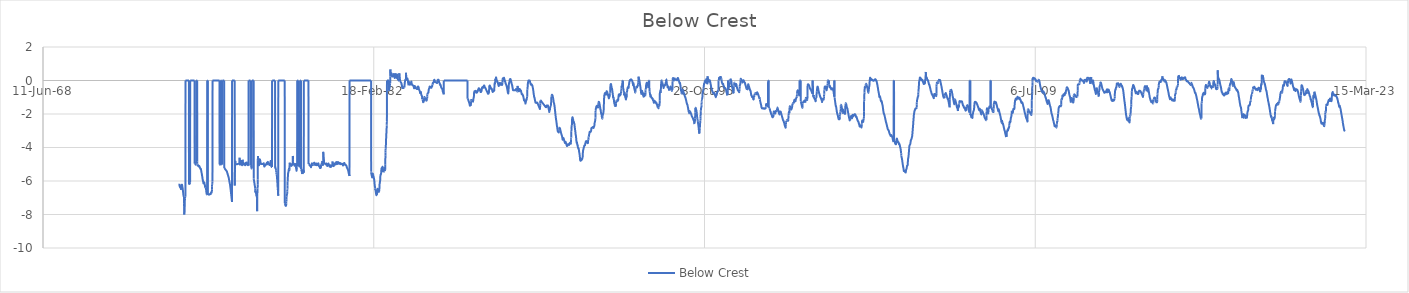
| Category | Below Crest  |
|---|---|
| 27061.0 | -6.164 |
| 27062.0 | -6.194 |
| 27063.0 | -6.225 |
| 27064.0 | -6.255 |
| 27065.0 | -6.286 |
| 27066.0 | -6.309 |
| 27067.0 | -6.32 |
| 27068.0 | -6.331 |
| 27069.0 | -6.342 |
| 27070.0 | -6.353 |
| 27071.0 | -6.363 |
| 27072.0 | -6.374 |
| 27073.0 | -6.383 |
| 27074.0 | -6.363 |
| 27075.0 | -6.334 |
| 27076.0 | -6.311 |
| 27077.0 | -6.324 |
| 27078.0 | -6.342 |
| 27079.0 | -6.361 |
| 27080.0 | -6.379 |
| 27081.0 | -6.398 |
| 27082.0 | -6.416 |
| 27083.0 | -6.435 |
| 27084.0 | -6.453 |
| 27085.0 | -6.472 |
| 27086.0 | -6.491 |
| 27087.0 | -6.521 |
| 27088.0 | -6.469 |
| 27089.0 | -6.413 |
| 27090.0 | -6.357 |
| 27091.0 | -6.302 |
| 27092.0 | -6.25 |
| 27093.0 | -6.237 |
| 27094.0 | -6.234 |
| 27095.0 | -6.231 |
| 27096.0 | -6.229 |
| 27097.0 | -6.226 |
| 27098.0 | -6.223 |
| 27099.0 | -6.22 |
| 27100.0 | -6.218 |
| 27101.0 | -6.218 |
| 27102.0 | -6.238 |
| 27103.0 | -6.261 |
| 27104.0 | -6.284 |
| 27105.0 | -6.306 |
| 27106.0 | -6.329 |
| 27107.0 | -6.352 |
| 27108.0 | -6.375 |
| 27109.0 | -6.398 |
| 27110.0 | -6.421 |
| 27111.0 | -6.444 |
| 27112.0 | -6.472 |
| 27113.0 | -6.506 |
| 27114.0 | -6.541 |
| 27115.0 | -6.575 |
| 27116.0 | -6.609 |
| 27117.0 | -6.644 |
| 27118.0 | -6.678 |
| 27119.0 | -6.712 |
| 27120.0 | -6.747 |
| 27121.0 | -6.782 |
| 27122.0 | -6.817 |
| 27123.0 | -6.852 |
| 27124.0 | -6.882 |
| 27125.0 | -6.893 |
| 27126.0 | -6.9 |
| 27127.0 | -6.907 |
| 27128.0 | -6.928 |
| 27129.0 | -6.935 |
| 27130.0 | -6.935 |
| 27131.0 | -6.935 |
| 27132.0 | -7.075 |
| 27133.0 | -7.355 |
| 27134.0 | -7.635 |
| 27135.0 | -7.915 |
| 27136.0 | -8.006 |
| 27137.0 | -7.909 |
| 27138.0 | -7.811 |
| 27139.0 | -7.714 |
| 27140.0 | -7.616 |
| 27141.0 | -7.518 |
| 27142.0 | -7.421 |
| 27143.0 | -7.323 |
| 27144.0 | -7.226 |
| 27145.0 | -7.128 |
| 27146.0 | -7.05 |
| 27147.0 | -7.02 |
| 27148.0 | -6.992 |
| 27149.0 | -6.967 |
| 27150.0 | -6.957 |
| 27151.0 | -6.949 |
| 27152.0 | -6.941 |
| 27153.0 | -6.934 |
| 27154.0 | 0 |
| 27155.0 | 0 |
| 27156.0 | 0 |
| 27157.0 | 0 |
| 27158.0 | 0 |
| 27159.0 | 0 |
| 27160.0 | 0 |
| 27161.0 | 0 |
| 27162.0 | 0 |
| 27163.0 | 0 |
| 27164.0 | 0 |
| 27165.0 | 0 |
| 27166.0 | 0 |
| 27167.0 | 0 |
| 27168.0 | 0 |
| 27169.0 | 0 |
| 27170.0 | 0 |
| 27171.0 | 0 |
| 27172.0 | 0 |
| 27173.0 | 0 |
| 27174.0 | 0 |
| 27175.0 | 0 |
| 27176.0 | 0 |
| 27177.0 | 0 |
| 27178.0 | 0 |
| 27179.0 | 0 |
| 27180.0 | 0 |
| 27181.0 | 0 |
| 27182.0 | 0 |
| 27183.0 | 0 |
| 27184.0 | 0 |
| 27185.0 | 0 |
| 27186.0 | 0 |
| 27187.0 | 0 |
| 27188.0 | 0 |
| 27189.0 | 0 |
| 27190.0 | 0 |
| 27191.0 | 0 |
| 27192.0 | 0 |
| 27193.0 | 0 |
| 27194.0 | 0 |
| 27195.0 | 0 |
| 27196.0 | 0 |
| 27197.0 | 0 |
| 27198.0 | 0 |
| 27199.0 | 0 |
| 27200.0 | 0 |
| 27201.0 | 0 |
| 27202.0 | 0 |
| 27203.0 | 0 |
| 27204.0 | 0 |
| 27205.0 | 0 |
| 27206.0 | 0 |
| 27207.0 | -6.215 |
| 27208.0 | -6.209 |
| 27209.0 | -6.204 |
| 27210.0 | -6.198 |
| 27211.0 | -6.193 |
| 27212.0 | -6.187 |
| 27213.0 | -6.182 |
| 27214.0 | -6.176 |
| 27215.0 | -6.17 |
| 27216.0 | -6.165 |
| 27217.0 | -6.159 |
| 27218.0 | -6.154 |
| 27219.0 | -6.148 |
| 27220.0 | -6.142 |
| 27221.0 | -6.137 |
| 27222.0 | -6.131 |
| 27223.0 | -6.122 |
| 27224.0 | -6.069 |
| 27225.0 | 0 |
| 27226.0 | 0 |
| 27227.0 | 0 |
| 27228.0 | 0 |
| 27229.0 | 0 |
| 27230.0 | 0 |
| 27231.0 | 0 |
| 27232.0 | 0 |
| 27233.0 | 0 |
| 27234.0 | 0 |
| 27235.0 | 0 |
| 27236.0 | 0 |
| 27237.0 | 0 |
| 27238.0 | 0 |
| 27239.0 | 0 |
| 27240.0 | 0 |
| 27241.0 | 0 |
| 27242.0 | 0 |
| 27243.0 | 0 |
| 27244.0 | 0 |
| 27245.0 | 0 |
| 27246.0 | 0 |
| 27247.0 | 0 |
| 27248.0 | 0 |
| 27249.0 | 0 |
| 27250.0 | 0 |
| 27251.0 | 0 |
| 27252.0 | 0 |
| 27253.0 | 0 |
| 27254.0 | 0 |
| 27255.0 | 0 |
| 27256.0 | 0 |
| 27257.0 | 0 |
| 27258.0 | 0 |
| 27259.0 | 0 |
| 27260.0 | 0 |
| 27261.0 | 0 |
| 27262.0 | 0 |
| 27263.0 | 0 |
| 27264.0 | 0 |
| 27265.0 | 0 |
| 27266.0 | 0 |
| 27267.0 | 0 |
| 27268.0 | 0 |
| 27269.0 | 0 |
| 27270.0 | 0 |
| 27271.0 | 0 |
| 27272.0 | 0 |
| 27273.0 | 0 |
| 27274.0 | 0 |
| 27275.0 | 0 |
| 27276.0 | 0 |
| 27277.0 | 0 |
| 27278.0 | 0 |
| 27279.0 | 0 |
| 27280.0 | 0 |
| 27281.0 | 0 |
| 27282.0 | 0 |
| 27283.0 | 0 |
| 27284.0 | 0 |
| 27285.0 | 0 |
| 27286.0 | 0 |
| 27287.0 | 0 |
| 27288.0 | 0 |
| 27289.0 | 0 |
| 27290.0 | 0 |
| 27291.0 | 0 |
| 27292.0 | -4.96 |
| 27293.0 | -4.951 |
| 27294.0 | -4.941 |
| 27295.0 | -4.932 |
| 27296.0 | -4.923 |
| 27297.0 | -4.918 |
| 27298.0 | -4.929 |
| 27299.0 | -4.941 |
| 27300.0 | -4.952 |
| 27301.0 | -4.964 |
| 27302.0 | -4.976 |
| 27303.0 | -4.988 |
| 27304.0 | -4.999 |
| 27305.0 | -5.011 |
| 27306.0 | -5.022 |
| 27307.0 | -5.006 |
| 27308.0 | -4.973 |
| 27309.0 | -4.941 |
| 27310.0 | -4.927 |
| 27311.0 | -4.931 |
| 27312.0 | -4.935 |
| 27313.0 | -4.939 |
| 27314.0 | -4.943 |
| 27315.0 | -4.947 |
| 27316.0 | -4.951 |
| 27317.0 | 0 |
| 27318.0 | 0 |
| 27319.0 | 0 |
| 27320.0 | 0 |
| 27321.0 | 0 |
| 27322.0 | 0 |
| 27323.0 | 0 |
| 27324.0 | 0 |
| 27325.0 | 0 |
| 27326.0 | 0 |
| 27327.0 | 0 |
| 27328.0 | 0 |
| 27329.0 | 0 |
| 27330.0 | 0 |
| 27331.0 | 0 |
| 27332.0 | -4.835 |
| 27333.0 | -4.947 |
| 27334.0 | -5.009 |
| 27335.0 | -5.042 |
| 27336.0 | -5.071 |
| 27337.0 | -5.074 |
| 27338.0 | -5.073 |
| 27339.0 | -5.073 |
| 27340.0 | -5.072 |
| 27341.0 | -5.071 |
| 27342.0 | -5.07 |
| 27343.0 | -5.07 |
| 27344.0 | -5.069 |
| 27345.0 | -5.068 |
| 27346.0 | -5.067 |
| 27347.0 | -5.067 |
| 27348.0 | -5.066 |
| 27349.0 | -5.066 |
| 27350.0 | -5.078 |
| 27351.0 | -5.094 |
| 27352.0 | -5.111 |
| 27353.0 | -5.126 |
| 27354.0 | -5.127 |
| 27355.0 | -5.125 |
| 27356.0 | -5.122 |
| 27357.0 | -5.12 |
| 27358.0 | -5.118 |
| 27359.0 | -5.115 |
| 27360.0 | -5.113 |
| 27361.0 | -5.111 |
| 27362.0 | -5.109 |
| 27363.0 | -5.106 |
| 27364.0 | -5.115 |
| 27365.0 | -5.136 |
| 27366.0 | -5.157 |
| 27367.0 | -5.178 |
| 27368.0 | -5.189 |
| 27369.0 | -5.189 |
| 27370.0 | -5.19 |
| 27371.0 | -5.19 |
| 27372.0 | -5.197 |
| 27373.0 | -5.209 |
| 27374.0 | -5.221 |
| 27375.0 | -5.233 |
| 27376.0 | -5.244 |
| 27377.0 | -5.254 |
| 27378.0 | -5.264 |
| 27379.0 | -5.275 |
| 27380.0 | -5.282 |
| 27381.0 | -5.27 |
| 27382.0 | -5.258 |
| 27383.0 | -5.261 |
| 27384.0 | -5.267 |
| 27385.0 | -5.273 |
| 27386.0 | -5.279 |
| 27387.0 | -5.286 |
| 27388.0 | -5.305 |
| 27389.0 | -5.327 |
| 27390.0 | -5.348 |
| 27391.0 | -5.37 |
| 27392.0 | -5.392 |
| 27393.0 | -5.414 |
| 27394.0 | -5.435 |
| 27395.0 | -5.457 |
| 27396.0 | -5.479 |
| 27397.0 | -5.501 |
| 27398.0 | -5.522 |
| 27399.0 | -5.544 |
| 27400.0 | -5.566 |
| 27401.0 | -5.588 |
| 27402.0 | -5.609 |
| 27403.0 | -5.631 |
| 27404.0 | -5.653 |
| 27405.0 | -5.678 |
| 27406.0 | -5.704 |
| 27407.0 | -5.729 |
| 27408.0 | -5.754 |
| 27409.0 | -5.78 |
| 27410.0 | -5.805 |
| 27411.0 | -5.83 |
| 27412.0 | -5.855 |
| 27413.0 | -5.881 |
| 27414.0 | -5.906 |
| 27415.0 | -5.931 |
| 27416.0 | -5.953 |
| 27417.0 | -5.969 |
| 27418.0 | -5.986 |
| 27419.0 | -6.003 |
| 27420.0 | -6.02 |
| 27421.0 | -6.036 |
| 27422.0 | -6.053 |
| 27423.0 | -6.07 |
| 27424.0 | -6.087 |
| 27425.0 | -6.101 |
| 27426.0 | -6.113 |
| 27427.0 | -6.125 |
| 27428.0 | -6.137 |
| 27429.0 | -6.153 |
| 27430.0 | -6.188 |
| 27431.0 | -6.161 |
| 27432.0 | -6.123 |
| 27433.0 | -6.09 |
| 27434.0 | -6.085 |
| 27435.0 | -6.085 |
| 27436.0 | -6.085 |
| 27437.0 | -6.085 |
| 27438.0 | -6.085 |
| 27439.0 | -6.088 |
| 27440.0 | -6.107 |
| 27441.0 | -6.129 |
| 27442.0 | -6.151 |
| 27443.0 | -6.174 |
| 27444.0 | -6.196 |
| 27445.0 | -6.218 |
| 27446.0 | -6.24 |
| 27447.0 | -6.262 |
| 27448.0 | -6.284 |
| 27449.0 | -6.306 |
| 27450.0 | -6.329 |
| 27451.0 | -6.351 |
| 27452.0 | -6.373 |
| 27453.0 | -6.385 |
| 27454.0 | -6.342 |
| 27455.0 | -6.335 |
| 27456.0 | -6.335 |
| 27457.0 | -6.335 |
| 27458.0 | -6.355 |
| 27459.0 | -6.404 |
| 27460.0 | -6.418 |
| 27461.0 | -6.431 |
| 27462.0 | -6.444 |
| 27463.0 | -6.457 |
| 27464.0 | -6.472 |
| 27465.0 | -6.502 |
| 27466.0 | -6.536 |
| 27467.0 | -6.571 |
| 27468.0 | -6.605 |
| 27469.0 | -6.64 |
| 27470.0 | -6.674 |
| 27471.0 | -6.698 |
| 27472.0 | -6.718 |
| 27473.0 | -6.738 |
| 27474.0 | -6.758 |
| 27475.0 | -6.778 |
| 27476.0 | -6.797 |
| 27477.0 | -6.789 |
| 27478.0 | -6.771 |
| 27479.0 | -6.762 |
| 27480.0 | -6.777 |
| 27481.0 | -6.793 |
| 27482.0 | 0 |
| 27483.0 | 0 |
| 27484.0 | 0 |
| 27485.0 | 0 |
| 27486.0 | 0 |
| 27487.0 | 0 |
| 27488.0 | 0 |
| 27489.0 | 0 |
| 27490.0 | 0 |
| 27491.0 | 0 |
| 27492.0 | 0 |
| 27493.0 | -6.842 |
| 27494.0 | -6.837 |
| 27495.0 | -6.833 |
| 27496.0 | -6.829 |
| 27497.0 | -6.825 |
| 27498.0 | -6.821 |
| 27499.0 | -6.817 |
| 27500.0 | -6.813 |
| 27501.0 | -6.809 |
| 27502.0 | -6.806 |
| 27503.0 | -6.806 |
| 27504.0 | -6.807 |
| 27505.0 | -6.808 |
| 27506.0 | -6.809 |
| 27507.0 | -6.81 |
| 27508.0 | -6.811 |
| 27509.0 | -6.812 |
| 27510.0 | -6.813 |
| 27511.0 | -6.814 |
| 27512.0 | -6.815 |
| 27513.0 | -6.813 |
| 27514.0 | -6.811 |
| 27515.0 | -6.809 |
| 27516.0 | -6.807 |
| 27517.0 | -6.805 |
| 27518.0 | -6.804 |
| 27519.0 | -6.802 |
| 27520.0 | -6.8 |
| 27521.0 | -6.798 |
| 27522.0 | -6.796 |
| 27523.0 | -6.792 |
| 27524.0 | -6.787 |
| 27525.0 | -6.782 |
| 27526.0 | -6.777 |
| 27527.0 | -6.771 |
| 27528.0 | -6.766 |
| 27529.0 | -6.761 |
| 27530.0 | -6.756 |
| 27531.0 | -6.75 |
| 27532.0 | -6.745 |
| 27533.0 | -6.743 |
| 27534.0 | -6.758 |
| 27535.0 | -6.776 |
| 27536.0 | -6.776 |
| 27537.0 | -6.757 |
| 27538.0 | -6.739 |
| 27539.0 | -6.72 |
| 27540.0 | -6.702 |
| 27541.0 | -6.686 |
| 27542.0 | -6.685 |
| 27543.0 | -6.686 |
| 27544.0 | -6.688 |
| 27545.0 | -6.689 |
| 27546.0 | -6.691 |
| 27547.0 | -6.693 |
| 27548.0 | -6.694 |
| 27549.0 | -6.683 |
| 27550.0 | -6.659 |
| 27551.0 | -6.636 |
| 27552.0 | -6.612 |
| 27553.0 | -6.588 |
| 27554.0 | -6.565 |
| 27555.0 | -6.502 |
| 27556.0 | -6.314 |
| 27557.0 | -6.2 |
| 27558.0 | -6.17 |
| 27559.0 | -6.14 |
| 27560.0 | -6.11 |
| 27561.0 | -6.075 |
| 27562.0 | -6.035 |
| 27563.0 | 0 |
| 27564.0 | 0 |
| 27565.0 | 0 |
| 27566.0 | 0 |
| 27567.0 | 0 |
| 27568.0 | 0 |
| 27569.0 | 0 |
| 27570.0 | 0 |
| 27571.0 | 0 |
| 27572.0 | 0 |
| 27573.0 | 0 |
| 27574.0 | 0 |
| 27575.0 | 0 |
| 27576.0 | 0 |
| 27577.0 | 0 |
| 27578.0 | 0 |
| 27579.0 | 0 |
| 27580.0 | 0 |
| 27581.0 | 0 |
| 27582.0 | 0 |
| 27583.0 | 0 |
| 27584.0 | 0 |
| 27585.0 | 0 |
| 27586.0 | 0 |
| 27587.0 | 0 |
| 27588.0 | 0 |
| 27589.0 | 0 |
| 27590.0 | 0 |
| 27591.0 | 0 |
| 27592.0 | 0 |
| 27593.0 | 0 |
| 27594.0 | 0 |
| 27595.0 | 0 |
| 27596.0 | 0 |
| 27597.0 | 0 |
| 27598.0 | 0 |
| 27599.0 | 0 |
| 27600.0 | 0 |
| 27601.0 | 0 |
| 27602.0 | 0 |
| 27603.0 | 0 |
| 27604.0 | 0 |
| 27605.0 | 0 |
| 27606.0 | 0 |
| 27607.0 | 0 |
| 27608.0 | 0 |
| 27609.0 | 0 |
| 27610.0 | 0 |
| 27611.0 | 0 |
| 27612.0 | 0 |
| 27613.0 | 0 |
| 27614.0 | 0 |
| 27615.0 | 0 |
| 27616.0 | 0 |
| 27617.0 | 0 |
| 27618.0 | 0 |
| 27619.0 | 0 |
| 27620.0 | 0 |
| 27621.0 | 0 |
| 27622.0 | 0 |
| 27623.0 | 0 |
| 27624.0 | 0 |
| 27625.0 | 0 |
| 27626.0 | 0 |
| 27627.0 | 0 |
| 27628.0 | 0 |
| 27629.0 | 0 |
| 27630.0 | 0 |
| 27631.0 | 0 |
| 27632.0 | 0 |
| 27633.0 | 0 |
| 27634.0 | 0 |
| 27635.0 | 0 |
| 27636.0 | 0 |
| 27637.0 | 0 |
| 27638.0 | 0 |
| 27639.0 | 0 |
| 27640.0 | 0 |
| 27641.0 | 0 |
| 27642.0 | 0 |
| 27643.0 | 0 |
| 27644.0 | 0 |
| 27645.0 | 0 |
| 27646.0 | 0 |
| 27647.0 | 0 |
| 27648.0 | 0 |
| 27649.0 | 0 |
| 27650.0 | 0 |
| 27651.0 | 0 |
| 27652.0 | 0 |
| 27653.0 | 0 |
| 27654.0 | 0 |
| 27655.0 | 0 |
| 27656.0 | 0 |
| 27657.0 | 0 |
| 27658.0 | 0 |
| 27659.0 | 0 |
| 27660.0 | 0 |
| 27661.0 | 0 |
| 27662.0 | 0 |
| 27663.0 | 0 |
| 27664.0 | 0 |
| 27665.0 | 0 |
| 27666.0 | 0 |
| 27667.0 | 0 |
| 27668.0 | 0 |
| 27669.0 | -4.984 |
| 27670.0 | -4.998 |
| 27671.0 | -5.011 |
| 27672.0 | -5.016 |
| 27673.0 | -5.017 |
| 27674.0 | -5.018 |
| 27675.0 | -5.018 |
| 27676.0 | -5.019 |
| 27677.0 | -5.02 |
| 27678.0 | -5.021 |
| 27679.0 | -5.022 |
| 27680.0 | -5.023 |
| 27681.0 | -5.024 |
| 27682.0 | -5.027 |
| 27683.0 | -5.043 |
| 27684.0 | -5.062 |
| 27685.0 | 0 |
| 27686.0 | 0 |
| 27687.0 | 0 |
| 27688.0 | 0 |
| 27689.0 | 0 |
| 27690.0 | 0 |
| 27691.0 | 0 |
| 27692.0 | 0 |
| 27693.0 | 0 |
| 27694.0 | 0 |
| 27695.0 | 0 |
| 27696.0 | 0 |
| 27697.0 | 0 |
| 27698.0 | 0 |
| 27699.0 | -4.996 |
| 27700.0 | -4.997 |
| 27701.0 | -4.998 |
| 27702.0 | -4.999 |
| 27703.0 | -5 |
| 27704.0 | -5 |
| 27705.0 | -5.001 |
| 27706.0 | -5.002 |
| 27707.0 | -5.003 |
| 27708.0 | -5.004 |
| 27709.0 | -5.005 |
| 27710.0 | -5.008 |
| 27711.0 | -5.012 |
| 27712.0 | 0 |
| 27713.0 | 0 |
| 27714.0 | 0 |
| 27715.0 | 0 |
| 27716.0 | 0 |
| 27717.0 | 0 |
| 27718.0 | 0 |
| 27719.0 | 0 |
| 27720.0 | 0 |
| 27721.0 | 0 |
| 27722.0 | 0 |
| 27723.0 | 0 |
| 27724.0 | 0 |
| 27725.0 | 0 |
| 27726.0 | 0 |
| 27727.0 | 0 |
| 27728.0 | 0 |
| 27729.0 | 0 |
| 27730.0 | 0 |
| 27731.0 | 0 |
| 27732.0 | 0 |
| 27733.0 | 0 |
| 27734.0 | 0 |
| 27735.0 | 0 |
| 27736.0 | 0 |
| 27737.0 | 0 |
| 27738.0 | 0 |
| 27739.0 | 0 |
| 27740.0 | -5.22 |
| 27741.0 | -5.225 |
| 27742.0 | -5.23 |
| 27743.0 | -5.236 |
| 27744.0 | -5.241 |
| 27745.0 | -5.246 |
| 27746.0 | -5.251 |
| 27747.0 | -5.257 |
| 27748.0 | -5.262 |
| 27749.0 | -5.267 |
| 27750.0 | -5.272 |
| 27751.0 | -5.278 |
| 27752.0 | -5.283 |
| 27753.0 | -5.288 |
| 27754.0 | -5.293 |
| 27755.0 | -5.299 |
| 27756.0 | -5.304 |
| 27757.0 | -5.309 |
| 27758.0 | -5.314 |
| 27759.0 | -5.32 |
| 27760.0 | -5.325 |
| 27761.0 | -5.33 |
| 27762.0 | -5.335 |
| 27763.0 | -5.341 |
| 27764.0 | -5.346 |
| 27765.0 | -5.351 |
| 27766.0 | -5.356 |
| 27767.0 | -5.362 |
| 27768.0 | -5.367 |
| 27769.0 | -5.372 |
| 27770.0 | -5.377 |
| 27771.0 | -5.383 |
| 27772.0 | -5.388 |
| 27773.0 | -5.393 |
| 27774.0 | -5.398 |
| 27775.0 | -5.404 |
| 27776.0 | -5.409 |
| 27777.0 | -5.414 |
| 27778.0 | -5.419 |
| 27779.0 | -5.425 |
| 27780.0 | -5.437 |
| 27781.0 | -5.45 |
| 27782.0 | -5.464 |
| 27783.0 | -5.477 |
| 27784.0 | -5.49 |
| 27785.0 | -5.503 |
| 27786.0 | -5.516 |
| 27787.0 | -5.529 |
| 27788.0 | -5.542 |
| 27789.0 | -5.555 |
| 27790.0 | -5.568 |
| 27791.0 | -5.582 |
| 27792.0 | -5.595 |
| 27793.0 | -5.608 |
| 27794.0 | -5.621 |
| 27795.0 | -5.634 |
| 27796.0 | -5.647 |
| 27797.0 | -5.66 |
| 27798.0 | -5.673 |
| 27799.0 | -5.687 |
| 27800.0 | -5.7 |
| 27801.0 | -5.713 |
| 27802.0 | -5.726 |
| 27803.0 | -5.739 |
| 27804.0 | -5.752 |
| 27805.0 | -5.765 |
| 27806.0 | -5.778 |
| 27807.0 | -5.792 |
| 27808.0 | -5.806 |
| 27809.0 | -5.828 |
| 27810.0 | -5.851 |
| 27811.0 | -5.875 |
| 27812.0 | -5.898 |
| 27813.0 | -5.921 |
| 27814.0 | -5.945 |
| 27815.0 | -5.966 |
| 27816.0 | -5.987 |
| 27817.0 | -6.009 |
| 27818.0 | -6.03 |
| 27819.0 | -6.051 |
| 27820.0 | -6.073 |
| 27821.0 | -6.094 |
| 27822.0 | -6.115 |
| 27823.0 | -6.136 |
| 27824.0 | -6.158 |
| 27825.0 | -6.179 |
| 27826.0 | -6.2 |
| 27827.0 | -6.222 |
| 27828.0 | -6.244 |
| 27829.0 | -6.273 |
| 27830.0 | -6.305 |
| 27831.0 | -6.336 |
| 27832.0 | -6.367 |
| 27833.0 | -6.399 |
| 27834.0 | -6.43 |
| 27835.0 | -6.461 |
| 27836.0 | -6.494 |
| 27837.0 | -6.529 |
| 27838.0 | -6.564 |
| 27839.0 | -6.6 |
| 27840.0 | -6.635 |
| 27841.0 | -6.67 |
| 27842.0 | -6.706 |
| 27843.0 | -6.741 |
| 27844.0 | -6.776 |
| 27845.0 | -6.812 |
| 27846.0 | -6.847 |
| 27847.0 | -6.882 |
| 27848.0 | -6.917 |
| 27849.0 | -6.953 |
| 27850.0 | -6.988 |
| 27851.0 | -7.023 |
| 27852.0 | -7.059 |
| 27853.0 | -7.094 |
| 27854.0 | -7.129 |
| 27855.0 | -7.165 |
| 27856.0 | -7.201 |
| 27857.0 | -7.247 |
| 27858.0 | 0 |
| 27859.0 | 0 |
| 27860.0 | 0 |
| 27861.0 | 0 |
| 27862.0 | 0 |
| 27863.0 | 0 |
| 27864.0 | 0 |
| 27865.0 | 0 |
| 27866.0 | 0 |
| 27867.0 | 0 |
| 27868.0 | 0 |
| 27869.0 | 0 |
| 27870.0 | 0 |
| 27871.0 | 0 |
| 27872.0 | 0 |
| 27873.0 | 0 |
| 27874.0 | 0 |
| 27875.0 | 0 |
| 27876.0 | 0 |
| 27877.0 | 0 |
| 27878.0 | 0 |
| 27879.0 | 0 |
| 27880.0 | 0 |
| 27881.0 | 0 |
| 27882.0 | 0 |
| 27883.0 | 0 |
| 27884.0 | 0 |
| 27885.0 | 0 |
| 27886.0 | 0 |
| 27887.0 | 0 |
| 27888.0 | 0 |
| 27889.0 | 0 |
| 27890.0 | 0 |
| 27891.0 | 0 |
| 27892.0 | 0 |
| 27893.0 | 0 |
| 27894.0 | 0 |
| 27895.0 | 0 |
| 27896.0 | 0 |
| 27897.0 | 0 |
| 27898.0 | 0 |
| 27899.0 | -6.265 |
| 27900.0 | -5.792 |
| 27901.0 | -5.331 |
| 27902.0 | -5.011 |
| 27903.0 | -4.928 |
| 27904.0 | -4.911 |
| 27905.0 | -4.894 |
| 27906.0 | -4.811 |
| 27907.0 | -4.791 |
| 27908.0 | -4.838 |
| 27909.0 | -4.886 |
| 27910.0 | -4.933 |
| 27911.0 | -4.965 |
| 27912.0 | -4.969 |
| 27913.0 | -4.971 |
| 27914.0 | -4.974 |
| 27915.0 | -4.977 |
| 27916.0 | -4.98 |
| 27917.0 | -4.982 |
| 27918.0 | -4.985 |
| 27919.0 | -4.988 |
| 27920.0 | -4.991 |
| 27921.0 | -4.993 |
| 27922.0 | -4.996 |
| 27923.0 | -4.999 |
| 27924.0 | -5.001 |
| 27925.0 | -5.004 |
| 27926.0 | -5.006 |
| 27927.0 | -5.006 |
| 27928.0 | -5.005 |
| 27929.0 | -5.003 |
| 27930.0 | -5.002 |
| 27931.0 | -5.001 |
| 27932.0 | -4.999 |
| 27933.0 | -4.998 |
| 27934.0 | -4.997 |
| 27935.0 | -4.996 |
| 27936.0 | -4.994 |
| 27937.0 | -4.993 |
| 27938.0 | -4.992 |
| 27939.0 | -4.991 |
| 27940.0 | -4.989 |
| 27941.0 | -4.988 |
| 27942.0 | -4.987 |
| 27943.0 | -4.986 |
| 27944.0 | -4.984 |
| 27945.0 | -4.983 |
| 27946.0 | -4.982 |
| 27947.0 | -4.98 |
| 27948.0 | -4.979 |
| 27949.0 | -4.978 |
| 27950.0 | -4.977 |
| 27951.0 | -4.975 |
| 27952.0 | -4.974 |
| 27953.0 | -4.973 |
| 27954.0 | -4.972 |
| 27955.0 | -4.97 |
| 27956.0 | -4.969 |
| 27957.0 | -4.968 |
| 27958.0 | -4.967 |
| 27959.0 | -4.965 |
| 27960.0 | -4.964 |
| 27961.0 | -4.963 |
| 27962.0 | -4.961 |
| 27963.0 | -4.96 |
| 27964.0 | -4.959 |
| 27965.0 | -4.958 |
| 27966.0 | -4.956 |
| 27967.0 | -4.954 |
| 27968.0 | -4.944 |
| 27969.0 | -4.931 |
| 27970.0 | -4.919 |
| 27971.0 | -4.872 |
| 27972.0 | -4.608 |
| 27973.0 | -4.651 |
| 27974.0 | -4.737 |
| 27975.0 | -4.799 |
| 27976.0 | -4.862 |
| 27977.0 | -4.924 |
| 27978.0 | -4.985 |
| 27979.0 | -5.019 |
| 27980.0 | -5.043 |
| 27981.0 | -5.063 |
| 27982.0 | -5.024 |
| 27983.0 | -4.963 |
| 27984.0 | -4.902 |
| 27985.0 | -4.841 |
| 27986.0 | -4.832 |
| 27987.0 | -4.791 |
| 27988.0 | -4.754 |
| 27989.0 | -4.813 |
| 27990.0 | -4.872 |
| 27991.0 | -4.931 |
| 27992.0 | -4.976 |
| 27993.0 | -4.976 |
| 27994.0 | -4.972 |
| 27995.0 | -4.968 |
| 27996.0 | -4.964 |
| 27997.0 | -4.961 |
| 27998.0 | -4.957 |
| 27999.0 | -4.781 |
| 28000.0 | -4.744 |
| 28001.0 | -4.788 |
| 28002.0 | -4.833 |
| 28003.0 | -4.877 |
| 28004.0 | -4.92 |
| 28005.0 | -4.95 |
| 28006.0 | -4.978 |
| 28007.0 | -5.005 |
| 28008.0 | -5.032 |
| 28009.0 | -5.053 |
| 28010.0 | -5.055 |
| 28011.0 | -5.055 |
| 28012.0 | -5.05 |
| 28013.0 | -5.031 |
| 28014.0 | -5.011 |
| 28015.0 | -4.991 |
| 28016.0 | -4.971 |
| 28017.0 | -4.902 |
| 28018.0 | -4.734 |
| 28019.0 | -4.754 |
| 28020.0 | -4.8 |
| 28021.0 | -4.847 |
| 28022.0 | -4.893 |
| 28023.0 | -4.94 |
| 28024.0 | -4.987 |
| 28025.0 | -5.01 |
| 28026.0 | -5.01 |
| 28027.0 | -5.01 |
| 28028.0 | -5.01 |
| 28029.0 | -5.009 |
| 28030.0 | -5.006 |
| 28031.0 | -5.003 |
| 28032.0 | -5 |
| 28033.0 | -4.997 |
| 28034.0 | -4.994 |
| 28035.0 | -4.992 |
| 28036.0 | -4.989 |
| 28037.0 | -4.986 |
| 28038.0 | -4.983 |
| 28039.0 | -4.98 |
| 28040.0 | -4.98 |
| 28041.0 | -4.98 |
| 28042.0 | -4.98 |
| 28043.0 | -4.98 |
| 28044.0 | -4.98 |
| 28045.0 | -4.98 |
| 28046.0 | -4.98 |
| 28047.0 | -4.98 |
| 28048.0 | -4.982 |
| 28049.0 | -4.995 |
| 28050.0 | -5.032 |
| 28051.0 | -5.039 |
| 28052.0 | -5.042 |
| 28053.0 | -5.046 |
| 28054.0 | -5.055 |
| 28055.0 | -5.055 |
| 28056.0 | -5.055 |
| 28057.0 | -5.055 |
| 28058.0 | -5.055 |
| 28059.0 | -5.035 |
| 28060.0 | -5.007 |
| 28061.0 | -4.954 |
| 28062.0 | -4.88 |
| 28063.0 | -4.889 |
| 28064.0 | -4.918 |
| 28065.0 | -4.949 |
| 28066.0 | -4.963 |
| 28067.0 | -4.963 |
| 28068.0 | -4.971 |
| 28069.0 | -4.983 |
| 28070.0 | -5.001 |
| 28071.0 | -4.992 |
| 28072.0 | -4.983 |
| 28073.0 | -4.974 |
| 28074.0 | -4.969 |
| 28075.0 | -4.964 |
| 28076.0 | -4.905 |
| 28077.0 | -4.851 |
| 28078.0 | -4.857 |
| 28079.0 | -4.883 |
| 28080.0 | -4.9 |
| 28081.0 | -4.919 |
| 28082.0 | -4.943 |
| 28083.0 | -4.955 |
| 28084.0 | -4.971 |
| 28085.0 | -4.983 |
| 28086.0 | -4.988 |
| 28087.0 | -4.994 |
| 28088.0 | -4.999 |
| 28089.0 | -5.005 |
| 28090.0 | -5.011 |
| 28091.0 | -5.016 |
| 28092.0 | -5.022 |
| 28093.0 | -5.027 |
| 28094.0 | -5.033 |
| 28095.0 | -5.039 |
| 28096.0 | -5.049 |
| 28097.0 | -5.084 |
| 28098.0 | -5.042 |
| 28099.0 | -5.033 |
| 28100.0 | -5.03 |
| 28101.0 | -5.028 |
| 28102.0 | -5.03 |
| 28103.0 | -5.056 |
| 28104.0 | -5.063 |
| 28105.0 | -5.07 |
| 28106.0 | -5.062 |
| 28107.0 | -5.082 |
| 28108.0 | 0 |
| 28109.0 | 0 |
| 28110.0 | 0 |
| 28111.0 | 0 |
| 28112.0 | 0 |
| 28113.0 | 0 |
| 28114.0 | 0 |
| 28115.0 | 0 |
| 28116.0 | 0 |
| 28117.0 | 0 |
| 28118.0 | 0 |
| 28119.0 | 0 |
| 28120.0 | 0 |
| 28121.0 | 0 |
| 28122.0 | 0 |
| 28123.0 | 0 |
| 28124.0 | 0 |
| 28125.0 | 0 |
| 28126.0 | 0 |
| 28127.0 | 0 |
| 28128.0 | 0 |
| 28129.0 | 0 |
| 28130.0 | 0 |
| 28131.0 | 0 |
| 28132.0 | 0 |
| 28133.0 | 0 |
| 28134.0 | 0 |
| 28135.0 | 0 |
| 28136.0 | 0 |
| 28137.0 | 0 |
| 28138.0 | -5.057 |
| 28139.0 | -5.045 |
| 28140.0 | -5.04 |
| 28141.0 | -5.023 |
| 28142.0 | -5.012 |
| 28143.0 | -5.04 |
| 28144.0 | -5.046 |
| 28145.0 | -5.05 |
| 28146.0 | -5.059 |
| 28147.0 | -5.09 |
| 28148.0 | -5.123 |
| 28149.0 | -5.142 |
| 28150.0 | -5.16 |
| 28151.0 | -5.177 |
| 28152.0 | -5.207 |
| 28153.0 | -5.245 |
| 28154.0 | -5.254 |
| 28155.0 | -5.245 |
| 28156.0 | -5.235 |
| 28157.0 | 0 |
| 28158.0 | 0 |
| 28159.0 | 0 |
| 28160.0 | 0 |
| 28161.0 | 0 |
| 28162.0 | 0 |
| 28163.0 | 0 |
| 28164.0 | 0 |
| 28165.0 | 0 |
| 28166.0 | 0 |
| 28167.0 | 0 |
| 28168.0 | 0 |
| 28169.0 | 0 |
| 28170.0 | 0 |
| 28171.0 | 0 |
| 28172.0 | 0 |
| 28173.0 | 0 |
| 28174.0 | 0 |
| 28175.0 | 0 |
| 28176.0 | 0 |
| 28177.0 | 0 |
| 28178.0 | 0 |
| 28179.0 | 0 |
| 28180.0 | 0 |
| 28181.0 | 0 |
| 28182.0 | 0 |
| 28183.0 | 0 |
| 28184.0 | 0 |
| 28185.0 | 0 |
| 28186.0 | -5.855 |
| 28187.0 | -5.887 |
| 28188.0 | -5.937 |
| 28189.0 | -5.969 |
| 28190.0 | -5.975 |
| 28191.0 | -5.997 |
| 28192.0 | -6.022 |
| 28193.0 | -6.045 |
| 28194.0 | -6.082 |
| 28195.0 | -6.105 |
| 28196.0 | -6.122 |
| 28197.0 | -6.149 |
| 28198.0 | -6.158 |
| 28199.0 | -6.208 |
| 28200.0 | -6.229 |
| 28201.0 | -6.247 |
| 28202.0 | -6.273 |
| 28203.0 | -6.304 |
| 28204.0 | -6.326 |
| 28205.0 | -6.346 |
| 28206.0 | -6.373 |
| 28207.0 | -6.402 |
| 28208.0 | -6.426 |
| 28209.0 | -6.454 |
| 28210.0 | -6.579 |
| 28211.0 | -6.673 |
| 28212.0 | -6.684 |
| 28213.0 | -6.575 |
| 28214.0 | -6.575 |
| 28215.0 | -6.617 |
| 28216.0 | -6.632 |
| 28217.0 | -6.652 |
| 28218.0 | -6.674 |
| 28219.0 | -6.697 |
| 28220.0 | -6.722 |
| 28221.0 | -6.741 |
| 28222.0 | -6.757 |
| 28223.0 | -6.806 |
| 28224.0 | -6.841 |
| 28225.0 | -6.855 |
| 28226.0 | -6.879 |
| 28227.0 | -6.867 |
| 28228.0 | -6.865 |
| 28229.0 | -6.865 |
| 28230.0 | -6.865 |
| 28231.0 | -6.867 |
| 28232.0 | -6.908 |
| 28233.0 | -6.961 |
| 28234.0 | -7.012 |
| 28235.0 | -7.055 |
| 28236.0 | -7.312 |
| 28237.0 | -7.788 |
| 28238.0 | -7.802 |
| 28239.0 | -7.355 |
| 28240.0 | -6.908 |
| 28241.0 | -6.654 |
| 28242.0 | -6.591 |
| 28243.0 | -6.528 |
| 28244.0 | -6.452 |
| 28245.0 | -6.298 |
| 28246.0 | -6.19 |
| 28247.0 | -5.915 |
| 28248.0 | -4.778 |
| 28249.0 | -4.504 |
| 28250.0 | -4.581 |
| 28251.0 | -4.694 |
| 28252.0 | -4.754 |
| 28253.0 | -4.813 |
| 28254.0 | -4.86 |
| 28255.0 | -4.902 |
| 28256.0 | -4.923 |
| 28257.0 | -4.94 |
| 28258.0 | -4.957 |
| 28259.0 | -4.974 |
| 28260.0 | -4.991 |
| 28261.0 | -5.008 |
| 28262.0 | -5.025 |
| 28263.0 | -5.042 |
| 28264.0 | -5.06 |
| 28265.0 | -5.066 |
| 28266.0 | -5.029 |
| 28267.0 | -4.988 |
| 28268.0 | -4.946 |
| 28269.0 | -4.899 |
| 28270.0 | -4.719 |
| 28271.0 | -4.662 |
| 28272.0 | -4.715 |
| 28273.0 | -4.753 |
| 28274.0 | -4.755 |
| 28275.0 | -4.711 |
| 28276.0 | -4.692 |
| 28277.0 | -4.743 |
| 28278.0 | -4.793 |
| 28279.0 | -4.842 |
| 28280.0 | -4.889 |
| 28281.0 | -4.857 |
| 28282.0 | -4.813 |
| 28283.0 | -4.789 |
| 28284.0 | -4.772 |
| 28285.0 | -4.797 |
| 28286.0 | -4.829 |
| 28287.0 | -4.861 |
| 28288.0 | -4.893 |
| 28289.0 | -4.926 |
| 28290.0 | -4.958 |
| 28291.0 | -4.976 |
| 28292.0 | -4.977 |
| 28293.0 | -4.979 |
| 28294.0 | -4.98 |
| 28295.0 | -4.982 |
| 28296.0 | -4.983 |
| 28297.0 | -4.985 |
| 28298.0 | -4.984 |
| 28299.0 | -4.983 |
| 28300.0 | -4.982 |
| 28301.0 | -4.981 |
| 28302.0 | -4.98 |
| 28303.0 | -4.979 |
| 28304.0 | -4.978 |
| 28305.0 | -4.977 |
| 28306.0 | -4.976 |
| 28307.0 | -4.976 |
| 28308.0 | -4.978 |
| 28309.0 | -4.98 |
| 28310.0 | -4.982 |
| 28311.0 | -4.984 |
| 28312.0 | -4.985 |
| 28313.0 | -4.985 |
| 28314.0 | -4.985 |
| 28315.0 | -4.985 |
| 28316.0 | -4.985 |
| 28317.0 | -4.985 |
| 28318.0 | -4.984 |
| 28319.0 | -4.982 |
| 28320.0 | -4.98 |
| 28321.0 | -4.978 |
| 28322.0 | -4.976 |
| 28323.0 | -4.976 |
| 28324.0 | -4.977 |
| 28325.0 | -4.978 |
| 28326.0 | -4.979 |
| 28327.0 | -4.98 |
| 28328.0 | -4.981 |
| 28329.0 | -4.982 |
| 28330.0 | -4.983 |
| 28331.0 | -4.984 |
| 28332.0 | -4.983 |
| 28333.0 | -4.975 |
| 28334.0 | -4.965 |
| 28335.0 | -4.956 |
| 28336.0 | -4.946 |
| 28337.0 | -4.939 |
| 28338.0 | -4.959 |
| 28339.0 | -4.986 |
| 28340.0 | -5.013 |
| 28341.0 | -5.04 |
| 28342.0 | -5.067 |
| 28343.0 | -5.094 |
| 28344.0 | -5.121 |
| 28345.0 | -5.135 |
| 28346.0 | -5.135 |
| 28347.0 | -5.135 |
| 28348.0 | -5.135 |
| 28349.0 | -5.13 |
| 28350.0 | -5.095 |
| 28351.0 | -5.055 |
| 28352.0 | -5.035 |
| 28353.0 | -5.035 |
| 28354.0 | -5.035 |
| 28355.0 | -5.035 |
| 28356.0 | -5.037 |
| 28357.0 | -5.042 |
| 28358.0 | -5.046 |
| 28359.0 | -5.051 |
| 28360.0 | -5.055 |
| 28361.0 | -5.06 |
| 28362.0 | -5.063 |
| 28363.0 | -5.062 |
| 28364.0 | -5.048 |
| 28365.0 | -5.034 |
| 28366.0 | -5.019 |
| 28367.0 | -5.007 |
| 28368.0 | -5.005 |
| 28369.0 | -5.005 |
| 28370.0 | -5.005 |
| 28371.0 | -5.005 |
| 28372.0 | -5.005 |
| 28373.0 | -5.005 |
| 28374.0 | -5.005 |
| 28375.0 | -5.005 |
| 28376.0 | -5.005 |
| 28377.0 | -5.005 |
| 28378.0 | -5.005 |
| 28379.0 | -5.005 |
| 28380.0 | -5.005 |
| 28381.0 | -5 |
| 28382.0 | -4.971 |
| 28383.0 | -4.939 |
| 28384.0 | -4.912 |
| 28385.0 | -4.917 |
| 28386.0 | -4.93 |
| 28387.0 | -4.943 |
| 28388.0 | -4.956 |
| 28389.0 | -4.969 |
| 28390.0 | -4.982 |
| 28391.0 | -4.995 |
| 28392.0 | -4.993 |
| 28393.0 | -4.955 |
| 28394.0 | -4.915 |
| 28395.0 | -4.881 |
| 28396.0 | -4.884 |
| 28397.0 | -4.892 |
| 28398.0 | -4.877 |
| 28399.0 | -4.859 |
| 28400.0 | -4.866 |
| 28401.0 | -4.877 |
| 28402.0 | -4.889 |
| 28403.0 | -4.9 |
| 28404.0 | -4.912 |
| 28405.0 | -4.923 |
| 28406.0 | -4.935 |
| 28407.0 | -4.946 |
| 28408.0 | -4.954 |
| 28409.0 | -4.952 |
| 28410.0 | -4.949 |
| 28411.0 | -4.946 |
| 28412.0 | -4.944 |
| 28413.0 | -4.941 |
| 28414.0 | -4.938 |
| 28415.0 | -4.937 |
| 28416.0 | -4.96 |
| 28417.0 | -4.982 |
| 28418.0 | -4.997 |
| 28419.0 | -5.011 |
| 28420.0 | -5.026 |
| 28421.0 | -5.036 |
| 28422.0 | -5.04 |
| 28423.0 | -5.043 |
| 28424.0 | -5.008 |
| 28425.0 | -4.942 |
| 28426.0 | -4.924 |
| 28427.0 | -4.953 |
| 28428.0 | -4.955 |
| 28429.0 | -4.955 |
| 28430.0 | -4.955 |
| 28431.0 | -4.955 |
| 28432.0 | -4.955 |
| 28433.0 | -4.955 |
| 28434.0 | -4.945 |
| 28435.0 | -4.925 |
| 28436.0 | -4.905 |
| 28437.0 | -4.885 |
| 28438.0 | -4.865 |
| 28439.0 | -4.845 |
| 28440.0 | -4.825 |
| 28441.0 | -4.807 |
| 28442.0 | -4.805 |
| 28443.0 | -4.807 |
| 28444.0 | -4.834 |
| 28445.0 | -4.877 |
| 28446.0 | -4.935 |
| 28447.0 | -4.993 |
| 28448.0 | -5.052 |
| 28449.0 | -5.105 |
| 28450.0 | -5.115 |
| 28451.0 | -5.115 |
| 28452.0 | -5.115 |
| 28453.0 | -5.115 |
| 28454.0 | -5.115 |
| 28455.0 | -5.116 |
| 28456.0 | -5.13 |
| 28457.0 | -5.146 |
| 28458.0 | -5.161 |
| 28459.0 | -5.165 |
| 28460.0 | -5.165 |
| 28461.0 | -5.165 |
| 28462.0 | -5.165 |
| 28463.0 | 0 |
| 28464.0 | 0 |
| 28465.0 | 0 |
| 28466.0 | 0 |
| 28467.0 | 0 |
| 28468.0 | 0 |
| 28469.0 | 0 |
| 28470.0 | 0 |
| 28471.0 | 0 |
| 28472.0 | 0 |
| 28473.0 | 0 |
| 28474.0 | 0 |
| 28475.0 | 0 |
| 28476.0 | 0 |
| 28477.0 | 0 |
| 28478.0 | 0 |
| 28479.0 | 0 |
| 28480.0 | 0 |
| 28481.0 | 0 |
| 28482.0 | 0 |
| 28483.0 | 0 |
| 28484.0 | 0 |
| 28485.0 | 0 |
| 28486.0 | 0 |
| 28487.0 | 0 |
| 28488.0 | 0 |
| 28489.0 | 0 |
| 28490.0 | 0 |
| 28491.0 | 0 |
| 28492.0 | 0 |
| 28493.0 | 0 |
| 28494.0 | 0 |
| 28495.0 | 0 |
| 28496.0 | 0 |
| 28497.0 | 0 |
| 28498.0 | 0 |
| 28499.0 | 0 |
| 28500.0 | 0 |
| 28501.0 | 0 |
| 28502.0 | 0 |
| 28503.0 | 0 |
| 28504.0 | 0 |
| 28505.0 | 0 |
| 28506.0 | 0 |
| 28507.0 | 0 |
| 28508.0 | 0 |
| 28509.0 | -5.176 |
| 28510.0 | -5.153 |
| 28511.0 | -5.164 |
| 28512.0 | -5.176 |
| 28513.0 | -5.225 |
| 28514.0 | -5.218 |
| 28515.0 | -5.246 |
| 28516.0 | -5.264 |
| 28517.0 | -5.252 |
| 28518.0 | -5.256 |
| 28519.0 | -5.272 |
| 28520.0 | -5.272 |
| 28521.0 | -5.315 |
| 28522.0 | -5.34 |
| 28523.0 | -5.37 |
| 28524.0 | -5.391 |
| 28525.0 | -5.375 |
| 28526.0 | -5.405 |
| 28527.0 | -5.396 |
| 28528.0 | -5.445 |
| 28529.0 | -5.477 |
| 28530.0 | -5.57 |
| 28531.0 | -5.553 |
| 28532.0 | -5.596 |
| 28533.0 | -5.632 |
| 28534.0 | -5.666 |
| 28535.0 | -5.687 |
| 28536.0 | -5.743 |
| 28537.0 | -5.79 |
| 28538.0 | -5.818 |
| 28539.0 | -5.863 |
| 28540.0 | -5.927 |
| 28541.0 | -5.994 |
| 28542.0 | -6.048 |
| 28543.0 | -6.097 |
| 28544.0 | -6.167 |
| 28545.0 | -6.233 |
| 28546.0 | -6.289 |
| 28547.0 | -6.35 |
| 28548.0 | -6.374 |
| 28549.0 | -6.451 |
| 28550.0 | -6.494 |
| 28551.0 | -6.563 |
| 28552.0 | -6.62 |
| 28553.0 | -6.674 |
| 28554.0 | -6.737 |
| 28555.0 | -6.809 |
| 28556.0 | -6.881 |
| 28557.0 | 0 |
| 28558.0 | 0 |
| 28559.0 | 0 |
| 28560.0 | 0 |
| 28561.0 | 0 |
| 28562.0 | 0 |
| 28563.0 | 0 |
| 28564.0 | 0 |
| 28565.0 | 0 |
| 28566.0 | 0 |
| 28567.0 | 0 |
| 28568.0 | 0 |
| 28569.0 | 0 |
| 28570.0 | 0 |
| 28571.0 | 0 |
| 28572.0 | 0 |
| 28573.0 | 0 |
| 28574.0 | 0 |
| 28575.0 | 0 |
| 28576.0 | 0 |
| 28577.0 | 0 |
| 28578.0 | 0 |
| 28579.0 | 0 |
| 28580.0 | 0 |
| 28581.0 | 0 |
| 28582.0 | 0 |
| 28583.0 | 0 |
| 28584.0 | 0 |
| 28585.0 | 0 |
| 28586.0 | 0 |
| 28587.0 | 0 |
| 28588.0 | 0 |
| 28589.0 | 0 |
| 28590.0 | 0 |
| 28591.0 | 0 |
| 28592.0 | 0 |
| 28593.0 | 0 |
| 28594.0 | 0 |
| 28595.0 | 0 |
| 28596.0 | 0 |
| 28597.0 | 0 |
| 28598.0 | 0 |
| 28599.0 | 0 |
| 28600.0 | 0 |
| 28601.0 | 0 |
| 28602.0 | 0 |
| 28603.0 | 0 |
| 28604.0 | 0 |
| 28605.0 | 0 |
| 28606.0 | 0 |
| 28607.0 | 0 |
| 28608.0 | 0 |
| 28609.0 | 0 |
| 28610.0 | 0 |
| 28611.0 | 0 |
| 28612.0 | 0 |
| 28613.0 | 0 |
| 28614.0 | 0 |
| 28615.0 | 0 |
| 28616.0 | 0 |
| 28617.0 | 0 |
| 28618.0 | 0 |
| 28619.0 | 0 |
| 28620.0 | 0 |
| 28621.0 | 0 |
| 28622.0 | 0 |
| 28623.0 | 0 |
| 28624.0 | 0 |
| 28625.0 | 0 |
| 28626.0 | 0 |
| 28627.0 | 0 |
| 28628.0 | 0 |
| 28629.0 | 0 |
| 28630.0 | 0 |
| 28631.0 | 0 |
| 28632.0 | 0 |
| 28633.0 | 0 |
| 28634.0 | 0 |
| 28635.0 | 0 |
| 28636.0 | 0 |
| 28637.0 | 0 |
| 28638.0 | 0 |
| 28639.0 | 0 |
| 28640.0 | 0 |
| 28641.0 | 0 |
| 28642.0 | 0 |
| 28643.0 | 0 |
| 28644.0 | 0 |
| 28645.0 | 0 |
| 28646.0 | 0 |
| 28647.0 | 0 |
| 28648.0 | 0 |
| 28649.0 | 0 |
| 28650.0 | 0 |
| 28651.0 | 0 |
| 28652.0 | 0 |
| 28653.0 | 0 |
| 28654.0 | 0 |
| 28655.0 | -7.316 |
| 28656.0 | -7.324 |
| 28657.0 | -7.348 |
| 28658.0 | -7.355 |
| 28659.0 | -7.38 |
| 28660.0 | -7.388 |
| 28661.0 | -7.396 |
| 28662.0 | -7.417 |
| 28663.0 | -7.444 |
| 28664.0 | -7.46 |
| 28665.0 | -7.459 |
| 28666.0 | -7.47 |
| 28667.0 | -7.478 |
| 28668.0 | -7.466 |
| 28669.0 | -7.473 |
| 28670.0 | -7.475 |
| 28671.0 | -7.47 |
| 28672.0 | -7.49 |
| 28673.0 | -7.47 |
| 28674.0 | -7.465 |
| 28675.0 | -7.465 |
| 28676.0 | -7.43 |
| 28677.0 | -7.339 |
| 28678.0 | -7.266 |
| 28679.0 | -7.224 |
| 28680.0 | -7.12 |
| 28681.0 | -7.03 |
| 28682.0 | -6.935 |
| 28683.0 | -6.936 |
| 28684.0 | -6.897 |
| 28685.0 | -6.86 |
| 28686.0 | -6.843 |
| 28687.0 | -6.803 |
| 28688.0 | -6.786 |
| 28689.0 | -6.793 |
| 28690.0 | -6.785 |
| 28691.0 | -6.764 |
| 28692.0 | -6.721 |
| 28693.0 | -6.62 |
| 28694.0 | -6.52 |
| 28695.0 | -6.482 |
| 28696.0 | -6.447 |
| 28697.0 | -6.251 |
| 28698.0 | -6.043 |
| 28699.0 | -5.942 |
| 28700.0 | -5.859 |
| 28701.0 | -5.804 |
| 28702.0 | -5.735 |
| 28703.0 | -5.645 |
| 28704.0 | -5.6 |
| 28705.0 | -5.566 |
| 28706.0 | -5.539 |
| 28707.0 | -5.522 |
| 28708.0 | -5.513 |
| 28709.0 | -5.481 |
| 28710.0 | -5.468 |
| 28711.0 | -5.443 |
| 28712.0 | -5.435 |
| 28713.0 | -5.39 |
| 28714.0 | -5.353 |
| 28715.0 | -5.336 |
| 28716.0 | -5.312 |
| 28717.0 | -5.283 |
| 28718.0 | -5.273 |
| 28719.0 | -5.276 |
| 28720.0 | -5.294 |
| 28721.0 | -5.305 |
| 28722.0 | -5.315 |
| 28723.0 | -5.331 |
| 28724.0 | -5.345 |
| 28725.0 | -5.351 |
| 28726.0 | -5.349 |
| 28727.0 | -5.314 |
| 28728.0 | -5.08 |
| 28729.0 | -4.911 |
| 28730.0 | -4.964 |
| 28731.0 | -4.98 |
| 28732.0 | -4.974 |
| 28733.0 | -4.976 |
| 28734.0 | -4.974 |
| 28735.0 | -4.983 |
| 28736.0 | -4.996 |
| 28737.0 | -5.006 |
| 28738.0 | -5.077 |
| 28739.0 | -5.122 |
| 28740.0 | -5.077 |
| 28741.0 | -5.058 |
| 28742.0 | -5.068 |
| 28743.0 | -5.046 |
| 28744.0 | -5.056 |
| 28745.0 | -5.054 |
| 28746.0 | -5.045 |
| 28747.0 | -5.034 |
| 28748.0 | -5.016 |
| 28749.0 | -5.008 |
| 28750.0 | -5.009 |
| 28751.0 | -5.011 |
| 28752.0 | -5.049 |
| 28753.0 | -5.059 |
| 28754.0 | -5.067 |
| 28755.0 | -5.048 |
| 28756.0 | -5.075 |
| 28757.0 | -5.084 |
| 28758.0 | -5.09 |
| 28759.0 | -5.078 |
| 28760.0 | -5.058 |
| 28761.0 | -5.041 |
| 28762.0 | -5.039 |
| 28763.0 | -5.025 |
| 28764.0 | -4.991 |
| 28765.0 | -5.009 |
| 28766.0 | -4.988 |
| 28767.0 | -5 |
| 28768.0 | -5.003 |
| 28769.0 | -5.008 |
| 28770.0 | -4.984 |
| 28771.0 | -5.035 |
| 28772.0 | -5.033 |
| 28773.0 | -5.009 |
| 28774.0 | -5.025 |
| 28775.0 | -5.037 |
| 28776.0 | -4.979 |
| 28777.0 | -4.505 |
| 28778.0 | -4.511 |
| 28779.0 | -4.724 |
| 28780.0 | -4.837 |
| 28781.0 | -4.905 |
| 28782.0 | -4.95 |
| 28783.0 | -4.979 |
| 28784.0 | -4.981 |
| 28785.0 | -4.95 |
| 28786.0 | -4.968 |
| 28787.0 | -4.967 |
| 28788.0 | -4.965 |
| 28789.0 | -4.971 |
| 28790.0 | -4.974 |
| 28791.0 | -4.977 |
| 28792.0 | -4.993 |
| 28793.0 | -4.997 |
| 28794.0 | -5.001 |
| 28795.0 | -5.004 |
| 28796.0 | -5.016 |
| 28797.0 | -5.012 |
| 28798.0 | -5.048 |
| 28799.0 | -5.056 |
| 28800.0 | -5.062 |
| 28801.0 | -5.068 |
| 28802.0 | -5.083 |
| 28803.0 | -5.086 |
| 28804.0 | -5.091 |
| 28805.0 | -5.092 |
| 28806.0 | -5.073 |
| 28807.0 | -5.088 |
| 28808.0 | -5.105 |
| 28809.0 | -5.052 |
| 28810.0 | -5.002 |
| 28811.0 | -4.98 |
| 28812.0 | -4.996 |
| 28813.0 | -5.004 |
| 28814.0 | -5.014 |
| 28815.0 | -5.047 |
| 28816.0 | -5.078 |
| 28817.0 | -5.081 |
| 28818.0 | -5.111 |
| 28819.0 | -5.141 |
| 28820.0 | -5.116 |
| 28821.0 | -5.139 |
| 28822.0 | -5.148 |
| 28823.0 | -5.16 |
| 28824.0 | -5.171 |
| 28825.0 | -5.197 |
| 28826.0 | -5.228 |
| 28827.0 | -5.222 |
| 28828.0 | -5.258 |
| 28829.0 | -5.267 |
| 28830.0 | -5.307 |
| 28831.0 | -5.344 |
| 28832.0 | -5.387 |
| 28833.0 | -5.387 |
| 28834.0 | -5.361 |
| 28835.0 | -5.312 |
| 28836.0 | -5.292 |
| 28837.0 | -5.181 |
| 28838.0 | -4.967 |
| 28839.0 | -4.931 |
| 28840.0 | -5.004 |
| 28841.0 | -5.069 |
| 28842.0 | -5.107 |
| 28843.0 | 0 |
| 28844.0 | 0 |
| 28845.0 | 0 |
| 28846.0 | 0 |
| 28847.0 | 0 |
| 28848.0 | 0 |
| 28849.0 | 0 |
| 28850.0 | 0 |
| 28851.0 | 0 |
| 28852.0 | 0 |
| 28853.0 | 0 |
| 28854.0 | 0 |
| 28855.0 | 0 |
| 28856.0 | 0 |
| 28857.0 | 0 |
| 28858.0 | 0 |
| 28859.0 | 0 |
| 28860.0 | -5.082 |
| 28861.0 | -5.03 |
| 28862.0 | -5.026 |
| 28863.0 | -5.087 |
| 28864.0 | -5.055 |
| 28865.0 | -5.063 |
| 28866.0 | -5.074 |
| 28867.0 | -5.076 |
| 28868.0 | -5.067 |
| 28869.0 | -5.081 |
| 28870.0 | -5.016 |
| 28871.0 | -5.051 |
| 28872.0 | -5.04 |
| 28873.0 | -5.075 |
| 28874.0 | -5.026 |
| 28875.0 | -5.045 |
| 28876.0 | -5.07 |
| 28877.0 | -5.115 |
| 28878.0 | -5.119 |
| 28879.0 | -5.165 |
| 28880.0 | -5.124 |
| 28881.0 | -5.11 |
| 28882.0 | -5.185 |
| 28883.0 | -5.186 |
| 28884.0 | -5.163 |
| 28885.0 | -5.118 |
| 28886.0 | 0 |
| 28887.0 | 0 |
| 28888.0 | 0 |
| 28889.0 | 0 |
| 28890.0 | 0 |
| 28891.0 | 0 |
| 28892.0 | 0 |
| 28893.0 | 0 |
| 28894.0 | 0 |
| 28895.0 | 0 |
| 28896.0 | 0 |
| 28897.0 | 0 |
| 28898.0 | 0 |
| 28899.0 | 0 |
| 28900.0 | 0 |
| 28901.0 | -5.268 |
| 28902.0 | -5.197 |
| 28903.0 | -5.248 |
| 28904.0 | -5.243 |
| 28905.0 | -5.298 |
| 28906.0 | -5.289 |
| 28907.0 | -5.33 |
| 28908.0 | -5.347 |
| 28909.0 | -5.338 |
| 28910.0 | -5.38 |
| 28911.0 | -5.382 |
| 28912.0 | -5.351 |
| 28913.0 | -5.467 |
| 28914.0 | -5.504 |
| 28915.0 | -5.53 |
| 28916.0 | -5.534 |
| 28917.0 | -5.528 |
| 28918.0 | -5.522 |
| 28919.0 | -5.505 |
| 28920.0 | -5.458 |
| 28921.0 | -5.53 |
| 28922.0 | -5.583 |
| 28923.0 | -5.556 |
| 28924.0 | -5.579 |
| 28925.0 | -5.526 |
| 28926.0 | -5.492 |
| 28927.0 | -5.47 |
| 28928.0 | -5.491 |
| 28929.0 | -5.42 |
| 28930.0 | -5.381 |
| 28931.0 | -5.417 |
| 28932.0 | -5.322 |
| 28933.0 | -5.364 |
| 28934.0 | -5.403 |
| 28935.0 | -5.342 |
| 28936.0 | -5.375 |
| 28937.0 | -5.475 |
| 28938.0 | -5.479 |
| 28939.0 | -5.473 |
| 28940.0 | -5.46 |
| 28941.0 | -5.469 |
| 28942.0 | -5.504 |
| 28943.0 | 0 |
| 28944.0 | 0 |
| 28945.0 | 0 |
| 28946.0 | 0 |
| 28947.0 | 0 |
| 28948.0 | 0 |
| 28949.0 | 0 |
| 28950.0 | 0 |
| 28951.0 | 0 |
| 28952.0 | 0 |
| 28953.0 | 0 |
| 28954.0 | 0 |
| 28955.0 | 0 |
| 28956.0 | 0 |
| 28957.0 | 0 |
| 28958.0 | 0 |
| 28959.0 | 0 |
| 28960.0 | 0 |
| 28961.0 | 0 |
| 28962.0 | 0 |
| 28963.0 | 0 |
| 28964.0 | 0 |
| 28965.0 | 0 |
| 28966.0 | 0 |
| 28967.0 | 0 |
| 28968.0 | 0 |
| 28969.0 | 0 |
| 28970.0 | 0 |
| 28971.0 | 0 |
| 28972.0 | 0 |
| 28973.0 | 0 |
| 28974.0 | 0 |
| 28975.0 | 0 |
| 28976.0 | 0 |
| 28977.0 | 0 |
| 28978.0 | 0 |
| 28979.0 | 0 |
| 28980.0 | 0 |
| 28981.0 | 0 |
| 28982.0 | 0 |
| 28983.0 | 0 |
| 28984.0 | 0 |
| 28985.0 | 0 |
| 28986.0 | 0 |
| 28987.0 | 0 |
| 28988.0 | 0 |
| 28989.0 | 0 |
| 28990.0 | 0 |
| 28991.0 | 0 |
| 28992.0 | 0 |
| 28993.0 | 0 |
| 28994.0 | 0 |
| 28995.0 | 0 |
| 28996.0 | 0 |
| 28997.0 | 0 |
| 28998.0 | 0 |
| 28999.0 | 0 |
| 29000.0 | 0 |
| 29001.0 | 0 |
| 29002.0 | 0 |
| 29003.0 | 0 |
| 29004.0 | 0 |
| 29005.0 | 0 |
| 29006.0 | 0 |
| 29007.0 | 0 |
| 29008.0 | 0 |
| 29009.0 | 0 |
| 29010.0 | 0 |
| 29011.0 | 0 |
| 29012.0 | 0 |
| 29013.0 | 0 |
| 29014.0 | -4.983 |
| 29015.0 | -4.99 |
| 29016.0 | -4.991 |
| 29017.0 | -4.991 |
| 29018.0 | -4.991 |
| 29019.0 | -4.991 |
| 29020.0 | -4.991 |
| 29021.0 | -4.99 |
| 29022.0 | -4.988 |
| 29023.0 | -4.999 |
| 29024.0 | -5.009 |
| 29025.0 | -5.02 |
| 29026.0 | -5.042 |
| 29027.0 | -5.045 |
| 29028.0 | -5.045 |
| 29029.0 | -5.045 |
| 29030.0 | -5.046 |
| 29031.0 | -5.054 |
| 29032.0 | -5.065 |
| 29033.0 | -5.068 |
| 29034.0 | -5.074 |
| 29035.0 | -5.075 |
| 29036.0 | -5.076 |
| 29037.0 | -5.082 |
| 29038.0 | -5.09 |
| 29039.0 | -5.097 |
| 29040.0 | -5.104 |
| 29041.0 | -5.105 |
| 29042.0 | -5.105 |
| 29043.0 | -5.105 |
| 29044.0 | -5.105 |
| 29045.0 | -5.105 |
| 29046.0 | -5.106 |
| 29047.0 | -5.113 |
| 29048.0 | -5.125 |
| 29049.0 | -5.127 |
| 29050.0 | -5.134 |
| 29051.0 | -5.173 |
| 29052.0 | -5.175 |
| 29053.0 | -5.146 |
| 29054.0 | -5.133 |
| 29055.0 | -5.106 |
| 29056.0 | -5.069 |
| 29057.0 | -5.063 |
| 29058.0 | -5.064 |
| 29059.0 | -5.071 |
| 29060.0 | -5.07 |
| 29061.0 | -5.054 |
| 29062.0 | -5.032 |
| 29063.0 | -4.984 |
| 29064.0 | -4.951 |
| 29065.0 | -4.946 |
| 29066.0 | -4.948 |
| 29067.0 | -4.962 |
| 29068.0 | -4.965 |
| 29069.0 | -4.972 |
| 29070.0 | -4.975 |
| 29071.0 | -4.99 |
| 29072.0 | -4.999 |
| 29073.0 | -5.002 |
| 29074.0 | -5.017 |
| 29075.0 | -5.027 |
| 29076.0 | -5.036 |
| 29077.0 | -5.044 |
| 29078.0 | -5.045 |
| 29079.0 | -5.045 |
| 29080.0 | -5.045 |
| 29081.0 | -5.042 |
| 29082.0 | -5.021 |
| 29083.0 | -5.017 |
| 29084.0 | -5.008 |
| 29085.0 | -4.993 |
| 29086.0 | -4.992 |
| 29087.0 | -5 |
| 29088.0 | -5.009 |
| 29089.0 | -5.018 |
| 29090.0 | -5.026 |
| 29091.0 | -5.018 |
| 29092.0 | -4.961 |
| 29093.0 | -4.931 |
| 29094.0 | -4.927 |
| 29095.0 | -4.921 |
| 29096.0 | -4.927 |
| 29097.0 | -4.928 |
| 29098.0 | -4.928 |
| 29099.0 | -4.927 |
| 29100.0 | -4.919 |
| 29101.0 | -4.91 |
| 29102.0 | -4.905 |
| 29103.0 | -4.928 |
| 29104.0 | -4.952 |
| 29105.0 | -4.958 |
| 29106.0 | -4.983 |
| 29107.0 | -5.015 |
| 29108.0 | -5.026 |
| 29109.0 | -5.028 |
| 29110.0 | -5.034 |
| 29111.0 | -5.027 |
| 29112.0 | -5.019 |
| 29113.0 | -5.019 |
| 29114.0 | -5.026 |
| 29115.0 | -5.028 |
| 29116.0 | -5.036 |
| 29117.0 | -5.043 |
| 29118.0 | -5.037 |
| 29119.0 | -5.036 |
| 29120.0 | -5.035 |
| 29121.0 | -5.028 |
| 29122.0 | -5.025 |
| 29123.0 | -5.01 |
| 29124.0 | -5.001 |
| 29125.0 | -5 |
| 29126.0 | -4.998 |
| 29127.0 | -4.981 |
| 29128.0 | -4.958 |
| 29129.0 | -4.955 |
| 29130.0 | -4.955 |
| 29131.0 | -4.955 |
| 29132.0 | -4.957 |
| 29133.0 | -4.973 |
| 29134.0 | -4.99 |
| 29135.0 | -5.001 |
| 29136.0 | -5.019 |
| 29137.0 | -5.043 |
| 29138.0 | -5.053 |
| 29139.0 | -5.054 |
| 29140.0 | -5.054 |
| 29141.0 | -5.054 |
| 29142.0 | -5.054 |
| 29143.0 | -5.054 |
| 29144.0 | -5.053 |
| 29145.0 | -5.046 |
| 29146.0 | -5.044 |
| 29147.0 | -5.037 |
| 29148.0 | -5.037 |
| 29149.0 | -5.044 |
| 29150.0 | -5.045 |
| 29151.0 | -5.039 |
| 29152.0 | -5.002 |
| 29153.0 | -4.976 |
| 29154.0 | -4.975 |
| 29155.0 | -4.99 |
| 29156.0 | -4.995 |
| 29157.0 | -4.974 |
| 29158.0 | -4.956 |
| 29159.0 | -4.948 |
| 29160.0 | -4.953 |
| 29161.0 | -4.947 |
| 29162.0 | -4.946 |
| 29163.0 | -4.947 |
| 29164.0 | -4.957 |
| 29165.0 | -4.983 |
| 29166.0 | -5.016 |
| 29167.0 | -5.035 |
| 29168.0 | -5.046 |
| 29169.0 | -5.062 |
| 29170.0 | -5.073 |
| 29171.0 | -5.09 |
| 29172.0 | -5.107 |
| 29173.0 | -5.117 |
| 29174.0 | -5.126 |
| 29175.0 | -5.134 |
| 29176.0 | -5.135 |
| 29177.0 | -5.135 |
| 29178.0 | -5.135 |
| 29179.0 | -5.135 |
| 29180.0 | -5.136 |
| 29181.0 | -5.144 |
| 29182.0 | -5.154 |
| 29183.0 | -5.17 |
| 29184.0 | -5.18 |
| 29185.0 | -5.189 |
| 29186.0 | -5.199 |
| 29187.0 | -5.215 |
| 29188.0 | -5.224 |
| 29189.0 | -5.225 |
| 29190.0 | -5.226 |
| 29191.0 | -5.228 |
| 29192.0 | -5.201 |
| 29193.0 | -5.19 |
| 29194.0 | -5.192 |
| 29195.0 | -5.208 |
| 29196.0 | -5.222 |
| 29197.0 | -5.217 |
| 29198.0 | -5.216 |
| 29199.0 | -5.214 |
| 29200.0 | -5.2 |
| 29201.0 | -5.176 |
| 29202.0 | -5.108 |
| 29203.0 | -5.051 |
| 29204.0 | -5.042 |
| 29205.0 | -5.021 |
| 29206.0 | -5.019 |
| 29207.0 | -5.027 |
| 29208.0 | -5.036 |
| 29209.0 | -5.044 |
| 29210.0 | -5.045 |
| 29211.0 | -5.045 |
| 29212.0 | -5.045 |
| 29213.0 | -5.045 |
| 29214.0 | -5.024 |
| 29215.0 | -4.914 |
| 29216.0 | -4.916 |
| 29217.0 | -4.921 |
| 29218.0 | -4.936 |
| 29219.0 | -4.945 |
| 29220.0 | -4.947 |
| 29221.0 | -4.957 |
| 29222.0 | -4.971 |
| 29223.0 | -4.81 |
| 29224.0 | -4.807 |
| 29225.0 | -4.883 |
| 29226.0 | -4.935 |
| 29227.0 | -4.956 |
| 29228.0 | -4.982 |
| 29229.0 | -5.009 |
| 29230.0 | -5.034 |
| 29231.0 | -5.044 |
| 29232.0 | -5.044 |
| 29233.0 | -5.036 |
| 29234.0 | -5.024 |
| 29235.0 | -4.986 |
| 29236.0 | -4.952 |
| 29237.0 | -4.258 |
| 29238.0 | -4.263 |
| 29239.0 | -4.436 |
| 29240.0 | -4.493 |
| 29241.0 | -4.532 |
| 29242.0 | -4.57 |
| 29243.0 | -4.608 |
| 29244.0 | -4.647 |
| 29245.0 | -4.685 |
| 29246.0 | -4.723 |
| 29247.0 | -4.761 |
| 29248.0 | -4.8 |
| 29249.0 | -4.838 |
| 29250.0 | -4.876 |
| 29251.0 | -4.915 |
| 29252.0 | -4.948 |
| 29253.0 | -4.955 |
| 29254.0 | -4.957 |
| 29255.0 | -4.959 |
| 29256.0 | -4.96 |
| 29257.0 | -4.962 |
| 29258.0 | -4.964 |
| 29259.0 | -4.966 |
| 29260.0 | -4.968 |
| 29261.0 | -4.97 |
| 29262.0 | -4.972 |
| 29263.0 | -4.973 |
| 29264.0 | -4.975 |
| 29265.0 | -4.977 |
| 29266.0 | -4.979 |
| 29267.0 | -4.981 |
| 29268.0 | -4.983 |
| 29269.0 | -4.985 |
| 29270.0 | -4.986 |
| 29271.0 | -4.988 |
| 29272.0 | -4.99 |
| 29273.0 | -4.992 |
| 29274.0 | -4.994 |
| 29275.0 | -4.996 |
| 29276.0 | -4.998 |
| 29277.0 | -4.999 |
| 29278.0 | -5.001 |
| 29279.0 | -5.003 |
| 29280.0 | -5.007 |
| 29281.0 | -5.024 |
| 29282.0 | -5.028 |
| 29283.0 | -4.987 |
| 29284.0 | -4.959 |
| 29285.0 | -4.957 |
| 29286.0 | -4.974 |
| 29287.0 | -4.986 |
| 29288.0 | -5.003 |
| 29289.0 | -5.009 |
| 29290.0 | -5.033 |
| 29291.0 | -5.045 |
| 29292.0 | -5.055 |
| 29293.0 | -5.064 |
| 29294.0 | -5.065 |
| 29295.0 | -5.066 |
| 29296.0 | -5.099 |
| 29297.0 | -5.101 |
| 29298.0 | -5.059 |
| 29299.0 | -5.045 |
| 29300.0 | -5.038 |
| 29301.0 | -5.045 |
| 29302.0 | -5.054 |
| 29303.0 | -5.055 |
| 29304.0 | -5.055 |
| 29305.0 | -5.055 |
| 29306.0 | -5.055 |
| 29307.0 | -5.055 |
| 29308.0 | -5.055 |
| 29309.0 | -5.055 |
| 29310.0 | -5.056 |
| 29311.0 | -5.065 |
| 29312.0 | -5.069 |
| 29313.0 | -5.038 |
| 29314.0 | -5.013 |
| 29315.0 | -4.977 |
| 29316.0 | -4.959 |
| 29317.0 | -4.966 |
| 29318.0 | -4.986 |
| 29319.0 | -5.013 |
| 29320.0 | -5.026 |
| 29321.0 | -5.044 |
| 29322.0 | -5.054 |
| 29323.0 | -5.055 |
| 29324.0 | -5.055 |
| 29325.0 | -5.055 |
| 29326.0 | -5.055 |
| 29327.0 | -5.055 |
| 29328.0 | -5.056 |
| 29329.0 | -5.064 |
| 29330.0 | -5.067 |
| 29331.0 | -5.085 |
| 29332.0 | -5.105 |
| 29333.0 | -5.124 |
| 29334.0 | -5.135 |
| 29335.0 | -5.144 |
| 29336.0 | -5.145 |
| 29337.0 | -5.145 |
| 29338.0 | -5.144 |
| 29339.0 | -5.135 |
| 29340.0 | -5.121 |
| 29341.0 | -5.086 |
| 29342.0 | -5.059 |
| 29343.0 | -5.057 |
| 29344.0 | -5.074 |
| 29345.0 | -5.086 |
| 29346.0 | -5.105 |
| 29347.0 | -5.124 |
| 29348.0 | -5.136 |
| 29349.0 | -5.153 |
| 29350.0 | -5.156 |
| 29351.0 | -5.164 |
| 29352.0 | -5.164 |
| 29353.0 | -5.156 |
| 29354.0 | -5.155 |
| 29355.0 | -5.153 |
| 29356.0 | -5.136 |
| 29357.0 | -5.126 |
| 29358.0 | -5.124 |
| 29359.0 | -5.114 |
| 29360.0 | -5.096 |
| 29361.0 | -5.085 |
| 29362.0 | -5.077 |
| 29363.0 | -5.085 |
| 29364.0 | -5.094 |
| 29365.0 | -5.094 |
| 29366.0 | -5.084 |
| 29367.0 | -5.067 |
| 29368.0 | -5.064 |
| 29369.0 | -5.055 |
| 29370.0 | -5.045 |
| 29371.0 | -5.036 |
| 29372.0 | -5.035 |
| 29373.0 | -5.034 |
| 29374.0 | -5.026 |
| 29375.0 | -5.024 |
| 29376.0 | -5.016 |
| 29377.0 | -4.845 |
| 29378.0 | -4.831 |
| 29379.0 | -4.956 |
| 29380.0 | -5.025 |
| 29381.0 | -5.079 |
| 29382.0 | -5.094 |
| 29383.0 | -5.094 |
| 29384.0 | -5.084 |
| 29385.0 | -5.065 |
| 29386.0 | -5.045 |
| 29387.0 | -5.026 |
| 29388.0 | -5.019 |
| 29389.0 | -5.035 |
| 29390.0 | -5.056 |
| 29391.0 | -5.081 |
| 29392.0 | -5.086 |
| 29393.0 | -5.096 |
| 29394.0 | -5.112 |
| 29395.0 | -5.112 |
| 29396.0 | -5.094 |
| 29397.0 | -5.066 |
| 29398.0 | -5.042 |
| 29399.0 | -5.003 |
| 29400.0 | -4.982 |
| 29401.0 | -4.979 |
| 29402.0 | -4.971 |
| 29403.0 | -4.969 |
| 29404.0 | -4.961 |
| 29405.0 | -4.96 |
| 29406.0 | -4.962 |
| 29407.0 | -4.979 |
| 29408.0 | -4.991 |
| 29409.0 | -5.004 |
| 29410.0 | -5.012 |
| 29411.0 | -5.028 |
| 29412.0 | -5.03 |
| 29413.0 | -5.029 |
| 29414.0 | -5.023 |
| 29415.0 | -5.003 |
| 29416.0 | -4.971 |
| 29417.0 | -4.948 |
| 29418.0 | -4.946 |
| 29419.0 | -4.954 |
| 29420.0 | -4.96 |
| 29421.0 | -4.965 |
| 29422.0 | -4.971 |
| 29423.0 | -4.981 |
| 29424.0 | -4.994 |
| 29425.0 | -5 |
| 29426.0 | -5.003 |
| 29427.0 | -4.994 |
| 29428.0 | -4.971 |
| 29429.0 | -4.896 |
| 29430.0 | -4.858 |
| 29431.0 | -4.88 |
| 29432.0 | -4.903 |
| 29433.0 | -4.914 |
| 29434.0 | -4.914 |
| 29435.0 | -4.906 |
| 29436.0 | -4.873 |
| 29437.0 | -4.882 |
| 29438.0 | -4.911 |
| 29439.0 | -4.921 |
| 29440.0 | -4.931 |
| 29441.0 | -4.951 |
| 29442.0 | -4.974 |
| 29443.0 | -4.992 |
| 29444.0 | -4.987 |
| 29445.0 | -4.962 |
| 29446.0 | -4.919 |
| 29447.0 | -4.903 |
| 29448.0 | -4.902 |
| 29449.0 | -4.841 |
| 29450.0 | -4.859 |
| 29451.0 | -4.89 |
| 29452.0 | -4.913 |
| 29453.0 | -4.921 |
| 29454.0 | -4.931 |
| 29455.0 | -4.949 |
| 29456.0 | -4.963 |
| 29457.0 | -4.964 |
| 29458.0 | -4.949 |
| 29459.0 | -4.895 |
| 29460.0 | -4.882 |
| 29461.0 | -4.893 |
| 29462.0 | -4.895 |
| 29463.0 | -4.894 |
| 29464.0 | -4.891 |
| 29465.0 | -4.888 |
| 29466.0 | -4.879 |
| 29467.0 | -4.891 |
| 29468.0 | -4.907 |
| 29469.0 | -4.906 |
| 29470.0 | -4.908 |
| 29471.0 | -4.929 |
| 29472.0 | -4.946 |
| 29473.0 | -4.963 |
| 29474.0 | -4.966 |
| 29475.0 | -4.948 |
| 29476.0 | -4.944 |
| 29477.0 | -4.941 |
| 29478.0 | -4.939 |
| 29479.0 | -4.93 |
| 29480.0 | -4.922 |
| 29481.0 | -4.926 |
| 29482.0 | -4.938 |
| 29483.0 | -4.942 |
| 29484.0 | -4.958 |
| 29485.0 | -4.966 |
| 29486.0 | -4.978 |
| 29487.0 | -4.98 |
| 29488.0 | -4.978 |
| 29489.0 | -4.964 |
| 29490.0 | -4.944 |
| 29491.0 | -4.944 |
| 29492.0 | -4.945 |
| 29493.0 | -4.943 |
| 29494.0 | -4.932 |
| 29495.0 | -4.93 |
| 29496.0 | -4.933 |
| 29497.0 | -4.953 |
| 29498.0 | -4.966 |
| 29499.0 | -4.978 |
| 29500.0 | -4.982 |
| 29501.0 | -4.993 |
| 29502.0 | -4.995 |
| 29503.0 | -4.994 |
| 29504.0 | -4.991 |
| 29505.0 | -4.99 |
| 29506.0 | -4.99 |
| 29507.0 | -4.99 |
| 29508.0 | -4.989 |
| 29509.0 | -4.98 |
| 29510.0 | -4.971 |
| 29511.0 | -4.966 |
| 29512.0 | -4.965 |
| 29513.0 | -4.967 |
| 29514.0 | -4.979 |
| 29515.0 | -4.986 |
| 29516.0 | -4.994 |
| 29517.0 | -4.995 |
| 29518.0 | -4.995 |
| 29519.0 | -4.996 |
| 29520.0 | -5.004 |
| 29521.0 | -5.004 |
| 29522.0 | -4.996 |
| 29523.0 | -4.993 |
| 29524.0 | -4.981 |
| 29525.0 | -4.976 |
| 29526.0 | -4.979 |
| 29527.0 | -4.981 |
| 29528.0 | -4.986 |
| 29529.0 | -5 |
| 29530.0 | -5.015 |
| 29531.0 | -5.029 |
| 29532.0 | -5.041 |
| 29533.0 | -5.055 |
| 29534.0 | -5.069 |
| 29535.0 | -5.077 |
| 29536.0 | -5.071 |
| 29537.0 | -5.069 |
| 29538.0 | -5.062 |
| 29539.0 | -5.042 |
| 29540.0 | -5.03 |
| 29541.0 | -5.02 |
| 29542.0 | -5.01 |
| 29543.0 | -5 |
| 29544.0 | -4.991 |
| 29545.0 | -4.981 |
| 29546.0 | -4.956 |
| 29547.0 | -4.964 |
| 29548.0 | -4.971 |
| 29549.0 | -4.978 |
| 29550.0 | -4.974 |
| 29551.0 | -4.959 |
| 29552.0 | -4.941 |
| 29553.0 | -4.929 |
| 29554.0 | -4.919 |
| 29555.0 | -4.928 |
| 29556.0 | -4.931 |
| 29557.0 | -4.936 |
| 29558.0 | -4.946 |
| 29559.0 | -4.965 |
| 29560.0 | -4.984 |
| 29561.0 | -4.996 |
| 29562.0 | -5.01 |
| 29563.0 | -5.024 |
| 29564.0 | -5.029 |
| 29565.0 | -5.03 |
| 29566.0 | -5.03 |
| 29567.0 | -5.028 |
| 29568.0 | -5.025 |
| 29569.0 | -5.02 |
| 29570.0 | -5.016 |
| 29571.0 | -5.015 |
| 29572.0 | -5.016 |
| 29573.0 | -5.021 |
| 29574.0 | -5.03 |
| 29575.0 | -5.041 |
| 29576.0 | -5.054 |
| 29577.0 | -5.06 |
| 29578.0 | -5.066 |
| 29579.0 | -5.074 |
| 29580.0 | -5.073 |
| 29581.0 | -5.064 |
| 29582.0 | -5.077 |
| 29583.0 | -5.08 |
| 29584.0 | -5.08 |
| 29585.0 | -5.081 |
| 29586.0 | -5.085 |
| 29587.0 | -5.091 |
| 29588.0 | -5.101 |
| 29589.0 | -5.119 |
| 29590.0 | -5.132 |
| 29591.0 | -5.155 |
| 29592.0 | -5.178 |
| 29593.0 | -5.191 |
| 29594.0 | -5.204 |
| 29595.0 | -5.21 |
| 29596.0 | -5.215 |
| 29597.0 | -5.221 |
| 29598.0 | -5.229 |
| 29599.0 | -5.232 |
| 29600.0 | -5.243 |
| 29601.0 | -5.246 |
| 29602.0 | -5.255 |
| 29603.0 | -5.266 |
| 29604.0 | -5.278 |
| 29605.0 | -5.28 |
| 29606.0 | -5.282 |
| 29607.0 | -5.296 |
| 29608.0 | -5.314 |
| 29609.0 | -5.324 |
| 29610.0 | -5.331 |
| 29611.0 | -5.345 |
| 29612.0 | -5.36 |
| 29613.0 | -5.375 |
| 29614.0 | -5.389 |
| 29615.0 | -5.401 |
| 29616.0 | -5.415 |
| 29617.0 | -5.431 |
| 29618.0 | -5.455 |
| 29619.0 | -5.479 |
| 29620.0 | -5.496 |
| 29621.0 | -5.514 |
| 29622.0 | -5.529 |
| 29623.0 | -5.543 |
| 29624.0 | -5.571 |
| 29625.0 | -5.581 |
| 29626.0 | -5.595 |
| 29627.0 | -5.609 |
| 29628.0 | -5.62 |
| 29629.0 | -5.629 |
| 29630.0 | -5.63 |
| 29631.0 | -5.63 |
| 29632.0 | -5.629 |
| 29633.0 | -5.707 |
| 29634.0 | 0 |
| 29635.0 | 0 |
| 29636.0 | 0 |
| 29637.0 | 0 |
| 29638.0 | 0 |
| 29639.0 | 0 |
| 29640.0 | 0 |
| 29641.0 | 0 |
| 29642.0 | 0 |
| 29643.0 | 0 |
| 29644.0 | 0 |
| 29645.0 | 0 |
| 29646.0 | 0 |
| 29647.0 | 0 |
| 29648.0 | 0 |
| 29649.0 | 0 |
| 29650.0 | 0 |
| 29651.0 | 0 |
| 29652.0 | 0 |
| 29653.0 | 0 |
| 29654.0 | 0 |
| 29655.0 | 0 |
| 29656.0 | 0 |
| 29657.0 | 0 |
| 29658.0 | 0 |
| 29659.0 | 0 |
| 29660.0 | 0 |
| 29661.0 | 0 |
| 29662.0 | 0 |
| 29663.0 | 0 |
| 29664.0 | 0 |
| 29665.0 | 0 |
| 29666.0 | 0 |
| 29667.0 | 0 |
| 29668.0 | 0 |
| 29669.0 | 0 |
| 29670.0 | 0 |
| 29671.0 | 0 |
| 29672.0 | 0 |
| 29673.0 | 0 |
| 29674.0 | 0 |
| 29675.0 | 0 |
| 29676.0 | 0 |
| 29677.0 | 0 |
| 29678.0 | 0 |
| 29679.0 | 0 |
| 29680.0 | 0 |
| 29681.0 | 0 |
| 29682.0 | 0 |
| 29683.0 | 0 |
| 29684.0 | 0 |
| 29685.0 | 0 |
| 29686.0 | 0 |
| 29687.0 | 0 |
| 29688.0 | 0 |
| 29689.0 | 0 |
| 29690.0 | 0 |
| 29691.0 | 0 |
| 29692.0 | 0 |
| 29693.0 | 0 |
| 29694.0 | 0 |
| 29695.0 | 0 |
| 29696.0 | 0 |
| 29697.0 | 0 |
| 29698.0 | 0 |
| 29699.0 | 0 |
| 29700.0 | 0 |
| 29701.0 | 0 |
| 29702.0 | 0 |
| 29703.0 | 0 |
| 29704.0 | 0 |
| 29705.0 | 0 |
| 29706.0 | 0 |
| 29707.0 | 0 |
| 29708.0 | 0 |
| 29709.0 | 0 |
| 29710.0 | 0 |
| 29711.0 | 0 |
| 29712.0 | 0 |
| 29713.0 | 0 |
| 29714.0 | 0 |
| 29715.0 | 0 |
| 29716.0 | 0 |
| 29717.0 | 0 |
| 29718.0 | 0 |
| 29719.0 | 0 |
| 29720.0 | 0 |
| 29721.0 | 0 |
| 29722.0 | 0 |
| 29723.0 | 0 |
| 29724.0 | 0 |
| 29725.0 | 0 |
| 29726.0 | 0 |
| 29727.0 | 0 |
| 29728.0 | 0 |
| 29729.0 | 0 |
| 29730.0 | 0 |
| 29731.0 | 0 |
| 29732.0 | 0 |
| 29733.0 | 0 |
| 29734.0 | 0 |
| 29735.0 | 0 |
| 29736.0 | 0 |
| 29737.0 | 0 |
| 29738.0 | 0 |
| 29739.0 | 0 |
| 29740.0 | 0 |
| 29741.0 | 0 |
| 29742.0 | 0 |
| 29743.0 | 0 |
| 29744.0 | 0 |
| 29745.0 | 0 |
| 29746.0 | 0 |
| 29747.0 | 0 |
| 29748.0 | 0 |
| 29749.0 | 0 |
| 29750.0 | 0 |
| 29751.0 | 0 |
| 29752.0 | 0 |
| 29753.0 | 0 |
| 29754.0 | 0 |
| 29755.0 | 0 |
| 29756.0 | 0 |
| 29757.0 | 0 |
| 29758.0 | 0 |
| 29759.0 | 0 |
| 29760.0 | 0 |
| 29761.0 | 0 |
| 29762.0 | 0 |
| 29763.0 | 0 |
| 29764.0 | 0 |
| 29765.0 | 0 |
| 29766.0 | 0 |
| 29767.0 | 0 |
| 29768.0 | 0 |
| 29769.0 | 0 |
| 29770.0 | 0 |
| 29771.0 | 0 |
| 29772.0 | 0 |
| 29773.0 | 0 |
| 29774.0 | 0 |
| 29775.0 | 0 |
| 29776.0 | 0 |
| 29777.0 | 0 |
| 29778.0 | 0 |
| 29779.0 | 0 |
| 29780.0 | 0 |
| 29781.0 | 0 |
| 29782.0 | 0 |
| 29783.0 | 0 |
| 29784.0 | 0 |
| 29785.0 | 0 |
| 29786.0 | 0 |
| 29787.0 | 0 |
| 29788.0 | 0 |
| 29789.0 | 0 |
| 29790.0 | 0 |
| 29791.0 | 0 |
| 29792.0 | 0 |
| 29793.0 | 0 |
| 29794.0 | 0 |
| 29795.0 | 0 |
| 29796.0 | 0 |
| 29797.0 | 0 |
| 29798.0 | 0 |
| 29799.0 | 0 |
| 29800.0 | 0 |
| 29801.0 | 0 |
| 29802.0 | 0 |
| 29803.0 | 0 |
| 29804.0 | 0 |
| 29805.0 | 0 |
| 29806.0 | 0 |
| 29807.0 | 0 |
| 29808.0 | 0 |
| 29809.0 | 0 |
| 29810.0 | 0 |
| 29811.0 | 0 |
| 29812.0 | 0 |
| 29813.0 | 0 |
| 29814.0 | 0 |
| 29815.0 | 0 |
| 29816.0 | 0 |
| 29817.0 | 0 |
| 29818.0 | 0 |
| 29819.0 | 0 |
| 29820.0 | 0 |
| 29821.0 | 0 |
| 29822.0 | 0 |
| 29823.0 | 0 |
| 29824.0 | 0 |
| 29825.0 | 0 |
| 29826.0 | 0 |
| 29827.0 | 0 |
| 29828.0 | 0 |
| 29829.0 | 0 |
| 29830.0 | 0 |
| 29831.0 | 0 |
| 29832.0 | 0 |
| 29833.0 | 0 |
| 29834.0 | 0 |
| 29835.0 | 0 |
| 29836.0 | 0 |
| 29837.0 | 0 |
| 29838.0 | 0 |
| 29839.0 | 0 |
| 29840.0 | 0 |
| 29841.0 | 0 |
| 29842.0 | 0 |
| 29843.0 | 0 |
| 29844.0 | 0 |
| 29845.0 | 0 |
| 29846.0 | 0 |
| 29847.0 | 0 |
| 29848.0 | 0 |
| 29849.0 | 0 |
| 29850.0 | 0 |
| 29851.0 | 0 |
| 29852.0 | 0 |
| 29853.0 | 0 |
| 29854.0 | 0 |
| 29855.0 | 0 |
| 29856.0 | 0 |
| 29857.0 | 0 |
| 29858.0 | 0 |
| 29859.0 | 0 |
| 29860.0 | 0 |
| 29861.0 | 0 |
| 29862.0 | 0 |
| 29863.0 | 0 |
| 29864.0 | 0 |
| 29865.0 | 0 |
| 29866.0 | 0 |
| 29867.0 | 0 |
| 29868.0 | 0 |
| 29869.0 | 0 |
| 29870.0 | 0 |
| 29871.0 | 0 |
| 29872.0 | 0 |
| 29873.0 | 0 |
| 29874.0 | 0 |
| 29875.0 | 0 |
| 29876.0 | 0 |
| 29877.0 | 0 |
| 29878.0 | 0 |
| 29879.0 | 0 |
| 29880.0 | 0 |
| 29881.0 | 0 |
| 29882.0 | 0 |
| 29883.0 | 0 |
| 29884.0 | 0 |
| 29885.0 | 0 |
| 29886.0 | 0 |
| 29887.0 | 0 |
| 29888.0 | 0 |
| 29889.0 | 0 |
| 29890.0 | 0 |
| 29891.0 | 0 |
| 29892.0 | 0 |
| 29893.0 | 0 |
| 29894.0 | 0 |
| 29895.0 | 0 |
| 29896.0 | 0 |
| 29897.0 | 0 |
| 29898.0 | 0 |
| 29899.0 | 0 |
| 29900.0 | 0 |
| 29901.0 | 0 |
| 29902.0 | 0 |
| 29903.0 | 0 |
| 29904.0 | 0 |
| 29905.0 | 0 |
| 29906.0 | 0 |
| 29907.0 | 0 |
| 29908.0 | 0 |
| 29909.0 | 0 |
| 29910.0 | 0 |
| 29911.0 | 0 |
| 29912.0 | 0 |
| 29913.0 | 0 |
| 29914.0 | 0 |
| 29915.0 | 0 |
| 29916.0 | 0 |
| 29917.0 | 0 |
| 29918.0 | 0 |
| 29919.0 | 0 |
| 29920.0 | 0 |
| 29921.0 | 0 |
| 29922.0 | 0 |
| 29923.0 | 0 |
| 29924.0 | 0 |
| 29925.0 | 0 |
| 29926.0 | 0 |
| 29927.0 | 0 |
| 29928.0 | 0 |
| 29929.0 | 0 |
| 29930.0 | 0 |
| 29931.0 | 0 |
| 29932.0 | 0 |
| 29933.0 | 0 |
| 29934.0 | 0 |
| 29935.0 | 0 |
| 29936.0 | 0 |
| 29937.0 | 0 |
| 29938.0 | 0 |
| 29939.0 | 0 |
| 29940.0 | 0 |
| 29941.0 | 0 |
| 29942.0 | 0 |
| 29943.0 | 0 |
| 29944.0 | 0 |
| 29945.0 | 0 |
| 29946.0 | 0 |
| 29947.0 | 0 |
| 29948.0 | 0 |
| 29949.0 | 0 |
| 29950.0 | 0 |
| 29951.0 | 0 |
| 29952.0 | 0 |
| 29953.0 | 0 |
| 29954.0 | 0 |
| 29955.0 | 0 |
| 29956.0 | 0 |
| 29957.0 | 0 |
| 29958.0 | 0 |
| 29959.0 | 0 |
| 29960.0 | 0 |
| 29961.0 | -5.454 |
| 29962.0 | -5.503 |
| 29963.0 | -5.549 |
| 29964.0 | -5.573 |
| 29965.0 | -5.594 |
| 29966.0 | -5.614 |
| 29967.0 | -5.634 |
| 29968.0 | -5.654 |
| 29969.0 | -5.669 |
| 29970.0 | -5.684 |
| 29971.0 | -5.698 |
| 29972.0 | -5.718 |
| 29973.0 | -5.741 |
| 29974.0 | -5.745 |
| 29975.0 | -5.778 |
| 29976.0 | -5.791 |
| 29977.0 | -5.772 |
| 29978.0 | -5.736 |
| 29979.0 | -5.635 |
| 29980.0 | -5.582 |
| 29981.0 | -5.558 |
| 29982.0 | -5.555 |
| 29983.0 | -5.555 |
| 29984.0 | -5.562 |
| 29985.0 | -5.571 |
| 29986.0 | -5.58 |
| 29987.0 | -5.589 |
| 29988.0 | -5.598 |
| 29989.0 | -5.592 |
| 29990.0 | -5.594 |
| 29991.0 | -5.621 |
| 29992.0 | -5.656 |
| 29993.0 | -5.69 |
| 29994.0 | -5.706 |
| 29995.0 | -5.717 |
| 29996.0 | -5.729 |
| 29997.0 | -5.741 |
| 29998.0 | -5.752 |
| 29999.0 | -5.769 |
| 30000.0 | -5.787 |
| 30001.0 | -5.805 |
| 30002.0 | -5.823 |
| 30003.0 | -5.841 |
| 30004.0 | -5.862 |
| 30005.0 | -5.888 |
| 30006.0 | -5.914 |
| 30007.0 | -5.941 |
| 30008.0 | -5.971 |
| 30009.0 | -6.007 |
| 30010.0 | -6.043 |
| 30011.0 | -6.078 |
| 30012.0 | -6.121 |
| 30013.0 | -6.18 |
| 30014.0 | -6.239 |
| 30015.0 | -6.272 |
| 30016.0 | -6.294 |
| 30017.0 | -6.317 |
| 30018.0 | -6.339 |
| 30019.0 | -6.361 |
| 30020.0 | -6.384 |
| 30021.0 | -6.406 |
| 30022.0 | -6.428 |
| 30023.0 | -6.454 |
| 30024.0 | -6.526 |
| 30025.0 | -6.488 |
| 30026.0 | -6.509 |
| 30027.0 | -6.548 |
| 30028.0 | -6.573 |
| 30029.0 | -6.597 |
| 30030.0 | -6.62 |
| 30031.0 | -6.644 |
| 30032.0 | -6.674 |
| 30033.0 | -6.694 |
| 30034.0 | -6.719 |
| 30035.0 | -6.768 |
| 30036.0 | -6.788 |
| 30037.0 | -6.807 |
| 30038.0 | -6.822 |
| 30039.0 | -6.837 |
| 30040.0 | -6.85 |
| 30041.0 | -6.836 |
| 30042.0 | -6.811 |
| 30043.0 | -6.775 |
| 30044.0 | -6.735 |
| 30045.0 | -6.713 |
| 30046.0 | -6.736 |
| 30047.0 | -6.761 |
| 30048.0 | -6.786 |
| 30049.0 | -6.794 |
| 30050.0 | -6.76 |
| 30051.0 | -6.723 |
| 30052.0 | -6.693 |
| 30053.0 | -6.67 |
| 30054.0 | -6.635 |
| 30055.0 | -6.576 |
| 30056.0 | -6.522 |
| 30057.0 | -6.481 |
| 30058.0 | -6.471 |
| 30059.0 | -6.465 |
| 30060.0 | -6.459 |
| 30061.0 | -6.459 |
| 30062.0 | -6.469 |
| 30063.0 | -6.48 |
| 30064.0 | -6.491 |
| 30065.0 | -6.501 |
| 30066.0 | -6.512 |
| 30067.0 | -6.522 |
| 30068.0 | -6.533 |
| 30069.0 | -6.543 |
| 30070.0 | -6.555 |
| 30071.0 | -6.581 |
| 30072.0 | -6.594 |
| 30073.0 | -6.563 |
| 30074.0 | -6.57 |
| 30075.0 | -6.587 |
| 30076.0 | -6.607 |
| 30077.0 | -6.641 |
| 30078.0 | -6.649 |
| 30079.0 | -6.641 |
| 30080.0 | -6.632 |
| 30081.0 | -6.623 |
| 30082.0 | -6.614 |
| 30083.0 | -6.599 |
| 30084.0 | -6.537 |
| 30085.0 | -6.464 |
| 30086.0 | -6.391 |
| 30087.0 | -6.319 |
| 30088.0 | -6.246 |
| 30089.0 | -6.175 |
| 30090.0 | -6.139 |
| 30091.0 | -6.118 |
| 30092.0 | -6.096 |
| 30093.0 | -6.073 |
| 30094.0 | -6.05 |
| 30095.0 | -6.022 |
| 30096.0 | -5.993 |
| 30097.0 | -5.947 |
| 30098.0 | -5.862 |
| 30099.0 | -5.776 |
| 30100.0 | -5.726 |
| 30101.0 | -5.689 |
| 30102.0 | -5.66 |
| 30103.0 | -5.633 |
| 30104.0 | -5.621 |
| 30105.0 | -5.613 |
| 30106.0 | -5.607 |
| 30107.0 | -5.601 |
| 30108.0 | -5.595 |
| 30109.0 | -5.59 |
| 30110.0 | -5.584 |
| 30111.0 | -5.563 |
| 30112.0 | -5.502 |
| 30113.0 | -5.445 |
| 30114.0 | -5.393 |
| 30115.0 | -5.34 |
| 30116.0 | -5.288 |
| 30117.0 | -5.255 |
| 30118.0 | -5.242 |
| 30119.0 | -5.23 |
| 30120.0 | -5.232 |
| 30121.0 | -5.24 |
| 30122.0 | -5.247 |
| 30123.0 | -5.254 |
| 30124.0 | -5.258 |
| 30125.0 | -5.261 |
| 30126.0 | -5.251 |
| 30127.0 | -5.239 |
| 30128.0 | -5.225 |
| 30129.0 | -5.207 |
| 30130.0 | -5.187 |
| 30131.0 | -5.168 |
| 30132.0 | -5.15 |
| 30133.0 | -5.152 |
| 30134.0 | -5.163 |
| 30135.0 | -5.18 |
| 30136.0 | -5.212 |
| 30137.0 | -5.245 |
| 30138.0 | -5.291 |
| 30139.0 | -5.331 |
| 30140.0 | -5.359 |
| 30141.0 | -5.388 |
| 30142.0 | -5.417 |
| 30143.0 | -5.426 |
| 30144.0 | -5.426 |
| 30145.0 | -5.426 |
| 30146.0 | -5.42 |
| 30147.0 | -5.397 |
| 30148.0 | -5.381 |
| 30149.0 | -5.382 |
| 30150.0 | -5.383 |
| 30151.0 | -5.386 |
| 30152.0 | -5.392 |
| 30153.0 | -5.399 |
| 30154.0 | -5.406 |
| 30155.0 | -5.414 |
| 30156.0 | -5.421 |
| 30157.0 | -5.428 |
| 30158.0 | -5.434 |
| 30159.0 | -5.435 |
| 30160.0 | -5.43 |
| 30161.0 | -5.307 |
| 30162.0 | -5.175 |
| 30163.0 | -5.27 |
| 30164.0 | -5.385 |
| 30165.0 | -5.393 |
| 30166.0 | -5.374 |
| 30167.0 | -5.358 |
| 30168.0 | -5.353 |
| 30169.0 | -5.348 |
| 30170.0 | -5.342 |
| 30171.0 | -5.337 |
| 30172.0 | -5.328 |
| 30173.0 | -5.229 |
| 30174.0 | -5.001 |
| 30175.0 | -4.744 |
| 30176.0 | -4.621 |
| 30177.0 | -4.493 |
| 30178.0 | -4.304 |
| 30179.0 | -4.161 |
| 30180.0 | -4.069 |
| 30181.0 | -4.001 |
| 30182.0 | -3.943 |
| 30183.0 | -3.876 |
| 30184.0 | -3.806 |
| 30185.0 | -3.708 |
| 30186.0 | -3.598 |
| 30187.0 | -3.479 |
| 30188.0 | -3.359 |
| 30189.0 | -3.279 |
| 30190.0 | -3.217 |
| 30191.0 | -3.151 |
| 30192.0 | -3.086 |
| 30193.0 | -3.01 |
| 30194.0 | -2.923 |
| 30195.0 | -2.81 |
| 30196.0 | -2.681 |
| 30197.0 | -2.609 |
| 30198.0 | -2.537 |
| 30199.0 | -2.433 |
| 30200.0 | 0 |
| 30201.0 | 0 |
| 30202.0 | 0 |
| 30203.0 | 0 |
| 30204.0 | 0 |
| 30205.0 | 0 |
| 30206.0 | 0 |
| 30207.0 | 0 |
| 30208.0 | 0 |
| 30209.0 | 0 |
| 30210.0 | 0 |
| 30211.0 | 0 |
| 30212.0 | 0 |
| 30213.0 | 0 |
| 30214.0 | 0 |
| 30215.0 | 0 |
| 30216.0 | 0 |
| 30217.0 | 0 |
| 30218.0 | 0 |
| 30219.0 | 0 |
| 30220.0 | 0 |
| 30221.0 | 0 |
| 30222.0 | 0 |
| 30223.0 | 0 |
| 30224.0 | 0 |
| 30225.0 | 0 |
| 30226.0 | 0 |
| 30227.0 | 0 |
| 30228.0 | 0 |
| 30229.0 | 0 |
| 30230.0 | -0.606 |
| 30231.0 | -0.576 |
| 30232.0 | -0.548 |
| 30233.0 | -0.538 |
| 30234.0 | -0.531 |
| 30235.0 | -0.513 |
| 30236.0 | -0.493 |
| 30237.0 | -0.474 |
| 30238.0 | -0.458 |
| 30239.0 | -0.441 |
| 30240.0 | -0.412 |
| 30241.0 | -0.381 |
| 30242.0 | -0.351 |
| 30243.0 | -0.316 |
| 30244.0 | -0.279 |
| 30245.0 | -0.244 |
| 30246.0 | -0.217 |
| 30247.0 | -0.192 |
| 30248.0 | -0.166 |
| 30249.0 | -0.029 |
| 30250.0 | 0.242 |
| 30251.0 | 0.62 |
| 30252.0 | 0.662 |
| 30253.0 | 0.563 |
| 30254.0 | 0.497 |
| 30255.0 | 0.443 |
| 30256.0 | 0.398 |
| 30257.0 | 0.354 |
| 30258.0 | 0.317 |
| 30259.0 | 0.321 |
| 30260.0 | 0.332 |
| 30261.0 | 0.344 |
| 30262.0 | 0.358 |
| 30263.0 | 0.386 |
| 30264.0 | 0.418 |
| 30265.0 | 0.441 |
| 30266.0 | 0.432 |
| 30267.0 | 0.42 |
| 30268.0 | 0.408 |
| 30269.0 | 0.397 |
| 30270.0 | 0.383 |
| 30271.0 | 0.355 |
| 30272.0 | 0.325 |
| 30273.0 | 0.295 |
| 30274.0 | 0.268 |
| 30275.0 | 0.257 |
| 30276.0 | 0.25 |
| 30277.0 | 0.242 |
| 30278.0 | 0.239 |
| 30279.0 | 0.259 |
| 30280.0 | 0.282 |
| 30281.0 | 0.303 |
| 30282.0 | 0.304 |
| 30283.0 | 0.296 |
| 30284.0 | 0.288 |
| 30285.0 | 0.281 |
| 30286.0 | 0.273 |
| 30287.0 | 0.265 |
| 30288.0 | 0.259 |
| 30289.0 | 0.253 |
| 30290.0 | 0.247 |
| 30291.0 | 0.241 |
| 30292.0 | 0.237 |
| 30293.0 | 0.246 |
| 30294.0 | 0.257 |
| 30295.0 | 0.268 |
| 30296.0 | 0.279 |
| 30297.0 | 0.29 |
| 30298.0 | 0.37 |
| 30299.0 | 0.432 |
| 30300.0 | 0.406 |
| 30301.0 | 0.381 |
| 30302.0 | 0.355 |
| 30303.0 | 0.329 |
| 30304.0 | 0.304 |
| 30305.0 | 0.278 |
| 30306.0 | 0.262 |
| 30307.0 | 0.255 |
| 30308.0 | 0.248 |
| 30309.0 | 0.242 |
| 30310.0 | 0.235 |
| 30311.0 | 0.226 |
| 30312.0 | 0.217 |
| 30313.0 | 0.207 |
| 30314.0 | 0.196 |
| 30315.0 | 0.183 |
| 30316.0 | 0.17 |
| 30317.0 | 0.158 |
| 30318.0 | 0.148 |
| 30319.0 | 0.154 |
| 30320.0 | 0.163 |
| 30321.0 | 0.173 |
| 30322.0 | 0.194 |
| 30323.0 | 0.22 |
| 30324.0 | 0.246 |
| 30325.0 | 0.269 |
| 30326.0 | 0.288 |
| 30327.0 | 0.307 |
| 30328.0 | 0.328 |
| 30329.0 | 0.369 |
| 30330.0 | 0.412 |
| 30331.0 | 0.433 |
| 30332.0 | 0.399 |
| 30333.0 | 0.362 |
| 30334.0 | 0.327 |
| 30335.0 | 0.307 |
| 30336.0 | 0.289 |
| 30337.0 | 0.271 |
| 30338.0 | 0.253 |
| 30339.0 | 0.239 |
| 30340.0 | 0.246 |
| 30341.0 | 0.257 |
| 30342.0 | 0.259 |
| 30343.0 | 0.242 |
| 30344.0 | 0.223 |
| 30345.0 | 0.205 |
| 30346.0 | 0.19 |
| 30347.0 | 0.174 |
| 30348.0 | 0.159 |
| 30349.0 | 0.15 |
| 30350.0 | 0.168 |
| 30351.0 | 0.188 |
| 30352.0 | 0.209 |
| 30353.0 | 0.24 |
| 30354.0 | 0.391 |
| 30355.0 | 0.4 |
| 30356.0 | 0.385 |
| 30357.0 | 0.37 |
| 30358.0 | 0.355 |
| 30359.0 | 0.34 |
| 30360.0 | 0.323 |
| 30361.0 | 0.295 |
| 30362.0 | 0.265 |
| 30363.0 | 0.233 |
| 30364.0 | 0.19 |
| 30365.0 | 0 |
| 30366.0 | 0 |
| 30367.0 | 0 |
| 30368.0 | 0 |
| 30369.0 | 0 |
| 30370.0 | 0 |
| 30371.0 | 0 |
| 30372.0 | 0 |
| 30373.0 | 0 |
| 30374.0 | 0 |
| 30375.0 | 0 |
| 30376.0 | 0 |
| 30377.0 | 0 |
| 30378.0 | 0 |
| 30379.0 | 0 |
| 30380.0 | 0 |
| 30381.0 | 0 |
| 30382.0 | 0 |
| 30383.0 | 0.107 |
| 30384.0 | 0.129 |
| 30385.0 | 0.316 |
| 30386.0 | 0.437 |
| 30387.0 | 0.415 |
| 30388.0 | 0.369 |
| 30389.0 | 0.311 |
| 30390.0 | 0.263 |
| 30391.0 | 0.209 |
| 30392.0 | 0.176 |
| 30393.0 | 0.151 |
| 30394.0 | 0.127 |
| 30395.0 | 0.1 |
| 30396.0 | 0.065 |
| 30397.0 | 0.033 |
| 30398.0 | 0.003 |
| 30399.0 | -0.013 |
| 30400.0 | -0.023 |
| 30401.0 | -0.033 |
| 30402.0 | -0.046 |
| 30403.0 | -0.061 |
| 30404.0 | -0.07 |
| 30405.0 | -0.076 |
| 30406.0 | -0.082 |
| 30407.0 | -0.089 |
| 30408.0 | -0.095 |
| 30409.0 | -0.102 |
| 30410.0 | -0.11 |
| 30411.0 | -0.118 |
| 30412.0 | -0.125 |
| 30413.0 | -0.13 |
| 30414.0 | -0.135 |
| 30415.0 | -0.14 |
| 30416.0 | -0.145 |
| 30417.0 | -0.15 |
| 30418.0 | -0.162 |
| 30419.0 | -0.209 |
| 30420.0 | -0.226 |
| 30421.0 | -0.237 |
| 30422.0 | -0.247 |
| 30423.0 | -0.258 |
| 30424.0 | -0.269 |
| 30425.0 | -0.286 |
| 30426.0 | -0.313 |
| 30427.0 | -0.34 |
| 30428.0 | -0.37 |
| 30429.0 | -0.397 |
| 30430.0 | -0.416 |
| 30431.0 | -0.434 |
| 30432.0 | -0.45 |
| 30433.0 | -0.451 |
| 30434.0 | -0.451 |
| 30435.0 | -0.45 |
| 30436.0 | -0.45 |
| 30437.0 | -0.449 |
| 30438.0 | -0.449 |
| 30439.0 | -0.448 |
| 30440.0 | -0.448 |
| 30441.0 | -0.447 |
| 30442.0 | -0.447 |
| 30443.0 | -0.446 |
| 30444.0 | -0.446 |
| 30445.0 | -0.445 |
| 30446.0 | -0.445 |
| 30447.0 | -0.445 |
| 30448.0 | -0.445 |
| 30449.0 | -0.445 |
| 30450.0 | -0.445 |
| 30451.0 | -0.445 |
| 30452.0 | -0.445 |
| 30453.0 | -0.445 |
| 30454.0 | -0.413 |
| 30455.0 | -0.395 |
| 30456.0 | -0.394 |
| 30457.0 | -0.391 |
| 30458.0 | -0.389 |
| 30459.0 | -0.386 |
| 30460.0 | -0.389 |
| 30461.0 | -0.398 |
| 30462.0 | -0.408 |
| 30463.0 | -0.415 |
| 30464.0 | -0.375 |
| 30465.0 | -0.317 |
| 30466.0 | -0.275 |
| 30467.0 | -0.227 |
| 30468.0 | -0.173 |
| 30469.0 | -0.133 |
| 30470.0 | -0.105 |
| 30471.0 | -0.089 |
| 30472.0 | -0.07 |
| 30473.0 | -0.05 |
| 30474.0 | -0.028 |
| 30475.0 | -0.01 |
| 30476.0 | 0.016 |
| 30477.0 | 0.042 |
| 30478.0 | 0.052 |
| 30479.0 | 0.055 |
| 30480.0 | 0.059 |
| 30481.0 | 0.065 |
| 30482.0 | 0.065 |
| 30483.0 | 0.065 |
| 30484.0 | 0.065 |
| 30485.0 | 0.055 |
| 30486.0 | 0.079 |
| 30487.0 | 0.346 |
| 30488.0 | 0.457 |
| 30489.0 | 0.369 |
| 30490.0 | 0.282 |
| 30491.0 | 0.219 |
| 30492.0 | 0.151 |
| 30493.0 | 0.109 |
| 30494.0 | 0.146 |
| 30495.0 | 0.127 |
| 30496.0 | 0.1 |
| 30497.0 | 0.09 |
| 30498.0 | 0.07 |
| 30499.0 | 0.065 |
| 30500.0 | 0.06 |
| 30501.0 | 0.05 |
| 30502.0 | 0.05 |
| 30503.0 | 0.037 |
| 30504.0 | 0.047 |
| 30505.0 | 0.055 |
| 30506.0 | 0.098 |
| 30507.0 | 0.108 |
| 30508.0 | 0.118 |
| 30509.0 | 0.118 |
| 30510.0 | 0.103 |
| 30511.0 | 0.087 |
| 30512.0 | 0.07 |
| 30513.0 | 0.053 |
| 30514.0 | 0.035 |
| 30515.0 | 0.016 |
| 30516.0 | 0.002 |
| 30517.0 | -0.035 |
| 30518.0 | -0.078 |
| 30519.0 | -0.113 |
| 30520.0 | -0.13 |
| 30521.0 | -0.146 |
| 30522.0 | -0.163 |
| 30523.0 | -0.178 |
| 30524.0 | -0.202 |
| 30525.0 | -0.231 |
| 30526.0 | -0.255 |
| 30527.0 | -0.284 |
| 30528.0 | -0.261 |
| 30529.0 | -0.201 |
| 30530.0 | -0.156 |
| 30531.0 | -0.133 |
| 30532.0 | -0.108 |
| 30533.0 | -0.095 |
| 30534.0 | -0.094 |
| 30535.0 | -0.064 |
| 30536.0 | -0.119 |
| 30537.0 | -0.116 |
| 30538.0 | -0.076 |
| 30539.0 | -0.104 |
| 30540.0 | -0.14 |
| 30541.0 | -0.172 |
| 30542.0 | -0.201 |
| 30543.0 | -0.22 |
| 30544.0 | -0.23 |
| 30545.0 | -0.241 |
| 30546.0 | -0.235 |
| 30547.0 | -0.232 |
| 30548.0 | -0.233 |
| 30549.0 | -0.233 |
| 30550.0 | -0.234 |
| 30551.0 | -0.235 |
| 30552.0 | -0.236 |
| 30553.0 | -0.236 |
| 30554.0 | -0.237 |
| 30555.0 | -0.238 |
| 30556.0 | -0.239 |
| 30557.0 | -0.24 |
| 30558.0 | -0.24 |
| 30559.0 | -0.241 |
| 30560.0 | -0.242 |
| 30561.0 | -0.243 |
| 30562.0 | -0.221 |
| 30563.0 | -0.178 |
| 30564.0 | -0.162 |
| 30565.0 | -0.151 |
| 30566.0 | -0.135 |
| 30567.0 | -0.09 |
| 30568.0 | -0.067 |
| 30569.0 | -0.071 |
| 30570.0 | -0.077 |
| 30571.0 | -0.087 |
| 30572.0 | -0.138 |
| 30573.0 | -0.174 |
| 30574.0 | -0.201 |
| 30575.0 | -0.222 |
| 30576.0 | -0.237 |
| 30577.0 | -0.248 |
| 30578.0 | -0.253 |
| 30579.0 | -0.252 |
| 30580.0 | -0.251 |
| 30581.0 | -0.25 |
| 30582.0 | -0.254 |
| 30583.0 | -0.258 |
| 30584.0 | -0.262 |
| 30585.0 | -0.266 |
| 30586.0 | -0.27 |
| 30587.0 | -0.275 |
| 30588.0 | -0.279 |
| 30589.0 | -0.281 |
| 30590.0 | -0.284 |
| 30591.0 | -0.286 |
| 30592.0 | -0.287 |
| 30593.0 | -0.291 |
| 30594.0 | -0.299 |
| 30595.0 | -0.302 |
| 30596.0 | -0.305 |
| 30597.0 | -0.308 |
| 30598.0 | -0.311 |
| 30599.0 | -0.314 |
| 30600.0 | -0.317 |
| 30601.0 | -0.326 |
| 30602.0 | -0.339 |
| 30603.0 | -0.368 |
| 30604.0 | -0.379 |
| 30605.0 | -0.39 |
| 30606.0 | -0.4 |
| 30607.0 | -0.412 |
| 30608.0 | -0.425 |
| 30609.0 | -0.448 |
| 30610.0 | -0.467 |
| 30611.0 | -0.444 |
| 30612.0 | -0.436 |
| 30613.0 | -0.424 |
| 30614.0 | -0.39 |
| 30615.0 | -0.353 |
| 30616.0 | -0.333 |
| 30617.0 | -0.327 |
| 30618.0 | -0.331 |
| 30619.0 | -0.341 |
| 30620.0 | -0.345 |
| 30621.0 | -0.349 |
| 30622.0 | -0.353 |
| 30623.0 | -0.35 |
| 30624.0 | -0.348 |
| 30625.0 | -0.353 |
| 30626.0 | -0.357 |
| 30627.0 | -0.361 |
| 30628.0 | -0.365 |
| 30629.0 | -0.372 |
| 30630.0 | -0.375 |
| 30631.0 | -0.383 |
| 30632.0 | -0.407 |
| 30633.0 | -0.432 |
| 30634.0 | -0.444 |
| 30635.0 | -0.456 |
| 30636.0 | -0.466 |
| 30637.0 | -0.467 |
| 30638.0 | -0.467 |
| 30639.0 | -0.466 |
| 30640.0 | -0.466 |
| 30641.0 | -0.466 |
| 30642.0 | -0.466 |
| 30643.0 | -0.466 |
| 30644.0 | -0.466 |
| 30645.0 | -0.465 |
| 30646.0 | -0.465 |
| 30647.0 | -0.465 |
| 30648.0 | -0.471 |
| 30649.0 | -0.479 |
| 30650.0 | -0.488 |
| 30651.0 | -0.496 |
| 30652.0 | -0.506 |
| 30653.0 | -0.511 |
| 30654.0 | -0.507 |
| 30655.0 | -0.503 |
| 30656.0 | -0.498 |
| 30657.0 | -0.488 |
| 30658.0 | -0.463 |
| 30659.0 | -0.49 |
| 30660.0 | -0.555 |
| 30661.0 | -0.545 |
| 30662.0 | -0.484 |
| 30663.0 | -0.462 |
| 30664.0 | -0.43 |
| 30665.0 | -0.385 |
| 30666.0 | -0.377 |
| 30667.0 | -0.366 |
| 30668.0 | -0.363 |
| 30669.0 | -0.361 |
| 30670.0 | -0.359 |
| 30671.0 | -0.358 |
| 30672.0 | -0.364 |
| 30673.0 | -0.37 |
| 30674.0 | -0.376 |
| 30675.0 | -0.382 |
| 30676.0 | -0.388 |
| 30677.0 | -0.4 |
| 30678.0 | -0.42 |
| 30679.0 | -0.42 |
| 30680.0 | -0.431 |
| 30681.0 | -0.47 |
| 30682.0 | -0.495 |
| 30683.0 | -0.514 |
| 30684.0 | -0.538 |
| 30685.0 | -0.55 |
| 30686.0 | -0.557 |
| 30687.0 | -0.566 |
| 30688.0 | -0.565 |
| 30689.0 | -0.569 |
| 30690.0 | -0.575 |
| 30691.0 | -0.584 |
| 30692.0 | -0.597 |
| 30693.0 | -0.606 |
| 30694.0 | -0.621 |
| 30695.0 | -0.631 |
| 30696.0 | -0.64 |
| 30697.0 | -0.65 |
| 30698.0 | -0.678 |
| 30699.0 | -0.706 |
| 30700.0 | -0.72 |
| 30701.0 | -0.729 |
| 30702.0 | -0.736 |
| 30703.0 | -0.743 |
| 30704.0 | -0.75 |
| 30705.0 | -0.757 |
| 30706.0 | -0.771 |
| 30707.0 | -0.798 |
| 30708.0 | -0.779 |
| 30709.0 | -0.658 |
| 30710.0 | -0.679 |
| 30711.0 | -0.685 |
| 30712.0 | -0.69 |
| 30713.0 | -0.72 |
| 30714.0 | -0.748 |
| 30715.0 | -0.758 |
| 30716.0 | -0.778 |
| 30717.0 | -0.831 |
| 30718.0 | -0.841 |
| 30719.0 | -0.852 |
| 30720.0 | -0.865 |
| 30721.0 | -0.866 |
| 30722.0 | -0.884 |
| 30723.0 | -0.89 |
| 30724.0 | -0.89 |
| 30725.0 | -0.899 |
| 30726.0 | -0.908 |
| 30727.0 | -0.916 |
| 30728.0 | -0.928 |
| 30729.0 | -0.941 |
| 30730.0 | -0.991 |
| 30731.0 | -1.002 |
| 30732.0 | -1.02 |
| 30733.0 | -1.048 |
| 30734.0 | -1.079 |
| 30735.0 | -1.1 |
| 30736.0 | -1.039 |
| 30737.0 | -1.12 |
| 30738.0 | -1.143 |
| 30739.0 | -1.157 |
| 30740.0 | -1.162 |
| 30741.0 | -1.17 |
| 30742.0 | -1.2 |
| 30743.0 | -1.219 |
| 30744.0 | -1.256 |
| 30745.0 | -1.276 |
| 30746.0 | -1.294 |
| 30747.0 | -1.293 |
| 30748.0 | -1.271 |
| 30749.0 | -1.218 |
| 30750.0 | -1.206 |
| 30751.0 | -1.209 |
| 30752.0 | -1.225 |
| 30753.0 | -1.233 |
| 30754.0 | -1.24 |
| 30755.0 | -1.251 |
| 30756.0 | -1.252 |
| 30757.0 | -1.263 |
| 30758.0 | -1.248 |
| 30759.0 | -1.079 |
| 30760.0 | -1.011 |
| 30761.0 | -1.001 |
| 30762.0 | -0.995 |
| 30763.0 | -0.99 |
| 30764.0 | -0.988 |
| 30765.0 | -0.988 |
| 30766.0 | -0.987 |
| 30767.0 | -0.986 |
| 30768.0 | -0.992 |
| 30769.0 | -1.001 |
| 30770.0 | -1.006 |
| 30771.0 | -1.019 |
| 30772.0 | -1.045 |
| 30773.0 | -1.052 |
| 30774.0 | -1.059 |
| 30775.0 | -1.068 |
| 30776.0 | -1.08 |
| 30777.0 | -1.091 |
| 30778.0 | -1.101 |
| 30779.0 | -1.109 |
| 30780.0 | -1.117 |
| 30781.0 | -1.125 |
| 30782.0 | -1.125 |
| 30783.0 | -1.09 |
| 30784.0 | -1.084 |
| 30785.0 | -1.082 |
| 30786.0 | -1.096 |
| 30787.0 | -1.116 |
| 30788.0 | -1.125 |
| 30789.0 | -1.129 |
| 30790.0 | -1.133 |
| 30791.0 | -1.137 |
| 30792.0 | -1.147 |
| 30793.0 | -1.162 |
| 30794.0 | -1.181 |
| 30795.0 | -1.197 |
| 30796.0 | -1.202 |
| 30797.0 | -1.206 |
| 30798.0 | -1.212 |
| 30799.0 | -1.221 |
| 30800.0 | -1.228 |
| 30801.0 | -1.229 |
| 30802.0 | -1.182 |
| 30803.0 | -1.122 |
| 30804.0 | -1.087 |
| 30805.0 | -1.076 |
| 30806.0 | -1.066 |
| 30807.0 | -1.051 |
| 30808.0 | -0.958 |
| 30809.0 | -0.865 |
| 30810.0 | -0.829 |
| 30811.0 | -0.816 |
| 30812.0 | -0.803 |
| 30813.0 | -0.791 |
| 30814.0 | -0.785 |
| 30815.0 | -0.775 |
| 30816.0 | -0.768 |
| 30817.0 | -0.763 |
| 30818.0 | -0.759 |
| 30819.0 | -0.755 |
| 30820.0 | -0.751 |
| 30821.0 | -0.747 |
| 30822.0 | -0.742 |
| 30823.0 | -0.738 |
| 30824.0 | -0.734 |
| 30825.0 | -0.729 |
| 30826.0 | -0.719 |
| 30827.0 | -0.702 |
| 30828.0 | -0.663 |
| 30829.0 | -0.626 |
| 30830.0 | -0.59 |
| 30831.0 | -0.571 |
| 30832.0 | -0.544 |
| 30833.0 | -0.519 |
| 30834.0 | -0.504 |
| 30835.0 | -0.496 |
| 30836.0 | -0.485 |
| 30837.0 | -0.476 |
| 30838.0 | -0.469 |
| 30839.0 | -0.462 |
| 30840.0 | -0.45 |
| 30841.0 | -0.436 |
| 30842.0 | -0.4 |
| 30843.0 | -0.385 |
| 30844.0 | -0.374 |
| 30845.0 | -0.363 |
| 30846.0 | -0.362 |
| 30847.0 | -0.362 |
| 30848.0 | -0.363 |
| 30849.0 | -0.363 |
| 30850.0 | -0.369 |
| 30851.0 | -0.377 |
| 30852.0 | -0.385 |
| 30853.0 | -0.393 |
| 30854.0 | -0.399 |
| 30855.0 | -0.404 |
| 30856.0 | -0.405 |
| 30857.0 | -0.4 |
| 30858.0 | -0.4 |
| 30859.0 | -0.407 |
| 30860.0 | -0.413 |
| 30861.0 | -0.419 |
| 30862.0 | -0.425 |
| 30863.0 | -0.431 |
| 30864.0 | -0.415 |
| 30865.0 | -0.392 |
| 30866.0 | -0.394 |
| 30867.0 | -0.406 |
| 30868.0 | -0.414 |
| 30869.0 | -0.416 |
| 30870.0 | -0.426 |
| 30871.0 | -0.437 |
| 30872.0 | -0.427 |
| 30873.0 | -0.416 |
| 30874.0 | -0.413 |
| 30875.0 | -0.398 |
| 30876.0 | -0.373 |
| 30877.0 | -0.36 |
| 30878.0 | -0.36 |
| 30879.0 | -0.361 |
| 30880.0 | -0.358 |
| 30881.0 | -0.354 |
| 30882.0 | -0.35 |
| 30883.0 | -0.347 |
| 30884.0 | -0.325 |
| 30885.0 | -0.254 |
| 30886.0 | -0.233 |
| 30887.0 | -0.226 |
| 30888.0 | -0.219 |
| 30889.0 | -0.219 |
| 30890.0 | -0.22 |
| 30891.0 | -0.221 |
| 30892.0 | -0.203 |
| 30893.0 | -0.166 |
| 30894.0 | -0.147 |
| 30895.0 | -0.144 |
| 30896.0 | -0.142 |
| 30897.0 | -0.138 |
| 30898.0 | -0.129 |
| 30899.0 | -0.12 |
| 30900.0 | -0.115 |
| 30901.0 | -0.112 |
| 30902.0 | -0.109 |
| 30903.0 | -0.106 |
| 30904.0 | -0.103 |
| 30905.0 | -0.1 |
| 30906.0 | -0.097 |
| 30907.0 | -0.088 |
| 30908.0 | -0.075 |
| 30909.0 | -0.051 |
| 30910.0 | -0.018 |
| 30911.0 | 0.012 |
| 30912.0 | 0.021 |
| 30913.0 | 0.026 |
| 30914.0 | 0.032 |
| 30915.0 | 0.037 |
| 30916.0 | 0.042 |
| 30917.0 | 0.039 |
| 30918.0 | 0.032 |
| 30919.0 | 0.025 |
| 30920.0 | 0.02 |
| 30921.0 | 0.017 |
| 30922.0 | 0.002 |
| 30923.0 | -0.025 |
| 30924.0 | -0.053 |
| 30925.0 | -0.066 |
| 30926.0 | -0.076 |
| 30927.0 | -0.084 |
| 30928.0 | -0.098 |
| 30929.0 | -0.103 |
| 30930.0 | -0.106 |
| 30931.0 | -0.109 |
| 30932.0 | -0.112 |
| 30933.0 | -0.109 |
| 30934.0 | -0.108 |
| 30935.0 | -0.104 |
| 30936.0 | -0.109 |
| 30937.0 | -0.105 |
| 30938.0 | -0.104 |
| 30939.0 | -0.105 |
| 30940.0 | -0.103 |
| 30941.0 | -0.09 |
| 30942.0 | -0.091 |
| 30943.0 | -0.083 |
| 30944.0 | -0.084 |
| 30945.0 | -0.087 |
| 30946.0 | -0.1 |
| 30947.0 | -0.105 |
| 30948.0 | -0.1 |
| 30949.0 | -0.106 |
| 30950.0 | -0.115 |
| 30951.0 | -0.119 |
| 30952.0 | -0.092 |
| 30953.0 | -0.124 |
| 30954.0 | -0.132 |
| 30955.0 | -0.135 |
| 30956.0 | -0.139 |
| 30957.0 | -0.155 |
| 30958.0 | -0.134 |
| 30959.0 | -0.11 |
| 30960.0 | -0.097 |
| 30961.0 | -0.095 |
| 30962.0 | -0.061 |
| 30963.0 | -0.027 |
| 30964.0 | 0.007 |
| 30965.0 | 0.019 |
| 30966.0 | 0.022 |
| 30967.0 | 0.029 |
| 30968.0 | 0.028 |
| 30969.0 | 0.028 |
| 30970.0 | 0.036 |
| 30971.0 | 0.042 |
| 30972.0 | 0.041 |
| 30973.0 | 0.037 |
| 30974.0 | 0.022 |
| 30975.0 | 0.02 |
| 30976.0 | 0.011 |
| 30977.0 | 0.005 |
| 30978.0 | 0.025 |
| 30979.0 | 0.044 |
| 30980.0 | 0.042 |
| 30981.0 | 0.032 |
| 30982.0 | 0.006 |
| 30983.0 | -0.007 |
| 30984.0 | -0.022 |
| 30985.0 | -0.056 |
| 30986.0 | -0.068 |
| 30987.0 | -0.082 |
| 30988.0 | -0.099 |
| 30989.0 | -0.105 |
| 30990.0 | -0.11 |
| 30991.0 | -0.123 |
| 30992.0 | -0.133 |
| 30993.0 | -0.141 |
| 30994.0 | -0.148 |
| 30995.0 | -0.152 |
| 30996.0 | -0.161 |
| 30997.0 | -0.174 |
| 30998.0 | -0.208 |
| 30999.0 | -0.239 |
| 31000.0 | -0.217 |
| 31001.0 | -0.224 |
| 31002.0 | -0.259 |
| 31003.0 | -0.261 |
| 31004.0 | -0.257 |
| 31005.0 | -0.278 |
| 31006.0 | -0.255 |
| 31007.0 | -0.243 |
| 31008.0 | -0.245 |
| 31009.0 | -0.251 |
| 31010.0 | -0.257 |
| 31011.0 | -0.279 |
| 31012.0 | -0.295 |
| 31013.0 | -0.307 |
| 31014.0 | -0.317 |
| 31015.0 | -0.351 |
| 31016.0 | -0.363 |
| 31017.0 | -0.379 |
| 31018.0 | -0.388 |
| 31019.0 | -0.405 |
| 31020.0 | -0.41 |
| 31021.0 | -0.415 |
| 31022.0 | -0.419 |
| 31023.0 | -0.431 |
| 31024.0 | -0.441 |
| 31025.0 | -0.449 |
| 31026.0 | -0.457 |
| 31027.0 | -0.456 |
| 31028.0 | -0.46 |
| 31029.0 | -0.467 |
| 31030.0 | -0.467 |
| 31031.0 | -0.477 |
| 31032.0 | -0.48 |
| 31033.0 | -0.49 |
| 31034.0 | -0.505 |
| 31035.0 | -0.511 |
| 31036.0 | -0.524 |
| 31037.0 | -0.534 |
| 31038.0 | -0.548 |
| 31039.0 | -0.567 |
| 31040.0 | -0.559 |
| 31041.0 | -0.579 |
| 31042.0 | -0.597 |
| 31043.0 | -0.614 |
| 31044.0 | -0.649 |
| 31045.0 | -0.674 |
| 31046.0 | -0.674 |
| 31047.0 | -0.683 |
| 31048.0 | -0.686 |
| 31049.0 | -0.689 |
| 31050.0 | -0.693 |
| 31051.0 | -0.71 |
| 31052.0 | -0.72 |
| 31053.0 | -0.75 |
| 31054.0 | -0.771 |
| 31055.0 | -0.781 |
| 31056.0 | -0.796 |
| 31057.0 | -0.811 |
| 31058.0 | -0.801 |
| 31059.0 | -0.822 |
| 31060.0 | 0 |
| 31061.0 | 0 |
| 31062.0 | 0 |
| 31063.0 | 0 |
| 31064.0 | 0 |
| 31065.0 | 0 |
| 31066.0 | 0 |
| 31067.0 | 0 |
| 31068.0 | 0 |
| 31069.0 | 0 |
| 31070.0 | 0 |
| 31071.0 | 0 |
| 31072.0 | 0 |
| 31073.0 | 0 |
| 31074.0 | 0 |
| 31075.0 | 0 |
| 31076.0 | 0 |
| 31077.0 | 0 |
| 31078.0 | 0 |
| 31079.0 | 0 |
| 31080.0 | 0 |
| 31081.0 | 0 |
| 31082.0 | 0 |
| 31083.0 | 0 |
| 31084.0 | 0 |
| 31085.0 | 0 |
| 31086.0 | 0 |
| 31087.0 | 0 |
| 31088.0 | 0 |
| 31089.0 | 0 |
| 31090.0 | 0 |
| 31091.0 | 0 |
| 31092.0 | 0 |
| 31093.0 | 0 |
| 31094.0 | 0 |
| 31095.0 | 0 |
| 31096.0 | 0 |
| 31097.0 | 0 |
| 31098.0 | 0 |
| 31099.0 | 0 |
| 31100.0 | 0 |
| 31101.0 | 0 |
| 31102.0 | 0 |
| 31103.0 | 0 |
| 31104.0 | 0 |
| 31105.0 | 0 |
| 31106.0 | 0 |
| 31107.0 | 0 |
| 31108.0 | 0 |
| 31109.0 | 0 |
| 31110.0 | 0 |
| 31111.0 | 0 |
| 31112.0 | 0 |
| 31113.0 | 0 |
| 31114.0 | 0 |
| 31115.0 | 0 |
| 31116.0 | 0 |
| 31117.0 | 0 |
| 31118.0 | 0 |
| 31119.0 | 0 |
| 31120.0 | 0 |
| 31121.0 | 0 |
| 31122.0 | 0 |
| 31123.0 | 0 |
| 31124.0 | 0 |
| 31125.0 | 0 |
| 31126.0 | 0 |
| 31127.0 | 0 |
| 31128.0 | 0 |
| 31129.0 | 0 |
| 31130.0 | 0 |
| 31131.0 | 0 |
| 31132.0 | 0 |
| 31133.0 | 0 |
| 31134.0 | 0 |
| 31135.0 | 0 |
| 31136.0 | 0 |
| 31137.0 | 0 |
| 31138.0 | 0 |
| 31139.0 | 0 |
| 31140.0 | 0 |
| 31141.0 | 0 |
| 31142.0 | 0 |
| 31143.0 | 0 |
| 31144.0 | 0 |
| 31145.0 | 0 |
| 31146.0 | 0 |
| 31147.0 | 0 |
| 31148.0 | 0 |
| 31149.0 | 0 |
| 31150.0 | 0 |
| 31151.0 | 0 |
| 31152.0 | 0 |
| 31153.0 | 0 |
| 31154.0 | 0 |
| 31155.0 | 0 |
| 31156.0 | 0 |
| 31157.0 | 0 |
| 31158.0 | 0 |
| 31159.0 | 0 |
| 31160.0 | 0 |
| 31161.0 | 0 |
| 31162.0 | 0 |
| 31163.0 | 0 |
| 31164.0 | 0 |
| 31165.0 | 0 |
| 31166.0 | 0 |
| 31167.0 | 0 |
| 31168.0 | 0 |
| 31169.0 | 0 |
| 31170.0 | 0 |
| 31171.0 | 0 |
| 31172.0 | 0 |
| 31173.0 | 0 |
| 31174.0 | 0 |
| 31175.0 | 0 |
| 31176.0 | 0 |
| 31177.0 | 0 |
| 31178.0 | 0 |
| 31179.0 | 0 |
| 31180.0 | 0 |
| 31181.0 | 0 |
| 31182.0 | 0 |
| 31183.0 | 0 |
| 31184.0 | 0 |
| 31185.0 | 0 |
| 31186.0 | 0 |
| 31187.0 | 0 |
| 31188.0 | 0 |
| 31189.0 | 0 |
| 31190.0 | 0 |
| 31191.0 | 0 |
| 31192.0 | 0 |
| 31193.0 | 0 |
| 31194.0 | 0 |
| 31195.0 | 0 |
| 31196.0 | 0 |
| 31197.0 | 0 |
| 31198.0 | 0 |
| 31199.0 | 0 |
| 31200.0 | 0 |
| 31201.0 | 0 |
| 31202.0 | 0 |
| 31203.0 | 0 |
| 31204.0 | 0 |
| 31205.0 | 0 |
| 31206.0 | 0 |
| 31207.0 | 0 |
| 31208.0 | 0 |
| 31209.0 | 0 |
| 31210.0 | 0 |
| 31211.0 | 0 |
| 31212.0 | 0 |
| 31213.0 | 0 |
| 31214.0 | 0 |
| 31215.0 | 0 |
| 31216.0 | 0 |
| 31217.0 | 0 |
| 31218.0 | 0 |
| 31219.0 | 0 |
| 31220.0 | 0 |
| 31221.0 | 0 |
| 31222.0 | 0 |
| 31223.0 | 0 |
| 31224.0 | 0 |
| 31225.0 | 0 |
| 31226.0 | 0 |
| 31227.0 | 0 |
| 31228.0 | 0 |
| 31229.0 | 0 |
| 31230.0 | 0 |
| 31231.0 | 0 |
| 31232.0 | 0 |
| 31233.0 | 0 |
| 31234.0 | 0 |
| 31235.0 | 0 |
| 31236.0 | 0 |
| 31237.0 | 0 |
| 31238.0 | 0 |
| 31239.0 | 0 |
| 31240.0 | 0 |
| 31241.0 | 0 |
| 31242.0 | 0 |
| 31243.0 | 0 |
| 31244.0 | 0 |
| 31245.0 | 0 |
| 31246.0 | 0 |
| 31247.0 | 0 |
| 31248.0 | 0 |
| 31249.0 | 0 |
| 31250.0 | 0 |
| 31251.0 | 0 |
| 31252.0 | 0 |
| 31253.0 | 0 |
| 31254.0 | 0 |
| 31255.0 | 0 |
| 31256.0 | 0 |
| 31257.0 | 0 |
| 31258.0 | 0 |
| 31259.0 | 0 |
| 31260.0 | 0 |
| 31261.0 | 0 |
| 31262.0 | 0 |
| 31263.0 | 0 |
| 31264.0 | 0 |
| 31265.0 | 0 |
| 31266.0 | 0 |
| 31267.0 | 0 |
| 31268.0 | 0 |
| 31269.0 | 0 |
| 31270.0 | 0 |
| 31271.0 | 0 |
| 31272.0 | 0 |
| 31273.0 | 0 |
| 31274.0 | 0 |
| 31275.0 | 0 |
| 31276.0 | 0 |
| 31277.0 | 0 |
| 31278.0 | 0 |
| 31279.0 | 0 |
| 31280.0 | 0 |
| 31281.0 | 0 |
| 31282.0 | 0 |
| 31283.0 | 0 |
| 31284.0 | 0 |
| 31285.0 | 0 |
| 31286.0 | 0 |
| 31287.0 | 0 |
| 31288.0 | 0 |
| 31289.0 | 0 |
| 31290.0 | 0 |
| 31291.0 | 0 |
| 31292.0 | 0 |
| 31293.0 | 0 |
| 31294.0 | 0 |
| 31295.0 | 0 |
| 31296.0 | 0 |
| 31297.0 | 0 |
| 31298.0 | 0 |
| 31299.0 | 0 |
| 31300.0 | 0 |
| 31301.0 | 0 |
| 31302.0 | 0 |
| 31303.0 | 0 |
| 31304.0 | 0 |
| 31305.0 | 0 |
| 31306.0 | 0 |
| 31307.0 | 0 |
| 31308.0 | 0 |
| 31309.0 | 0 |
| 31310.0 | 0 |
| 31311.0 | 0 |
| 31312.0 | 0 |
| 31313.0 | 0 |
| 31314.0 | 0 |
| 31315.0 | 0 |
| 31316.0 | 0 |
| 31317.0 | 0 |
| 31318.0 | 0 |
| 31319.0 | 0 |
| 31320.0 | 0 |
| 31321.0 | 0 |
| 31322.0 | 0 |
| 31323.0 | 0 |
| 31324.0 | 0 |
| 31325.0 | 0 |
| 31326.0 | 0 |
| 31327.0 | 0 |
| 31328.0 | 0 |
| 31329.0 | 0 |
| 31330.0 | 0 |
| 31331.0 | 0 |
| 31332.0 | 0 |
| 31333.0 | 0 |
| 31334.0 | 0 |
| 31335.0 | 0 |
| 31336.0 | 0 |
| 31337.0 | 0 |
| 31338.0 | 0 |
| 31339.0 | 0 |
| 31340.0 | 0 |
| 31341.0 | 0 |
| 31342.0 | 0 |
| 31343.0 | 0 |
| 31344.0 | 0 |
| 31345.0 | 0 |
| 31346.0 | 0 |
| 31347.0 | 0 |
| 31348.0 | 0 |
| 31349.0 | 0 |
| 31350.0 | 0 |
| 31351.0 | 0 |
| 31352.0 | 0 |
| 31353.0 | 0 |
| 31354.0 | 0 |
| 31355.0 | 0 |
| 31356.0 | 0 |
| 31357.0 | 0 |
| 31358.0 | 0 |
| 31359.0 | 0 |
| 31360.0 | 0 |
| 31361.0 | 0 |
| 31362.0 | 0 |
| 31363.0 | 0 |
| 31364.0 | 0 |
| 31365.0 | 0 |
| 31366.0 | 0 |
| 31367.0 | 0 |
| 31368.0 | 0 |
| 31369.0 | 0 |
| 31370.0 | 0 |
| 31371.0 | 0 |
| 31372.0 | 0 |
| 31373.0 | 0 |
| 31374.0 | 0 |
| 31375.0 | 0 |
| 31376.0 | 0 |
| 31377.0 | 0 |
| 31378.0 | 0 |
| 31379.0 | 0 |
| 31380.0 | 0 |
| 31381.0 | 0 |
| 31382.0 | 0 |
| 31383.0 | 0 |
| 31384.0 | 0 |
| 31385.0 | 0 |
| 31386.0 | 0 |
| 31387.0 | 0 |
| 31388.0 | 0 |
| 31389.0 | 0 |
| 31390.0 | 0 |
| 31391.0 | 0 |
| 31392.0 | 0 |
| 31393.0 | 0 |
| 31394.0 | 0 |
| 31395.0 | 0 |
| 31396.0 | 0 |
| 31397.0 | 0 |
| 31398.0 | 0 |
| 31399.0 | 0 |
| 31400.0 | 0 |
| 31401.0 | 0 |
| 31402.0 | 0 |
| 31403.0 | 0 |
| 31404.0 | 0 |
| 31405.0 | 0 |
| 31406.0 | 0 |
| 31407.0 | 0 |
| 31408.0 | 0 |
| 31409.0 | 0 |
| 31410.0 | 0 |
| 31411.0 | 0 |
| 31412.0 | 0 |
| 31413.0 | 0 |
| 31414.0 | 0 |
| 31415.0 | 0 |
| 31416.0 | 0 |
| 31417.0 | 0 |
| 31418.0 | 0 |
| 31419.0 | -1.083 |
| 31420.0 | -1.09 |
| 31421.0 | -1.095 |
| 31422.0 | -1.1 |
| 31423.0 | -1.106 |
| 31424.0 | -1.111 |
| 31425.0 | -1.116 |
| 31426.0 | -1.122 |
| 31427.0 | -1.134 |
| 31428.0 | -1.147 |
| 31429.0 | -1.159 |
| 31430.0 | -1.172 |
| 31431.0 | -1.187 |
| 31432.0 | -1.201 |
| 31433.0 | -1.216 |
| 31434.0 | -1.229 |
| 31435.0 | -1.24 |
| 31436.0 | -1.25 |
| 31437.0 | -1.26 |
| 31438.0 | -1.269 |
| 31439.0 | -1.279 |
| 31440.0 | -1.29 |
| 31441.0 | -1.304 |
| 31442.0 | -1.318 |
| 31443.0 | -1.333 |
| 31444.0 | -1.347 |
| 31445.0 | -1.362 |
| 31446.0 | -1.376 |
| 31447.0 | -1.391 |
| 31448.0 | -1.408 |
| 31449.0 | -1.425 |
| 31450.0 | -1.442 |
| 31451.0 | -1.458 |
| 31452.0 | -1.475 |
| 31453.0 | -1.492 |
| 31454.0 | -1.506 |
| 31455.0 | -1.5 |
| 31456.0 | -1.491 |
| 31457.0 | -1.481 |
| 31458.0 | -1.468 |
| 31459.0 | -1.455 |
| 31460.0 | -1.441 |
| 31461.0 | -1.43 |
| 31462.0 | -1.439 |
| 31463.0 | -1.45 |
| 31464.0 | -1.462 |
| 31465.0 | -1.474 |
| 31466.0 | -1.486 |
| 31467.0 | -1.497 |
| 31468.0 | -1.503 |
| 31469.0 | -1.446 |
| 31470.0 | -1.259 |
| 31471.0 | -1.197 |
| 31472.0 | -1.165 |
| 31473.0 | -1.162 |
| 31474.0 | -1.164 |
| 31475.0 | -1.166 |
| 31476.0 | -1.169 |
| 31477.0 | -1.177 |
| 31478.0 | -1.185 |
| 31479.0 | -1.193 |
| 31480.0 | -1.202 |
| 31481.0 | -1.211 |
| 31482.0 | -1.218 |
| 31483.0 | -1.222 |
| 31484.0 | -1.224 |
| 31485.0 | -1.226 |
| 31486.0 | -1.223 |
| 31487.0 | -1.219 |
| 31488.0 | -1.215 |
| 31489.0 | -1.211 |
| 31490.0 | -1.207 |
| 31491.0 | -1.201 |
| 31492.0 | -1.197 |
| 31493.0 | -1.201 |
| 31494.0 | -1.208 |
| 31495.0 | -1.218 |
| 31496.0 | -1.224 |
| 31497.0 | -1.232 |
| 31498.0 | -1.24 |
| 31499.0 | -1.249 |
| 31500.0 | -1.257 |
| 31501.0 | -1.261 |
| 31502.0 | -1.231 |
| 31503.0 | -1.195 |
| 31504.0 | -1.162 |
| 31505.0 | -1.139 |
| 31506.0 | -1.118 |
| 31507.0 | -1.097 |
| 31508.0 | -1.076 |
| 31509.0 | -1.055 |
| 31510.0 | -1.035 |
| 31511.0 | -1.021 |
| 31512.0 | -1.008 |
| 31513.0 | -0.988 |
| 31514.0 | -0.929 |
| 31515.0 | -0.864 |
| 31516.0 | -0.798 |
| 31517.0 | -0.739 |
| 31518.0 | -0.719 |
| 31519.0 | -0.704 |
| 31520.0 | -0.689 |
| 31521.0 | -0.675 |
| 31522.0 | -0.66 |
| 31523.0 | -0.647 |
| 31524.0 | -0.642 |
| 31525.0 | -0.639 |
| 31526.0 | -0.638 |
| 31527.0 | -0.64 |
| 31528.0 | -0.643 |
| 31529.0 | -0.645 |
| 31530.0 | -0.648 |
| 31531.0 | -0.649 |
| 31532.0 | -0.644 |
| 31533.0 | -0.637 |
| 31534.0 | -0.631 |
| 31535.0 | -0.627 |
| 31536.0 | -0.623 |
| 31537.0 | -0.619 |
| 31538.0 | -0.616 |
| 31539.0 | -0.619 |
| 31540.0 | -0.624 |
| 31541.0 | -0.635 |
| 31542.0 | -0.647 |
| 31543.0 | -0.658 |
| 31544.0 | -0.67 |
| 31545.0 | -0.682 |
| 31546.0 | -0.696 |
| 31547.0 | -0.707 |
| 31548.0 | -0.717 |
| 31549.0 | -0.727 |
| 31550.0 | -0.735 |
| 31551.0 | -0.733 |
| 31552.0 | -0.727 |
| 31553.0 | -0.703 |
| 31554.0 | -0.668 |
| 31555.0 | -0.67 |
| 31556.0 | -0.679 |
| 31557.0 | -0.687 |
| 31558.0 | -0.696 |
| 31559.0 | -0.705 |
| 31560.0 | -0.71 |
| 31561.0 | -0.716 |
| 31562.0 | -0.719 |
| 31563.0 | -0.707 |
| 31564.0 | -0.68 |
| 31565.0 | -0.652 |
| 31566.0 | -0.629 |
| 31567.0 | -0.64 |
| 31568.0 | -0.643 |
| 31569.0 | -0.643 |
| 31570.0 | -0.644 |
| 31571.0 | -0.645 |
| 31572.0 | -0.645 |
| 31573.0 | -0.642 |
| 31574.0 | -0.615 |
| 31575.0 | -0.586 |
| 31576.0 | -0.571 |
| 31577.0 | -0.557 |
| 31578.0 | -0.546 |
| 31579.0 | -0.546 |
| 31580.0 | -0.546 |
| 31581.0 | -0.535 |
| 31582.0 | -0.522 |
| 31583.0 | -0.509 |
| 31584.0 | -0.497 |
| 31585.0 | -0.484 |
| 31586.0 | -0.471 |
| 31587.0 | -0.46 |
| 31588.0 | -0.461 |
| 31589.0 | -0.464 |
| 31590.0 | -0.467 |
| 31591.0 | -0.469 |
| 31592.0 | -0.472 |
| 31593.0 | -0.475 |
| 31594.0 | -0.478 |
| 31595.0 | -0.483 |
| 31596.0 | -0.488 |
| 31597.0 | -0.493 |
| 31598.0 | -0.498 |
| 31599.0 | -0.503 |
| 31600.0 | -0.508 |
| 31601.0 | -0.514 |
| 31602.0 | -0.527 |
| 31603.0 | -0.541 |
| 31604.0 | -0.555 |
| 31605.0 | -0.569 |
| 31606.0 | -0.583 |
| 31607.0 | -0.597 |
| 31608.0 | -0.611 |
| 31609.0 | -0.622 |
| 31610.0 | -0.633 |
| 31611.0 | -0.644 |
| 31612.0 | -0.656 |
| 31613.0 | -0.667 |
| 31614.0 | -0.678 |
| 31615.0 | -0.687 |
| 31616.0 | -0.686 |
| 31617.0 | -0.683 |
| 31618.0 | -0.681 |
| 31619.0 | -0.679 |
| 31620.0 | -0.681 |
| 31621.0 | -0.683 |
| 31622.0 | -0.685 |
| 31623.0 | -0.679 |
| 31624.0 | -0.671 |
| 31625.0 | -0.664 |
| 31626.0 | -0.657 |
| 31627.0 | -0.65 |
| 31628.0 | -0.642 |
| 31629.0 | -0.632 |
| 31630.0 | -0.607 |
| 31631.0 | -0.58 |
| 31632.0 | -0.552 |
| 31633.0 | -0.525 |
| 31634.0 | -0.497 |
| 31635.0 | -0.47 |
| 31636.0 | -0.444 |
| 31637.0 | -0.428 |
| 31638.0 | -0.417 |
| 31639.0 | -0.417 |
| 31640.0 | -0.42 |
| 31641.0 | -0.422 |
| 31642.0 | -0.425 |
| 31643.0 | -0.426 |
| 31644.0 | -0.42 |
| 31645.0 | -0.412 |
| 31646.0 | -0.405 |
| 31647.0 | -0.398 |
| 31648.0 | -0.391 |
| 31649.0 | -0.383 |
| 31650.0 | -0.378 |
| 31651.0 | -0.382 |
| 31652.0 | -0.388 |
| 31653.0 | -0.395 |
| 31654.0 | -0.401 |
| 31655.0 | -0.406 |
| 31656.0 | -0.405 |
| 31657.0 | -0.404 |
| 31658.0 | -0.411 |
| 31659.0 | -0.419 |
| 31660.0 | -0.427 |
| 31661.0 | -0.429 |
| 31662.0 | -0.391 |
| 31663.0 | -0.348 |
| 31664.0 | -0.309 |
| 31665.0 | -0.3 |
| 31666.0 | -0.297 |
| 31667.0 | -0.294 |
| 31668.0 | -0.295 |
| 31669.0 | -0.297 |
| 31670.0 | -0.299 |
| 31671.0 | -0.302 |
| 31672.0 | -0.313 |
| 31673.0 | -0.326 |
| 31674.0 | -0.338 |
| 31675.0 | -0.35 |
| 31676.0 | -0.362 |
| 31677.0 | -0.375 |
| 31678.0 | -0.386 |
| 31679.0 | -0.393 |
| 31680.0 | -0.399 |
| 31681.0 | -0.405 |
| 31682.0 | -0.412 |
| 31683.0 | -0.418 |
| 31684.0 | -0.424 |
| 31685.0 | -0.43 |
| 31686.0 | -0.438 |
| 31687.0 | -0.447 |
| 31688.0 | -0.455 |
| 31689.0 | -0.463 |
| 31690.0 | -0.471 |
| 31691.0 | -0.48 |
| 31692.0 | -0.488 |
| 31693.0 | -0.496 |
| 31694.0 | -0.504 |
| 31695.0 | -0.513 |
| 31696.0 | -0.521 |
| 31697.0 | -0.529 |
| 31698.0 | -0.538 |
| 31699.0 | -0.546 |
| 31700.0 | -0.554 |
| 31701.0 | -0.562 |
| 31702.0 | -0.571 |
| 31703.0 | -0.579 |
| 31704.0 | -0.587 |
| 31705.0 | -0.596 |
| 31706.0 | -0.604 |
| 31707.0 | -0.612 |
| 31708.0 | -0.62 |
| 31709.0 | -0.629 |
| 31710.0 | -0.637 |
| 31711.0 | -0.645 |
| 31712.0 | -0.654 |
| 31713.0 | -0.662 |
| 31714.0 | -0.67 |
| 31715.0 | -0.678 |
| 31716.0 | -0.687 |
| 31717.0 | -0.695 |
| 31718.0 | -0.703 |
| 31719.0 | -0.711 |
| 31720.0 | -0.72 |
| 31721.0 | -0.728 |
| 31722.0 | -0.739 |
| 31723.0 | -0.75 |
| 31724.0 | -0.761 |
| 31725.0 | -0.773 |
| 31726.0 | -0.784 |
| 31727.0 | -0.793 |
| 31728.0 | -0.794 |
| 31729.0 | -0.793 |
| 31730.0 | -0.792 |
| 31731.0 | -0.79 |
| 31732.0 | -0.789 |
| 31733.0 | -0.788 |
| 31734.0 | -0.786 |
| 31735.0 | -0.779 |
| 31736.0 | -0.77 |
| 31737.0 | -0.762 |
| 31738.0 | -0.753 |
| 31739.0 | -0.745 |
| 31740.0 | -0.736 |
| 31741.0 | -0.722 |
| 31742.0 | -0.67 |
| 31743.0 | -0.613 |
| 31744.0 | -0.555 |
| 31745.0 | -0.497 |
| 31746.0 | -0.439 |
| 31747.0 | -0.382 |
| 31748.0 | -0.331 |
| 31749.0 | -0.319 |
| 31750.0 | -0.315 |
| 31751.0 | -0.31 |
| 31752.0 | -0.305 |
| 31753.0 | -0.301 |
| 31754.0 | -0.298 |
| 31755.0 | -0.304 |
| 31756.0 | -0.313 |
| 31757.0 | -0.322 |
| 31758.0 | -0.33 |
| 31759.0 | -0.338 |
| 31760.0 | -0.347 |
| 31761.0 | -0.355 |
| 31762.0 | -0.364 |
| 31763.0 | -0.376 |
| 31764.0 | -0.387 |
| 31765.0 | -0.399 |
| 31766.0 | -0.41 |
| 31767.0 | -0.422 |
| 31768.0 | -0.433 |
| 31769.0 | -0.445 |
| 31770.0 | -0.453 |
| 31771.0 | -0.461 |
| 31772.0 | -0.469 |
| 31773.0 | -0.477 |
| 31774.0 | -0.485 |
| 31775.0 | -0.493 |
| 31776.0 | -0.5 |
| 31777.0 | -0.497 |
| 31778.0 | -0.493 |
| 31779.0 | -0.49 |
| 31780.0 | -0.486 |
| 31781.0 | -0.482 |
| 31782.0 | -0.48 |
| 31783.0 | -0.489 |
| 31784.0 | -0.503 |
| 31785.0 | -0.517 |
| 31786.0 | -0.531 |
| 31787.0 | -0.545 |
| 31788.0 | -0.559 |
| 31789.0 | -0.573 |
| 31790.0 | -0.587 |
| 31791.0 | -0.599 |
| 31792.0 | -0.612 |
| 31793.0 | -0.624 |
| 31794.0 | -0.637 |
| 31795.0 | -0.649 |
| 31796.0 | -0.662 |
| 31797.0 | -0.673 |
| 31798.0 | -0.682 |
| 31799.0 | -0.686 |
| 31800.0 | -0.67 |
| 31801.0 | -0.651 |
| 31802.0 | -0.633 |
| 31803.0 | -0.614 |
| 31804.0 | -0.597 |
| 31805.0 | -0.594 |
| 31806.0 | -0.592 |
| 31807.0 | -0.592 |
| 31808.0 | -0.601 |
| 31809.0 | -0.611 |
| 31810.0 | -0.621 |
| 31811.0 | -0.629 |
| 31812.0 | -0.627 |
| 31813.0 | -0.623 |
| 31814.0 | -0.619 |
| 31815.0 | -0.615 |
| 31816.0 | -0.611 |
| 31817.0 | -0.607 |
| 31818.0 | -0.605 |
| 31819.0 | -0.611 |
| 31820.0 | -0.613 |
| 31821.0 | -0.577 |
| 31822.0 | -0.532 |
| 31823.0 | -0.459 |
| 31824.0 | -0.382 |
| 31825.0 | -0.31 |
| 31826.0 | -0.261 |
| 31827.0 | -0.192 |
| 31828.0 | -0.156 |
| 31829.0 | -0.148 |
| 31830.0 | -0.145 |
| 31831.0 | -0.148 |
| 31832.0 | -0.154 |
| 31833.0 | -0.187 |
| 31834.0 | -0.18 |
| 31835.0 | -0.14 |
| 31836.0 | 0.043 |
| 31837.0 | 0.099 |
| 31838.0 | 0.097 |
| 31839.0 | 0.086 |
| 31840.0 | 0.078 |
| 31841.0 | 0.068 |
| 31842.0 | 0.053 |
| 31843.0 | 0.037 |
| 31844.0 | 0.008 |
| 31845.0 | 0.006 |
| 31846.0 | 0.114 |
| 31847.0 | 0.22 |
| 31848.0 | 0.22 |
| 31849.0 | 0.189 |
| 31850.0 | 0.17 |
| 31851.0 | 0.153 |
| 31852.0 | 0.127 |
| 31853.0 | 0.106 |
| 31854.0 | 0.088 |
| 31855.0 | 0.069 |
| 31856.0 | 0.053 |
| 31857.0 | 0.034 |
| 31858.0 | 0.007 |
| 31859.0 | 0.005 |
| 31860.0 | 0.005 |
| 31861.0 | 0.004 |
| 31862.0 | -0.002 |
| 31863.0 | -0.017 |
| 31864.0 | -0.033 |
| 31865.0 | -0.049 |
| 31866.0 | -0.065 |
| 31867.0 | -0.076 |
| 31868.0 | -0.087 |
| 31869.0 | -0.09 |
| 31870.0 | -0.09 |
| 31871.0 | -0.091 |
| 31872.0 | -0.092 |
| 31873.0 | -0.092 |
| 31874.0 | -0.095 |
| 31875.0 | -0.111 |
| 31876.0 | -0.129 |
| 31877.0 | -0.147 |
| 31878.0 | -0.165 |
| 31879.0 | -0.183 |
| 31880.0 | -0.201 |
| 31881.0 | -0.219 |
| 31882.0 | -0.234 |
| 31883.0 | -0.248 |
| 31884.0 | -0.263 |
| 31885.0 | -0.278 |
| 31886.0 | -0.292 |
| 31887.0 | -0.307 |
| 31888.0 | -0.321 |
| 31889.0 | -0.332 |
| 31890.0 | -0.315 |
| 31891.0 | -0.294 |
| 31892.0 | -0.274 |
| 31893.0 | -0.253 |
| 31894.0 | -0.232 |
| 31895.0 | -0.213 |
| 31896.0 | -0.203 |
| 31897.0 | -0.195 |
| 31898.0 | -0.187 |
| 31899.0 | -0.18 |
| 31900.0 | -0.172 |
| 31901.0 | -0.163 |
| 31902.0 | -0.154 |
| 31903.0 | -0.158 |
| 31904.0 | -0.164 |
| 31905.0 | -0.17 |
| 31906.0 | -0.177 |
| 31907.0 | -0.183 |
| 31908.0 | -0.189 |
| 31909.0 | -0.196 |
| 31910.0 | -0.207 |
| 31911.0 | -0.219 |
| 31912.0 | -0.228 |
| 31913.0 | -0.236 |
| 31914.0 | -0.245 |
| 31915.0 | -0.253 |
| 31916.0 | -0.259 |
| 31917.0 | -0.245 |
| 31918.0 | -0.228 |
| 31919.0 | -0.211 |
| 31920.0 | -0.195 |
| 31921.0 | -0.178 |
| 31922.0 | -0.161 |
| 31923.0 | -0.148 |
| 31924.0 | -0.16 |
| 31925.0 | -0.175 |
| 31926.0 | -0.191 |
| 31927.0 | -0.209 |
| 31928.0 | -0.226 |
| 31929.0 | -0.244 |
| 31930.0 | -0.259 |
| 31931.0 | -0.259 |
| 31932.0 | -0.256 |
| 31933.0 | -0.253 |
| 31934.0 | -0.251 |
| 31935.0 | -0.248 |
| 31936.0 | -0.245 |
| 31937.0 | -0.244 |
| 31938.0 | -0.256 |
| 31939.0 | -0.267 |
| 31940.0 | -0.259 |
| 31941.0 | -0.248 |
| 31942.0 | -0.237 |
| 31943.0 | -0.226 |
| 31944.0 | -0.206 |
| 31945.0 | -0.129 |
| 31946.0 | -0.042 |
| 31947.0 | 0.036 |
| 31948.0 | 0.067 |
| 31949.0 | 0.089 |
| 31950.0 | 0.111 |
| 31951.0 | 0.129 |
| 31952.0 | 0.122 |
| 31953.0 | 0.131 |
| 31954.0 | 0.129 |
| 31955.0 | 0.12 |
| 31956.0 | 0.109 |
| 31957.0 | 0.091 |
| 31958.0 | 0.075 |
| 31959.0 | 0.082 |
| 31960.0 | 0.092 |
| 31961.0 | 0.103 |
| 31962.0 | 0.114 |
| 31963.0 | 0.125 |
| 31964.0 | 0.135 |
| 31965.0 | 0.145 |
| 31966.0 | 0.151 |
| 31967.0 | 0.155 |
| 31968.0 | 0.16 |
| 31969.0 | 0.163 |
| 31970.0 | 0.151 |
| 31971.0 | 0.136 |
| 31972.0 | 0.12 |
| 31973.0 | 0.088 |
| 31974.0 | 0.055 |
| 31975.0 | 0.021 |
| 31976.0 | -0.012 |
| 31977.0 | -0.039 |
| 31978.0 | -0.021 |
| 31979.0 | 0.003 |
| 31980.0 | 0.023 |
| 31981.0 | 0.014 |
| 31982.0 | 0 |
| 31983.0 | -0.014 |
| 31984.0 | -0.028 |
| 31985.0 | -0.042 |
| 31986.0 | -0.056 |
| 31987.0 | -0.07 |
| 31988.0 | -0.087 |
| 31989.0 | -0.104 |
| 31990.0 | -0.121 |
| 31991.0 | -0.138 |
| 31992.0 | -0.155 |
| 31993.0 | -0.171 |
| 31994.0 | -0.181 |
| 31995.0 | -0.191 |
| 31996.0 | -0.2 |
| 31997.0 | -0.21 |
| 31998.0 | -0.219 |
| 31999.0 | -0.229 |
| 32000.0 | -0.238 |
| 32001.0 | -0.247 |
| 32002.0 | -0.256 |
| 32003.0 | -0.265 |
| 32004.0 | -0.274 |
| 32005.0 | -0.283 |
| 32006.0 | -0.292 |
| 32007.0 | -0.302 |
| 32008.0 | -0.32 |
| 32009.0 | -0.338 |
| 32010.0 | -0.357 |
| 32011.0 | -0.375 |
| 32012.0 | -0.394 |
| 32013.0 | -0.412 |
| 32014.0 | -0.431 |
| 32015.0 | -0.451 |
| 32016.0 | -0.471 |
| 32017.0 | -0.491 |
| 32018.0 | -0.512 |
| 32019.0 | -0.532 |
| 32020.0 | -0.552 |
| 32021.0 | -0.572 |
| 32022.0 | -0.596 |
| 32023.0 | -0.619 |
| 32024.0 | -0.643 |
| 32025.0 | -0.666 |
| 32026.0 | -0.69 |
| 32027.0 | -0.713 |
| 32028.0 | -0.735 |
| 32029.0 | -0.746 |
| 32030.0 | -0.754 |
| 32031.0 | -0.763 |
| 32032.0 | -0.771 |
| 32033.0 | -0.774 |
| 32034.0 | -0.745 |
| 32035.0 | -0.707 |
| 32036.0 | -0.654 |
| 32037.0 | -0.599 |
| 32038.0 | -0.544 |
| 32039.0 | -0.49 |
| 32040.0 | -0.435 |
| 32041.0 | -0.374 |
| 32042.0 | -0.282 |
| 32043.0 | -0.232 |
| 32044.0 | -0.199 |
| 32045.0 | -0.17 |
| 32046.0 | -0.155 |
| 32047.0 | -0.143 |
| 32048.0 | -0.13 |
| 32049.0 | -0.117 |
| 32050.0 | -0.103 |
| 32051.0 | -0.088 |
| 32052.0 | -0.072 |
| 32053.0 | -0.043 |
| 32054.0 | -0.011 |
| 32055.0 | 0.02 |
| 32056.0 | 0.048 |
| 32057.0 | 0.052 |
| 32058.0 | 0.048 |
| 32059.0 | 0.044 |
| 32060.0 | 0.044 |
| 32061.0 | 0.068 |
| 32062.0 | 0.091 |
| 32063.0 | 0.091 |
| 32064.0 | 0.09 |
| 32065.0 | 0.088 |
| 32066.0 | 0.086 |
| 32067.0 | 0.078 |
| 32068.0 | 0.068 |
| 32069.0 | 0.059 |
| 32070.0 | 0.049 |
| 32071.0 | 0.037 |
| 32072.0 | 0.008 |
| 32073.0 | -0.007 |
| 32074.0 | -0.019 |
| 32075.0 | -0.03 |
| 32076.0 | -0.042 |
| 32077.0 | -0.055 |
| 32078.0 | -0.072 |
| 32079.0 | -0.089 |
| 32080.0 | -0.108 |
| 32081.0 | -0.127 |
| 32082.0 | -0.145 |
| 32083.0 | -0.164 |
| 32084.0 | -0.183 |
| 32085.0 | -0.198 |
| 32086.0 | -0.209 |
| 32087.0 | -0.219 |
| 32088.0 | -0.233 |
| 32089.0 | -0.246 |
| 32090.0 | -0.26 |
| 32091.0 | -0.273 |
| 32092.0 | -0.283 |
| 32093.0 | -0.304 |
| 32094.0 | -0.327 |
| 32095.0 | -0.35 |
| 32096.0 | -0.373 |
| 32097.0 | -0.396 |
| 32098.0 | -0.419 |
| 32099.0 | -0.444 |
| 32100.0 | -0.456 |
| 32101.0 | -0.481 |
| 32102.0 | -0.503 |
| 32103.0 | -0.523 |
| 32104.0 | -0.543 |
| 32105.0 | -0.563 |
| 32106.0 | -0.578 |
| 32107.0 | -0.58 |
| 32108.0 | -0.58 |
| 32109.0 | -0.58 |
| 32110.0 | -0.58 |
| 32111.0 | -0.581 |
| 32112.0 | -0.581 |
| 32113.0 | -0.581 |
| 32114.0 | -0.581 |
| 32115.0 | -0.581 |
| 32116.0 | -0.581 |
| 32117.0 | -0.581 |
| 32118.0 | -0.581 |
| 32119.0 | -0.581 |
| 32120.0 | -0.582 |
| 32121.0 | -0.582 |
| 32122.0 | -0.582 |
| 32123.0 | -0.582 |
| 32124.0 | -0.582 |
| 32125.0 | -0.582 |
| 32126.0 | -0.582 |
| 32127.0 | -0.582 |
| 32128.0 | -0.582 |
| 32129.0 | -0.582 |
| 32130.0 | -0.583 |
| 32131.0 | -0.583 |
| 32132.0 | -0.583 |
| 32133.0 | -0.583 |
| 32134.0 | -0.583 |
| 32135.0 | -0.583 |
| 32136.0 | -0.583 |
| 32137.0 | -0.583 |
| 32138.0 | -0.583 |
| 32139.0 | -0.584 |
| 32140.0 | -0.584 |
| 32141.0 | -0.584 |
| 32142.0 | -0.584 |
| 32143.0 | -0.583 |
| 32144.0 | -0.572 |
| 32145.0 | -0.56 |
| 32146.0 | -0.548 |
| 32147.0 | -0.537 |
| 32148.0 | -0.525 |
| 32149.0 | -0.514 |
| 32150.0 | -0.512 |
| 32151.0 | -0.512 |
| 32152.0 | -0.511 |
| 32153.0 | -0.511 |
| 32154.0 | -0.51 |
| 32155.0 | -0.51 |
| 32156.0 | -0.51 |
| 32157.0 | -0.518 |
| 32158.0 | -0.527 |
| 32159.0 | -0.536 |
| 32160.0 | -0.546 |
| 32161.0 | -0.555 |
| 32162.0 | -0.565 |
| 32163.0 | -0.574 |
| 32164.0 | -0.582 |
| 32165.0 | -0.582 |
| 32166.0 | -0.595 |
| 32167.0 | -0.61 |
| 32168.0 | -0.625 |
| 32169.0 | -0.64 |
| 32170.0 | -0.655 |
| 32171.0 | -0.645 |
| 32172.0 | -0.485 |
| 32173.0 | -0.327 |
| 32174.0 | -0.322 |
| 32175.0 | -0.344 |
| 32176.0 | -0.366 |
| 32177.0 | -0.388 |
| 32178.0 | -0.41 |
| 32179.0 | -0.431 |
| 32180.0 | -0.453 |
| 32181.0 | -0.475 |
| 32182.0 | -0.497 |
| 32183.0 | -0.521 |
| 32184.0 | -0.544 |
| 32185.0 | -0.566 |
| 32186.0 | -0.572 |
| 32187.0 | -0.576 |
| 32188.0 | -0.58 |
| 32189.0 | -0.583 |
| 32190.0 | -0.578 |
| 32191.0 | -0.575 |
| 32192.0 | -0.591 |
| 32193.0 | -0.611 |
| 32194.0 | -0.63 |
| 32195.0 | -0.647 |
| 32196.0 | -0.638 |
| 32197.0 | -0.6 |
| 32198.0 | -0.559 |
| 32199.0 | -0.521 |
| 32200.0 | -0.509 |
| 32201.0 | -0.502 |
| 32202.0 | -0.503 |
| 32203.0 | -0.505 |
| 32204.0 | -0.505 |
| 32205.0 | -0.505 |
| 32206.0 | -0.506 |
| 32207.0 | -0.515 |
| 32208.0 | -0.524 |
| 32209.0 | -0.53 |
| 32210.0 | -0.536 |
| 32211.0 | -0.541 |
| 32212.0 | -0.547 |
| 32213.0 | -0.553 |
| 32214.0 | -0.563 |
| 32215.0 | -0.573 |
| 32216.0 | -0.584 |
| 32217.0 | -0.595 |
| 32218.0 | -0.603 |
| 32219.0 | -0.61 |
| 32220.0 | -0.608 |
| 32221.0 | -0.605 |
| 32222.0 | -0.601 |
| 32223.0 | -0.598 |
| 32224.0 | -0.597 |
| 32225.0 | -0.609 |
| 32226.0 | -0.624 |
| 32227.0 | -0.641 |
| 32228.0 | -0.659 |
| 32229.0 | -0.677 |
| 32230.0 | -0.695 |
| 32231.0 | -0.713 |
| 32232.0 | -0.729 |
| 32233.0 | -0.746 |
| 32234.0 | -0.762 |
| 32235.0 | -0.778 |
| 32236.0 | -0.794 |
| 32237.0 | -0.811 |
| 32238.0 | -0.825 |
| 32239.0 | -0.825 |
| 32240.0 | -0.822 |
| 32241.0 | -0.82 |
| 32242.0 | -0.818 |
| 32243.0 | -0.816 |
| 32244.0 | -0.813 |
| 32245.0 | -0.812 |
| 32246.0 | -0.817 |
| 32247.0 | -0.823 |
| 32248.0 | -0.829 |
| 32249.0 | -0.836 |
| 32250.0 | -0.842 |
| 32251.0 | -0.848 |
| 32252.0 | -0.855 |
| 32253.0 | -0.865 |
| 32254.0 | -0.877 |
| 32255.0 | -0.888 |
| 32256.0 | -0.899 |
| 32257.0 | -0.91 |
| 32258.0 | -0.922 |
| 32259.0 | -0.934 |
| 32260.0 | -0.95 |
| 32261.0 | -0.967 |
| 32262.0 | -0.984 |
| 32263.0 | -1 |
| 32264.0 | -1.017 |
| 32265.0 | -1.034 |
| 32266.0 | -1.054 |
| 32267.0 | -1.074 |
| 32268.0 | -1.094 |
| 32269.0 | -1.115 |
| 32270.0 | -1.135 |
| 32271.0 | -1.155 |
| 32272.0 | -1.175 |
| 32273.0 | -1.193 |
| 32274.0 | -1.197 |
| 32275.0 | -1.199 |
| 32276.0 | -1.201 |
| 32277.0 | -1.203 |
| 32278.0 | -1.205 |
| 32279.0 | -1.207 |
| 32280.0 | -1.211 |
| 32281.0 | -1.211 |
| 32282.0 | -1.211 |
| 32283.0 | -1.212 |
| 32284.0 | -1.221 |
| 32285.0 | -1.232 |
| 32286.0 | -1.242 |
| 32287.0 | -1.255 |
| 32288.0 | -1.274 |
| 32289.0 | -1.293 |
| 32290.0 | -1.313 |
| 32291.0 | -1.331 |
| 32292.0 | -1.35 |
| 32293.0 | -1.369 |
| 32294.0 | -1.381 |
| 32295.0 | -1.36 |
| 32296.0 | -1.332 |
| 32297.0 | -1.307 |
| 32298.0 | -1.291 |
| 32299.0 | -1.276 |
| 32300.0 | -1.262 |
| 32301.0 | -1.245 |
| 32302.0 | -1.219 |
| 32303.0 | -1.193 |
| 32304.0 | -1.166 |
| 32305.0 | -1.14 |
| 32306.0 | -1.118 |
| 32307.0 | -1.123 |
| 32308.0 | -1.133 |
| 32309.0 | -1.148 |
| 32310.0 | -1.16 |
| 32311.0 | -1.147 |
| 32312.0 | -1.13 |
| 32313.0 | -1.111 |
| 32314.0 | -1.081 |
| 32315.0 | -1.055 |
| 32316.0 | -1.055 |
| 32317.0 | -1.061 |
| 32318.0 | -1.049 |
| 32319.0 | -0.936 |
| 32320.0 | -0.805 |
| 32321.0 | -0.674 |
| 32322.0 | -0.557 |
| 32323.0 | -0.514 |
| 32324.0 | -0.487 |
| 32325.0 | -0.467 |
| 32326.0 | -0.41 |
| 32327.0 | -0.345 |
| 32328.0 | -0.28 |
| 32329.0 | -0.216 |
| 32330.0 | -0.182 |
| 32331.0 | -0.154 |
| 32332.0 | -0.126 |
| 32333.0 | -0.105 |
| 32334.0 | -0.086 |
| 32335.0 | -0.066 |
| 32336.0 | -0.047 |
| 32337.0 | -0.03 |
| 32338.0 | -0.016 |
| 32339.0 | -0.006 |
| 32340.0 | 0.003 |
| 32341.0 | 0.001 |
| 32342.0 | -0.004 |
| 32343.0 | -0.011 |
| 32344.0 | -0.018 |
| 32345.0 | -0.015 |
| 32346.0 | -0.011 |
| 32347.0 | -0.007 |
| 32348.0 | -0.003 |
| 32349.0 | 0.001 |
| 32350.0 | 0.004 |
| 32351.0 | 0.004 |
| 32352.0 | 0.003 |
| 32353.0 | 0.002 |
| 32354.0 | 0.001 |
| 32355.0 | 0 |
| 32356.0 | -0.001 |
| 32357.0 | -0.002 |
| 32358.0 | -0.004 |
| 32359.0 | -0.016 |
| 32360.0 | -0.033 |
| 32361.0 | -0.052 |
| 32362.0 | -0.07 |
| 32363.0 | -0.086 |
| 32364.0 | -0.101 |
| 32365.0 | -0.117 |
| 32366.0 | -0.132 |
| 32367.0 | -0.148 |
| 32368.0 | -0.164 |
| 32369.0 | -0.179 |
| 32370.0 | -0.194 |
| 32371.0 | -0.2 |
| 32372.0 | -0.211 |
| 32373.0 | -0.22 |
| 32374.0 | -0.228 |
| 32375.0 | -0.236 |
| 32376.0 | -0.245 |
| 32377.0 | -0.254 |
| 32378.0 | -0.26 |
| 32379.0 | -0.256 |
| 32380.0 | -0.251 |
| 32381.0 | -0.245 |
| 32382.0 | -0.24 |
| 32383.0 | -0.234 |
| 32384.0 | -0.229 |
| 32385.0 | -0.224 |
| 32386.0 | -0.228 |
| 32387.0 | -0.233 |
| 32388.0 | -0.239 |
| 32389.0 | -0.244 |
| 32390.0 | -0.249 |
| 32391.0 | -0.254 |
| 32392.0 | -0.259 |
| 32393.0 | -0.268 |
| 32394.0 | -0.277 |
| 32395.0 | -0.287 |
| 32396.0 | -0.296 |
| 32397.0 | -0.306 |
| 32398.0 | -0.315 |
| 32399.0 | -0.326 |
| 32400.0 | -0.345 |
| 32401.0 | -0.364 |
| 32402.0 | -0.384 |
| 32403.0 | -0.403 |
| 32404.0 | -0.423 |
| 32405.0 | -0.442 |
| 32406.0 | -0.462 |
| 32407.0 | -0.479 |
| 32408.0 | -0.504 |
| 32409.0 | -0.53 |
| 32410.0 | -0.555 |
| 32411.0 | -0.581 |
| 32412.0 | -0.608 |
| 32413.0 | -0.638 |
| 32414.0 | -0.671 |
| 32415.0 | -0.704 |
| 32416.0 | -0.737 |
| 32417.0 | -0.77 |
| 32418.0 | -0.802 |
| 32419.0 | -0.827 |
| 32420.0 | -0.85 |
| 32421.0 | -0.875 |
| 32422.0 | -0.9 |
| 32423.0 | -0.925 |
| 32424.0 | -0.948 |
| 32425.0 | -0.972 |
| 32426.0 | -0.992 |
| 32427.0 | -0.998 |
| 32428.0 | -1 |
| 32429.0 | -1.004 |
| 32430.0 | -1.017 |
| 32431.0 | -1.041 |
| 32432.0 | -1.065 |
| 32433.0 | -1.086 |
| 32434.0 | -1.107 |
| 32435.0 | -1.128 |
| 32436.0 | -1.148 |
| 32437.0 | -1.168 |
| 32438.0 | -1.187 |
| 32439.0 | -1.207 |
| 32440.0 | -1.226 |
| 32441.0 | -1.247 |
| 32442.0 | -1.268 |
| 32443.0 | -1.278 |
| 32444.0 | -1.286 |
| 32445.0 | -1.303 |
| 32446.0 | -1.319 |
| 32447.0 | -1.327 |
| 32448.0 | -1.331 |
| 32449.0 | -1.332 |
| 32450.0 | -1.332 |
| 32451.0 | -1.332 |
| 32452.0 | -1.328 |
| 32453.0 | -1.325 |
| 32454.0 | -1.321 |
| 32455.0 | -1.318 |
| 32456.0 | -1.321 |
| 32457.0 | -1.325 |
| 32458.0 | -1.329 |
| 32459.0 | -1.33 |
| 32460.0 | -1.331 |
| 32461.0 | -1.331 |
| 32462.0 | -1.333 |
| 32463.0 | -1.339 |
| 32464.0 | -1.34 |
| 32465.0 | -1.339 |
| 32466.0 | -1.331 |
| 32467.0 | -1.322 |
| 32468.0 | -1.315 |
| 32469.0 | -1.32 |
| 32470.0 | -1.322 |
| 32471.0 | -1.324 |
| 32472.0 | -1.326 |
| 32473.0 | -1.332 |
| 32474.0 | -1.338 |
| 32475.0 | -1.345 |
| 32476.0 | -1.352 |
| 32477.0 | -1.362 |
| 32478.0 | -1.372 |
| 32479.0 | -1.382 |
| 32480.0 | -1.392 |
| 32481.0 | -1.402 |
| 32482.0 | -1.411 |
| 32483.0 | -1.421 |
| 32484.0 | -1.431 |
| 32485.0 | -1.441 |
| 32486.0 | -1.451 |
| 32487.0 | -1.461 |
| 32488.0 | -1.471 |
| 32489.0 | -1.481 |
| 32490.0 | -1.491 |
| 32491.0 | -1.501 |
| 32492.0 | -1.511 |
| 32493.0 | -1.521 |
| 32494.0 | -1.53 |
| 32495.0 | -1.54 |
| 32496.0 | -1.55 |
| 32497.0 | -1.56 |
| 32498.0 | -1.57 |
| 32499.0 | -1.58 |
| 32500.0 | -1.59 |
| 32501.0 | -1.6 |
| 32502.0 | -1.61 |
| 32503.0 | -1.62 |
| 32504.0 | -1.63 |
| 32505.0 | -1.639 |
| 32506.0 | -1.649 |
| 32507.0 | -1.659 |
| 32508.0 | -1.669 |
| 32509.0 | -1.679 |
| 32510.0 | -1.689 |
| 32511.0 | -1.697 |
| 32512.0 | -1.699 |
| 32513.0 | -1.662 |
| 32514.0 | -1.619 |
| 32515.0 | -1.575 |
| 32516.0 | -1.532 |
| 32517.0 | -1.481 |
| 32518.0 | -1.372 |
| 32519.0 | -1.213 |
| 32520.0 | -1.178 |
| 32521.0 | -1.179 |
| 32522.0 | -1.184 |
| 32523.0 | -1.189 |
| 32524.0 | -1.195 |
| 32525.0 | -1.2 |
| 32526.0 | -1.205 |
| 32527.0 | -1.21 |
| 32528.0 | -1.216 |
| 32529.0 | -1.221 |
| 32530.0 | -1.226 |
| 32531.0 | -1.231 |
| 32532.0 | -1.237 |
| 32533.0 | -1.242 |
| 32534.0 | -1.247 |
| 32535.0 | -1.252 |
| 32536.0 | -1.257 |
| 32537.0 | -1.263 |
| 32538.0 | -1.268 |
| 32539.0 | -1.273 |
| 32540.0 | -1.278 |
| 32541.0 | -1.284 |
| 32542.0 | -1.289 |
| 32543.0 | -1.294 |
| 32544.0 | -1.299 |
| 32545.0 | -1.305 |
| 32546.0 | -1.31 |
| 32547.0 | -1.315 |
| 32548.0 | -1.32 |
| 32549.0 | -1.325 |
| 32550.0 | -1.331 |
| 32551.0 | -1.336 |
| 32552.0 | -1.341 |
| 32553.0 | -1.346 |
| 32554.0 | -1.352 |
| 32555.0 | -1.357 |
| 32556.0 | -1.362 |
| 32557.0 | -1.367 |
| 32558.0 | -1.373 |
| 32559.0 | -1.378 |
| 32560.0 | -1.383 |
| 32561.0 | -1.388 |
| 32562.0 | -1.393 |
| 32563.0 | -1.399 |
| 32564.0 | -1.404 |
| 32565.0 | -1.409 |
| 32566.0 | -1.414 |
| 32567.0 | -1.42 |
| 32568.0 | -1.425 |
| 32569.0 | -1.43 |
| 32570.0 | -1.435 |
| 32571.0 | -1.441 |
| 32572.0 | -1.446 |
| 32573.0 | -1.451 |
| 32574.0 | -1.456 |
| 32575.0 | -1.461 |
| 32576.0 | -1.467 |
| 32577.0 | -1.472 |
| 32578.0 | -1.477 |
| 32579.0 | -1.482 |
| 32580.0 | -1.488 |
| 32581.0 | -1.493 |
| 32582.0 | -1.498 |
| 32583.0 | -1.503 |
| 32584.0 | -1.509 |
| 32585.0 | -1.514 |
| 32586.0 | -1.519 |
| 32587.0 | -1.524 |
| 32588.0 | -1.529 |
| 32589.0 | -1.535 |
| 32590.0 | -1.54 |
| 32591.0 | -1.545 |
| 32592.0 | -1.55 |
| 32593.0 | -1.556 |
| 32594.0 | -1.561 |
| 32595.0 | -1.566 |
| 32596.0 | -1.571 |
| 32597.0 | -1.577 |
| 32598.0 | -1.582 |
| 32599.0 | -1.586 |
| 32600.0 | -1.585 |
| 32601.0 | -1.586 |
| 32602.0 | -1.587 |
| 32603.0 | -1.589 |
| 32604.0 | -1.591 |
| 32605.0 | -1.595 |
| 32606.0 | -1.597 |
| 32607.0 | -1.587 |
| 32608.0 | -1.573 |
| 32609.0 | -1.546 |
| 32610.0 | -1.526 |
| 32611.0 | -1.517 |
| 32612.0 | -1.509 |
| 32613.0 | -1.501 |
| 32614.0 | -1.494 |
| 32615.0 | -1.494 |
| 32616.0 | -1.495 |
| 32617.0 | -1.495 |
| 32618.0 | -1.496 |
| 32619.0 | -1.498 |
| 32620.0 | -1.508 |
| 32621.0 | -1.51 |
| 32622.0 | -1.512 |
| 32623.0 | -1.513 |
| 32624.0 | -1.517 |
| 32625.0 | -1.519 |
| 32626.0 | -1.518 |
| 32627.0 | -1.503 |
| 32628.0 | -1.498 |
| 32629.0 | -1.497 |
| 32630.0 | -1.494 |
| 32631.0 | -1.492 |
| 32632.0 | -1.49 |
| 32633.0 | -1.495 |
| 32634.0 | -1.502 |
| 32635.0 | -1.508 |
| 32636.0 | -1.515 |
| 32637.0 | -1.525 |
| 32638.0 | -1.555 |
| 32639.0 | -1.58 |
| 32640.0 | -1.603 |
| 32641.0 | -1.626 |
| 32642.0 | -1.647 |
| 32643.0 | -1.672 |
| 32644.0 | -1.687 |
| 32645.0 | -1.709 |
| 32646.0 | -1.729 |
| 32647.0 | -1.749 |
| 32648.0 | -1.77 |
| 32649.0 | -1.783 |
| 32650.0 | -1.812 |
| 32651.0 | -1.827 |
| 32652.0 | -1.86 |
| 32653.0 | -1.883 |
| 32654.0 | -1.88 |
| 32655.0 | -1.865 |
| 32656.0 | -1.848 |
| 32657.0 | -1.834 |
| 32658.0 | -1.837 |
| 32659.0 | -1.842 |
| 32660.0 | -1.848 |
| 32661.0 | -1.846 |
| 32662.0 | -1.796 |
| 32663.0 | -1.739 |
| 32664.0 | -1.693 |
| 32665.0 | -1.654 |
| 32666.0 | -1.634 |
| 32667.0 | -1.599 |
| 32668.0 | -1.588 |
| 32669.0 | -1.589 |
| 32670.0 | -1.58 |
| 32671.0 | -1.569 |
| 32672.0 | -1.563 |
| 32673.0 | -1.554 |
| 32674.0 | -1.545 |
| 32675.0 | -1.54 |
| 32676.0 | -1.534 |
| 32677.0 | -1.535 |
| 32678.0 | -1.526 |
| 32679.0 | -1.471 |
| 32680.0 | -1.41 |
| 32681.0 | -1.345 |
| 32682.0 | -1.264 |
| 32683.0 | -1.18 |
| 32684.0 | -1.097 |
| 32685.0 | -1.013 |
| 32686.0 | -0.938 |
| 32687.0 | -0.921 |
| 32688.0 | -0.912 |
| 32689.0 | -0.903 |
| 32690.0 | -0.895 |
| 32691.0 | -0.886 |
| 32692.0 | -0.878 |
| 32693.0 | -0.868 |
| 32694.0 | -0.858 |
| 32695.0 | -0.849 |
| 32696.0 | -0.854 |
| 32697.0 | -0.859 |
| 32698.0 | -0.865 |
| 32699.0 | -0.864 |
| 32700.0 | -0.87 |
| 32701.0 | -0.881 |
| 32702.0 | -0.894 |
| 32703.0 | -0.908 |
| 32704.0 | -0.922 |
| 32705.0 | -0.941 |
| 32706.0 | -0.959 |
| 32707.0 | -0.97 |
| 32708.0 | -0.992 |
| 32709.0 | -1.001 |
| 32710.0 | -1.023 |
| 32711.0 | -1.046 |
| 32712.0 | -1.069 |
| 32713.0 | -1.09 |
| 32714.0 | -1.116 |
| 32715.0 | -1.145 |
| 32716.0 | -1.178 |
| 32717.0 | -1.206 |
| 32718.0 | -1.232 |
| 32719.0 | -1.265 |
| 32720.0 | -1.297 |
| 32721.0 | -1.303 |
| 32722.0 | -1.32 |
| 32723.0 | -1.336 |
| 32724.0 | -1.347 |
| 32725.0 | -1.354 |
| 32726.0 | -1.371 |
| 32727.0 | -1.388 |
| 32728.0 | -1.404 |
| 32729.0 | -1.423 |
| 32730.0 | -1.448 |
| 32731.0 | -1.481 |
| 32732.0 | -1.509 |
| 32733.0 | -1.541 |
| 32734.0 | -1.573 |
| 32735.0 | -1.592 |
| 32736.0 | -1.64 |
| 32737.0 | -1.677 |
| 32738.0 | -1.713 |
| 32739.0 | -1.753 |
| 32740.0 | -1.794 |
| 32741.0 | -1.825 |
| 32742.0 | -1.848 |
| 32743.0 | -1.902 |
| 32744.0 | -1.941 |
| 32745.0 | -1.977 |
| 32746.0 | -1.998 |
| 32747.0 | -2.034 |
| 32748.0 | -2.071 |
| 32749.0 | -2.098 |
| 32750.0 | -2.149 |
| 32751.0 | -2.189 |
| 32752.0 | -2.215 |
| 32753.0 | -2.239 |
| 32754.0 | -2.266 |
| 32755.0 | -2.293 |
| 32756.0 | -2.321 |
| 32757.0 | -2.35 |
| 32758.0 | -2.375 |
| 32759.0 | -2.397 |
| 32760.0 | -2.426 |
| 32761.0 | -2.455 |
| 32762.0 | -2.482 |
| 32763.0 | -2.513 |
| 32764.0 | -2.541 |
| 32765.0 | -2.573 |
| 32766.0 | -2.61 |
| 32767.0 | -2.639 |
| 32768.0 | -2.673 |
| 32769.0 | -2.701 |
| 32770.0 | -2.725 |
| 32771.0 | -2.749 |
| 32772.0 | -2.757 |
| 32773.0 | -2.784 |
| 32774.0 | -2.815 |
| 32775.0 | -2.847 |
| 32776.0 | -2.878 |
| 32777.0 | -2.908 |
| 32778.0 | -2.934 |
| 32779.0 | -2.96 |
| 32780.0 | -2.985 |
| 32781.0 | -3.009 |
| 32782.0 | -3.026 |
| 32783.0 | -3.048 |
| 32784.0 | -3.054 |
| 32785.0 | -3.036 |
| 32786.0 | -3.025 |
| 32787.0 | -3.027 |
| 32788.0 | -3.032 |
| 32789.0 | -3.049 |
| 32790.0 | -3.064 |
| 32791.0 | -3.072 |
| 32792.0 | -3.085 |
| 32793.0 | -3.078 |
| 32794.0 | -3.073 |
| 32795.0 | -3.084 |
| 32796.0 | -3.091 |
| 32797.0 | -3.102 |
| 32798.0 | -3.068 |
| 32799.0 | -3.025 |
| 32800.0 | -3.014 |
| 32801.0 | -3.006 |
| 32802.0 | -2.986 |
| 32803.0 | -2.913 |
| 32804.0 | -2.838 |
| 32805.0 | -2.828 |
| 32806.0 | -2.819 |
| 32807.0 | -2.83 |
| 32808.0 | -2.835 |
| 32809.0 | -2.839 |
| 32810.0 | -2.844 |
| 32811.0 | -2.837 |
| 32812.0 | -2.839 |
| 32813.0 | -2.846 |
| 32814.0 | -2.851 |
| 32815.0 | -2.857 |
| 32816.0 | -2.863 |
| 32817.0 | -2.874 |
| 32818.0 | -2.889 |
| 32819.0 | -2.907 |
| 32820.0 | -2.931 |
| 32821.0 | -2.949 |
| 32822.0 | -2.971 |
| 32823.0 | -2.99 |
| 32824.0 | -3.001 |
| 32825.0 | -3.022 |
| 32826.0 | -3.043 |
| 32827.0 | -3.061 |
| 32828.0 | -3.078 |
| 32829.0 | -3.097 |
| 32830.0 | -3.119 |
| 32831.0 | -3.125 |
| 32832.0 | -3.134 |
| 32833.0 | -3.151 |
| 32834.0 | -3.164 |
| 32835.0 | -3.177 |
| 32836.0 | -3.199 |
| 32837.0 | -3.218 |
| 32838.0 | -3.235 |
| 32839.0 | -3.251 |
| 32840.0 | -3.252 |
| 32841.0 | -3.261 |
| 32842.0 | -3.27 |
| 32843.0 | -3.28 |
| 32844.0 | -3.3 |
| 32845.0 | -3.313 |
| 32846.0 | -3.325 |
| 32847.0 | -3.339 |
| 32848.0 | -3.351 |
| 32849.0 | -3.379 |
| 32850.0 | -3.407 |
| 32851.0 | -3.433 |
| 32852.0 | -3.451 |
| 32853.0 | -3.474 |
| 32854.0 | -3.501 |
| 32855.0 | -3.523 |
| 32856.0 | -3.534 |
| 32857.0 | -3.528 |
| 32858.0 | -3.517 |
| 32859.0 | -3.481 |
| 32860.0 | -3.443 |
| 32861.0 | -3.433 |
| 32862.0 | -3.439 |
| 32863.0 | -3.453 |
| 32864.0 | -3.466 |
| 32865.0 | -3.48 |
| 32866.0 | -3.481 |
| 32867.0 | -3.455 |
| 32868.0 | -3.438 |
| 32869.0 | -3.446 |
| 32870.0 | -3.454 |
| 32871.0 | -3.463 |
| 32872.0 | -3.477 |
| 32873.0 | -3.493 |
| 32874.0 | -3.505 |
| 32875.0 | -3.523 |
| 32876.0 | -3.553 |
| 32877.0 | -3.565 |
| 32878.0 | -3.578 |
| 32879.0 | -3.585 |
| 32880.0 | -3.599 |
| 32881.0 | -3.61 |
| 32882.0 | -3.619 |
| 32883.0 | -3.629 |
| 32884.0 | -3.639 |
| 32885.0 | -3.655 |
| 32886.0 | -3.657 |
| 32887.0 | -3.674 |
| 32888.0 | -3.716 |
| 32889.0 | -3.727 |
| 32890.0 | -3.721 |
| 32891.0 | -3.71 |
| 32892.0 | -3.683 |
| 32893.0 | -3.68 |
| 32894.0 | -3.682 |
| 32895.0 | -3.682 |
| 32896.0 | -3.658 |
| 32897.0 | -3.658 |
| 32898.0 | -3.66 |
| 32899.0 | -3.662 |
| 32900.0 | -3.667 |
| 32901.0 | -3.676 |
| 32902.0 | -3.676 |
| 32903.0 | -3.687 |
| 32904.0 | -3.701 |
| 32905.0 | -3.714 |
| 32906.0 | -3.728 |
| 32907.0 | -3.741 |
| 32908.0 | -3.754 |
| 32909.0 | -3.768 |
| 32910.0 | -3.781 |
| 32911.0 | -3.794 |
| 32912.0 | -3.808 |
| 32913.0 | -3.821 |
| 32914.0 | -3.835 |
| 32915.0 | -3.848 |
| 32916.0 | -3.861 |
| 32917.0 | -3.875 |
| 32918.0 | -3.888 |
| 32919.0 | -3.902 |
| 32920.0 | -3.91 |
| 32921.0 | -3.892 |
| 32922.0 | -3.868 |
| 32923.0 | -3.85 |
| 32924.0 | -3.86 |
| 32925.0 | -3.875 |
| 32926.0 | -3.89 |
| 32927.0 | -3.902 |
| 32928.0 | -3.892 |
| 32929.0 | -3.879 |
| 32930.0 | -3.866 |
| 32931.0 | -3.854 |
| 32932.0 | -3.841 |
| 32933.0 | -3.828 |
| 32934.0 | -3.817 |
| 32935.0 | -3.814 |
| 32936.0 | -3.814 |
| 32937.0 | -3.813 |
| 32938.0 | -3.812 |
| 32939.0 | -3.812 |
| 32940.0 | -3.812 |
| 32941.0 | -3.815 |
| 32942.0 | -3.819 |
| 32943.0 | -3.823 |
| 32944.0 | -3.827 |
| 32945.0 | -3.831 |
| 32946.0 | -3.835 |
| 32947.0 | -3.836 |
| 32948.0 | -3.838 |
| 32949.0 | -3.838 |
| 32950.0 | -3.836 |
| 32951.0 | -3.838 |
| 32952.0 | -3.84 |
| 32953.0 | -3.847 |
| 32954.0 | -3.836 |
| 32955.0 | -3.831 |
| 32956.0 | -3.825 |
| 32957.0 | -3.787 |
| 32958.0 | -3.765 |
| 32959.0 | -3.756 |
| 32960.0 | -3.748 |
| 32961.0 | -3.741 |
| 32962.0 | -3.744 |
| 32963.0 | -3.743 |
| 32964.0 | -3.736 |
| 32965.0 | -3.729 |
| 32966.0 | -3.721 |
| 32967.0 | -3.714 |
| 32968.0 | -3.713 |
| 32969.0 | -3.713 |
| 32970.0 | -3.717 |
| 32971.0 | -3.721 |
| 32972.0 | -3.725 |
| 32973.0 | -3.729 |
| 32974.0 | -3.737 |
| 32975.0 | -3.744 |
| 32976.0 | -3.752 |
| 32977.0 | -3.757 |
| 32978.0 | -3.767 |
| 32979.0 | -3.77 |
| 32980.0 | -3.759 |
| 32981.0 | -3.716 |
| 32982.0 | -3.542 |
| 32983.0 | -3.449 |
| 32984.0 | -3.418 |
| 32985.0 | -3.393 |
| 32986.0 | -3.254 |
| 32987.0 | -3.064 |
| 32988.0 | -2.949 |
| 32989.0 | -2.858 |
| 32990.0 | -2.794 |
| 32991.0 | -2.754 |
| 32992.0 | -2.729 |
| 32993.0 | -2.706 |
| 32994.0 | -2.693 |
| 32995.0 | -2.667 |
| 32996.0 | -2.538 |
| 32997.0 | -2.358 |
| 32998.0 | -2.299 |
| 32999.0 | -2.274 |
| 33000.0 | -2.254 |
| 33001.0 | -2.234 |
| 33002.0 | -2.213 |
| 33003.0 | -2.206 |
| 33004.0 | -2.198 |
| 33005.0 | -2.19 |
| 33006.0 | -2.2 |
| 33007.0 | -2.216 |
| 33008.0 | -2.237 |
| 33009.0 | -2.251 |
| 33010.0 | -2.269 |
| 33011.0 | -2.288 |
| 33012.0 | -2.297 |
| 33013.0 | -2.307 |
| 33014.0 | -2.326 |
| 33015.0 | -2.352 |
| 33016.0 | -2.379 |
| 33017.0 | -2.407 |
| 33018.0 | -2.431 |
| 33019.0 | -2.439 |
| 33020.0 | -2.455 |
| 33021.0 | -2.481 |
| 33022.0 | -2.507 |
| 33023.0 | -2.51 |
| 33024.0 | -2.476 |
| 33025.0 | -2.471 |
| 33026.0 | -2.48 |
| 33027.0 | -2.491 |
| 33028.0 | -2.518 |
| 33029.0 | -2.547 |
| 33030.0 | -2.552 |
| 33031.0 | -2.573 |
| 33032.0 | -2.581 |
| 33033.0 | -2.593 |
| 33034.0 | -2.616 |
| 33035.0 | -2.651 |
| 33036.0 | -2.71 |
| 33037.0 | -2.732 |
| 33038.0 | -2.751 |
| 33039.0 | -2.791 |
| 33040.0 | -2.829 |
| 33041.0 | -2.857 |
| 33042.0 | -2.879 |
| 33043.0 | -2.91 |
| 33044.0 | -2.945 |
| 33045.0 | -2.977 |
| 33046.0 | -2.998 |
| 33047.0 | -3.03 |
| 33048.0 | -3.063 |
| 33049.0 | -3.101 |
| 33050.0 | -3.143 |
| 33051.0 | -3.18 |
| 33052.0 | -3.222 |
| 33053.0 | -3.259 |
| 33054.0 | -3.277 |
| 33055.0 | -3.274 |
| 33056.0 | -3.295 |
| 33057.0 | -3.332 |
| 33058.0 | -3.372 |
| 33059.0 | -3.41 |
| 33060.0 | -3.447 |
| 33061.0 | -3.49 |
| 33062.0 | -3.537 |
| 33063.0 | -3.583 |
| 33064.0 | -3.605 |
| 33065.0 | -3.639 |
| 33066.0 | -3.678 |
| 33067.0 | -3.693 |
| 33068.0 | -3.707 |
| 33069.0 | -3.727 |
| 33070.0 | -3.729 |
| 33071.0 | -3.69 |
| 33072.0 | -3.691 |
| 33073.0 | -3.714 |
| 33074.0 | -3.745 |
| 33075.0 | -3.779 |
| 33076.0 | -3.811 |
| 33077.0 | -3.838 |
| 33078.0 | -3.857 |
| 33079.0 | -3.865 |
| 33080.0 | -3.845 |
| 33081.0 | -3.838 |
| 33082.0 | -3.851 |
| 33083.0 | -3.875 |
| 33084.0 | -3.906 |
| 33085.0 | -3.941 |
| 33086.0 | -3.974 |
| 33087.0 | -3.996 |
| 33088.0 | -4.017 |
| 33089.0 | -4.029 |
| 33090.0 | -4.034 |
| 33091.0 | -4.042 |
| 33092.0 | -4.044 |
| 33093.0 | -4.043 |
| 33094.0 | -4.067 |
| 33095.0 | -4.08 |
| 33096.0 | -4.082 |
| 33097.0 | -4.067 |
| 33098.0 | -4.058 |
| 33099.0 | -4.076 |
| 33100.0 | -4.109 |
| 33101.0 | -4.144 |
| 33102.0 | -4.179 |
| 33103.0 | -4.213 |
| 33104.0 | -4.237 |
| 33105.0 | -4.254 |
| 33106.0 | -4.274 |
| 33107.0 | -4.317 |
| 33108.0 | -4.335 |
| 33109.0 | -4.346 |
| 33110.0 | -4.368 |
| 33111.0 | -4.392 |
| 33112.0 | -4.42 |
| 33113.0 | -4.454 |
| 33114.0 | -4.49 |
| 33115.0 | -4.528 |
| 33116.0 | -4.568 |
| 33117.0 | -4.607 |
| 33118.0 | -4.646 |
| 33119.0 | -4.687 |
| 33120.0 | -4.731 |
| 33121.0 | -4.764 |
| 33122.0 | -4.774 |
| 33123.0 | -4.779 |
| 33124.0 | -4.778 |
| 33125.0 | -4.788 |
| 33126.0 | -4.794 |
| 33127.0 | -4.771 |
| 33128.0 | -4.763 |
| 33129.0 | -4.77 |
| 33130.0 | -4.77 |
| 33131.0 | -4.779 |
| 33132.0 | -4.78 |
| 33133.0 | -4.758 |
| 33134.0 | -4.74 |
| 33135.0 | -4.726 |
| 33136.0 | -4.711 |
| 33137.0 | -4.699 |
| 33138.0 | -4.7 |
| 33139.0 | -4.695 |
| 33140.0 | -4.701 |
| 33141.0 | -4.706 |
| 33142.0 | -4.713 |
| 33143.0 | -4.725 |
| 33144.0 | -4.732 |
| 33145.0 | -4.731 |
| 33146.0 | -4.726 |
| 33147.0 | -4.708 |
| 33148.0 | -4.705 |
| 33149.0 | -4.699 |
| 33150.0 | -4.683 |
| 33151.0 | -4.674 |
| 33152.0 | -4.668 |
| 33153.0 | -4.647 |
| 33154.0 | -4.626 |
| 33155.0 | -4.608 |
| 33156.0 | -4.595 |
| 33157.0 | -4.579 |
| 33158.0 | -4.552 |
| 33159.0 | -4.482 |
| 33160.0 | -4.423 |
| 33161.0 | -4.344 |
| 33162.0 | -4.265 |
| 33163.0 | -4.23 |
| 33164.0 | -4.203 |
| 33165.0 | -4.174 |
| 33166.0 | -4.159 |
| 33167.0 | -4.141 |
| 33168.0 | -4.124 |
| 33169.0 | -4.105 |
| 33170.0 | -4.09 |
| 33171.0 | -4.078 |
| 33172.0 | -4.067 |
| 33173.0 | -4.04 |
| 33174.0 | -4.019 |
| 33175.0 | -4.004 |
| 33176.0 | -3.995 |
| 33177.0 | -3.982 |
| 33178.0 | -3.961 |
| 33179.0 | -3.949 |
| 33180.0 | -3.941 |
| 33181.0 | -3.93 |
| 33182.0 | -3.904 |
| 33183.0 | -3.889 |
| 33184.0 | -3.88 |
| 33185.0 | -3.884 |
| 33186.0 | -3.88 |
| 33187.0 | -3.885 |
| 33188.0 | -3.885 |
| 33189.0 | -3.88 |
| 33190.0 | -3.869 |
| 33191.0 | -3.869 |
| 33192.0 | -3.868 |
| 33193.0 | -3.875 |
| 33194.0 | -3.865 |
| 33195.0 | -3.841 |
| 33196.0 | -3.792 |
| 33197.0 | -3.765 |
| 33198.0 | -3.749 |
| 33199.0 | -3.741 |
| 33200.0 | -3.736 |
| 33201.0 | -3.725 |
| 33202.0 | -3.71 |
| 33203.0 | -3.7 |
| 33204.0 | -3.685 |
| 33205.0 | -3.663 |
| 33206.0 | -3.644 |
| 33207.0 | -3.636 |
| 33208.0 | -3.634 |
| 33209.0 | -3.628 |
| 33210.0 | -3.624 |
| 33211.0 | -3.622 |
| 33212.0 | -3.616 |
| 33213.0 | -3.619 |
| 33214.0 | -3.62 |
| 33215.0 | -3.622 |
| 33216.0 | -3.62 |
| 33217.0 | -3.625 |
| 33218.0 | -3.639 |
| 33219.0 | -3.642 |
| 33220.0 | -3.659 |
| 33221.0 | -3.666 |
| 33222.0 | -3.672 |
| 33223.0 | -3.683 |
| 33224.0 | -3.683 |
| 33225.0 | -3.69 |
| 33226.0 | -3.702 |
| 33227.0 | -3.714 |
| 33228.0 | -3.711 |
| 33229.0 | -3.713 |
| 33230.0 | -3.718 |
| 33231.0 | -3.727 |
| 33232.0 | -3.727 |
| 33233.0 | -3.736 |
| 33234.0 | -3.74 |
| 33235.0 | -3.74 |
| 33236.0 | -3.74 |
| 33237.0 | -3.738 |
| 33238.0 | -3.723 |
| 33239.0 | -3.685 |
| 33240.0 | -3.607 |
| 33241.0 | -3.574 |
| 33242.0 | -3.563 |
| 33243.0 | -3.548 |
| 33244.0 | -3.536 |
| 33245.0 | -3.539 |
| 33246.0 | -3.516 |
| 33247.0 | -3.389 |
| 33248.0 | -3.346 |
| 33249.0 | -3.337 |
| 33250.0 | -3.336 |
| 33251.0 | -3.339 |
| 33252.0 | -3.336 |
| 33253.0 | -3.331 |
| 33254.0 | -3.294 |
| 33255.0 | -3.244 |
| 33256.0 | -3.224 |
| 33257.0 | -3.216 |
| 33258.0 | -3.211 |
| 33259.0 | -3.2 |
| 33260.0 | -3.15 |
| 33261.0 | -3.107 |
| 33262.0 | -3.08 |
| 33263.0 | -3.07 |
| 33264.0 | -3.063 |
| 33265.0 | -3.062 |
| 33266.0 | -3.067 |
| 33267.0 | -3.076 |
| 33268.0 | -3.077 |
| 33269.0 | -3.081 |
| 33270.0 | -3.081 |
| 33271.0 | -3.084 |
| 33272.0 | -3.081 |
| 33273.0 | -3.077 |
| 33274.0 | -3.072 |
| 33275.0 | -3.066 |
| 33276.0 | -3.062 |
| 33277.0 | -3.058 |
| 33278.0 | -3.056 |
| 33279.0 | -3.06 |
| 33280.0 | -3.052 |
| 33281.0 | -3.033 |
| 33282.0 | -3.032 |
| 33283.0 | -3.023 |
| 33284.0 | -3.014 |
| 33285.0 | -3.004 |
| 33286.0 | -2.988 |
| 33287.0 | -2.935 |
| 33288.0 | -2.893 |
| 33289.0 | -2.875 |
| 33290.0 | -2.863 |
| 33291.0 | -2.839 |
| 33292.0 | -2.858 |
| 33293.0 | -2.858 |
| 33294.0 | -2.854 |
| 33295.0 | -2.85 |
| 33296.0 | -2.842 |
| 33297.0 | -2.835 |
| 33298.0 | -2.831 |
| 33299.0 | -2.827 |
| 33300.0 | -2.823 |
| 33301.0 | -2.82 |
| 33302.0 | -2.818 |
| 33303.0 | -2.812 |
| 33304.0 | -2.807 |
| 33305.0 | -2.803 |
| 33306.0 | -2.799 |
| 33307.0 | -2.796 |
| 33308.0 | -2.794 |
| 33309.0 | -2.789 |
| 33310.0 | -2.79 |
| 33311.0 | -2.785 |
| 33312.0 | -2.783 |
| 33313.0 | -2.781 |
| 33314.0 | -2.784 |
| 33315.0 | -2.789 |
| 33316.0 | -2.798 |
| 33317.0 | -2.799 |
| 33318.0 | -2.799 |
| 33319.0 | -2.803 |
| 33320.0 | -2.807 |
| 33321.0 | -2.812 |
| 33322.0 | -2.819 |
| 33323.0 | -2.827 |
| 33324.0 | -2.832 |
| 33325.0 | -2.822 |
| 33326.0 | -2.803 |
| 33327.0 | -2.763 |
| 33328.0 | -2.74 |
| 33329.0 | -2.736 |
| 33330.0 | -2.734 |
| 33331.0 | -2.736 |
| 33332.0 | -2.735 |
| 33333.0 | -2.725 |
| 33334.0 | -2.713 |
| 33335.0 | -2.697 |
| 33336.0 | -2.654 |
| 33337.0 | -2.607 |
| 33338.0 | -2.566 |
| 33339.0 | -2.54 |
| 33340.0 | -2.517 |
| 33341.0 | -2.494 |
| 33342.0 | -2.479 |
| 33343.0 | -2.469 |
| 33344.0 | -2.456 |
| 33345.0 | -2.45 |
| 33346.0 | -2.423 |
| 33347.0 | -2.394 |
| 33348.0 | -2.36 |
| 33349.0 | -2.329 |
| 33350.0 | -2.299 |
| 33351.0 | -2.28 |
| 33352.0 | -2.212 |
| 33353.0 | -1.928 |
| 33354.0 | -1.816 |
| 33355.0 | -1.77 |
| 33356.0 | -1.738 |
| 33357.0 | -1.7 |
| 33358.0 | -1.675 |
| 33359.0 | -1.658 |
| 33360.0 | -1.644 |
| 33361.0 | -1.637 |
| 33362.0 | -1.62 |
| 33363.0 | -1.586 |
| 33364.0 | -1.566 |
| 33365.0 | -1.556 |
| 33366.0 | -1.549 |
| 33367.0 | -1.548 |
| 33368.0 | -1.548 |
| 33369.0 | -1.544 |
| 33370.0 | -1.539 |
| 33371.0 | -1.529 |
| 33372.0 | -1.521 |
| 33373.0 | -1.514 |
| 33374.0 | -1.512 |
| 33375.0 | -1.506 |
| 33376.0 | -1.511 |
| 33377.0 | -1.525 |
| 33378.0 | -1.524 |
| 33379.0 | -1.535 |
| 33380.0 | -1.524 |
| 33381.0 | -1.525 |
| 33382.0 | -1.528 |
| 33383.0 | -1.53 |
| 33384.0 | -1.541 |
| 33385.0 | -1.556 |
| 33386.0 | -1.568 |
| 33387.0 | -1.581 |
| 33388.0 | -1.599 |
| 33389.0 | -1.615 |
| 33390.0 | -1.61 |
| 33391.0 | -1.598 |
| 33392.0 | -1.585 |
| 33393.0 | -1.559 |
| 33394.0 | -1.455 |
| 33395.0 | -1.355 |
| 33396.0 | -1.327 |
| 33397.0 | -1.32 |
| 33398.0 | -1.311 |
| 33399.0 | -1.307 |
| 33400.0 | -1.29 |
| 33401.0 | -1.275 |
| 33402.0 | -1.271 |
| 33403.0 | -1.274 |
| 33404.0 | -1.275 |
| 33405.0 | -1.285 |
| 33406.0 | -1.293 |
| 33407.0 | -1.301 |
| 33408.0 | -1.307 |
| 33409.0 | -1.321 |
| 33410.0 | -1.34 |
| 33411.0 | -1.36 |
| 33412.0 | -1.381 |
| 33413.0 | -1.392 |
| 33414.0 | -1.408 |
| 33415.0 | -1.433 |
| 33416.0 | -1.453 |
| 33417.0 | -1.471 |
| 33418.0 | -1.494 |
| 33419.0 | -1.521 |
| 33420.0 | -1.549 |
| 33421.0 | -1.581 |
| 33422.0 | -1.598 |
| 33423.0 | -1.628 |
| 33424.0 | -1.666 |
| 33425.0 | -1.701 |
| 33426.0 | -1.735 |
| 33427.0 | -1.749 |
| 33428.0 | -1.722 |
| 33429.0 | -1.723 |
| 33430.0 | -1.745 |
| 33431.0 | -1.775 |
| 33432.0 | -1.804 |
| 33433.0 | -1.842 |
| 33434.0 | -1.881 |
| 33435.0 | -1.917 |
| 33436.0 | -1.947 |
| 33437.0 | -1.966 |
| 33438.0 | -1.975 |
| 33439.0 | -1.972 |
| 33440.0 | -1.971 |
| 33441.0 | -1.969 |
| 33442.0 | -1.992 |
| 33443.0 | -2.005 |
| 33444.0 | -2.031 |
| 33445.0 | -2.065 |
| 33446.0 | -2.097 |
| 33447.0 | -2.132 |
| 33448.0 | -2.163 |
| 33449.0 | -2.192 |
| 33450.0 | -2.22 |
| 33451.0 | -2.232 |
| 33452.0 | -2.231 |
| 33453.0 | -2.235 |
| 33454.0 | -2.251 |
| 33455.0 | -2.272 |
| 33456.0 | -2.28 |
| 33457.0 | -2.273 |
| 33458.0 | -2.215 |
| 33459.0 | -2.13 |
| 33460.0 | -2.096 |
| 33461.0 | -2.086 |
| 33462.0 | -2.081 |
| 33463.0 | -2.074 |
| 33464.0 | -2.027 |
| 33465.0 | -1.998 |
| 33466.0 | -1.988 |
| 33467.0 | -1.968 |
| 33468.0 | -1.983 |
| 33469.0 | -1.956 |
| 33470.0 | -1.939 |
| 33471.0 | -1.917 |
| 33472.0 | -1.892 |
| 33473.0 | -1.862 |
| 33474.0 | -1.832 |
| 33475.0 | -1.783 |
| 33476.0 | -1.697 |
| 33477.0 | -1.609 |
| 33478.0 | -1.524 |
| 33479.0 | -1.409 |
| 33480.0 | -1.282 |
| 33481.0 | -1.181 |
| 33482.0 | -1.098 |
| 33483.0 | -1.027 |
| 33484.0 | -0.962 |
| 33485.0 | -0.915 |
| 33486.0 | -0.885 |
| 33487.0 | -0.873 |
| 33488.0 | -0.86 |
| 33489.0 | -0.842 |
| 33490.0 | -0.84 |
| 33491.0 | -0.83 |
| 33492.0 | -0.811 |
| 33493.0 | -0.769 |
| 33494.0 | -0.754 |
| 33495.0 | -0.755 |
| 33496.0 | -0.755 |
| 33497.0 | -0.752 |
| 33498.0 | -0.749 |
| 33499.0 | -0.752 |
| 33500.0 | -0.757 |
| 33501.0 | -0.767 |
| 33502.0 | -0.773 |
| 33503.0 | -0.782 |
| 33504.0 | -0.784 |
| 33505.0 | -0.787 |
| 33506.0 | -0.786 |
| 33507.0 | -0.795 |
| 33508.0 | -0.808 |
| 33509.0 | -0.825 |
| 33510.0 | -0.836 |
| 33511.0 | -0.845 |
| 33512.0 | -0.826 |
| 33513.0 | -0.816 |
| 33514.0 | -0.784 |
| 33515.0 | -0.731 |
| 33516.0 | -0.707 |
| 33517.0 | -0.678 |
| 33518.0 | -0.671 |
| 33519.0 | -0.649 |
| 33520.0 | -0.639 |
| 33521.0 | -0.636 |
| 33522.0 | -0.642 |
| 33523.0 | -0.65 |
| 33524.0 | -0.658 |
| 33525.0 | -0.668 |
| 33526.0 | -0.672 |
| 33527.0 | -0.683 |
| 33528.0 | -0.678 |
| 33529.0 | -0.677 |
| 33530.0 | -0.692 |
| 33531.0 | -0.706 |
| 33532.0 | -0.724 |
| 33533.0 | -0.739 |
| 33534.0 | -0.749 |
| 33535.0 | -0.764 |
| 33536.0 | -0.784 |
| 33537.0 | -0.804 |
| 33538.0 | -0.824 |
| 33539.0 | -0.829 |
| 33540.0 | -0.847 |
| 33541.0 | -0.87 |
| 33542.0 | -0.895 |
| 33543.0 | -0.904 |
| 33544.0 | -0.909 |
| 33545.0 | -0.915 |
| 33546.0 | -0.933 |
| 33547.0 | -0.955 |
| 33548.0 | -0.972 |
| 33549.0 | -0.987 |
| 33550.0 | -0.996 |
| 33551.0 | -1.01 |
| 33552.0 | -1.024 |
| 33553.0 | -1.042 |
| 33554.0 | -1.058 |
| 33555.0 | -1.068 |
| 33556.0 | -1.041 |
| 33557.0 | -1.001 |
| 33558.0 | -0.975 |
| 33559.0 | -0.969 |
| 33560.0 | -0.969 |
| 33561.0 | -0.976 |
| 33562.0 | -0.982 |
| 33563.0 | -0.977 |
| 33564.0 | -0.971 |
| 33565.0 | -0.938 |
| 33566.0 | -0.928 |
| 33567.0 | -0.886 |
| 33568.0 | -0.811 |
| 33569.0 | -0.798 |
| 33570.0 | -0.788 |
| 33571.0 | -0.778 |
| 33572.0 | -0.775 |
| 33573.0 | -0.765 |
| 33574.0 | -0.699 |
| 33575.0 | -0.57 |
| 33576.0 | -0.466 |
| 33577.0 | -0.371 |
| 33578.0 | -0.321 |
| 33579.0 | -0.28 |
| 33580.0 | -0.254 |
| 33581.0 | -0.236 |
| 33582.0 | -0.226 |
| 33583.0 | -0.216 |
| 33584.0 | -0.211 |
| 33585.0 | -0.21 |
| 33586.0 | -0.225 |
| 33587.0 | -0.231 |
| 33588.0 | -0.243 |
| 33589.0 | -0.259 |
| 33590.0 | -0.282 |
| 33591.0 | -0.305 |
| 33592.0 | -0.326 |
| 33593.0 | -0.352 |
| 33594.0 | -0.376 |
| 33595.0 | -0.403 |
| 33596.0 | -0.431 |
| 33597.0 | -0.461 |
| 33598.0 | -0.487 |
| 33599.0 | -0.498 |
| 33600.0 | -0.485 |
| 33601.0 | -0.471 |
| 33602.0 | -0.484 |
| 33603.0 | -0.498 |
| 33604.0 | -0.538 |
| 33605.0 | -0.568 |
| 33606.0 | -0.599 |
| 33607.0 | -0.631 |
| 33608.0 | -0.661 |
| 33609.0 | -0.69 |
| 33610.0 | -0.721 |
| 33611.0 | -0.751 |
| 33612.0 | -0.776 |
| 33613.0 | -0.804 |
| 33614.0 | -0.835 |
| 33615.0 | -0.87 |
| 33616.0 | -0.905 |
| 33617.0 | -0.943 |
| 33618.0 | -0.971 |
| 33619.0 | -0.996 |
| 33620.0 | -1.03 |
| 33621.0 | -1.053 |
| 33622.0 | -1.024 |
| 33623.0 | -1 |
| 33624.0 | -1.011 |
| 33625.0 | -1.032 |
| 33626.0 | -1.06 |
| 33627.0 | -1.078 |
| 33628.0 | -1.098 |
| 33629.0 | -1.127 |
| 33630.0 | -1.154 |
| 33631.0 | -1.193 |
| 33632.0 | -1.222 |
| 33633.0 | -1.252 |
| 33634.0 | -1.293 |
| 33635.0 | -1.311 |
| 33636.0 | -1.341 |
| 33637.0 | -1.378 |
| 33638.0 | -1.384 |
| 33639.0 | -1.386 |
| 33640.0 | -1.389 |
| 33641.0 | -1.408 |
| 33642.0 | -1.431 |
| 33643.0 | -1.457 |
| 33644.0 | -1.477 |
| 33645.0 | -1.492 |
| 33646.0 | -1.502 |
| 33647.0 | -1.515 |
| 33648.0 | -1.521 |
| 33649.0 | -1.513 |
| 33650.0 | -1.442 |
| 33651.0 | -1.417 |
| 33652.0 | -1.436 |
| 33653.0 | -1.45 |
| 33654.0 | -1.462 |
| 33655.0 | -1.477 |
| 33656.0 | -1.49 |
| 33657.0 | -1.508 |
| 33658.0 | -1.521 |
| 33659.0 | -1.538 |
| 33660.0 | -1.554 |
| 33661.0 | -1.495 |
| 33662.0 | -1.354 |
| 33663.0 | -1.27 |
| 33664.0 | -1.244 |
| 33665.0 | -1.239 |
| 33666.0 | -1.238 |
| 33667.0 | -1.239 |
| 33668.0 | -1.246 |
| 33669.0 | -1.254 |
| 33670.0 | -1.263 |
| 33671.0 | -1.274 |
| 33672.0 | -1.272 |
| 33673.0 | -1.204 |
| 33674.0 | -1.197 |
| 33675.0 | -1.19 |
| 33676.0 | -1.2 |
| 33677.0 | -1.213 |
| 33678.0 | -1.22 |
| 33679.0 | -1.232 |
| 33680.0 | -1.234 |
| 33681.0 | -1.235 |
| 33682.0 | -1.241 |
| 33683.0 | -1.242 |
| 33684.0 | -1.241 |
| 33685.0 | -1.233 |
| 33686.0 | -1.217 |
| 33687.0 | -1.188 |
| 33688.0 | -1.162 |
| 33689.0 | -1.15 |
| 33690.0 | -1.153 |
| 33691.0 | -1.159 |
| 33692.0 | -1.165 |
| 33693.0 | -1.174 |
| 33694.0 | -1.174 |
| 33695.0 | -1.156 |
| 33696.0 | -1.114 |
| 33697.0 | -1.089 |
| 33698.0 | -1.029 |
| 33699.0 | -0.994 |
| 33700.0 | -0.957 |
| 33701.0 | -0.929 |
| 33702.0 | -0.899 |
| 33703.0 | -0.858 |
| 33704.0 | -0.843 |
| 33705.0 | -0.836 |
| 33706.0 | -0.835 |
| 33707.0 | -0.836 |
| 33708.0 | -0.842 |
| 33709.0 | -0.849 |
| 33710.0 | -0.849 |
| 33711.0 | -0.844 |
| 33712.0 | -0.846 |
| 33713.0 | -0.851 |
| 33714.0 | -0.861 |
| 33715.0 | -0.87 |
| 33716.0 | -0.882 |
| 33717.0 | -0.893 |
| 33718.0 | -0.904 |
| 33719.0 | -0.906 |
| 33720.0 | -0.89 |
| 33721.0 | -0.871 |
| 33722.0 | -0.854 |
| 33723.0 | -0.815 |
| 33724.0 | -0.801 |
| 33725.0 | -0.799 |
| 33726.0 | -0.804 |
| 33727.0 | -0.819 |
| 33728.0 | -0.835 |
| 33729.0 | -0.849 |
| 33730.0 | -0.854 |
| 33731.0 | -0.833 |
| 33732.0 | -0.824 |
| 33733.0 | -0.822 |
| 33734.0 | -0.816 |
| 33735.0 | -0.811 |
| 33736.0 | -0.803 |
| 33737.0 | -0.773 |
| 33738.0 | -0.647 |
| 33739.0 | -0.579 |
| 33740.0 | -0.564 |
| 33741.0 | -0.556 |
| 33742.0 | -0.547 |
| 33743.0 | -0.527 |
| 33744.0 | -0.487 |
| 33745.0 | -0.393 |
| 33746.0 | -0.327 |
| 33747.0 | -0.307 |
| 33748.0 | -0.304 |
| 33749.0 | -0.302 |
| 33750.0 | -0.302 |
| 33751.0 | -0.305 |
| 33752.0 | -0.309 |
| 33753.0 | -0.314 |
| 33754.0 | -0.325 |
| 33755.0 | -0.337 |
| 33756.0 | -0.351 |
| 33757.0 | -0.359 |
| 33758.0 | -0.356 |
| 33759.0 | 0 |
| 33760.0 | 0 |
| 33761.0 | 0 |
| 33762.0 | 0 |
| 33763.0 | 0 |
| 33764.0 | 0 |
| 33765.0 | 0 |
| 33766.0 | 0 |
| 33767.0 | -0.413 |
| 33768.0 | -0.418 |
| 33769.0 | -0.421 |
| 33770.0 | -0.435 |
| 33771.0 | -0.457 |
| 33772.0 | -0.475 |
| 33773.0 | -0.497 |
| 33774.0 | -0.521 |
| 33775.0 | -0.548 |
| 33776.0 | -0.577 |
| 33777.0 | -0.615 |
| 33778.0 | -0.65 |
| 33779.0 | -0.68 |
| 33780.0 | -0.695 |
| 33781.0 | -0.709 |
| 33782.0 | -0.787 |
| 33783.0 | -0.827 |
| 33784.0 | -0.857 |
| 33785.0 | -0.873 |
| 33786.0 | -0.839 |
| 33787.0 | -0.845 |
| 33788.0 | -0.845 |
| 33789.0 | -0.79 |
| 33790.0 | -0.741 |
| 33791.0 | -0.725 |
| 33792.0 | -0.736 |
| 33793.0 | -0.746 |
| 33794.0 | -0.765 |
| 33795.0 | -0.795 |
| 33796.0 | -0.823 |
| 33797.0 | -0.849 |
| 33798.0 | -0.869 |
| 33799.0 | -0.908 |
| 33800.0 | -0.947 |
| 33801.0 | -0.975 |
| 33802.0 | -0.996 |
| 33803.0 | -1.017 |
| 33804.0 | -1.024 |
| 33805.0 | -1.001 |
| 33806.0 | -1.009 |
| 33807.0 | -1.037 |
| 33808.0 | -1.057 |
| 33809.0 | -1.071 |
| 33810.0 | -1.093 |
| 33811.0 | -1.113 |
| 33812.0 | -1.133 |
| 33813.0 | -1.131 |
| 33814.0 | -1.114 |
| 33815.0 | -1.081 |
| 33816.0 | -1.05 |
| 33817.0 | -1.042 |
| 33818.0 | -1.016 |
| 33819.0 | -0.998 |
| 33820.0 | -0.995 |
| 33821.0 | -0.995 |
| 33822.0 | -0.993 |
| 33823.0 | -0.977 |
| 33824.0 | -0.925 |
| 33825.0 | -0.79 |
| 33826.0 | -0.728 |
| 33827.0 | -0.7 |
| 33828.0 | -0.693 |
| 33829.0 | -0.684 |
| 33830.0 | -0.647 |
| 33831.0 | -0.611 |
| 33832.0 | -0.576 |
| 33833.0 | -0.542 |
| 33834.0 | -0.515 |
| 33835.0 | -0.484 |
| 33836.0 | -0.466 |
| 33837.0 | -0.455 |
| 33838.0 | -0.444 |
| 33839.0 | -0.425 |
| 33840.0 | -0.415 |
| 33841.0 | -0.408 |
| 33842.0 | -0.403 |
| 33843.0 | -0.396 |
| 33844.0 | -0.395 |
| 33845.0 | -0.396 |
| 33846.0 | -0.403 |
| 33847.0 | -0.412 |
| 33848.0 | -0.423 |
| 33849.0 | -0.434 |
| 33850.0 | -0.442 |
| 33851.0 | -0.445 |
| 33852.0 | -0.438 |
| 33853.0 | -0.428 |
| 33854.0 | -0.4 |
| 33855.0 | -0.352 |
| 33856.0 | -0.306 |
| 33857.0 | -0.264 |
| 33858.0 | -0.236 |
| 33859.0 | -0.219 |
| 33860.0 | -0.205 |
| 33861.0 | -0.174 |
| 33862.0 | -0.134 |
| 33863.0 | -0.102 |
| 33864.0 | -0.082 |
| 33865.0 | -0.066 |
| 33866.0 | -0.053 |
| 33867.0 | -0.034 |
| 33868.0 | -0.012 |
| 33869.0 | 0.003 |
| 33870.0 | 0.005 |
| 33871.0 | 0.006 |
| 33872.0 | 0.017 |
| 33873.0 | 0.029 |
| 33874.0 | 0.027 |
| 33875.0 | 0.016 |
| 33876.0 | 0.009 |
| 33877.0 | 0.005 |
| 33878.0 | 0.007 |
| 33879.0 | 0.018 |
| 33880.0 | 0.016 |
| 33881.0 | 0.014 |
| 33882.0 | 0.023 |
| 33883.0 | 0.025 |
| 33884.0 | 0.034 |
| 33885.0 | 0.036 |
| 33886.0 | 0.038 |
| 33887.0 | 0.052 |
| 33888.0 | 0.066 |
| 33889.0 | 0.073 |
| 33890.0 | 0.067 |
| 33891.0 | 0.054 |
| 33892.0 | 0.034 |
| 33893.0 | 0.02 |
| 33894.0 | 0.009 |
| 33895.0 | 0.006 |
| 33896.0 | 0.012 |
| 33897.0 | 0.039 |
| 33898.0 | 0.043 |
| 33899.0 | 0.036 |
| 33900.0 | 0.029 |
| 33901.0 | 0.024 |
| 33902.0 | 0.017 |
| 33903.0 | 0.015 |
| 33904.0 | 0.006 |
| 33905.0 | 0.003 |
| 33906.0 | -0.01 |
| 33907.0 | -0.019 |
| 33908.0 | -0.03 |
| 33909.0 | -0.043 |
| 33910.0 | -0.061 |
| 33911.0 | -0.075 |
| 33912.0 | -0.093 |
| 33913.0 | -0.113 |
| 33914.0 | -0.137 |
| 33915.0 | -0.163 |
| 33916.0 | -0.183 |
| 33917.0 | -0.203 |
| 33918.0 | -0.224 |
| 33919.0 | -0.25 |
| 33920.0 | -0.274 |
| 33921.0 | -0.291 |
| 33922.0 | -0.268 |
| 33923.0 | -0.203 |
| 33924.0 | -0.165 |
| 33925.0 | -0.16 |
| 33926.0 | -0.162 |
| 33927.0 | -0.18 |
| 33928.0 | -0.203 |
| 33929.0 | -0.23 |
| 33930.0 | -0.254 |
| 33931.0 | -0.278 |
| 33932.0 | -0.306 |
| 33933.0 | -0.336 |
| 33934.0 | -0.364 |
| 33935.0 | -0.391 |
| 33936.0 | -0.416 |
| 33937.0 | -0.448 |
| 33938.0 | -0.47 |
| 33939.0 | -0.494 |
| 33940.0 | -0.516 |
| 33941.0 | -0.509 |
| 33942.0 | -0.498 |
| 33943.0 | -0.513 |
| 33944.0 | -0.536 |
| 33945.0 | -0.559 |
| 33946.0 | -0.58 |
| 33947.0 | -0.604 |
| 33948.0 | -0.63 |
| 33949.0 | -0.65 |
| 33950.0 | -0.669 |
| 33951.0 | -0.682 |
| 33952.0 | -0.694 |
| 33953.0 | -0.708 |
| 33954.0 | -0.72 |
| 33955.0 | -0.716 |
| 33956.0 | -0.654 |
| 33957.0 | -0.573 |
| 33958.0 | -0.466 |
| 33959.0 | -0.429 |
| 33960.0 | -0.416 |
| 33961.0 | -0.412 |
| 33962.0 | -0.414 |
| 33963.0 | -0.416 |
| 33964.0 | -0.422 |
| 33965.0 | -0.421 |
| 33966.0 | -0.428 |
| 33967.0 | -0.423 |
| 33968.0 | -0.413 |
| 33969.0 | -0.394 |
| 33970.0 | -0.392 |
| 33971.0 | -0.396 |
| 33972.0 | -0.405 |
| 33973.0 | -0.405 |
| 33974.0 | -0.395 |
| 33975.0 | -0.383 |
| 33976.0 | -0.387 |
| 33977.0 | -0.392 |
| 33978.0 | -0.399 |
| 33979.0 | -0.404 |
| 33980.0 | -0.413 |
| 33981.0 | -0.383 |
| 33982.0 | -0.353 |
| 33983.0 | -0.352 |
| 33984.0 | -0.356 |
| 33985.0 | -0.364 |
| 33986.0 | -0.368 |
| 33987.0 | -0.341 |
| 33988.0 | -0.3 |
| 33989.0 | -0.301 |
| 33990.0 | -0.304 |
| 33991.0 | -0.284 |
| 33992.0 | -0.281 |
| 33993.0 | -0.281 |
| 33994.0 | -0.281 |
| 33995.0 | -0.271 |
| 33996.0 | -0.226 |
| 33997.0 | -0.216 |
| 33998.0 | -0.211 |
| 33999.0 | -0.136 |
| 34000.0 | -0.074 |
| 34001.0 | 0.001 |
| 34002.0 | 0.09 |
| 34003.0 | 0.208 |
| 34004.0 | 0.231 |
| 34005.0 | 0.208 |
| 34006.0 | 0.173 |
| 34007.0 | 0.14 |
| 34008.0 | 0.12 |
| 34009.0 | 0.11 |
| 34010.0 | 0.101 |
| 34011.0 | 0.082 |
| 34012.0 | 0.061 |
| 34013.0 | 0.047 |
| 34014.0 | 0.032 |
| 34015.0 | 0.017 |
| 34016.0 | 0.004 |
| 34017.0 | -0.015 |
| 34018.0 | -0.039 |
| 34019.0 | -0.067 |
| 34020.0 | -0.099 |
| 34021.0 | -0.119 |
| 34022.0 | -0.148 |
| 34023.0 | -0.176 |
| 34024.0 | -0.204 |
| 34025.0 | -0.237 |
| 34026.0 | -0.266 |
| 34027.0 | -0.292 |
| 34028.0 | -0.309 |
| 34029.0 | -0.33 |
| 34030.0 | -0.356 |
| 34031.0 | -0.381 |
| 34032.0 | -0.414 |
| 34033.0 | -0.447 |
| 34034.0 | -0.481 |
| 34035.0 | -0.514 |
| 34036.0 | -0.548 |
| 34037.0 | -0.58 |
| 34038.0 | -0.612 |
| 34039.0 | -0.649 |
| 34040.0 | -0.678 |
| 34041.0 | -0.709 |
| 34042.0 | -0.74 |
| 34043.0 | -0.772 |
| 34044.0 | -0.801 |
| 34045.0 | -0.792 |
| 34046.0 | -0.778 |
| 34047.0 | -0.755 |
| 34048.0 | -0.748 |
| 34049.0 | -0.719 |
| 34050.0 | -0.672 |
| 34051.0 | -0.637 |
| 34052.0 | -0.641 |
| 34053.0 | -0.643 |
| 34054.0 | -0.645 |
| 34055.0 | -0.64 |
| 34056.0 | -0.622 |
| 34057.0 | -0.621 |
| 34058.0 | -0.636 |
| 34059.0 | -0.657 |
| 34060.0 | -0.674 |
| 34061.0 | -0.691 |
| 34062.0 | -0.716 |
| 34063.0 | -0.734 |
| 34064.0 | -0.756 |
| 34065.0 | -0.779 |
| 34066.0 | -0.8 |
| 34067.0 | -0.825 |
| 34068.0 | -0.839 |
| 34069.0 | -0.854 |
| 34070.0 | -0.865 |
| 34071.0 | -0.866 |
| 34072.0 | -0.845 |
| 34073.0 | -0.858 |
| 34074.0 | -0.877 |
| 34075.0 | -0.894 |
| 34076.0 | -0.916 |
| 34077.0 | -0.931 |
| 34078.0 | -0.956 |
| 34079.0 | -0.963 |
| 34080.0 | -0.934 |
| 34081.0 | -0.886 |
| 34082.0 | -0.841 |
| 34083.0 | -0.807 |
| 34084.0 | -0.779 |
| 34085.0 | -0.773 |
| 34086.0 | -0.776 |
| 34087.0 | -0.78 |
| 34088.0 | -0.788 |
| 34089.0 | -0.799 |
| 34090.0 | -0.811 |
| 34091.0 | -0.823 |
| 34092.0 | -0.837 |
| 34093.0 | -0.84 |
| 34094.0 | -0.846 |
| 34095.0 | -0.851 |
| 34096.0 | -0.859 |
| 34097.0 | -0.874 |
| 34098.0 | -0.886 |
| 34099.0 | -0.898 |
| 34100.0 | -0.912 |
| 34101.0 | -0.923 |
| 34102.0 | -0.94 |
| 34103.0 | -0.941 |
| 34104.0 | -0.886 |
| 34105.0 | -0.869 |
| 34106.0 | -0.853 |
| 34107.0 | -0.816 |
| 34108.0 | -0.707 |
| 34109.0 | -0.584 |
| 34110.0 | -0.532 |
| 34111.0 | -0.509 |
| 34112.0 | -0.49 |
| 34113.0 | -0.477 |
| 34114.0 | -0.462 |
| 34115.0 | -0.445 |
| 34116.0 | -0.396 |
| 34117.0 | -0.324 |
| 34118.0 | -0.273 |
| 34119.0 | -0.247 |
| 34120.0 | -0.226 |
| 34121.0 | -0.205 |
| 34122.0 | -0.193 |
| 34123.0 | -0.181 |
| 34124.0 | -0.168 |
| 34125.0 | -0.153 |
| 34126.0 | -0.14 |
| 34127.0 | -0.133 |
| 34128.0 | -0.133 |
| 34129.0 | -0.142 |
| 34130.0 | -0.151 |
| 34131.0 | -0.156 |
| 34132.0 | -0.16 |
| 34133.0 | -0.165 |
| 34134.0 | -0.166 |
| 34135.0 | -0.162 |
| 34136.0 | -0.154 |
| 34137.0 | -0.152 |
| 34138.0 | -0.159 |
| 34139.0 | -0.171 |
| 34140.0 | -0.184 |
| 34141.0 | -0.195 |
| 34142.0 | -0.208 |
| 34143.0 | -0.231 |
| 34144.0 | -0.259 |
| 34145.0 | -0.278 |
| 34146.0 | -0.293 |
| 34147.0 | -0.307 |
| 34148.0 | -0.323 |
| 34149.0 | -0.342 |
| 34150.0 | -0.361 |
| 34151.0 | -0.379 |
| 34152.0 | -0.397 |
| 34153.0 | -0.415 |
| 34154.0 | -0.433 |
| 34155.0 | -0.451 |
| 34156.0 | 0 |
| 34157.0 | 0 |
| 34158.0 | 0 |
| 34159.0 | 0 |
| 34160.0 | 0 |
| 34161.0 | 0 |
| 34162.0 | 0 |
| 34163.0 | 0 |
| 34164.0 | 0 |
| 34165.0 | 0 |
| 34166.0 | 0 |
| 34167.0 | -0.628 |
| 34168.0 | -0.645 |
| 34169.0 | -0.659 |
| 34170.0 | -0.67 |
| 34171.0 | -0.684 |
| 34172.0 | -0.704 |
| 34173.0 | -0.728 |
| 34174.0 | -0.754 |
| 34175.0 | -0.776 |
| 34176.0 | -0.797 |
| 34177.0 | -0.823 |
| 34178.0 | -0.858 |
| 34179.0 | -0.892 |
| 34180.0 | -0.917 |
| 34181.0 | -0.942 |
| 34182.0 | -0.961 |
| 34183.0 | -0.937 |
| 34184.0 | -0.884 |
| 34185.0 | -0.863 |
| 34186.0 | -0.866 |
| 34187.0 | -0.875 |
| 34188.0 | -0.89 |
| 34189.0 | -0.905 |
| 34190.0 | -0.921 |
| 34191.0 | -0.938 |
| 34192.0 | -0.956 |
| 34193.0 | -0.97 |
| 34194.0 | -0.984 |
| 34195.0 | -0.994 |
| 34196.0 | -0.995 |
| 34197.0 | -0.998 |
| 34198.0 | -1.009 |
| 34199.0 | -1.024 |
| 34200.0 | -1.035 |
| 34201.0 | -1.042 |
| 34202.0 | -1.044 |
| 34203.0 | -1.046 |
| 34204.0 | -1.05 |
| 34205.0 | -1.055 |
| 34206.0 | -1.053 |
| 34207.0 | -1.048 |
| 34208.0 | -1.045 |
| 34209.0 | -1.047 |
| 34210.0 | -1.056 |
| 34211.0 | -1.066 |
| 34212.0 | -1.076 |
| 34213.0 | -1.093 |
| 34214.0 | -1.106 |
| 34215.0 | -1.099 |
| 34216.0 | -1.081 |
| 34217.0 | -1.081 |
| 34218.0 | -1.092 |
| 34219.0 | -1.139 |
| 34220.0 | -1.163 |
| 34221.0 | -1.172 |
| 34222.0 | -1.177 |
| 34223.0 | -1.19 |
| 34224.0 | -1.192 |
| 34225.0 | -1.182 |
| 34226.0 | -1.192 |
| 34227.0 | -1.211 |
| 34228.0 | -1.228 |
| 34229.0 | -1.235 |
| 34230.0 | -1.247 |
| 34231.0 | -1.266 |
| 34232.0 | -1.286 |
| 34233.0 | -1.309 |
| 34234.0 | -1.328 |
| 34235.0 | -1.324 |
| 34236.0 | -1.306 |
| 34237.0 | -1.269 |
| 34238.0 | -1.248 |
| 34239.0 | -1.241 |
| 34240.0 | -1.227 |
| 34241.0 | -1.212 |
| 34242.0 | -1.203 |
| 34243.0 | -1.2 |
| 34244.0 | -1.203 |
| 34245.0 | -1.208 |
| 34246.0 | -1.218 |
| 34247.0 | -1.225 |
| 34248.0 | -1.245 |
| 34249.0 | -1.258 |
| 34250.0 | -1.271 |
| 34251.0 | -1.29 |
| 34252.0 | -1.312 |
| 34253.0 | -1.306 |
| 34254.0 | -1.301 |
| 34255.0 | -1.295 |
| 34256.0 | -1.279 |
| 34257.0 | -1.271 |
| 34258.0 | -1.271 |
| 34259.0 | -1.275 |
| 34260.0 | -1.27 |
| 34261.0 | -1.283 |
| 34262.0 | -1.291 |
| 34263.0 | -1.303 |
| 34264.0 | -1.31 |
| 34265.0 | -1.32 |
| 34266.0 | -1.326 |
| 34267.0 | -1.336 |
| 34268.0 | -1.348 |
| 34269.0 | -1.36 |
| 34270.0 | -1.372 |
| 34271.0 | -1.382 |
| 34272.0 | -1.383 |
| 34273.0 | -1.362 |
| 34274.0 | -1.35 |
| 34275.0 | -1.353 |
| 34276.0 | -1.364 |
| 34277.0 | -1.376 |
| 34278.0 | -1.391 |
| 34279.0 | -1.403 |
| 34280.0 | -1.418 |
| 34281.0 | -1.428 |
| 34282.0 | -1.446 |
| 34283.0 | -1.462 |
| 34284.0 | -1.477 |
| 34285.0 | -1.49 |
| 34286.0 | -1.505 |
| 34287.0 | -1.52 |
| 34288.0 | -1.534 |
| 34289.0 | -1.555 |
| 34290.0 | -1.572 |
| 34291.0 | -1.581 |
| 34292.0 | -1.573 |
| 34293.0 | -1.572 |
| 34294.0 | -1.569 |
| 34295.0 | -1.573 |
| 34296.0 | -1.584 |
| 34297.0 | -1.595 |
| 34298.0 | -1.602 |
| 34299.0 | -1.609 |
| 34300.0 | -1.626 |
| 34301.0 | -1.637 |
| 34302.0 | -1.639 |
| 34303.0 | -1.65 |
| 34304.0 | -1.658 |
| 34305.0 | -1.626 |
| 34306.0 | -1.511 |
| 34307.0 | -1.488 |
| 34308.0 | -1.477 |
| 34309.0 | -1.464 |
| 34310.0 | -1.46 |
| 34311.0 | -1.448 |
| 34312.0 | -1.45 |
| 34313.0 | -1.455 |
| 34314.0 | -1.465 |
| 34315.0 | -1.472 |
| 34316.0 | -1.488 |
| 34317.0 | -1.496 |
| 34318.0 | -1.5 |
| 34319.0 | -1.487 |
| 34320.0 | -1.436 |
| 34321.0 | -1.376 |
| 34322.0 | -1.36 |
| 34323.0 | -1.342 |
| 34324.0 | -1.211 |
| 34325.0 | -0.813 |
| 34326.0 | -0.689 |
| 34327.0 | -0.66 |
| 34328.0 | -0.65 |
| 34329.0 | -0.643 |
| 34330.0 | -0.641 |
| 34331.0 | -0.633 |
| 34332.0 | -0.634 |
| 34333.0 | -0.631 |
| 34334.0 | -0.631 |
| 34335.0 | -0.636 |
| 34336.0 | -0.671 |
| 34337.0 | -0.712 |
| 34338.0 | -0.734 |
| 34339.0 | -0.65 |
| 34340.0 | -0.547 |
| 34341.0 | -0.449 |
| 34342.0 | -0.376 |
| 34343.0 | -0.308 |
| 34344.0 | -0.24 |
| 34345.0 | -0.171 |
| 34346.0 | -0.102 |
| 34347.0 | -0.044 |
| 34348.0 | -0.038 |
| 34349.0 | -0.001 |
| 34350.0 | 0.005 |
| 34351.0 | 0.005 |
| 34352.0 | 0.003 |
| 34353.0 | -0.009 |
| 34354.0 | -0.024 |
| 34355.0 | -0.045 |
| 34356.0 | -0.057 |
| 34357.0 | -0.043 |
| 34358.0 | -0.035 |
| 34359.0 | -0.035 |
| 34360.0 | -0.048 |
| 34361.0 | -0.064 |
| 34362.0 | -0.057 |
| 34363.0 | -0.109 |
| 34364.0 | -0.144 |
| 34365.0 | -0.158 |
| 34366.0 | -0.2 |
| 34367.0 | -0.205 |
| 34368.0 | -0.212 |
| 34369.0 | -0.231 |
| 34370.0 | -0.258 |
| 34371.0 | -0.285 |
| 34372.0 | -0.311 |
| 34373.0 | -0.322 |
| 34374.0 | -0.313 |
| 34375.0 | -0.309 |
| 34376.0 | -0.329 |
| 34377.0 | -0.352 |
| 34378.0 | -0.375 |
| 34379.0 | -0.392 |
| 34380.0 | -0.411 |
| 34381.0 | -0.434 |
| 34382.0 | -0.452 |
| 34383.0 | -0.432 |
| 34384.0 | -0.404 |
| 34385.0 | -0.341 |
| 34386.0 | -0.321 |
| 34387.0 | -0.312 |
| 34388.0 | -0.303 |
| 34389.0 | -0.302 |
| 34390.0 | -0.308 |
| 34391.0 | -0.313 |
| 34392.0 | -0.321 |
| 34393.0 | -0.325 |
| 34394.0 | -0.327 |
| 34395.0 | -0.317 |
| 34396.0 | -0.309 |
| 34397.0 | -0.302 |
| 34398.0 | -0.298 |
| 34399.0 | -0.297 |
| 34400.0 | -0.276 |
| 34401.0 | -0.266 |
| 34402.0 | -0.259 |
| 34403.0 | -0.262 |
| 34404.0 | -0.264 |
| 34405.0 | -0.259 |
| 34406.0 | -0.259 |
| 34407.0 | -0.261 |
| 34408.0 | -0.259 |
| 34409.0 | -0.241 |
| 34410.0 | -0.22 |
| 34411.0 | -0.199 |
| 34412.0 | -0.178 |
| 34413.0 | -0.158 |
| 34414.0 | -0.137 |
| 34415.0 | -0.116 |
| 34416.0 | -0.095 |
| 34417.0 | -0.059 |
| 34418.0 | 0.049 |
| 34419.0 | 0.067 |
| 34420.0 | 0.067 |
| 34421.0 | 0.067 |
| 34422.0 | 0.066 |
| 34423.0 | 0.053 |
| 34424.0 | 0.028 |
| 34425.0 | 0.015 |
| 34426.0 | 0 |
| 34427.0 | -0.045 |
| 34428.0 | -0.095 |
| 34429.0 | -0.145 |
| 34430.0 | -0.189 |
| 34431.0 | -0.197 |
| 34432.0 | -0.214 |
| 34433.0 | -0.225 |
| 34434.0 | -0.236 |
| 34435.0 | -0.253 |
| 34436.0 | -0.268 |
| 34437.0 | -0.292 |
| 34438.0 | -0.313 |
| 34439.0 | -0.332 |
| 34440.0 | -0.349 |
| 34441.0 | -0.369 |
| 34442.0 | -0.397 |
| 34443.0 | -0.412 |
| 34444.0 | -0.405 |
| 34445.0 | -0.408 |
| 34446.0 | -0.413 |
| 34447.0 | -0.412 |
| 34448.0 | -0.41 |
| 34449.0 | -0.387 |
| 34450.0 | -0.379 |
| 34451.0 | -0.368 |
| 34452.0 | -0.358 |
| 34453.0 | -0.361 |
| 34454.0 | -0.372 |
| 34455.0 | -0.388 |
| 34456.0 | -0.41 |
| 34457.0 | -0.427 |
| 34458.0 | -0.447 |
| 34459.0 | -0.47 |
| 34460.0 | -0.493 |
| 34461.0 | -0.513 |
| 34462.0 | -0.536 |
| 34463.0 | -0.559 |
| 34464.0 | -0.579 |
| 34465.0 | -0.587 |
| 34466.0 | -0.549 |
| 34467.0 | -0.535 |
| 34468.0 | -0.54 |
| 34469.0 | -0.549 |
| 34470.0 | -0.562 |
| 34471.0 | -0.566 |
| 34472.0 | -0.553 |
| 34473.0 | -0.542 |
| 34474.0 | -0.537 |
| 34475.0 | -0.519 |
| 34476.0 | -0.51 |
| 34477.0 | -0.509 |
| 34478.0 | -0.508 |
| 34479.0 | -0.499 |
| 34480.0 | -0.48 |
| 34481.0 | -0.471 |
| 34482.0 | -0.463 |
| 34483.0 | -0.439 |
| 34484.0 | -0.42 |
| 34485.0 | -0.408 |
| 34486.0 | -0.403 |
| 34487.0 | -0.375 |
| 34488.0 | -0.365 |
| 34489.0 | -0.369 |
| 34490.0 | -0.377 |
| 34491.0 | -0.391 |
| 34492.0 | -0.403 |
| 34493.0 | -0.411 |
| 34494.0 | -0.419 |
| 34495.0 | -0.43 |
| 34496.0 | -0.435 |
| 34497.0 | -0.443 |
| 34498.0 | -0.458 |
| 34499.0 | -0.477 |
| 34500.0 | -0.489 |
| 34501.0 | -0.501 |
| 34502.0 | -0.517 |
| 34503.0 | -0.533 |
| 34504.0 | -0.552 |
| 34505.0 | -0.568 |
| 34506.0 | -0.584 |
| 34507.0 | -0.603 |
| 34508.0 | -0.62 |
| 34509.0 | -0.605 |
| 34510.0 | -0.538 |
| 34511.0 | -0.519 |
| 34512.0 | -0.52 |
| 34513.0 | -0.519 |
| 34514.0 | -0.528 |
| 34515.0 | -0.527 |
| 34516.0 | -0.504 |
| 34517.0 | -0.388 |
| 34518.0 | -0.075 |
| 34519.0 | 0.014 |
| 34520.0 | 0.084 |
| 34521.0 | 0.121 |
| 34522.0 | 0.14 |
| 34523.0 | 0.144 |
| 34524.0 | 0.137 |
| 34525.0 | 0.145 |
| 34526.0 | 0.144 |
| 34527.0 | 0.13 |
| 34528.0 | 0.111 |
| 34529.0 | 0.099 |
| 34530.0 | 0.092 |
| 34531.0 | 0.088 |
| 34532.0 | 0.071 |
| 34533.0 | 0.049 |
| 34534.0 | 0.036 |
| 34535.0 | 0.024 |
| 34536.0 | 0.016 |
| 34537.0 | 0.012 |
| 34538.0 | 0.006 |
| 34539.0 | 0.005 |
| 34540.0 | 0.005 |
| 34541.0 | 0.018 |
| 34542.0 | 0.105 |
| 34543.0 | 0.168 |
| 34544.0 | 0.167 |
| 34545.0 | 0.147 |
| 34546.0 | 0.13 |
| 34547.0 | 0.115 |
| 34548.0 | 0.104 |
| 34549.0 | 0.102 |
| 34550.0 | 0.095 |
| 34551.0 | 0.087 |
| 34552.0 | 0.079 |
| 34553.0 | 0.072 |
| 34554.0 | 0.067 |
| 34555.0 | 0.062 |
| 34556.0 | 0.053 |
| 34557.0 | 0.047 |
| 34558.0 | 0.04 |
| 34559.0 | 0.055 |
| 34560.0 | 0.068 |
| 34561.0 | 0.063 |
| 34562.0 | 0.057 |
| 34563.0 | 0.058 |
| 34564.0 | 0.053 |
| 34565.0 | 0.053 |
| 34566.0 | 0.059 |
| 34567.0 | 0.062 |
| 34568.0 | 0.059 |
| 34569.0 | 0.056 |
| 34570.0 | 0.056 |
| 34571.0 | 0.054 |
| 34572.0 | 0.045 |
| 34573.0 | 0.041 |
| 34574.0 | 0.044 |
| 34575.0 | 0.052 |
| 34576.0 | 0.057 |
| 34577.0 | 0.052 |
| 34578.0 | 0.048 |
| 34579.0 | 0.043 |
| 34580.0 | 0.034 |
| 34581.0 | 0.031 |
| 34582.0 | 0.024 |
| 34583.0 | 0.014 |
| 34584.0 | 0.016 |
| 34585.0 | 0.022 |
| 34586.0 | 0.016 |
| 34587.0 | 0.015 |
| 34588.0 | 0.03 |
| 34589.0 | 0.039 |
| 34590.0 | 0.064 |
| 34591.0 | 0.094 |
| 34592.0 | 0.117 |
| 34593.0 | 0.134 |
| 34594.0 | 0.147 |
| 34595.0 | 0.144 |
| 34596.0 | 0.15 |
| 34597.0 | 0.156 |
| 34598.0 | 0.15 |
| 34599.0 | 0.142 |
| 34600.0 | 0.134 |
| 34601.0 | 0.122 |
| 34602.0 | 0.114 |
| 34603.0 | 0.101 |
| 34604.0 | 0.079 |
| 34605.0 | 0.06 |
| 34606.0 | 0.048 |
| 34607.0 | 0.035 |
| 34608.0 | 0.021 |
| 34609.0 | 0.013 |
| 34610.0 | 0.008 |
| 34611.0 | 0.005 |
| 34612.0 | 0.004 |
| 34613.0 | -0.008 |
| 34614.0 | -0.023 |
| 34615.0 | -0.038 |
| 34616.0 | -0.052 |
| 34617.0 | -0.074 |
| 34618.0 | -0.098 |
| 34619.0 | -0.107 |
| 34620.0 | -0.125 |
| 34621.0 | -0.141 |
| 34622.0 | -0.14 |
| 34623.0 | -0.16 |
| 34624.0 | -0.175 |
| 34625.0 | -0.148 |
| 34626.0 | -0.141 |
| 34627.0 | -0.142 |
| 34628.0 | -0.134 |
| 34629.0 | -0.137 |
| 34630.0 | -0.149 |
| 34631.0 | -0.168 |
| 34632.0 | -0.191 |
| 34633.0 | -0.212 |
| 34634.0 | -0.238 |
| 34635.0 | -0.266 |
| 34636.0 | -0.294 |
| 34637.0 | -0.321 |
| 34638.0 | -0.334 |
| 34639.0 | -0.387 |
| 34640.0 | -0.423 |
| 34641.0 | -0.455 |
| 34642.0 | -0.492 |
| 34643.0 | -0.524 |
| 34644.0 | -0.547 |
| 34645.0 | -0.566 |
| 34646.0 | -0.598 |
| 34647.0 | -0.621 |
| 34648.0 | -0.632 |
| 34649.0 | -0.646 |
| 34650.0 | -0.643 |
| 34651.0 | -0.662 |
| 34652.0 | -0.696 |
| 34653.0 | -0.778 |
| 34654.0 | -0.787 |
| 34655.0 | -0.781 |
| 34656.0 | -0.803 |
| 34657.0 | -0.804 |
| 34658.0 | -0.771 |
| 34659.0 | -0.661 |
| 34660.0 | -0.588 |
| 34661.0 | -0.572 |
| 34662.0 | -0.562 |
| 34663.0 | -0.564 |
| 34664.0 | -0.572 |
| 34665.0 | -0.582 |
| 34666.0 | -0.579 |
| 34667.0 | -0.571 |
| 34668.0 | -0.576 |
| 34669.0 | -0.558 |
| 34670.0 | -0.553 |
| 34671.0 | -0.557 |
| 34672.0 | -0.567 |
| 34673.0 | -0.572 |
| 34674.0 | -0.581 |
| 34675.0 | -0.597 |
| 34676.0 | -0.604 |
| 34677.0 | -0.611 |
| 34678.0 | -0.623 |
| 34679.0 | -0.638 |
| 34680.0 | -0.653 |
| 34681.0 | -0.678 |
| 34682.0 | -0.683 |
| 34683.0 | -0.694 |
| 34684.0 | -0.71 |
| 34685.0 | -0.73 |
| 34686.0 | -0.754 |
| 34687.0 | -0.764 |
| 34688.0 | -0.752 |
| 34689.0 | -0.759 |
| 34690.0 | -0.764 |
| 34691.0 | -0.769 |
| 34692.0 | -0.779 |
| 34693.0 | -0.79 |
| 34694.0 | -0.81 |
| 34695.0 | -0.827 |
| 34696.0 | -0.839 |
| 34697.0 | -0.855 |
| 34698.0 | -0.876 |
| 34699.0 | -0.888 |
| 34700.0 | -0.911 |
| 34701.0 | -0.919 |
| 34702.0 | -0.917 |
| 34703.0 | -0.933 |
| 34704.0 | -0.951 |
| 34705.0 | -0.961 |
| 34706.0 | -0.977 |
| 34707.0 | -0.982 |
| 34708.0 | -0.993 |
| 34709.0 | -0.995 |
| 34710.0 | -0.996 |
| 34711.0 | -1.007 |
| 34712.0 | -1.019 |
| 34713.0 | -1.034 |
| 34714.0 | -1.051 |
| 34715.0 | -1.069 |
| 34716.0 | -1.082 |
| 34717.0 | -1.101 |
| 34718.0 | -1.117 |
| 34719.0 | -1.138 |
| 34720.0 | -1.164 |
| 34721.0 | -1.169 |
| 34722.0 | -1.18 |
| 34723.0 | -1.198 |
| 34724.0 | -1.215 |
| 34725.0 | -1.229 |
| 34726.0 | -1.253 |
| 34727.0 | -1.27 |
| 34728.0 | -1.286 |
| 34729.0 | -1.304 |
| 34730.0 | -1.321 |
| 34731.0 | -1.336 |
| 34732.0 | -1.352 |
| 34733.0 | -1.367 |
| 34734.0 | -1.377 |
| 34735.0 | -1.392 |
| 34736.0 | -1.409 |
| 34737.0 | -1.416 |
| 34738.0 | -1.423 |
| 34739.0 | -1.431 |
| 34740.0 | -1.439 |
| 34741.0 | -1.45 |
| 34742.0 | -1.458 |
| 34743.0 | -1.471 |
| 34744.0 | -1.489 |
| 34745.0 | -1.509 |
| 34746.0 | -1.529 |
| 34747.0 | -1.553 |
| 34748.0 | -1.577 |
| 34749.0 | -1.589 |
| 34750.0 | -1.611 |
| 34751.0 | -1.634 |
| 34752.0 | -1.655 |
| 34753.0 | -1.681 |
| 34754.0 | -1.701 |
| 34755.0 | -1.722 |
| 34756.0 | -1.751 |
| 34757.0 | -1.773 |
| 34758.0 | -1.798 |
| 34759.0 | -1.816 |
| 34760.0 | -1.838 |
| 34761.0 | -1.854 |
| 34762.0 | -1.866 |
| 34763.0 | -1.878 |
| 34764.0 | -1.893 |
| 34765.0 | -1.906 |
| 34766.0 | -1.924 |
| 34767.0 | -1.939 |
| 34768.0 | -1.942 |
| 34769.0 | -1.948 |
| 34770.0 | -1.956 |
| 34771.0 | -1.946 |
| 34772.0 | -1.862 |
| 34773.0 | -1.835 |
| 34774.0 | -1.821 |
| 34775.0 | -1.82 |
| 34776.0 | -1.827 |
| 34777.0 | -1.831 |
| 34778.0 | -1.838 |
| 34779.0 | -1.84 |
| 34780.0 | -1.85 |
| 34781.0 | -1.862 |
| 34782.0 | -1.875 |
| 34783.0 | -1.867 |
| 34784.0 | -1.863 |
| 34785.0 | -1.868 |
| 34786.0 | -1.884 |
| 34787.0 | -1.894 |
| 34788.0 | -1.905 |
| 34789.0 | -1.917 |
| 34790.0 | -1.929 |
| 34791.0 | -1.939 |
| 34792.0 | -1.943 |
| 34793.0 | -1.96 |
| 34794.0 | -1.977 |
| 34795.0 | -1.979 |
| 34796.0 | -1.99 |
| 34797.0 | -1.995 |
| 34798.0 | -1.995 |
| 34799.0 | -1.996 |
| 34800.0 | -2.007 |
| 34801.0 | -2.02 |
| 34802.0 | -2.038 |
| 34803.0 | -2.058 |
| 34804.0 | -2.08 |
| 34805.0 | -2.097 |
| 34806.0 | -2.11 |
| 34807.0 | -2.112 |
| 34808.0 | -2.13 |
| 34809.0 | -2.136 |
| 34810.0 | -2.144 |
| 34811.0 | -2.149 |
| 34812.0 | -2.157 |
| 34813.0 | -2.168 |
| 34814.0 | -2.176 |
| 34815.0 | -2.183 |
| 34816.0 | -2.19 |
| 34817.0 | -2.192 |
| 34818.0 | -2.202 |
| 34819.0 | -2.211 |
| 34820.0 | -2.219 |
| 34821.0 | -2.23 |
| 34822.0 | -2.238 |
| 34823.0 | -2.245 |
| 34824.0 | -2.25 |
| 34825.0 | -2.259 |
| 34826.0 | -2.271 |
| 34827.0 | -2.286 |
| 34828.0 | -2.283 |
| 34829.0 | -2.286 |
| 34830.0 | -2.298 |
| 34831.0 | -2.32 |
| 34832.0 | -2.337 |
| 34833.0 | -2.354 |
| 34834.0 | -2.361 |
| 34835.0 | -2.373 |
| 34836.0 | -2.387 |
| 34837.0 | -2.381 |
| 34838.0 | -2.379 |
| 34839.0 | -2.374 |
| 34840.0 | -2.381 |
| 34841.0 | -2.397 |
| 34842.0 | -2.423 |
| 34843.0 | -2.449 |
| 34844.0 | -2.468 |
| 34845.0 | -2.501 |
| 34846.0 | -2.539 |
| 34847.0 | -2.566 |
| 34848.0 | -2.58 |
| 34849.0 | -2.584 |
| 34850.0 | -2.542 |
| 34851.0 | -2.485 |
| 34852.0 | -2.471 |
| 34853.0 | -2.466 |
| 34854.0 | -2.46 |
| 34855.0 | -2.416 |
| 34856.0 | -2.354 |
| 34857.0 | -2.328 |
| 34858.0 | -2.27 |
| 34859.0 | -1.915 |
| 34860.0 | -1.702 |
| 34861.0 | -1.647 |
| 34862.0 | -1.638 |
| 34863.0 | -1.635 |
| 34864.0 | -1.632 |
| 34865.0 | -1.634 |
| 34866.0 | -1.632 |
| 34867.0 | -1.639 |
| 34868.0 | -1.65 |
| 34869.0 | -1.663 |
| 34870.0 | -1.684 |
| 34871.0 | -1.698 |
| 34872.0 | -1.717 |
| 34873.0 | -1.736 |
| 34874.0 | -1.751 |
| 34875.0 | -1.761 |
| 34876.0 | -1.775 |
| 34877.0 | -1.788 |
| 34878.0 | -1.8 |
| 34879.0 | -1.819 |
| 34880.0 | -1.841 |
| 34881.0 | -1.879 |
| 34882.0 | -1.918 |
| 34883.0 | -1.942 |
| 34884.0 | -1.991 |
| 34885.0 | -2.022 |
| 34886.0 | -2.066 |
| 34887.0 | -2.109 |
| 34888.0 | -2.148 |
| 34889.0 | -2.185 |
| 34890.0 | -2.233 |
| 34891.0 | -2.266 |
| 34892.0 | -2.25 |
| 34893.0 | -2.358 |
| 34894.0 | -2.402 |
| 34895.0 | -2.4 |
| 34896.0 | -2.402 |
| 34897.0 | -2.42 |
| 34898.0 | -2.448 |
| 34899.0 | -2.466 |
| 34900.0 | -2.486 |
| 34901.0 | -2.509 |
| 34902.0 | -2.53 |
| 34903.0 | -2.559 |
| 34904.0 | -2.584 |
| 34905.0 | -2.611 |
| 34906.0 | -2.636 |
| 34907.0 | -2.666 |
| 34908.0 | -2.694 |
| 34909.0 | -2.729 |
| 34910.0 | -2.764 |
| 34911.0 | -2.796 |
| 34912.0 | -2.833 |
| 34913.0 | -2.865 |
| 34914.0 | -2.908 |
| 34915.0 | -2.952 |
| 34916.0 | -2.993 |
| 34917.0 | -3.021 |
| 34918.0 | -3.062 |
| 34919.0 | -3.108 |
| 34920.0 | -3.148 |
| 34921.0 | -3.175 |
| 34922.0 | -3.151 |
| 34923.0 | -3.115 |
| 34924.0 | -3.094 |
| 34925.0 | -3.079 |
| 34926.0 | -3.073 |
| 34927.0 | -3.057 |
| 34928.0 | -2.981 |
| 34929.0 | -2.865 |
| 34930.0 | -2.806 |
| 34931.0 | -2.744 |
| 34932.0 | -2.643 |
| 34933.0 | -2.586 |
| 34934.0 | -2.546 |
| 34935.0 | -2.496 |
| 34936.0 | -2.467 |
| 34937.0 | -2.442 |
| 34938.0 | -2.379 |
| 34939.0 | -2.248 |
| 34940.0 | -2.166 |
| 34941.0 | -2.1 |
| 34942.0 | -2.008 |
| 34943.0 | -1.933 |
| 34944.0 | -1.829 |
| 34945.0 | -1.779 |
| 34946.0 | -1.754 |
| 34947.0 | -1.72 |
| 34948.0 | -1.677 |
| 34949.0 | -1.651 |
| 34950.0 | -1.636 |
| 34951.0 | -1.63 |
| 34952.0 | -1.617 |
| 34953.0 | -1.578 |
| 34954.0 | -1.477 |
| 34955.0 | -1.45 |
| 34956.0 | -1.407 |
| 34957.0 | -1.315 |
| 34958.0 | -1.254 |
| 34959.0 | -1.228 |
| 34960.0 | -1.21 |
| 34961.0 | -1.192 |
| 34962.0 | -1.196 |
| 34963.0 | -1.143 |
| 34964.0 | -1.096 |
| 34965.0 | -1.065 |
| 34966.0 | -1.036 |
| 34967.0 | -1.018 |
| 34968.0 | -0.994 |
| 34969.0 | -0.93 |
| 34970.0 | -0.827 |
| 34971.0 | -0.768 |
| 34972.0 | -0.741 |
| 34973.0 | -0.724 |
| 34974.0 | -0.704 |
| 34975.0 | -0.68 |
| 34976.0 | -0.666 |
| 34977.0 | -0.65 |
| 34978.0 | -0.635 |
| 34979.0 | -0.623 |
| 34980.0 | -0.605 |
| 34981.0 | -0.574 |
| 34982.0 | -0.556 |
| 34983.0 | -0.531 |
| 34984.0 | -0.464 |
| 34985.0 | -0.443 |
| 34986.0 | -0.414 |
| 34987.0 | -0.381 |
| 34988.0 | -0.351 |
| 34989.0 | -0.319 |
| 34990.0 | -0.297 |
| 34991.0 | -0.276 |
| 34992.0 | -0.244 |
| 34993.0 | -0.203 |
| 34994.0 | -0.187 |
| 34995.0 | -0.173 |
| 34996.0 | -0.164 |
| 34997.0 | -0.16 |
| 34998.0 | -0.16 |
| 34999.0 | -0.164 |
| 35000.0 | -0.168 |
| 35001.0 | -0.165 |
| 35002.0 | -0.138 |
| 35003.0 | -0.08 |
| 35004.0 | -0.052 |
| 35005.0 | -0.043 |
| 35006.0 | -0.046 |
| 35007.0 | -0.042 |
| 35008.0 | -0.018 |
| 35009.0 | -0.011 |
| 35010.0 | -0.007 |
| 35011.0 | -0.003 |
| 35012.0 | 0.004 |
| 35013.0 | 0.005 |
| 35014.0 | 0.001 |
| 35015.0 | -0.001 |
| 35016.0 | -0.014 |
| 35017.0 | -0.023 |
| 35018.0 | -0.035 |
| 35019.0 | -0.053 |
| 35020.0 | -0.068 |
| 35021.0 | -0.095 |
| 35022.0 | -0.106 |
| 35023.0 | -0.076 |
| 35024.0 | -0.038 |
| 35025.0 | -0.021 |
| 35026.0 | -0.02 |
| 35027.0 | -0.025 |
| 35028.0 | 0.013 |
| 35029.0 | 0.111 |
| 35030.0 | 0.129 |
| 35031.0 | 0.121 |
| 35032.0 | 0.11 |
| 35033.0 | 0.098 |
| 35034.0 | 0.084 |
| 35035.0 | 0.074 |
| 35036.0 | 0.056 |
| 35037.0 | 0.04 |
| 35038.0 | 0.029 |
| 35039.0 | 0.019 |
| 35040.0 | 0.029 |
| 35041.0 | 0.096 |
| 35042.0 | -0.217 |
| 35043.0 | -0.04 |
| 35044.0 | -0.015 |
| 35045.0 | 0.058 |
| 35046.0 | 0.259 |
| 35047.0 | 0.244 |
| 35048.0 | 0.191 |
| 35049.0 | 0.151 |
| 35050.0 | 0.145 |
| 35051.0 | 0.135 |
| 35052.0 | 0.11 |
| 35053.0 | 0.08 |
| 35054.0 | 0.059 |
| 35055.0 | 0.039 |
| 35056.0 | 0.03 |
| 35057.0 | 0.095 |
| 35058.0 | 0.1 |
| 35059.0 | 0.071 |
| 35060.0 | 0.043 |
| 35061.0 | 0.03 |
| 35062.0 | 0.011 |
| 35063.0 | 0.004 |
| 35064.0 | -0.009 |
| 35065.0 | -0.034 |
| 35066.0 | -0.057 |
| 35067.0 | -0.072 |
| 35068.0 | -0.071 |
| 35069.0 | -0.073 |
| 35070.0 | -0.054 |
| 35071.0 | -0.056 |
| 35072.0 | -0.067 |
| 35073.0 | -0.042 |
| 35074.0 | -0.033 |
| 35075.0 | -0.021 |
| 35076.0 | -0.002 |
| 35077.0 | 0.001 |
| 35078.0 | 0.005 |
| 35079.0 | 0.007 |
| 35080.0 | 0.006 |
| 35081.0 | 0.005 |
| 35082.0 | -0.001 |
| 35083.0 | -0.02 |
| 35084.0 | -0.046 |
| 35085.0 | -0.073 |
| 35086.0 | -0.091 |
| 35087.0 | -0.094 |
| 35088.0 | -0.103 |
| 35089.0 | -0.128 |
| 35090.0 | -0.152 |
| 35091.0 | -0.18 |
| 35092.0 | -0.208 |
| 35093.0 | -0.222 |
| 35094.0 | -0.228 |
| 35095.0 | -0.241 |
| 35096.0 | -0.269 |
| 35097.0 | -0.298 |
| 35098.0 | -0.334 |
| 35099.0 | -0.36 |
| 35100.0 | -0.378 |
| 35101.0 | -0.389 |
| 35102.0 | -0.409 |
| 35103.0 | -0.424 |
| 35104.0 | -0.446 |
| 35105.0 | -0.466 |
| 35106.0 | -0.48 |
| 35107.0 | -0.484 |
| 35108.0 | -0.498 |
| 35109.0 | -0.516 |
| 35110.0 | -0.529 |
| 35111.0 | -0.541 |
| 35112.0 | -0.56 |
| 35113.0 | -0.579 |
| 35114.0 | -0.594 |
| 35115.0 | -0.604 |
| 35116.0 | -0.618 |
| 35117.0 | -0.627 |
| 35118.0 | -0.635 |
| 35119.0 | -0.646 |
| 35120.0 | -0.655 |
| 35121.0 | -0.669 |
| 35122.0 | -0.678 |
| 35123.0 | -0.69 |
| 35124.0 | -0.703 |
| 35125.0 | -0.709 |
| 35126.0 | -0.713 |
| 35127.0 | -0.721 |
| 35128.0 | -0.732 |
| 35129.0 | -0.741 |
| 35130.0 | -0.752 |
| 35131.0 | -0.764 |
| 35132.0 | -0.776 |
| 35133.0 | -0.784 |
| 35134.0 | -0.773 |
| 35135.0 | -0.764 |
| 35136.0 | -0.761 |
| 35137.0 | -0.769 |
| 35138.0 | -0.777 |
| 35139.0 | -0.744 |
| 35140.0 | -0.73 |
| 35141.0 | -0.729 |
| 35142.0 | -0.729 |
| 35143.0 | -0.728 |
| 35144.0 | -0.742 |
| 35145.0 | -0.748 |
| 35146.0 | -0.751 |
| 35147.0 | -0.752 |
| 35148.0 | -0.751 |
| 35149.0 | -0.749 |
| 35150.0 | -0.749 |
| 35151.0 | -0.757 |
| 35152.0 | -0.772 |
| 35153.0 | -0.784 |
| 35154.0 | -0.799 |
| 35155.0 | -0.812 |
| 35156.0 | -0.827 |
| 35157.0 | -0.841 |
| 35158.0 | -0.851 |
| 35159.0 | -0.862 |
| 35160.0 | -0.874 |
| 35161.0 | -0.886 |
| 35162.0 | -0.898 |
| 35163.0 | -0.913 |
| 35164.0 | -0.925 |
| 35165.0 | -0.936 |
| 35166.0 | -0.944 |
| 35167.0 | -0.952 |
| 35168.0 | -0.963 |
| 35169.0 | -0.972 |
| 35170.0 | -0.98 |
| 35171.0 | -0.987 |
| 35172.0 | -0.992 |
| 35173.0 | -0.995 |
| 35174.0 | -0.986 |
| 35175.0 | -0.926 |
| 35176.0 | -0.891 |
| 35177.0 | -0.893 |
| 35178.0 | -0.898 |
| 35179.0 | -0.905 |
| 35180.0 | -0.917 |
| 35181.0 | -0.926 |
| 35182.0 | -0.927 |
| 35183.0 | -0.874 |
| 35184.0 | -0.832 |
| 35185.0 | -0.807 |
| 35186.0 | -0.803 |
| 35187.0 | -0.798 |
| 35188.0 | -0.792 |
| 35189.0 | -0.78 |
| 35190.0 | -0.729 |
| 35191.0 | -0.7 |
| 35192.0 | -0.69 |
| 35193.0 | -0.686 |
| 35194.0 | -0.682 |
| 35195.0 | -0.682 |
| 35196.0 | -0.679 |
| 35197.0 | -0.682 |
| 35198.0 | -0.689 |
| 35199.0 | -0.693 |
| 35200.0 | -0.687 |
| 35201.0 | -0.631 |
| 35202.0 | -0.612 |
| 35203.0 | -0.611 |
| 35204.0 | -0.615 |
| 35205.0 | -0.615 |
| 35206.0 | -0.618 |
| 35207.0 | -0.616 |
| 35208.0 | -0.618 |
| 35209.0 | -0.61 |
| 35210.0 | -0.548 |
| 35211.0 | -0.215 |
| 35212.0 | -0.037 |
| 35213.0 | 0.003 |
| 35214.0 | 0.013 |
| 35215.0 | 0.025 |
| 35216.0 | 0.047 |
| 35217.0 | 0.061 |
| 35218.0 | 0.068 |
| 35219.0 | 0.101 |
| 35220.0 | 0.145 |
| 35221.0 | 0.163 |
| 35222.0 | 0.16 |
| 35223.0 | 0.151 |
| 35224.0 | 0.146 |
| 35225.0 | 0.146 |
| 35226.0 | 0.145 |
| 35227.0 | 0.135 |
| 35228.0 | 0.13 |
| 35229.0 | 0.125 |
| 35230.0 | 0.115 |
| 35231.0 | 0.111 |
| 35232.0 | 0.118 |
| 35233.0 | 0.145 |
| 35234.0 | 0.141 |
| 35235.0 | 0.13 |
| 35236.0 | 0.118 |
| 35237.0 | 0.104 |
| 35238.0 | 0.104 |
| 35239.0 | 0.14 |
| 35240.0 | 0.188 |
| 35241.0 | 0.232 |
| 35242.0 | 0.266 |
| 35243.0 | 0.244 |
| 35244.0 | 0.213 |
| 35245.0 | 0.187 |
| 35246.0 | 0.172 |
| 35247.0 | 0.154 |
| 35248.0 | 0.135 |
| 35249.0 | 0.127 |
| 35250.0 | 0.126 |
| 35251.0 | 0.126 |
| 35252.0 | 0.126 |
| 35253.0 | 0.126 |
| 35254.0 | 0.126 |
| 35255.0 | 0.126 |
| 35256.0 | 0.118 |
| 35257.0 | 0.064 |
| 35258.0 | 0.013 |
| 35259.0 | -0.007 |
| 35260.0 | -0.027 |
| 35261.0 | -0.056 |
| 35262.0 | -0.092 |
| 35263.0 | -0.119 |
| 35264.0 | -0.131 |
| 35265.0 | -0.134 |
| 35266.0 | -0.144 |
| 35267.0 | -0.159 |
| 35268.0 | -0.168 |
| 35269.0 | -0.172 |
| 35270.0 | -0.18 |
| 35271.0 | -0.192 |
| 35272.0 | -0.206 |
| 35273.0 | -0.215 |
| 35274.0 | -0.215 |
| 35275.0 | -0.195 |
| 35276.0 | -0.193 |
| 35277.0 | -0.208 |
| 35278.0 | -0.228 |
| 35279.0 | -0.229 |
| 35280.0 | -0.2 |
| 35281.0 | -0.2 |
| 35282.0 | -0.214 |
| 35283.0 | -0.243 |
| 35284.0 | -0.259 |
| 35285.0 | -0.274 |
| 35286.0 | -0.294 |
| 35287.0 | -0.317 |
| 35288.0 | -0.338 |
| 35289.0 | -0.347 |
| 35290.0 | -0.352 |
| 35291.0 | -0.36 |
| 35292.0 | -0.363 |
| 35293.0 | -0.341 |
| 35294.0 | -0.345 |
| 35295.0 | -0.36 |
| 35296.0 | -0.376 |
| 35297.0 | -0.39 |
| 35298.0 | -0.397 |
| 35299.0 | -0.414 |
| 35300.0 | -0.428 |
| 35301.0 | -0.445 |
| 35302.0 | -0.456 |
| 35303.0 | -0.459 |
| 35304.0 | -0.462 |
| 35305.0 | -0.447 |
| 35306.0 | -0.453 |
| 35307.0 | -0.462 |
| 35308.0 | -0.47 |
| 35309.0 | -0.474 |
| 35310.0 | -0.475 |
| 35311.0 | -0.476 |
| 35312.0 | -0.47 |
| 35313.0 | -0.462 |
| 35314.0 | -0.458 |
| 35315.0 | -0.455 |
| 35316.0 | -0.459 |
| 35317.0 | -0.471 |
| 35318.0 | -0.491 |
| 35319.0 | -0.498 |
| 35320.0 | -0.506 |
| 35321.0 | -0.512 |
| 35322.0 | -0.511 |
| 35323.0 | -0.522 |
| 35324.0 | -0.539 |
| 35325.0 | -0.548 |
| 35326.0 | -0.557 |
| 35327.0 | -0.576 |
| 35328.0 | -0.6 |
| 35329.0 | -0.629 |
| 35330.0 | -0.651 |
| 35331.0 | -0.673 |
| 35332.0 | -0.689 |
| 35333.0 | -0.701 |
| 35334.0 | -0.709 |
| 35335.0 | -0.719 |
| 35336.0 | -0.736 |
| 35337.0 | -0.753 |
| 35338.0 | -0.772 |
| 35339.0 | -0.794 |
| 35340.0 | -0.808 |
| 35341.0 | -0.83 |
| 35342.0 | -0.846 |
| 35343.0 | -0.86 |
| 35344.0 | -0.862 |
| 35345.0 | -0.866 |
| 35346.0 | -0.87 |
| 35347.0 | -0.87 |
| 35348.0 | -0.875 |
| 35349.0 | -0.878 |
| 35350.0 | -0.835 |
| 35351.0 | -0.687 |
| 35352.0 | -0.625 |
| 35353.0 | -0.597 |
| 35354.0 | -0.577 |
| 35355.0 | 0 |
| 35356.0 | 0 |
| 35357.0 | 0 |
| 35358.0 | 0 |
| 35359.0 | 0 |
| 35360.0 | 0 |
| 35361.0 | -0.511 |
| 35362.0 | -0.495 |
| 35363.0 | -0.477 |
| 35364.0 | -0.459 |
| 35365.0 | -0.441 |
| 35366.0 | -0.423 |
| 35367.0 | -0.405 |
| 35368.0 | -0.387 |
| 35369.0 | -0.369 |
| 35370.0 | -0.351 |
| 35371.0 | -0.333 |
| 35372.0 | -0.315 |
| 35373.0 | -0.298 |
| 35374.0 | -0.285 |
| 35375.0 | -0.274 |
| 35376.0 | -0.262 |
| 35377.0 | -0.25 |
| 35378.0 | -0.238 |
| 35379.0 | -0.226 |
| 35380.0 | -0.214 |
| 35381.0 | -0.202 |
| 35382.0 | -0.188 |
| 35383.0 | -0.163 |
| 35384.0 | -0.155 |
| 35385.0 | -0.15 |
| 35386.0 | -0.145 |
| 35387.0 | -0.132 |
| 35388.0 | -0.06 |
| 35389.0 | 0.065 |
| 35390.0 | 0.088 |
| 35391.0 | 0.078 |
| 35392.0 | 0.062 |
| 35393.0 | 0.059 |
| 35394.0 | 0.042 |
| 35395.0 | 0.059 |
| 35396.0 | 0.078 |
| 35397.0 | 0.068 |
| 35398.0 | 0.057 |
| 35399.0 | 0.036 |
| 35400.0 | 0.017 |
| 35401.0 | 0.006 |
| 35402.0 | -0.001 |
| 35403.0 | -0.014 |
| 35404.0 | -0.008 |
| 35405.0 | -0.027 |
| 35406.0 | -0.054 |
| 35407.0 | -0.086 |
| 35408.0 | -0.121 |
| 35409.0 | -0.159 |
| 35410.0 | -0.192 |
| 35411.0 | -0.227 |
| 35412.0 | -0.262 |
| 35413.0 | -0.296 |
| 35414.0 | -0.321 |
| 35415.0 | -0.348 |
| 35416.0 | -0.371 |
| 35417.0 | -0.39 |
| 35418.0 | -0.403 |
| 35419.0 | -0.411 |
| 35420.0 | -0.419 |
| 35421.0 | -0.427 |
| 35422.0 | -0.437 |
| 35423.0 | -0.441 |
| 35424.0 | -0.46 |
| 35425.0 | -0.495 |
| 35426.0 | -0.517 |
| 35427.0 | -0.54 |
| 35428.0 | -0.565 |
| 35429.0 | -0.594 |
| 35430.0 | -0.617 |
| 35431.0 | -0.647 |
| 35432.0 | -0.66 |
| 35433.0 | -0.683 |
| 35434.0 | -0.694 |
| 35435.0 | -0.71 |
| 35436.0 | -0.733 |
| 35437.0 | -0.75 |
| 35438.0 | -0.738 |
| 35439.0 | -0.752 |
| 35440.0 | -0.756 |
| 35441.0 | -0.652 |
| 35442.0 | -0.371 |
| 35443.0 | -0.293 |
| 35444.0 | -0.275 |
| 35445.0 | -0.267 |
| 35446.0 | -0.265 |
| 35447.0 | -0.257 |
| 35448.0 | -0.213 |
| 35449.0 | -0.162 |
| 35450.0 | -0.149 |
| 35451.0 | -0.164 |
| 35452.0 | -0.14 |
| 35453.0 | -0.133 |
| 35454.0 | -0.135 |
| 35455.0 | -0.133 |
| 35456.0 | -0.133 |
| 35457.0 | -0.136 |
| 35458.0 | -0.14 |
| 35459.0 | -0.144 |
| 35460.0 | -0.153 |
| 35461.0 | -0.16 |
| 35462.0 | -0.154 |
| 35463.0 | -0.199 |
| 35464.0 | -0.227 |
| 35465.0 | -0.249 |
| 35466.0 | -0.263 |
| 35467.0 | -0.285 |
| 35468.0 | -0.305 |
| 35469.0 | -0.323 |
| 35470.0 | -0.327 |
| 35471.0 | -0.293 |
| 35472.0 | -0.234 |
| 35473.0 | -0.176 |
| 35474.0 | -0.169 |
| 35475.0 | -0.18 |
| 35476.0 | -0.196 |
| 35477.0 | -0.214 |
| 35478.0 | -0.23 |
| 35479.0 | -0.24 |
| 35480.0 | -0.239 |
| 35481.0 | -0.237 |
| 35482.0 | -0.237 |
| 35483.0 | -0.258 |
| 35484.0 | -0.281 |
| 35485.0 | -0.302 |
| 35486.0 | -0.328 |
| 35487.0 | -0.352 |
| 35488.0 | -0.371 |
| 35489.0 | -0.387 |
| 35490.0 | -0.4 |
| 35491.0 | -0.422 |
| 35492.0 | -0.439 |
| 35493.0 | -0.456 |
| 35494.0 | -0.463 |
| 35495.0 | -0.477 |
| 35496.0 | -0.487 |
| 35497.0 | -0.506 |
| 35498.0 | -0.513 |
| 35499.0 | -0.519 |
| 35500.0 | -0.539 |
| 35501.0 | -0.552 |
| 35502.0 | -0.563 |
| 35503.0 | -0.573 |
| 35504.0 | -0.586 |
| 35505.0 | -0.594 |
| 35506.0 | -0.592 |
| 35507.0 | -0.599 |
| 35508.0 | -0.601 |
| 35509.0 | -0.592 |
| 35510.0 | -0.588 |
| 35511.0 | -0.592 |
| 35512.0 | -0.602 |
| 35513.0 | -0.611 |
| 35514.0 | -0.619 |
| 35515.0 | -0.624 |
| 35516.0 | -0.635 |
| 35517.0 | -0.646 |
| 35518.0 | -0.653 |
| 35519.0 | -0.659 |
| 35520.0 | -0.668 |
| 35521.0 | -0.672 |
| 35522.0 | -0.682 |
| 35523.0 | -0.696 |
| 35524.0 | -0.7 |
| 35525.0 | -0.694 |
| 35526.0 | -0.69 |
| 35527.0 | -0.651 |
| 35528.0 | -0.533 |
| 35529.0 | -0.493 |
| 35530.0 | -0.468 |
| 35531.0 | -0.443 |
| 35532.0 | -0.359 |
| 35533.0 | -0.312 |
| 35534.0 | -0.292 |
| 35535.0 | -0.287 |
| 35536.0 | -0.274 |
| 35537.0 | -0.259 |
| 35538.0 | -0.253 |
| 35539.0 | -0.238 |
| 35540.0 | -0.222 |
| 35541.0 | -0.201 |
| 35542.0 | -0.183 |
| 35543.0 | -0.141 |
| 35544.0 | -0.09 |
| 35545.0 | 0.012 |
| 35546.0 | 0.054 |
| 35547.0 | 0.091 |
| 35548.0 | 0.101 |
| 35549.0 | 0.099 |
| 35550.0 | 0.095 |
| 35551.0 | 0.091 |
| 35552.0 | 0.082 |
| 35553.0 | 0.072 |
| 35554.0 | 0.066 |
| 35555.0 | 0.057 |
| 35556.0 | 0.053 |
| 35557.0 | 0.052 |
| 35558.0 | 0.05 |
| 35559.0 | 0.04 |
| 35560.0 | 0.028 |
| 35561.0 | 0.013 |
| 35562.0 | 0.003 |
| 35563.0 | -0.013 |
| 35564.0 | 0.002 |
| 35565.0 | 0.005 |
| 35566.0 | 0.002 |
| 35567.0 | -0.015 |
| 35568.0 | -0.034 |
| 35569.0 | -0.05 |
| 35570.0 | -0.065 |
| 35571.0 | -0.078 |
| 35572.0 | -0.097 |
| 35573.0 | -0.119 |
| 35574.0 | -0.123 |
| 35575.0 | -0.111 |
| 35576.0 | -0.086 |
| 35577.0 | -0.081 |
| 35578.0 | -0.091 |
| 35579.0 | -0.091 |
| 35580.0 | -0.101 |
| 35581.0 | -0.092 |
| 35582.0 | -0.096 |
| 35583.0 | -0.099 |
| 35584.0 | -0.099 |
| 35585.0 | -0.045 |
| 35586.0 | -0.002 |
| 35587.0 | 0.018 |
| 35588.0 | 0.019 |
| 35589.0 | 0.012 |
| 35590.0 | 0.006 |
| 35591.0 | 0.005 |
| 35592.0 | 0.005 |
| 35593.0 | 0.004 |
| 35594.0 | -0.008 |
| 35595.0 | -0.023 |
| 35596.0 | -0.039 |
| 35597.0 | -0.061 |
| 35598.0 | -0.074 |
| 35599.0 | -0.088 |
| 35600.0 | -0.097 |
| 35601.0 | -0.105 |
| 35602.0 | -0.112 |
| 35603.0 | -0.116 |
| 35604.0 | -0.116 |
| 35605.0 | -0.111 |
| 35606.0 | -0.121 |
| 35607.0 | -0.131 |
| 35608.0 | -0.134 |
| 35609.0 | -0.123 |
| 35610.0 | -0.123 |
| 35611.0 | -0.136 |
| 35612.0 | -0.152 |
| 35613.0 | -0.168 |
| 35614.0 | -0.184 |
| 35615.0 | -0.202 |
| 35616.0 | -0.219 |
| 35617.0 | -0.235 |
| 35618.0 | -0.258 |
| 35619.0 | -0.276 |
| 35620.0 | -0.28 |
| 35621.0 | -0.28 |
| 35622.0 | -0.293 |
| 35623.0 | -0.306 |
| 35624.0 | -0.321 |
| 35625.0 | -0.34 |
| 35626.0 | -0.36 |
| 35627.0 | -0.379 |
| 35628.0 | -0.391 |
| 35629.0 | -0.403 |
| 35630.0 | -0.419 |
| 35631.0 | -0.435 |
| 35632.0 | -0.453 |
| 35633.0 | -0.47 |
| 35634.0 | -0.482 |
| 35635.0 | -0.476 |
| 35636.0 | -0.483 |
| 35637.0 | -0.496 |
| 35638.0 | -0.504 |
| 35639.0 | -0.502 |
| 35640.0 | -0.504 |
| 35641.0 | -0.504 |
| 35642.0 | -0.498 |
| 35643.0 | -0.496 |
| 35644.0 | -0.494 |
| 35645.0 | -0.492 |
| 35646.0 | -0.486 |
| 35647.0 | -0.487 |
| 35648.0 | -0.5 |
| 35649.0 | -0.514 |
| 35650.0 | -0.528 |
| 35651.0 | -0.526 |
| 35652.0 | -0.487 |
| 35653.0 | -0.465 |
| 35654.0 | -0.414 |
| 35655.0 | -0.363 |
| 35656.0 | -0.353 |
| 35657.0 | -0.326 |
| 35658.0 | -0.282 |
| 35659.0 | -0.26 |
| 35660.0 | -0.231 |
| 35661.0 | -0.224 |
| 35662.0 | -0.224 |
| 35663.0 | -0.231 |
| 35664.0 | -0.242 |
| 35665.0 | -0.254 |
| 35666.0 | -0.267 |
| 35667.0 | -0.289 |
| 35668.0 | -0.307 |
| 35669.0 | -0.311 |
| 35670.0 | -0.321 |
| 35671.0 | -0.336 |
| 35672.0 | -0.351 |
| 35673.0 | -0.365 |
| 35674.0 | -0.378 |
| 35675.0 | -0.384 |
| 35676.0 | -0.395 |
| 35677.0 | -0.408 |
| 35678.0 | -0.427 |
| 35679.0 | -0.446 |
| 35680.0 | -0.466 |
| 35681.0 | -0.486 |
| 35682.0 | -0.51 |
| 35683.0 | -0.514 |
| 35684.0 | -0.501 |
| 35685.0 | -0.51 |
| 35686.0 | -0.533 |
| 35687.0 | -0.558 |
| 35688.0 | -0.572 |
| 35689.0 | -0.583 |
| 35690.0 | -0.589 |
| 35691.0 | -0.581 |
| 35692.0 | -0.578 |
| 35693.0 | -0.588 |
| 35694.0 | -0.603 |
| 35695.0 | -0.618 |
| 35696.0 | -0.625 |
| 35697.0 | -0.643 |
| 35698.0 | -0.666 |
| 35699.0 | -0.689 |
| 35700.0 | -0.712 |
| 35701.0 | -0.729 |
| 35702.0 | -0.749 |
| 35703.0 | -0.772 |
| 35704.0 | -0.8 |
| 35705.0 | -0.833 |
| 35706.0 | -0.857 |
| 35707.0 | -0.872 |
| 35708.0 | -0.895 |
| 35709.0 | -0.903 |
| 35710.0 | -0.894 |
| 35711.0 | -0.895 |
| 35712.0 | -0.907 |
| 35713.0 | -0.894 |
| 35714.0 | -0.918 |
| 35715.0 | -0.914 |
| 35716.0 | -0.935 |
| 35717.0 | -0.95 |
| 35718.0 | -0.972 |
| 35719.0 | -0.992 |
| 35720.0 | -0.995 |
| 35721.0 | -0.995 |
| 35722.0 | -0.995 |
| 35723.0 | -0.995 |
| 35724.0 | -0.992 |
| 35725.0 | -0.992 |
| 35726.0 | -0.992 |
| 35727.0 | -0.992 |
| 35728.0 | -0.992 |
| 35729.0 | -0.992 |
| 35730.0 | -0.995 |
| 35731.0 | -1.014 |
| 35732.0 | -1.03 |
| 35733.0 | -1.042 |
| 35734.0 | -1.054 |
| 35735.0 | -1.067 |
| 35736.0 | -1.089 |
| 35737.0 | -1.111 |
| 35738.0 | -1.124 |
| 35739.0 | -1.128 |
| 35740.0 | -1.133 |
| 35741.0 | -1.138 |
| 35742.0 | -1.131 |
| 35743.0 | -1.115 |
| 35744.0 | -1.082 |
| 35745.0 | -1.008 |
| 35746.0 | -0.965 |
| 35747.0 | -0.955 |
| 35748.0 | -0.944 |
| 35749.0 | -0.933 |
| 35750.0 | -0.927 |
| 35751.0 | -0.932 |
| 35752.0 | -0.933 |
| 35753.0 | -0.936 |
| 35754.0 | -0.931 |
| 35755.0 | -0.913 |
| 35756.0 | -0.9 |
| 35757.0 | -0.894 |
| 35758.0 | -0.813 |
| 35759.0 | -0.782 |
| 35760.0 | -0.793 |
| 35761.0 | -0.774 |
| 35762.0 | -0.761 |
| 35763.0 | -0.756 |
| 35764.0 | -0.758 |
| 35765.0 | -0.768 |
| 35766.0 | -0.772 |
| 35767.0 | -0.755 |
| 35768.0 | -0.754 |
| 35769.0 | -0.761 |
| 35770.0 | -0.754 |
| 35771.0 | -0.755 |
| 35772.0 | -0.757 |
| 35773.0 | -0.761 |
| 35774.0 | -0.753 |
| 35775.0 | -0.75 |
| 35776.0 | -0.755 |
| 35777.0 | -0.761 |
| 35778.0 | -0.772 |
| 35779.0 | -0.782 |
| 35780.0 | -0.779 |
| 35781.0 | -0.786 |
| 35782.0 | -0.776 |
| 35783.0 | -0.802 |
| 35784.0 | -0.808 |
| 35785.0 | -0.815 |
| 35786.0 | -0.822 |
| 35787.0 | -0.818 |
| 35788.0 | -0.811 |
| 35789.0 | -0.803 |
| 35790.0 | -0.794 |
| 35791.0 | -0.78 |
| 35792.0 | -0.764 |
| 35793.0 | -0.744 |
| 35794.0 | -0.725 |
| 35795.0 | -0.71 |
| 35796.0 | -0.703 |
| 35797.0 | -0.711 |
| 35798.0 | -0.73 |
| 35799.0 | -0.738 |
| 35800.0 | -0.748 |
| 35801.0 | -0.759 |
| 35802.0 | -0.768 |
| 35803.0 | -0.774 |
| 35804.0 | -0.768 |
| 35805.0 | -0.762 |
| 35806.0 | -0.77 |
| 35807.0 | -0.788 |
| 35808.0 | -0.793 |
| 35809.0 | -0.803 |
| 35810.0 | -0.812 |
| 35811.0 | -0.823 |
| 35812.0 | -0.836 |
| 35813.0 | -0.856 |
| 35814.0 | -0.863 |
| 35815.0 | -0.875 |
| 35816.0 | -0.889 |
| 35817.0 | -0.901 |
| 35818.0 | -0.91 |
| 35819.0 | -0.924 |
| 35820.0 | -0.937 |
| 35821.0 | -0.952 |
| 35822.0 | -0.964 |
| 35823.0 | -0.977 |
| 35824.0 | -0.993 |
| 35825.0 | -0.995 |
| 35826.0 | -1.001 |
| 35827.0 | -1.019 |
| 35828.0 | -1.038 |
| 35829.0 | -1.044 |
| 35830.0 | -1.007 |
| 35831.0 | -1.07 |
| 35832.0 | -1.087 |
| 35833.0 | -1.085 |
| 35834.0 | -1.102 |
| 35835.0 | -1.111 |
| 35836.0 | -1.128 |
| 35837.0 | -1.144 |
| 35838.0 | -1.163 |
| 35839.0 | -1.18 |
| 35840.0 | -1.198 |
| 35841.0 | -1.215 |
| 35842.0 | -1.23 |
| 35843.0 | -1.246 |
| 35844.0 | -1.267 |
| 35845.0 | -1.293 |
| 35846.0 | -1.317 |
| 35847.0 | -1.34 |
| 35848.0 | -1.358 |
| 35849.0 | -1.366 |
| 35850.0 | -1.385 |
| 35851.0 | -1.394 |
| 35852.0 | -1.403 |
| 35853.0 | -1.427 |
| 35854.0 | -1.437 |
| 35855.0 | -1.457 |
| 35856.0 | -1.474 |
| 35857.0 | -1.493 |
| 35858.0 | -1.511 |
| 35859.0 | -1.538 |
| 35860.0 | -1.559 |
| 35861.0 | -1.592 |
| 35862.0 | -1.607 |
| 35863.0 | -1.618 |
| 35864.0 | -1.623 |
| 35865.0 | -1.627 |
| 35866.0 | -1.632 |
| 35867.0 | -1.646 |
| 35868.0 | -1.659 |
| 35869.0 | -1.658 |
| 35870.0 | -1.654 |
| 35871.0 | -1.653 |
| 35872.0 | -1.652 |
| 35873.0 | -1.659 |
| 35874.0 | -1.655 |
| 35875.0 | -1.653 |
| 35876.0 | -1.649 |
| 35877.0 | -1.663 |
| 35878.0 | -1.663 |
| 35879.0 | -1.666 |
| 35880.0 | -1.668 |
| 35881.0 | -1.658 |
| 35882.0 | -1.664 |
| 35883.0 | -1.665 |
| 35884.0 | -1.659 |
| 35885.0 | -1.662 |
| 35886.0 | -1.662 |
| 35887.0 | -1.661 |
| 35888.0 | -1.655 |
| 35889.0 | -1.654 |
| 35890.0 | -1.654 |
| 35891.0 | -1.654 |
| 35892.0 | -1.653 |
| 35893.0 | -1.651 |
| 35894.0 | -1.654 |
| 35895.0 | -1.661 |
| 35896.0 | -1.663 |
| 35897.0 | -1.667 |
| 35898.0 | -1.673 |
| 35899.0 | -1.676 |
| 35900.0 | -1.686 |
| 35901.0 | -1.682 |
| 35902.0 | -1.678 |
| 35903.0 | -1.678 |
| 35904.0 | -1.678 |
| 35905.0 | -1.679 |
| 35906.0 | -1.684 |
| 35907.0 | -1.683 |
| 35908.0 | -1.686 |
| 35909.0 | -1.689 |
| 35910.0 | -1.689 |
| 35911.0 | -1.691 |
| 35912.0 | -1.683 |
| 35913.0 | -1.682 |
| 35914.0 | -1.678 |
| 35915.0 | -1.676 |
| 35916.0 | -1.663 |
| 35917.0 | -1.659 |
| 35918.0 | -1.661 |
| 35919.0 | -1.661 |
| 35920.0 | -1.672 |
| 35921.0 | -1.653 |
| 35922.0 | -1.647 |
| 35923.0 | -1.645 |
| 35924.0 | -1.643 |
| 35925.0 | -1.645 |
| 35926.0 | -1.645 |
| 35927.0 | -1.626 |
| 35928.0 | -1.554 |
| 35929.0 | -1.487 |
| 35930.0 | -1.452 |
| 35931.0 | -1.432 |
| 35932.0 | -1.419 |
| 35933.0 | -1.411 |
| 35934.0 | -1.404 |
| 35935.0 | -1.408 |
| 35936.0 | -1.418 |
| 35937.0 | -1.427 |
| 35938.0 | -1.437 |
| 35939.0 | -1.443 |
| 35940.0 | -1.454 |
| 35941.0 | -1.464 |
| 35942.0 | -1.464 |
| 35943.0 | -1.474 |
| 35944.0 | -1.484 |
| 35945.0 | -1.485 |
| 35946.0 | -1.486 |
| 35947.0 | -1.491 |
| 35948.0 | -1.49 |
| 35949.0 | -1.497 |
| 35950.0 | -1.504 |
| 35951.0 | -1.509 |
| 35952.0 | -1.514 |
| 35953.0 | -1.52 |
| 35954.0 | -1.52 |
| 35955.0 | -1.514 |
| 35956.0 | -1.514 |
| 35957.0 | -1.522 |
| 35958.0 | -1.534 |
| 35959.0 | -1.551 |
| 35960.0 | -1.565 |
| 35961.0 | -1.584 |
| 35962.0 | 0 |
| 35963.0 | 0 |
| 35964.0 | 0 |
| 35965.0 | 0 |
| 35966.0 | 0 |
| 35967.0 | 0 |
| 35968.0 | 0 |
| 35969.0 | 0 |
| 35970.0 | 0 |
| 35971.0 | -1.63 |
| 35972.0 | -1.623 |
| 35973.0 | -1.611 |
| 35974.0 | -1.605 |
| 35975.0 | -1.615 |
| 35976.0 | -1.623 |
| 35977.0 | -1.63 |
| 35978.0 | -1.635 |
| 35979.0 | -1.642 |
| 35980.0 | -1.65 |
| 35981.0 | -1.658 |
| 35982.0 | -1.67 |
| 35983.0 | -1.681 |
| 35984.0 | -1.689 |
| 35985.0 | -1.697 |
| 35986.0 | -1.71 |
| 35987.0 | -1.724 |
| 35988.0 | -1.73 |
| 35989.0 | -1.74 |
| 35990.0 | -1.753 |
| 35991.0 | -1.772 |
| 35992.0 | -1.788 |
| 35993.0 | -1.806 |
| 35994.0 | -1.82 |
| 35995.0 | -1.835 |
| 35996.0 | -1.852 |
| 35997.0 | -1.858 |
| 35998.0 | -1.861 |
| 35999.0 | -1.863 |
| 36000.0 | -1.871 |
| 36001.0 | -1.886 |
| 36002.0 | -1.902 |
| 36003.0 | -1.924 |
| 36004.0 | -1.941 |
| 36005.0 | -1.96 |
| 36006.0 | -1.979 |
| 36007.0 | -1.991 |
| 36008.0 | -1.995 |
| 36009.0 | -1.998 |
| 36010.0 | -2.015 |
| 36011.0 | -2.034 |
| 36012.0 | -2.047 |
| 36013.0 | -2.019 |
| 36014.0 | -2.013 |
| 36015.0 | -2.026 |
| 36016.0 | -2.043 |
| 36017.0 | -2.061 |
| 36018.0 | -2.077 |
| 36019.0 | -2.09 |
| 36020.0 | -2.109 |
| 36021.0 | -2.132 |
| 36022.0 | -2.153 |
| 36023.0 | -2.16 |
| 36024.0 | -2.164 |
| 36025.0 | -2.169 |
| 36026.0 | -2.18 |
| 36027.0 | -2.193 |
| 36028.0 | -2.195 |
| 36029.0 | -2.192 |
| 36030.0 | -2.196 |
| 36031.0 | -2.186 |
| 36032.0 | -2.191 |
| 36033.0 | -2.196 |
| 36034.0 | -2.183 |
| 36035.0 | -2.167 |
| 36036.0 | -2.15 |
| 36037.0 | -2.148 |
| 36038.0 | -2.144 |
| 36039.0 | -2.144 |
| 36040.0 | -2.145 |
| 36041.0 | -2.126 |
| 36042.0 | -2.104 |
| 36043.0 | -2.041 |
| 36044.0 | -1.932 |
| 36045.0 | -1.9 |
| 36046.0 | -1.881 |
| 36047.0 | -1.874 |
| 36048.0 | -1.849 |
| 36049.0 | -1.856 |
| 36050.0 | -1.858 |
| 36051.0 | -1.86 |
| 36052.0 | -1.869 |
| 36053.0 | -1.869 |
| 36054.0 | -1.864 |
| 36055.0 | -1.87 |
| 36056.0 | -1.881 |
| 36057.0 | -1.891 |
| 36058.0 | -1.909 |
| 36059.0 | -1.925 |
| 36060.0 | -1.94 |
| 36061.0 | -1.955 |
| 36062.0 | -1.977 |
| 36063.0 | -1.965 |
| 36064.0 | -1.95 |
| 36065.0 | -1.926 |
| 36066.0 | -1.929 |
| 36067.0 | -1.942 |
| 36068.0 | -1.959 |
| 36069.0 | -1.97 |
| 36070.0 | -1.962 |
| 36071.0 | -1.946 |
| 36072.0 | -1.933 |
| 36073.0 | -1.883 |
| 36074.0 | -1.86 |
| 36075.0 | -1.871 |
| 36076.0 | -1.866 |
| 36077.0 | -1.833 |
| 36078.0 | -1.814 |
| 36079.0 | -1.816 |
| 36080.0 | -1.823 |
| 36081.0 | -1.833 |
| 36082.0 | -1.831 |
| 36083.0 | -1.83 |
| 36084.0 | -1.822 |
| 36085.0 | -1.83 |
| 36086.0 | -1.831 |
| 36087.0 | -1.829 |
| 36088.0 | -1.817 |
| 36089.0 | -1.817 |
| 36090.0 | -1.811 |
| 36091.0 | -1.806 |
| 36092.0 | -1.813 |
| 36093.0 | -1.812 |
| 36094.0 | -1.814 |
| 36095.0 | -1.812 |
| 36096.0 | -1.811 |
| 36097.0 | -1.773 |
| 36098.0 | -1.659 |
| 36099.0 | -1.632 |
| 36100.0 | -1.626 |
| 36101.0 | -1.616 |
| 36102.0 | -1.616 |
| 36103.0 | -1.624 |
| 36104.0 | -1.635 |
| 36105.0 | -1.647 |
| 36106.0 | -1.663 |
| 36107.0 | -1.686 |
| 36108.0 | -1.707 |
| 36109.0 | -1.718 |
| 36110.0 | -1.73 |
| 36111.0 | -1.727 |
| 36112.0 | -1.734 |
| 36113.0 | -1.749 |
| 36114.0 | -1.771 |
| 36115.0 | -1.788 |
| 36116.0 | -1.804 |
| 36117.0 | -1.821 |
| 36118.0 | -1.826 |
| 36119.0 | -1.826 |
| 36120.0 | -1.842 |
| 36121.0 | -1.861 |
| 36122.0 | -1.875 |
| 36123.0 | -1.898 |
| 36124.0 | -1.924 |
| 36125.0 | -1.947 |
| 36126.0 | -1.965 |
| 36127.0 | -1.983 |
| 36128.0 | -1.994 |
| 36129.0 | -1.995 |
| 36130.0 | -1.995 |
| 36131.0 | -1.995 |
| 36132.0 | -1.996 |
| 36133.0 | -2.005 |
| 36134.0 | -2.008 |
| 36135.0 | -2.017 |
| 36136.0 | -2.03 |
| 36137.0 | -2 |
| 36138.0 | -1.984 |
| 36139.0 | -1.914 |
| 36140.0 | -1.87 |
| 36141.0 | -1.855 |
| 36142.0 | -1.851 |
| 36143.0 | -1.855 |
| 36144.0 | -1.866 |
| 36145.0 | -1.878 |
| 36146.0 | -1.889 |
| 36147.0 | -1.894 |
| 36148.0 | -1.881 |
| 36149.0 | -1.864 |
| 36150.0 | -1.859 |
| 36151.0 | -1.859 |
| 36152.0 | -1.864 |
| 36153.0 | -1.878 |
| 36154.0 | -1.894 |
| 36155.0 | -1.916 |
| 36156.0 | -1.933 |
| 36157.0 | -1.947 |
| 36158.0 | -1.957 |
| 36159.0 | -1.972 |
| 36160.0 | -1.987 |
| 36161.0 | -1.994 |
| 36162.0 | -1.997 |
| 36163.0 | -2.012 |
| 36164.0 | -2.032 |
| 36165.0 | -2.042 |
| 36166.0 | -2.049 |
| 36167.0 | -2.076 |
| 36168.0 | -2.095 |
| 36169.0 | -2.101 |
| 36170.0 | -2.13 |
| 36171.0 | -2.153 |
| 36172.0 | -2.173 |
| 36173.0 | -2.179 |
| 36174.0 | -2.183 |
| 36175.0 | -2.192 |
| 36176.0 | -2.203 |
| 36177.0 | -2.215 |
| 36178.0 | -2.227 |
| 36179.0 | -2.243 |
| 36180.0 | -2.264 |
| 36181.0 | -2.278 |
| 36182.0 | -2.29 |
| 36183.0 | -2.304 |
| 36184.0 | -2.317 |
| 36185.0 | -2.331 |
| 36186.0 | -2.354 |
| 36187.0 | -2.364 |
| 36188.0 | -2.373 |
| 36189.0 | -2.387 |
| 36190.0 | -2.396 |
| 36191.0 | -2.389 |
| 36192.0 | -2.388 |
| 36193.0 | -2.395 |
| 36194.0 | -2.403 |
| 36195.0 | -2.412 |
| 36196.0 | -2.423 |
| 36197.0 | -2.432 |
| 36198.0 | -2.447 |
| 36199.0 | -2.465 |
| 36200.0 | -2.475 |
| 36201.0 | -2.488 |
| 36202.0 | -2.498 |
| 36203.0 | -2.513 |
| 36204.0 | -2.525 |
| 36205.0 | -2.54 |
| 36206.0 | -2.556 |
| 36207.0 | -2.572 |
| 36208.0 | -2.587 |
| 36209.0 | -2.602 |
| 36210.0 | -2.634 |
| 36211.0 | -2.643 |
| 36212.0 | -2.654 |
| 36213.0 | -2.67 |
| 36214.0 | -2.686 |
| 36215.0 | -2.701 |
| 36216.0 | -2.715 |
| 36217.0 | -2.735 |
| 36218.0 | -2.744 |
| 36219.0 | -2.751 |
| 36220.0 | -2.756 |
| 36221.0 | -2.764 |
| 36222.0 | -2.775 |
| 36223.0 | -2.785 |
| 36224.0 | -2.801 |
| 36225.0 | -2.808 |
| 36226.0 | -2.818 |
| 36227.0 | -2.8 |
| 36228.0 | -2.765 |
| 36229.0 | -2.741 |
| 36230.0 | -2.613 |
| 36231.0 | -2.512 |
| 36232.0 | -2.483 |
| 36233.0 | -2.474 |
| 36234.0 | -2.467 |
| 36235.0 | -2.469 |
| 36236.0 | -2.467 |
| 36237.0 | -2.472 |
| 36238.0 | -2.471 |
| 36239.0 | -2.474 |
| 36240.0 | -2.48 |
| 36241.0 | -2.48 |
| 36242.0 | -2.396 |
| 36243.0 | -2.376 |
| 36244.0 | -2.37 |
| 36245.0 | -2.371 |
| 36246.0 | -2.368 |
| 36247.0 | -2.366 |
| 36248.0 | -2.378 |
| 36249.0 | -2.376 |
| 36250.0 | -2.376 |
| 36251.0 | -2.376 |
| 36252.0 | -2.376 |
| 36253.0 | -2.376 |
| 36254.0 | -2.376 |
| 36255.0 | -2.376 |
| 36256.0 | -2.377 |
| 36257.0 | -2.382 |
| 36258.0 | -2.38 |
| 36259.0 | -2.38 |
| 36260.0 | -2.384 |
| 36261.0 | -2.39 |
| 36262.0 | -2.395 |
| 36263.0 | -2.399 |
| 36264.0 | -2.403 |
| 36265.0 | -2.4 |
| 36266.0 | -2.381 |
| 36267.0 | -2.35 |
| 36268.0 | -2.243 |
| 36269.0 | -2.177 |
| 36270.0 | -2.151 |
| 36271.0 | -2.109 |
| 36272.0 | -2.005 |
| 36273.0 | -1.951 |
| 36274.0 | -1.926 |
| 36275.0 | -1.909 |
| 36276.0 | -1.898 |
| 36277.0 | -1.89 |
| 36278.0 | -1.883 |
| 36279.0 | -1.88 |
| 36280.0 | -1.891 |
| 36281.0 | -1.909 |
| 36282.0 | -1.929 |
| 36283.0 | -1.947 |
| 36284.0 | -1.949 |
| 36285.0 | -1.885 |
| 36286.0 | -1.709 |
| 36287.0 | -1.617 |
| 36288.0 | -1.576 |
| 36289.0 | -1.547 |
| 36290.0 | -1.538 |
| 36291.0 | -1.543 |
| 36292.0 | -1.548 |
| 36293.0 | -1.551 |
| 36294.0 | -1.568 |
| 36295.0 | -1.585 |
| 36296.0 | -1.587 |
| 36297.0 | -1.588 |
| 36298.0 | -1.598 |
| 36299.0 | -1.605 |
| 36300.0 | -1.62 |
| 36301.0 | -1.625 |
| 36302.0 | -1.638 |
| 36303.0 | -1.65 |
| 36304.0 | -1.663 |
| 36305.0 | -1.665 |
| 36306.0 | -1.682 |
| 36307.0 | -1.704 |
| 36308.0 | -1.716 |
| 36309.0 | -1.726 |
| 36310.0 | -1.738 |
| 36311.0 | -1.74 |
| 36312.0 | -1.738 |
| 36313.0 | -1.724 |
| 36314.0 | -1.703 |
| 36315.0 | -1.695 |
| 36316.0 | -1.697 |
| 36317.0 | -1.697 |
| 36318.0 | -1.692 |
| 36319.0 | -1.66 |
| 36320.0 | -1.639 |
| 36321.0 | -1.624 |
| 36322.0 | -1.615 |
| 36323.0 | -1.589 |
| 36324.0 | -1.568 |
| 36325.0 | -1.549 |
| 36326.0 | -1.529 |
| 36327.0 | -1.476 |
| 36328.0 | -1.454 |
| 36329.0 | -1.439 |
| 36330.0 | -1.432 |
| 36331.0 | -1.416 |
| 36332.0 | -1.408 |
| 36333.0 | -1.407 |
| 36334.0 | -1.401 |
| 36335.0 | -1.385 |
| 36336.0 | -1.379 |
| 36337.0 | -1.369 |
| 36338.0 | -1.364 |
| 36339.0 | -1.355 |
| 36340.0 | -1.346 |
| 36341.0 | -1.351 |
| 36342.0 | -1.37 |
| 36343.0 | -1.341 |
| 36344.0 | -1.333 |
| 36345.0 | -1.336 |
| 36346.0 | -1.342 |
| 36347.0 | -1.34 |
| 36348.0 | -1.333 |
| 36349.0 | -1.329 |
| 36350.0 | -1.326 |
| 36351.0 | -1.327 |
| 36352.0 | -1.314 |
| 36353.0 | -1.284 |
| 36354.0 | -1.243 |
| 36355.0 | -1.206 |
| 36356.0 | -1.188 |
| 36357.0 | -1.182 |
| 36358.0 | -1.171 |
| 36359.0 | -1.157 |
| 36360.0 | -1.149 |
| 36361.0 | -1.148 |
| 36362.0 | -1.145 |
| 36363.0 | -1.149 |
| 36364.0 | -1.157 |
| 36365.0 | -1.167 |
| 36366.0 | -1.166 |
| 36367.0 | -1.154 |
| 36368.0 | -1.153 |
| 36369.0 | -1.16 |
| 36370.0 | -1.168 |
| 36371.0 | -1.179 |
| 36372.0 | -1.192 |
| 36373.0 | -1.206 |
| 36374.0 | -1.219 |
| 36375.0 | -1.23 |
| 36376.0 | -1.238 |
| 36377.0 | -1.216 |
| 36378.0 | -1.174 |
| 36379.0 | -1.122 |
| 36380.0 | -1.102 |
| 36381.0 | -1.094 |
| 36382.0 | -1.09 |
| 36383.0 | -1.088 |
| 36384.0 | -1.081 |
| 36385.0 | -1.07 |
| 36386.0 | -1.058 |
| 36387.0 | -1.048 |
| 36388.0 | -1.032 |
| 36389.0 | -1.025 |
| 36390.0 | -1.018 |
| 36391.0 | -1.022 |
| 36392.0 | -1.008 |
| 36393.0 | -0.996 |
| 36394.0 | -0.995 |
| 36395.0 | -0.991 |
| 36396.0 | -0.947 |
| 36397.0 | -0.834 |
| 36398.0 | -0.776 |
| 36399.0 | -0.752 |
| 36400.0 | -0.728 |
| 36401.0 | -0.7 |
| 36402.0 | -0.663 |
| 36403.0 | -0.635 |
| 36404.0 | -0.632 |
| 36405.0 | -0.617 |
| 36406.0 | -0.612 |
| 36407.0 | -0.615 |
| 36408.0 | -0.619 |
| 36409.0 | -0.606 |
| 36410.0 | -0.586 |
| 36411.0 | -0.581 |
| 36412.0 | -0.587 |
| 36413.0 | -0.591 |
| 36414.0 | -0.599 |
| 36415.0 | -0.605 |
| 36416.0 | -0.622 |
| 36417.0 | -0.638 |
| 36418.0 | -0.655 |
| 36419.0 | -0.677 |
| 36420.0 | -0.698 |
| 36421.0 | -0.721 |
| 36422.0 | -0.741 |
| 36423.0 | -0.746 |
| 36424.0 | -0.759 |
| 36425.0 | -0.772 |
| 36426.0 | -0.782 |
| 36427.0 | -0.806 |
| 36428.0 | -0.824 |
| 36429.0 | -0.844 |
| 36430.0 | -0.834 |
| 36431.0 | -0.841 |
| 36432.0 | -0.861 |
| 36433.0 | -0.878 |
| 36434.0 | -0.894 |
| 36435.0 | -0.917 |
| 36436.0 | -0.934 |
| 36437.0 | 0 |
| 36438.0 | 0 |
| 36439.0 | 0 |
| 36440.0 | 0 |
| 36441.0 | 0 |
| 36442.0 | 0 |
| 36443.0 | 0 |
| 36444.0 | 0 |
| 36445.0 | 0 |
| 36446.0 | 0 |
| 36447.0 | 0 |
| 36448.0 | 0 |
| 36449.0 | 0 |
| 36450.0 | 0 |
| 36451.0 | 0 |
| 36452.0 | 0 |
| 36453.0 | 0 |
| 36454.0 | 0 |
| 36455.0 | 0 |
| 36456.0 | -1.238 |
| 36457.0 | -1.247 |
| 36458.0 | -1.261 |
| 36459.0 | -1.28 |
| 36460.0 | -1.306 |
| 36461.0 | -1.328 |
| 36462.0 | -1.351 |
| 36463.0 | -1.371 |
| 36464.0 | -1.39 |
| 36465.0 | -1.419 |
| 36466.0 | -1.427 |
| 36467.0 | -1.439 |
| 36468.0 | -1.456 |
| 36469.0 | -1.476 |
| 36470.0 | -1.495 |
| 36471.0 | -1.511 |
| 36472.0 | -1.528 |
| 36473.0 | -1.546 |
| 36474.0 | -1.562 |
| 36475.0 | -1.575 |
| 36476.0 | -1.589 |
| 36477.0 | -1.597 |
| 36478.0 | -1.606 |
| 36479.0 | -1.617 |
| 36480.0 | -1.627 |
| 36481.0 | -1.596 |
| 36482.0 | -1.458 |
| 36483.0 | -1.381 |
| 36484.0 | -1.357 |
| 36485.0 | -1.343 |
| 36486.0 | -1.338 |
| 36487.0 | -1.332 |
| 36488.0 | -1.327 |
| 36489.0 | -1.318 |
| 36490.0 | -1.311 |
| 36491.0 | -1.31 |
| 36492.0 | -1.295 |
| 36493.0 | -1.285 |
| 36494.0 | -1.277 |
| 36495.0 | -1.271 |
| 36496.0 | -1.268 |
| 36497.0 | -1.264 |
| 36498.0 | -1.252 |
| 36499.0 | -1.259 |
| 36500.0 | -1.26 |
| 36501.0 | -1.26 |
| 36502.0 | -1.262 |
| 36503.0 | -1.265 |
| 36504.0 | -1.271 |
| 36505.0 | -1.282 |
| 36506.0 | -1.28 |
| 36507.0 | -1.277 |
| 36508.0 | -1.251 |
| 36509.0 | -1.214 |
| 36510.0 | -1.203 |
| 36511.0 | -1.198 |
| 36512.0 | -1.205 |
| 36513.0 | -1.222 |
| 36514.0 | -1.218 |
| 36515.0 | -1.225 |
| 36516.0 | -1.226 |
| 36517.0 | -1.226 |
| 36518.0 | -1.234 |
| 36519.0 | -1.23 |
| 36520.0 | -1.232 |
| 36521.0 | -1.235 |
| 36522.0 | -1.242 |
| 36523.0 | -1.249 |
| 36524.0 | -1.255 |
| 36525.0 | -1.265 |
| 36526.0 | -1.274 |
| 36527.0 | -1.274 |
| 36528.0 | -1.229 |
| 36529.0 | -1.119 |
| 36530.0 | -1.068 |
| 36531.0 | -1.058 |
| 36532.0 | -1.056 |
| 36533.0 | -1.046 |
| 36534.0 | -1.038 |
| 36535.0 | -1.04 |
| 36536.0 | -1.045 |
| 36537.0 | -1.051 |
| 36538.0 | -1.059 |
| 36539.0 | -1.068 |
| 36540.0 | -1.078 |
| 36541.0 | -1.088 |
| 36542.0 | -1.097 |
| 36543.0 | -1.11 |
| 36544.0 | -1.12 |
| 36545.0 | -1.132 |
| 36546.0 | -1.144 |
| 36547.0 | -1.158 |
| 36548.0 | -1.167 |
| 36549.0 | -1.159 |
| 36550.0 | -1.141 |
| 36551.0 | -1.134 |
| 36552.0 | -1.138 |
| 36553.0 | -1.146 |
| 36554.0 | -1.154 |
| 36555.0 | -1.122 |
| 36556.0 | -0.873 |
| 36557.0 | -0.506 |
| 36558.0 | -0.391 |
| 36559.0 | -0.334 |
| 36560.0 | -0.297 |
| 36561.0 | -0.269 |
| 36562.0 | -0.251 |
| 36563.0 | -0.234 |
| 36564.0 | -0.23 |
| 36565.0 | -0.236 |
| 36566.0 | -0.232 |
| 36567.0 | -0.23 |
| 36568.0 | -0.235 |
| 36569.0 | -0.245 |
| 36570.0 | -0.24 |
| 36571.0 | -0.235 |
| 36572.0 | -0.239 |
| 36573.0 | -0.242 |
| 36574.0 | -0.242 |
| 36575.0 | -0.245 |
| 36576.0 | -0.251 |
| 36577.0 | -0.266 |
| 36578.0 | -0.278 |
| 36579.0 | -0.287 |
| 36580.0 | -0.296 |
| 36581.0 | -0.306 |
| 36582.0 | -0.319 |
| 36583.0 | -0.332 |
| 36584.0 | -0.345 |
| 36585.0 | -0.356 |
| 36586.0 | -0.368 |
| 36587.0 | -0.38 |
| 36588.0 | -0.393 |
| 36589.0 | -0.403 |
| 36590.0 | -0.416 |
| 36591.0 | -0.426 |
| 36592.0 | -0.438 |
| 36593.0 | -0.45 |
| 36594.0 | -0.465 |
| 36595.0 | -0.479 |
| 36596.0 | -0.49 |
| 36597.0 | -0.501 |
| 36598.0 | -0.501 |
| 36599.0 | -0.479 |
| 36600.0 | -0.485 |
| 36601.0 | -0.491 |
| 36602.0 | -0.497 |
| 36603.0 | -0.509 |
| 36604.0 | -0.532 |
| 36605.0 | -0.534 |
| 36606.0 | -0.545 |
| 36607.0 | -0.547 |
| 36608.0 | -0.551 |
| 36609.0 | -0.559 |
| 36610.0 | -0.567 |
| 36611.0 | -0.578 |
| 36612.0 | -0.587 |
| 36613.0 | -0.596 |
| 36614.0 | -0.609 |
| 36615.0 | -0.621 |
| 36616.0 | -0.631 |
| 36617.0 | -0.639 |
| 36618.0 | -0.65 |
| 36619.0 | -0.661 |
| 36620.0 | -0.677 |
| 36621.0 | -0.687 |
| 36622.0 | -0.697 |
| 36623.0 | -0.699 |
| 36624.0 | -0.7 |
| 36625.0 | -0.701 |
| 36626.0 | -0.709 |
| 36627.0 | -0.717 |
| 36628.0 | -0.735 |
| 36629.0 | -0.741 |
| 36630.0 | -0.753 |
| 36631.0 | -0.769 |
| 36632.0 | -0.787 |
| 36633.0 | -0.803 |
| 36634.0 | 0 |
| 36635.0 | 0 |
| 36636.0 | 0 |
| 36637.0 | 0 |
| 36638.0 | 0 |
| 36639.0 | -0.85 |
| 36640.0 | -0.858 |
| 36641.0 | -0.869 |
| 36642.0 | -0.89 |
| 36643.0 | -0.899 |
| 36644.0 | -0.912 |
| 36645.0 | -0.927 |
| 36646.0 | -0.939 |
| 36647.0 | -0.958 |
| 36648.0 | -0.973 |
| 36649.0 | -0.966 |
| 36650.0 | -0.863 |
| 36651.0 | -0.956 |
| 36652.0 | -0.982 |
| 36653.0 | -0.994 |
| 36654.0 | -0.992 |
| 36655.0 | -0.998 |
| 36656.0 | -1.011 |
| 36657.0 | -1.024 |
| 36658.0 | -1.037 |
| 36659.0 | -1.051 |
| 36660.0 | -1.062 |
| 36661.0 | -1.074 |
| 36662.0 | -1.077 |
| 36663.0 | -1.08 |
| 36664.0 | -1.088 |
| 36665.0 | -1.097 |
| 36666.0 | -1.103 |
| 36667.0 | -1.102 |
| 36668.0 | -1.1 |
| 36669.0 | -1.108 |
| 36670.0 | -1.128 |
| 36671.0 | -1.141 |
| 36672.0 | -1.152 |
| 36673.0 | -1.166 |
| 36674.0 | -1.18 |
| 36675.0 | -1.191 |
| 36676.0 | -1.206 |
| 36677.0 | -1.223 |
| 36678.0 | -1.234 |
| 36679.0 | -1.241 |
| 36680.0 | -1.237 |
| 36681.0 | -1.218 |
| 36682.0 | -1.122 |
| 36683.0 | -1.029 |
| 36684.0 | -1.005 |
| 36685.0 | -1.002 |
| 36686.0 | -1.006 |
| 36687.0 | -1.019 |
| 36688.0 | -1.021 |
| 36689.0 | -1.013 |
| 36690.0 | -1.01 |
| 36691.0 | -1.011 |
| 36692.0 | -0.984 |
| 36693.0 | -0.927 |
| 36694.0 | -0.887 |
| 36695.0 | -0.806 |
| 36696.0 | -0.691 |
| 36697.0 | -0.644 |
| 36698.0 | -0.624 |
| 36699.0 | -0.614 |
| 36700.0 | -0.603 |
| 36701.0 | -0.57 |
| 36702.0 | -0.528 |
| 36703.0 | -0.461 |
| 36704.0 | -0.413 |
| 36705.0 | -0.396 |
| 36706.0 | -0.386 |
| 36707.0 | -0.378 |
| 36708.0 | -0.367 |
| 36709.0 | -0.365 |
| 36710.0 | -0.366 |
| 36711.0 | -0.369 |
| 36712.0 | -0.376 |
| 36713.0 | -0.39 |
| 36714.0 | -0.407 |
| 36715.0 | -0.424 |
| 36716.0 | -0.442 |
| 36717.0 | -0.46 |
| 36718.0 | -0.48 |
| 36719.0 | -0.502 |
| 36720.0 | -0.526 |
| 36721.0 | -0.546 |
| 36722.0 | -0.567 |
| 36723.0 | -0.586 |
| 36724.0 | -0.604 |
| 36725.0 | -0.624 |
| 36726.0 | -0.645 |
| 36727.0 | -0.666 |
| 36728.0 | -0.684 |
| 36729.0 | -0.695 |
| 36730.0 | -0.707 |
| 36731.0 | -0.724 |
| 36732.0 | -0.736 |
| 36733.0 | -0.751 |
| 36734.0 | -0.77 |
| 36735.0 | -0.786 |
| 36736.0 | -0.796 |
| 36737.0 | -0.809 |
| 36738.0 | -0.821 |
| 36739.0 | -0.83 |
| 36740.0 | -0.844 |
| 36741.0 | -0.862 |
| 36742.0 | -0.881 |
| 36743.0 | -0.898 |
| 36744.0 | -0.903 |
| 36745.0 | -0.906 |
| 36746.0 | -0.917 |
| 36747.0 | -0.937 |
| 36748.0 | -0.959 |
| 36749.0 | -0.972 |
| 36750.0 | -0.985 |
| 36751.0 | -0.988 |
| 36752.0 | -0.978 |
| 36753.0 | -0.987 |
| 36754.0 | -1.004 |
| 36755.0 | -1.022 |
| 36756.0 | -1.034 |
| 36757.0 | -1.033 |
| 36758.0 | -1.038 |
| 36759.0 | -1.048 |
| 36760.0 | -1.054 |
| 36761.0 | -1.068 |
| 36762.0 | -1.082 |
| 36763.0 | -1.098 |
| 36764.0 | -1.111 |
| 36765.0 | -1.119 |
| 36766.0 | -1.121 |
| 36767.0 | -1.126 |
| 36768.0 | -1.133 |
| 36769.0 | -1.146 |
| 36770.0 | -1.158 |
| 36771.0 | -1.172 |
| 36772.0 | -1.189 |
| 36773.0 | -1.209 |
| 36774.0 | -1.228 |
| 36775.0 | -1.25 |
| 36776.0 | -1.269 |
| 36777.0 | -1.29 |
| 36778.0 | -1.279 |
| 36779.0 | -1.2 |
| 36780.0 | -1.121 |
| 36781.0 | -1.096 |
| 36782.0 | -1.093 |
| 36783.0 | -1.096 |
| 36784.0 | -1.097 |
| 36785.0 | -1.1 |
| 36786.0 | -1.101 |
| 36787.0 | -1.104 |
| 36788.0 | -1.114 |
| 36789.0 | -1.119 |
| 36790.0 | -1.111 |
| 36791.0 | -1.116 |
| 36792.0 | -1.126 |
| 36793.0 | -1.135 |
| 36794.0 | -1.141 |
| 36795.0 | -1.148 |
| 36796.0 | -1.148 |
| 36797.0 | -1.146 |
| 36798.0 | -1.154 |
| 36799.0 | -1.166 |
| 36800.0 | -1.174 |
| 36801.0 | -1.176 |
| 36802.0 | -1.113 |
| 36803.0 | -1.092 |
| 36804.0 | -1.061 |
| 36805.0 | -1.037 |
| 36806.0 | -0.956 |
| 36807.0 | -0.911 |
| 36808.0 | -0.881 |
| 36809.0 | -0.861 |
| 36810.0 | -0.84 |
| 36811.0 | -0.761 |
| 36812.0 | -0.59 |
| 36813.0 | -0.52 |
| 36814.0 | -0.48 |
| 36815.0 | -0.444 |
| 36816.0 | -0.418 |
| 36817.0 | -0.397 |
| 36818.0 | -0.38 |
| 36819.0 | -0.368 |
| 36820.0 | -0.364 |
| 36821.0 | -0.362 |
| 36822.0 | -0.363 |
| 36823.0 | -0.361 |
| 36824.0 | -0.353 |
| 36825.0 | -0.353 |
| 36826.0 | -0.36 |
| 36827.0 | -0.376 |
| 36828.0 | -0.387 |
| 36829.0 | -0.403 |
| 36830.0 | -0.411 |
| 36831.0 | -0.414 |
| 36832.0 | -0.419 |
| 36833.0 | -0.429 |
| 36834.0 | -0.443 |
| 36835.0 | -0.457 |
| 36836.0 | -0.473 |
| 36837.0 | -0.482 |
| 36838.0 | -0.488 |
| 36839.0 | -0.493 |
| 36840.0 | -0.507 |
| 36841.0 | -0.523 |
| 36842.0 | -0.541 |
| 36843.0 | -0.558 |
| 36844.0 | -0.575 |
| 36845.0 | -0.585 |
| 36846.0 | -0.575 |
| 36847.0 | -0.577 |
| 36848.0 | -0.564 |
| 36849.0 | -0.529 |
| 36850.0 | -0.495 |
| 36851.0 | -0.431 |
| 36852.0 | -0.38 |
| 36853.0 | -0.351 |
| 36854.0 | -0.335 |
| 36855.0 | -0.327 |
| 36856.0 | -0.324 |
| 36857.0 | -0.323 |
| 36858.0 | -0.292 |
| 36859.0 | -0.205 |
| 36860.0 | -0.172 |
| 36861.0 | -0.164 |
| 36862.0 | -0.148 |
| 36863.0 | -0.067 |
| 36864.0 | -0.006 |
| 36865.0 | 0.009 |
| 36866.0 | 0.013 |
| 36867.0 | 0.008 |
| 36868.0 | 0 |
| 36869.0 | -0.007 |
| 36870.0 | -0.017 |
| 36871.0 | -0.028 |
| 36872.0 | -0.028 |
| 36873.0 | -0.036 |
| 36874.0 | -0.055 |
| 36875.0 | -0.067 |
| 36876.0 | -0.082 |
| 36877.0 | -0.101 |
| 36878.0 | -0.118 |
| 36879.0 | -0.138 |
| 36880.0 | 0 |
| 36881.0 | 0 |
| 36882.0 | 0 |
| 36883.0 | 0 |
| 36884.0 | -0.259 |
| 36885.0 | -0.282 |
| 36886.0 | -0.313 |
| 36887.0 | -0.336 |
| 36888.0 | -0.354 |
| 36889.0 | -0.376 |
| 36890.0 | -0.39 |
| 36891.0 | -0.4 |
| 36892.0 | -0.389 |
| 36893.0 | -0.351 |
| 36894.0 | -0.317 |
| 36895.0 | -0.32 |
| 36896.0 | -0.338 |
| 36897.0 | -0.355 |
| 36898.0 | -0.372 |
| 36899.0 | -0.382 |
| 36900.0 | -0.394 |
| 36901.0 | -0.388 |
| 36902.0 | -0.388 |
| 36903.0 | -0.399 |
| 36904.0 | -0.418 |
| 36905.0 | -0.426 |
| 36906.0 | -0.433 |
| 36907.0 | -0.455 |
| 36908.0 | -0.451 |
| 36909.0 | -0.456 |
| 36910.0 | -0.464 |
| 36911.0 | -0.481 |
| 36912.0 | -0.477 |
| 36913.0 | -0.49 |
| 36914.0 | -0.504 |
| 36915.0 | -0.515 |
| 36916.0 | -0.528 |
| 36917.0 | -0.533 |
| 36918.0 | -0.51 |
| 36919.0 | -0.468 |
| 36920.0 | -0.457 |
| 36921.0 | -0.46 |
| 36922.0 | -0.465 |
| 36923.0 | -0.464 |
| 36924.0 | -0.467 |
| 36925.0 | -0.471 |
| 36926.0 | -0.482 |
| 36927.0 | -0.492 |
| 36928.0 | -0.509 |
| 36929.0 | -0.503 |
| 36930.0 | -0.513 |
| 36931.0 | -0.52 |
| 36932.0 | -0.518 |
| 36933.0 | -0.499 |
| 36934.0 | -0.491 |
| 36935.0 | -0.495 |
| 36936.0 | -0.506 |
| 36937.0 | -0.511 |
| 36938.0 | -0.489 |
| 36939.0 | -0.473 |
| 36940.0 | -0.478 |
| 36941.0 | -0.49 |
| 36942.0 | -0.508 |
| 36943.0 | -0.526 |
| 36944.0 | -0.547 |
| 36945.0 | -0.568 |
| 36946.0 | -0.59 |
| 36947.0 | -0.604 |
| 36948.0 | -0.615 |
| 36949.0 | -0.634 |
| 36950.0 | -0.654 |
| 36951.0 | -0.678 |
| 36952.0 | -0.703 |
| 36953.0 | -0.725 |
| 36954.0 | -0.75 |
| 36955.0 | -0.774 |
| 36956.0 | -0.8 |
| 36957.0 | -0.825 |
| 36958.0 | -0.853 |
| 36959.0 | -0.88 |
| 36960.0 | -0.905 |
| 36961.0 | -0.932 |
| 36962.0 | -0.956 |
| 36963.0 | 0 |
| 36964.0 | 0 |
| 36965.0 | 0 |
| 36966.0 | -1.017 |
| 36967.0 | -1.043 |
| 36968.0 | -1.069 |
| 36969.0 | -1.097 |
| 36970.0 | -1.124 |
| 36971.0 | -1.151 |
| 36972.0 | -1.178 |
| 36973.0 | -1.205 |
| 36974.0 | -1.234 |
| 36975.0 | -1.259 |
| 36976.0 | -1.285 |
| 36977.0 | -1.316 |
| 36978.0 | -1.349 |
| 36979.0 | -1.379 |
| 36980.0 | -1.41 |
| 36981.0 | -1.438 |
| 36982.0 | -1.465 |
| 36983.0 | -1.495 |
| 36984.0 | -1.525 |
| 36985.0 | -1.535 |
| 36986.0 | -1.532 |
| 36987.0 | -1.524 |
| 36988.0 | -1.54 |
| 36989.0 | -1.555 |
| 36990.0 | -1.579 |
| 36991.0 | -1.606 |
| 36992.0 | -1.628 |
| 36993.0 | -1.657 |
| 36994.0 | -1.683 |
| 36995.0 | -1.711 |
| 36996.0 | -1.736 |
| 36997.0 | -1.765 |
| 36998.0 | -1.791 |
| 36999.0 | -1.819 |
| 37000.0 | -1.846 |
| 37001.0 | -1.872 |
| 37002.0 | -1.89 |
| 37003.0 | -1.913 |
| 37004.0 | -1.939 |
| 37005.0 | -1.961 |
| 37006.0 | -1.976 |
| 37007.0 | -1.988 |
| 37008.0 | -1.978 |
| 37009.0 | -1.988 |
| 37010.0 | -2.006 |
| 37011.0 | -2.023 |
| 37012.0 | -2.041 |
| 37013.0 | -2.06 |
| 37014.0 | -2.074 |
| 37015.0 | -2.092 |
| 37016.0 | -2.111 |
| 37017.0 | -2.129 |
| 37018.0 | -2.146 |
| 37019.0 | -2.164 |
| 37020.0 | -2.18 |
| 37021.0 | -2.198 |
| 37022.0 | -2.21 |
| 37023.0 | -2.234 |
| 37024.0 | -2.253 |
| 37025.0 | -2.271 |
| 37026.0 | -2.288 |
| 37027.0 | -2.292 |
| 37028.0 | -2.301 |
| 37029.0 | -2.315 |
| 37030.0 | -2.308 |
| 37031.0 | -2.291 |
| 37032.0 | -2.281 |
| 37033.0 | -2.282 |
| 37034.0 | -2.289 |
| 37035.0 | -2.285 |
| 37036.0 | -2.278 |
| 37037.0 | -2.275 |
| 37038.0 | -2.272 |
| 37039.0 | -2.275 |
| 37040.0 | -2.277 |
| 37041.0 | -2.285 |
| 37042.0 | -2.297 |
| 37043.0 | -2.311 |
| 37044.0 | -2.294 |
| 37045.0 | -2.128 |
| 37046.0 | -2.048 |
| 37047.0 | -2.024 |
| 37048.0 | -2.015 |
| 37049.0 | -2.015 |
| 37050.0 | -2.004 |
| 37051.0 | -1.993 |
| 37052.0 | -1.953 |
| 37053.0 | -1.923 |
| 37054.0 | -1.923 |
| 37055.0 | -1.93 |
| 37056.0 | -1.923 |
| 37057.0 | -1.852 |
| 37058.0 | -1.751 |
| 37059.0 | -1.683 |
| 37060.0 | -1.554 |
| 37061.0 | -1.48 |
| 37062.0 | -1.456 |
| 37063.0 | -1.45 |
| 37064.0 | -1.458 |
| 37065.0 | -1.464 |
| 37066.0 | -1.474 |
| 37067.0 | -1.476 |
| 37068.0 | -1.485 |
| 37069.0 | -1.502 |
| 37070.0 | -1.51 |
| 37071.0 | -1.527 |
| 37072.0 | -1.538 |
| 37073.0 | -1.552 |
| 37074.0 | -1.576 |
| 37075.0 | -1.603 |
| 37076.0 | -1.631 |
| 37077.0 | -1.658 |
| 37078.0 | -1.689 |
| 37079.0 | -1.722 |
| 37080.0 | -1.758 |
| 37081.0 | -1.793 |
| 37082.0 | -1.824 |
| 37083.0 | -1.856 |
| 37084.0 | -1.876 |
| 37085.0 | -1.842 |
| 37086.0 | -1.828 |
| 37087.0 | -1.834 |
| 37088.0 | -1.855 |
| 37089.0 | -1.887 |
| 37090.0 | -1.912 |
| 37091.0 | -1.939 |
| 37092.0 | -1.928 |
| 37093.0 | -1.783 |
| 37094.0 | -1.74 |
| 37095.0 | -1.738 |
| 37096.0 | -1.761 |
| 37097.0 | -1.772 |
| 37098.0 | -1.786 |
| 37099.0 | -1.807 |
| 37100.0 | -1.828 |
| 37101.0 | -1.842 |
| 37102.0 | -1.853 |
| 37103.0 | -1.873 |
| 37104.0 | -1.897 |
| 37105.0 | -1.918 |
| 37106.0 | -1.916 |
| 37107.0 | -1.873 |
| 37108.0 | -1.855 |
| 37109.0 | -1.855 |
| 37110.0 | -1.867 |
| 37111.0 | -1.881 |
| 37112.0 | -1.897 |
| 37113.0 | -1.91 |
| 37114.0 | -1.929 |
| 37115.0 | -1.942 |
| 37116.0 | -1.955 |
| 37117.0 | -1.955 |
| 37118.0 | -1.959 |
| 37119.0 | -1.975 |
| 37120.0 | -1.982 |
| 37121.0 | -1.977 |
| 37122.0 | -1.988 |
| 37123.0 | -1.993 |
| 37124.0 | -1.978 |
| 37125.0 | -1.983 |
| 37126.0 | -1.98 |
| 37127.0 | -1.985 |
| 37128.0 | -1.947 |
| 37129.0 | -1.702 |
| 37130.0 | -1.454 |
| 37131.0 | -1.384 |
| 37132.0 | -1.36 |
| 37133.0 | -1.354 |
| 37134.0 | -1.352 |
| 37135.0 | -1.352 |
| 37136.0 | -1.354 |
| 37137.0 | -1.362 |
| 37138.0 | -1.372 |
| 37139.0 | -1.386 |
| 37140.0 | -1.395 |
| 37141.0 | -1.403 |
| 37142.0 | -1.411 |
| 37143.0 | -1.42 |
| 37144.0 | -1.436 |
| 37145.0 | -1.456 |
| 37146.0 | -1.474 |
| 37147.0 | -1.498 |
| 37148.0 | -1.524 |
| 37149.0 | -1.551 |
| 37150.0 | -1.575 |
| 37151.0 | -1.599 |
| 37152.0 | -1.6 |
| 37153.0 | -1.615 |
| 37154.0 | -1.635 |
| 37155.0 | -1.655 |
| 37156.0 | -1.661 |
| 37157.0 | -1.658 |
| 37158.0 | -1.664 |
| 37159.0 | -1.654 |
| 37160.0 | -1.668 |
| 37161.0 | -1.688 |
| 37162.0 | -1.704 |
| 37163.0 | -1.727 |
| 37164.0 | -1.761 |
| 37165.0 | -1.775 |
| 37166.0 | -1.812 |
| 37167.0 | -1.829 |
| 37168.0 | -1.853 |
| 37169.0 | -1.877 |
| 37170.0 | -1.9 |
| 37171.0 | -1.92 |
| 37172.0 | -1.94 |
| 37173.0 | -1.96 |
| 37174.0 | -1.968 |
| 37175.0 | -1.977 |
| 37176.0 | -2.002 |
| 37177.0 | -2.034 |
| 37178.0 | -2.063 |
| 37179.0 | -2.086 |
| 37180.0 | -2.109 |
| 37181.0 | -2.124 |
| 37182.0 | -2.144 |
| 37183.0 | -2.17 |
| 37184.0 | -2.185 |
| 37185.0 | -2.2 |
| 37186.0 | -2.221 |
| 37187.0 | -2.248 |
| 37188.0 | -2.263 |
| 37189.0 | -2.275 |
| 37190.0 | -2.293 |
| 37191.0 | -2.313 |
| 37192.0 | -2.333 |
| 37193.0 | -2.348 |
| 37194.0 | -2.352 |
| 37195.0 | -2.368 |
| 37196.0 | -2.383 |
| 37197.0 | -2.362 |
| 37198.0 | -2.324 |
| 37199.0 | -2.286 |
| 37200.0 | -2.262 |
| 37201.0 | -2.256 |
| 37202.0 | -2.257 |
| 37203.0 | -2.261 |
| 37204.0 | -2.27 |
| 37205.0 | -2.28 |
| 37206.0 | -2.296 |
| 37207.0 | -2.307 |
| 37208.0 | -2.321 |
| 37209.0 | -2.316 |
| 37210.0 | -2.251 |
| 37211.0 | -2.208 |
| 37212.0 | -2.195 |
| 37213.0 | -2.168 |
| 37214.0 | -2.149 |
| 37215.0 | -2.126 |
| 37216.0 | -2.12 |
| 37217.0 | -2.122 |
| 37218.0 | -2.127 |
| 37219.0 | -2.135 |
| 37220.0 | -2.142 |
| 37221.0 | -2.156 |
| 37222.0 | -2.169 |
| 37223.0 | -2.182 |
| 37224.0 | -2.192 |
| 37225.0 | -2.202 |
| 37226.0 | -2.215 |
| 37227.0 | -2.229 |
| 37228.0 | -2.243 |
| 37229.0 | -2.244 |
| 37230.0 | -2.252 |
| 37231.0 | -2.251 |
| 37232.0 | -2.235 |
| 37233.0 | -2.186 |
| 37234.0 | -2.124 |
| 37235.0 | -2.101 |
| 37236.0 | -2.079 |
| 37237.0 | -2.061 |
| 37238.0 | -2.052 |
| 37239.0 | -2.049 |
| 37240.0 | -2.053 |
| 37241.0 | -2.056 |
| 37242.0 | -2.061 |
| 37243.0 | -2.064 |
| 37244.0 | -2.07 |
| 37245.0 | -2.08 |
| 37246.0 | -2.093 |
| 37247.0 | -2.107 |
| 37248.0 | -2.119 |
| 37249.0 | -2.131 |
| 37250.0 | -2.132 |
| 37251.0 | -2.118 |
| 37252.0 | -2.109 |
| 37253.0 | -2.11 |
| 37254.0 | -2.114 |
| 37255.0 | -2.103 |
| 37256.0 | -2.098 |
| 37257.0 | -2.086 |
| 37258.0 | -2.077 |
| 37259.0 | -2.081 |
| 37260.0 | -2.07 |
| 37261.0 | -2.054 |
| 37262.0 | -2.037 |
| 37263.0 | -2.034 |
| 37264.0 | -2.031 |
| 37265.0 | -2.029 |
| 37266.0 | -2.018 |
| 37267.0 | -2.028 |
| 37268.0 | -2.027 |
| 37269.0 | -2.034 |
| 37270.0 | -2.043 |
| 37271.0 | -2.048 |
| 37272.0 | -2.05 |
| 37273.0 | -2.033 |
| 37274.0 | -2.024 |
| 37275.0 | -2.027 |
| 37276.0 | -2.028 |
| 37277.0 | -2.02 |
| 37278.0 | -2.025 |
| 37279.0 | -2.027 |
| 37280.0 | -2.032 |
| 37281.0 | -2.045 |
| 37282.0 | -2.053 |
| 37283.0 | -2.064 |
| 37284.0 | -2.074 |
| 37285.0 | -2.086 |
| 37286.0 | -2.099 |
| 37287.0 | -2.113 |
| 37288.0 | -2.13 |
| 37289.0 | -2.141 |
| 37290.0 | -2.159 |
| 37291.0 | -2.172 |
| 37292.0 | -2.185 |
| 37293.0 | -2.182 |
| 37294.0 | -2.162 |
| 37295.0 | -2.149 |
| 37296.0 | -2.153 |
| 37297.0 | -2.163 |
| 37298.0 | -2.174 |
| 37299.0 | -2.182 |
| 37300.0 | -2.192 |
| 37301.0 | -2.207 |
| 37302.0 | -2.22 |
| 37303.0 | -2.235 |
| 37304.0 | -2.25 |
| 37305.0 | -2.263 |
| 37306.0 | -2.278 |
| 37307.0 | -2.292 |
| 37308.0 | -2.304 |
| 37309.0 | -2.32 |
| 37310.0 | -2.33 |
| 37311.0 | -2.342 |
| 37312.0 | -2.355 |
| 37313.0 | -2.368 |
| 37314.0 | -2.383 |
| 37315.0 | -2.396 |
| 37316.0 | -2.396 |
| 37317.0 | -2.404 |
| 37318.0 | -2.415 |
| 37319.0 | -2.427 |
| 37320.0 | -2.424 |
| 37321.0 | -2.426 |
| 37322.0 | -2.432 |
| 37323.0 | -2.44 |
| 37324.0 | -2.449 |
| 37325.0 | -2.457 |
| 37326.0 | -2.463 |
| 37327.0 | -2.473 |
| 37328.0 | -2.485 |
| 37329.0 | -2.496 |
| 37330.0 | -2.505 |
| 37331.0 | -2.519 |
| 37332.0 | -2.536 |
| 37333.0 | -2.556 |
| 37334.0 | -2.583 |
| 37335.0 | -2.579 |
| 37336.0 | -2.59 |
| 37337.0 | -2.607 |
| 37338.0 | -2.624 |
| 37339.0 | -2.638 |
| 37340.0 | -2.652 |
| 37341.0 | -2.664 |
| 37342.0 | -2.679 |
| 37343.0 | -2.697 |
| 37344.0 | -2.717 |
| 37345.0 | -2.732 |
| 37346.0 | -2.746 |
| 37347.0 | -2.753 |
| 37348.0 | -2.745 |
| 37349.0 | -2.74 |
| 37350.0 | -2.734 |
| 37351.0 | -2.729 |
| 37352.0 | -2.729 |
| 37353.0 | -2.73 |
| 37354.0 | -2.723 |
| 37355.0 | -2.694 |
| 37356.0 | -2.674 |
| 37357.0 | -2.672 |
| 37358.0 | -2.676 |
| 37359.0 | -2.682 |
| 37360.0 | -2.69 |
| 37361.0 | -2.699 |
| 37362.0 | -2.708 |
| 37363.0 | -2.717 |
| 37364.0 | -2.727 |
| 37365.0 | -2.734 |
| 37366.0 | -2.742 |
| 37367.0 | -2.751 |
| 37368.0 | -2.761 |
| 37369.0 | -2.77 |
| 37370.0 | -2.782 |
| 37371.0 | -2.791 |
| 37372.0 | -2.799 |
| 37373.0 | -2.807 |
| 37374.0 | -2.797 |
| 37375.0 | -2.76 |
| 37376.0 | -2.71 |
| 37377.0 | -2.679 |
| 37378.0 | -2.643 |
| 37379.0 | -2.552 |
| 37380.0 | -2.492 |
| 37381.0 | -2.45 |
| 37382.0 | -2.424 |
| 37383.0 | -2.407 |
| 37384.0 | -2.395 |
| 37385.0 | -2.39 |
| 37386.0 | -2.39 |
| 37387.0 | -2.392 |
| 37388.0 | -2.395 |
| 37389.0 | -2.396 |
| 37390.0 | -2.401 |
| 37391.0 | -2.407 |
| 37392.0 | -2.414 |
| 37393.0 | -2.419 |
| 37394.0 | -2.428 |
| 37395.0 | -2.438 |
| 37396.0 | -2.448 |
| 37397.0 | -2.457 |
| 37398.0 | -2.466 |
| 37399.0 | -2.471 |
| 37400.0 | -2.448 |
| 37401.0 | -2.415 |
| 37402.0 | -2.383 |
| 37403.0 | -2.364 |
| 37404.0 | -2.357 |
| 37405.0 | -2.327 |
| 37406.0 | -2.312 |
| 37407.0 | -2.3 |
| 37408.0 | -2.288 |
| 37409.0 | -2.261 |
| 37410.0 | -2.128 |
| 37411.0 | -1.832 |
| 37412.0 | -1.525 |
| 37413.0 | -1.246 |
| 37414.0 | -1.116 |
| 37415.0 | -1.046 |
| 37416.0 | -0.943 |
| 37417.0 | -0.803 |
| 37418.0 | -0.716 |
| 37419.0 | -0.635 |
| 37420.0 | -0.574 |
| 37421.0 | -0.513 |
| 37422.0 | -0.447 |
| 37423.0 | -0.409 |
| 37424.0 | -0.392 |
| 37425.0 | -0.383 |
| 37426.0 | -0.384 |
| 37427.0 | -0.381 |
| 37428.0 | -0.389 |
| 37429.0 | -0.396 |
| 37430.0 | -0.397 |
| 37431.0 | -0.396 |
| 37432.0 | -0.402 |
| 37433.0 | -0.406 |
| 37434.0 | -0.397 |
| 37435.0 | -0.379 |
| 37436.0 | -0.372 |
| 37437.0 | -0.357 |
| 37438.0 | -0.296 |
| 37439.0 | -0.228 |
| 37440.0 | -0.207 |
| 37441.0 | -0.2 |
| 37442.0 | -0.197 |
| 37443.0 | -0.198 |
| 37444.0 | -0.202 |
| 37445.0 | -0.208 |
| 37446.0 | -0.217 |
| 37447.0 | -0.224 |
| 37448.0 | -0.229 |
| 37449.0 | -0.237 |
| 37450.0 | -0.25 |
| 37451.0 | -0.267 |
| 37452.0 | -0.282 |
| 37453.0 | -0.298 |
| 37454.0 | -0.318 |
| 37455.0 | -0.341 |
| 37456.0 | -0.364 |
| 37457.0 | -0.384 |
| 37458.0 | -0.396 |
| 37459.0 | -0.393 |
| 37460.0 | -0.398 |
| 37461.0 | -0.412 |
| 37462.0 | -0.429 |
| 37463.0 | -0.446 |
| 37464.0 | -0.466 |
| 37465.0 | -0.49 |
| 37466.0 | -0.513 |
| 37467.0 | -0.539 |
| 37468.0 | -0.563 |
| 37469.0 | -0.588 |
| 37470.0 | -0.613 |
| 37471.0 | -0.638 |
| 37472.0 | -0.657 |
| 37473.0 | -0.648 |
| 37474.0 | -0.649 |
| 37475.0 | -0.664 |
| 37476.0 | -0.685 |
| 37477.0 | -0.702 |
| 37478.0 | -0.716 |
| 37479.0 | -0.733 |
| 37480.0 | -0.727 |
| 37481.0 | -0.64 |
| 37482.0 | -0.578 |
| 37483.0 | -0.544 |
| 37484.0 | -0.522 |
| 37485.0 | -0.496 |
| 37486.0 | -0.437 |
| 37487.0 | -0.408 |
| 37488.0 | -0.397 |
| 37489.0 | -0.375 |
| 37490.0 | -0.358 |
| 37491.0 | -0.342 |
| 37492.0 | -0.324 |
| 37493.0 | -0.276 |
| 37494.0 | -0.211 |
| 37495.0 | -0.169 |
| 37496.0 | -0.091 |
| 37497.0 | -0.027 |
| 37498.0 | 0.02 |
| 37499.0 | 0.037 |
| 37500.0 | 0.075 |
| 37501.0 | 0.107 |
| 37502.0 | 0.13 |
| 37503.0 | 0.158 |
| 37504.0 | 0.167 |
| 37505.0 | 0.168 |
| 37506.0 | 0.153 |
| 37507.0 | 0.136 |
| 37508.0 | 0.122 |
| 37509.0 | 0.106 |
| 37510.0 | 0.092 |
| 37511.0 | 0.077 |
| 37512.0 | 0.056 |
| 37513.0 | 0.061 |
| 37514.0 | 0.063 |
| 37515.0 | 0.052 |
| 37516.0 | 0.046 |
| 37517.0 | 0.034 |
| 37518.0 | 0.034 |
| 37519.0 | 0.053 |
| 37520.0 | 0.063 |
| 37521.0 | 0.072 |
| 37522.0 | 0.088 |
| 37523.0 | 0.086 |
| 37524.0 | 0.081 |
| 37525.0 | 0.079 |
| 37526.0 | 0.073 |
| 37527.0 | 0.07 |
| 37528.0 | 0.059 |
| 37529.0 | 0.04 |
| 37530.0 | 0.049 |
| 37531.0 | 0.043 |
| 37532.0 | 0.039 |
| 37533.0 | 0.043 |
| 37534.0 | 0.033 |
| 37535.0 | 0.034 |
| 37536.0 | 0.032 |
| 37537.0 | 0.024 |
| 37538.0 | 0.016 |
| 37539.0 | 0.011 |
| 37540.0 | 0.023 |
| 37541.0 | 0.026 |
| 37542.0 | 0.026 |
| 37543.0 | 0.025 |
| 37544.0 | 0.023 |
| 37545.0 | 0.01 |
| 37546.0 | 0.008 |
| 37547.0 | 0.007 |
| 37548.0 | 0.007 |
| 37549.0 | 0.009 |
| 37550.0 | 0.019 |
| 37551.0 | 0.012 |
| 37552.0 | -0.003 |
| 37553.0 | -0.01 |
| 37554.0 | -0.021 |
| 37555.0 | -0.021 |
| 37556.0 | -0.006 |
| 37557.0 | 0.007 |
| 37558.0 | 0.02 |
| 37559.0 | 0.02 |
| 37560.0 | 0.01 |
| 37561.0 | 0.007 |
| 37562.0 | 0.007 |
| 37563.0 | 0.008 |
| 37564.0 | 0.007 |
| 37565.0 | 0.007 |
| 37566.0 | 0.008 |
| 37567.0 | 0.007 |
| 37568.0 | 0.007 |
| 37569.0 | 0.008 |
| 37570.0 | 0.014 |
| 37571.0 | 0.024 |
| 37572.0 | 0.025 |
| 37573.0 | 0.025 |
| 37574.0 | 0.043 |
| 37575.0 | 0.04 |
| 37576.0 | 0.03 |
| 37577.0 | 0.033 |
| 37578.0 | 0.049 |
| 37579.0 | 0.073 |
| 37580.0 | 0.073 |
| 37581.0 | 0.062 |
| 37582.0 | 0.058 |
| 37583.0 | 0.057 |
| 37584.0 | 0.073 |
| 37585.0 | 0.064 |
| 37586.0 | 0.049 |
| 37587.0 | 0.03 |
| 37588.0 | 0.015 |
| 37589.0 | 0.009 |
| 37590.0 | 0.007 |
| 37591.0 | 0.007 |
| 37592.0 | 0.009 |
| 37593.0 | 0.022 |
| 37594.0 | 0.015 |
| 37595.0 | 0.01 |
| 37596.0 | -0.006 |
| 37597.0 | -0.032 |
| 37598.0 | -0.029 |
| 37599.0 | -0.028 |
| 37600.0 | -0.031 |
| 37601.0 | -0.049 |
| 37602.0 | -0.054 |
| 37603.0 | -0.069 |
| 37604.0 | -0.082 |
| 37605.0 | -0.096 |
| 37606.0 | -0.126 |
| 37607.0 | -0.142 |
| 37608.0 | -0.157 |
| 37609.0 | -0.173 |
| 37610.0 | -0.191 |
| 37611.0 | -0.209 |
| 37612.0 | -0.231 |
| 37613.0 | -0.252 |
| 37614.0 | -0.279 |
| 37615.0 | -0.3 |
| 37616.0 | -0.327 |
| 37617.0 | -0.352 |
| 37618.0 | -0.373 |
| 37619.0 | -0.389 |
| 37620.0 | -0.406 |
| 37621.0 | -0.429 |
| 37622.0 | -0.47 |
| 37623.0 | -0.497 |
| 37624.0 | -0.523 |
| 37625.0 | -0.543 |
| 37626.0 | -0.565 |
| 37627.0 | -0.589 |
| 37628.0 | -0.614 |
| 37629.0 | -0.639 |
| 37630.0 | -0.665 |
| 37631.0 | -0.687 |
| 37632.0 | -0.699 |
| 37633.0 | -0.714 |
| 37634.0 | -0.733 |
| 37635.0 | -0.753 |
| 37636.0 | -0.775 |
| 37637.0 | -0.801 |
| 37638.0 | -0.828 |
| 37639.0 | -0.856 |
| 37640.0 | -0.886 |
| 37641.0 | -0.915 |
| 37642.0 | -0.947 |
| 37643.0 | -0.971 |
| 37644.0 | -0.988 |
| 37645.0 | -0.981 |
| 37646.0 | -0.972 |
| 37647.0 | -0.961 |
| 37648.0 | -0.957 |
| 37649.0 | -0.948 |
| 37650.0 | -0.938 |
| 37651.0 | -0.939 |
| 37652.0 | -0.956 |
| 37653.0 | -0.973 |
| 37654.0 | -0.986 |
| 37655.0 | -0.979 |
| 37656.0 | -0.997 |
| 37657.0 | -1.013 |
| 37658.0 | -1.035 |
| 37659.0 | -1.057 |
| 37660.0 | -1.077 |
| 37661.0 | -1.1 |
| 37662.0 | -1.119 |
| 37663.0 | -1.141 |
| 37664.0 | -1.163 |
| 37665.0 | -1.187 |
| 37666.0 | -1.208 |
| 37667.0 | -1.211 |
| 37668.0 | -1.223 |
| 37669.0 | -1.242 |
| 37670.0 | -1.245 |
| 37671.0 | -1.242 |
| 37672.0 | -1.257 |
| 37673.0 | -1.265 |
| 37674.0 | -1.252 |
| 37675.0 | -1.226 |
| 37676.0 | -1.219 |
| 37677.0 | -1.223 |
| 37678.0 | -1.236 |
| 37679.0 | -1.253 |
| 37680.0 | -1.271 |
| 37681.0 | -1.288 |
| 37682.0 | -1.307 |
| 37683.0 | -1.335 |
| 37684.0 | -1.355 |
| 37685.0 | -1.371 |
| 37686.0 | -1.388 |
| 37687.0 | -1.406 |
| 37688.0 | -1.421 |
| 37689.0 | -1.436 |
| 37690.0 | -1.454 |
| 37691.0 | -1.47 |
| 37692.0 | -1.488 |
| 37693.0 | -1.509 |
| 37694.0 | -1.537 |
| 37695.0 | -1.566 |
| 37696.0 | -1.598 |
| 37697.0 | -1.627 |
| 37698.0 | -1.657 |
| 37699.0 | -1.685 |
| 37700.0 | -1.714 |
| 37701.0 | -1.744 |
| 37702.0 | -1.776 |
| 37703.0 | -1.805 |
| 37704.0 | -1.834 |
| 37705.0 | -1.858 |
| 37706.0 | -1.877 |
| 37707.0 | -1.895 |
| 37708.0 | -1.917 |
| 37709.0 | -1.937 |
| 37710.0 | -1.959 |
| 37711.0 | -1.98 |
| 37712.0 | -1.988 |
| 37713.0 | -1.985 |
| 37714.0 | -1.983 |
| 37715.0 | -2 |
| 37716.0 | -2.018 |
| 37717.0 | -2.026 |
| 37718.0 | -2.036 |
| 37719.0 | -2.052 |
| 37720.0 | -2.071 |
| 37721.0 | -2.087 |
| 37722.0 | -2.101 |
| 37723.0 | -2.112 |
| 37724.0 | -2.126 |
| 37725.0 | -2.143 |
| 37726.0 | -2.163 |
| 37727.0 | -2.182 |
| 37728.0 | -2.198 |
| 37729.0 | -2.212 |
| 37730.0 | -2.229 |
| 37731.0 | -2.249 |
| 37732.0 | -2.268 |
| 37733.0 | -2.285 |
| 37734.0 | -2.307 |
| 37735.0 | -2.335 |
| 37736.0 | -2.347 |
| 37737.0 | -2.364 |
| 37738.0 | -2.383 |
| 37739.0 | -2.398 |
| 37740.0 | -2.415 |
| 37741.0 | -2.432 |
| 37742.0 | -2.452 |
| 37743.0 | -2.466 |
| 37744.0 | -2.481 |
| 37745.0 | -2.501 |
| 37746.0 | -2.509 |
| 37747.0 | -2.523 |
| 37748.0 | -2.535 |
| 37749.0 | -2.547 |
| 37750.0 | -2.565 |
| 37751.0 | -2.583 |
| 37752.0 | -2.598 |
| 37753.0 | -2.615 |
| 37754.0 | -2.631 |
| 37755.0 | -2.649 |
| 37756.0 | -2.665 |
| 37757.0 | -2.681 |
| 37758.0 | -2.7 |
| 37759.0 | -2.72 |
| 37760.0 | -2.736 |
| 37761.0 | -2.753 |
| 37762.0 | -2.768 |
| 37763.0 | -2.781 |
| 37764.0 | -2.795 |
| 37765.0 | -2.812 |
| 37766.0 | -2.829 |
| 37767.0 | -2.849 |
| 37768.0 | -2.866 |
| 37769.0 | -2.885 |
| 37770.0 | -2.895 |
| 37771.0 | -2.902 |
| 37772.0 | -2.913 |
| 37773.0 | -2.919 |
| 37774.0 | -2.931 |
| 37775.0 | -2.93 |
| 37776.0 | -2.93 |
| 37777.0 | -2.938 |
| 37778.0 | -2.949 |
| 37779.0 | -2.958 |
| 37780.0 | -2.965 |
| 37781.0 | -2.974 |
| 37782.0 | -2.985 |
| 37783.0 | -2.981 |
| 37784.0 | -2.976 |
| 37785.0 | -2.987 |
| 37786.0 | -3.003 |
| 37787.0 | -3.02 |
| 37788.0 | -3.036 |
| 37789.0 | -3.057 |
| 37790.0 | -3.069 |
| 37791.0 | -3.082 |
| 37792.0 | -3.098 |
| 37793.0 | -3.115 |
| 37794.0 | -3.131 |
| 37795.0 | -3.143 |
| 37796.0 | -3.15 |
| 37797.0 | -3.153 |
| 37798.0 | -3.158 |
| 37799.0 | -3.172 |
| 37800.0 | -3.187 |
| 37801.0 | -3.2 |
| 37802.0 | -3.21 |
| 37803.0 | -3.207 |
| 37804.0 | -3.214 |
| 37805.0 | -3.222 |
| 37806.0 | -3.233 |
| 37807.0 | -3.237 |
| 37808.0 | -3.246 |
| 37809.0 | -3.258 |
| 37810.0 | -3.265 |
| 37811.0 | -3.274 |
| 37812.0 | -3.285 |
| 37813.0 | -3.288 |
| 37814.0 | -3.293 |
| 37815.0 | -3.307 |
| 37816.0 | -3.322 |
| 37817.0 | -3.336 |
| 37818.0 | -3.348 |
| 37819.0 | -3.306 |
| 37820.0 | -3.292 |
| 37821.0 | -3.297 |
| 37822.0 | -3.301 |
| 37823.0 | -3.271 |
| 37824.0 | -3.261 |
| 37825.0 | -3.264 |
| 37826.0 | -3.276 |
| 37827.0 | -3.285 |
| 37828.0 | -3.303 |
| 37829.0 | -3.314 |
| 37830.0 | -3.319 |
| 37831.0 | -3.321 |
| 37832.0 | -3.32 |
| 37833.0 | -3.324 |
| 37834.0 | -3.331 |
| 37835.0 | -3.342 |
| 37836.0 | -3.354 |
| 37837.0 | -3.365 |
| 37838.0 | -3.38 |
| 37839.0 | -3.392 |
| 37840.0 | -3.405 |
| 37841.0 | -3.417 |
| 37842.0 | -3.428 |
| 37843.0 | -3.444 |
| 37844.0 | -3.462 |
| 37845.0 | -3.478 |
| 37846.0 | -3.496 |
| 37847.0 | -3.517 |
| 37848.0 | -3.538 |
| 37849.0 | -3.552 |
| 37850.0 | -3.566 |
| 37851.0 | -3.572 |
| 37852.0 | -3.58 |
| 37853.0 | -3.587 |
| 37854.0 | -3.597 |
| 37855.0 | -3.607 |
| 37856.0 | -3.62 |
| 37857.0 | -3.637 |
| 37858.0 | -3.655 |
| 37859.0 | -3.671 |
| 37860.0 | 0 |
| 37861.0 | 0 |
| 37862.0 | 0 |
| 37863.0 | 0 |
| 37864.0 | 0 |
| 37865.0 | 0 |
| 37866.0 | -3.611 |
| 37867.0 | -3.615 |
| 37868.0 | -3.618 |
| 37869.0 | -3.618 |
| 37870.0 | -3.623 |
| 37871.0 | -3.629 |
| 37872.0 | -3.635 |
| 37873.0 | -3.645 |
| 37874.0 | -3.652 |
| 37875.0 | -3.661 |
| 37876.0 | -3.673 |
| 37877.0 | -3.688 |
| 37878.0 | -3.701 |
| 37879.0 | -3.711 |
| 37880.0 | -3.724 |
| 37881.0 | -3.742 |
| 37882.0 | -3.747 |
| 37883.0 | -3.76 |
| 37884.0 | -3.776 |
| 37885.0 | -3.781 |
| 37886.0 | -3.777 |
| 37887.0 | -3.77 |
| 37888.0 | -3.78 |
| 37889.0 | -3.797 |
| 37890.0 | -3.793 |
| 37891.0 | -3.788 |
| 37892.0 | -3.795 |
| 37893.0 | -3.808 |
| 37894.0 | -3.811 |
| 37895.0 | -3.809 |
| 37896.0 | -3.784 |
| 37897.0 | -3.767 |
| 37898.0 | -3.747 |
| 37899.0 | -3.725 |
| 37900.0 | -3.712 |
| 37901.0 | -3.677 |
| 37902.0 | -3.615 |
| 37903.0 | -3.564 |
| 37904.0 | -3.508 |
| 37905.0 | -3.485 |
| 37906.0 | -3.478 |
| 37907.0 | -3.479 |
| 37908.0 | -3.468 |
| 37909.0 | -3.475 |
| 37910.0 | -3.483 |
| 37911.0 | -3.497 |
| 37912.0 | -3.508 |
| 37913.0 | -3.531 |
| 37914.0 | -3.543 |
| 37915.0 | -3.563 |
| 37916.0 | -3.586 |
| 37917.0 | -3.608 |
| 37918.0 | -3.619 |
| 37919.0 | -3.61 |
| 37920.0 | -3.615 |
| 37921.0 | -3.626 |
| 37922.0 | -3.636 |
| 37923.0 | -3.649 |
| 37924.0 | -3.653 |
| 37925.0 | -3.661 |
| 37926.0 | -3.662 |
| 37927.0 | -3.679 |
| 37928.0 | -3.692 |
| 37929.0 | -3.701 |
| 37930.0 | -3.702 |
| 37931.0 | -3.71 |
| 37932.0 | -3.706 |
| 37933.0 | -3.698 |
| 37934.0 | -3.694 |
| 37935.0 | -3.701 |
| 37936.0 | -3.715 |
| 37937.0 | -3.733 |
| 37938.0 | -3.751 |
| 37939.0 | -3.771 |
| 37940.0 | -3.789 |
| 37941.0 | -3.805 |
| 37942.0 | -3.814 |
| 37943.0 | -3.792 |
| 37944.0 | -3.777 |
| 37945.0 | -3.782 |
| 37946.0 | -3.804 |
| 37947.0 | -3.796 |
| 37948.0 | -3.803 |
| 37949.0 | -3.815 |
| 37950.0 | -3.828 |
| 37951.0 | -3.849 |
| 37952.0 | -3.873 |
| 37953.0 | -3.881 |
| 37954.0 | -3.89 |
| 37955.0 | -3.909 |
| 37956.0 | -3.952 |
| 37957.0 | -3.963 |
| 37958.0 | -3.972 |
| 37959.0 | -3.987 |
| 37960.0 | -3.98 |
| 37961.0 | -4.005 |
| 37962.0 | -4.027 |
| 37963.0 | -4.05 |
| 37964.0 | -4.079 |
| 37965.0 | -4.102 |
| 37966.0 | -4.133 |
| 37967.0 | -4.164 |
| 37968.0 | -4.196 |
| 37969.0 | -4.227 |
| 37970.0 | -4.259 |
| 37971.0 | -4.29 |
| 37972.0 | -4.321 |
| 37973.0 | -4.359 |
| 37974.0 | -4.465 |
| 37975.0 | -4.498 |
| 37976.0 | -4.516 |
| 37977.0 | -4.534 |
| 37978.0 | -4.552 |
| 37979.0 | -4.57 |
| 37980.0 | -4.587 |
| 37981.0 | -4.605 |
| 37982.0 | -4.623 |
| 37983.0 | -4.641 |
| 37984.0 | -4.659 |
| 37985.0 | -4.677 |
| 37986.0 | -4.696 |
| 37987.0 | -4.724 |
| 37988.0 | -4.752 |
| 37989.0 | -4.781 |
| 37990.0 | -4.809 |
| 37991.0 | -4.838 |
| 37992.0 | -4.866 |
| 37993.0 | -4.895 |
| 37994.0 | -4.923 |
| 37995.0 | -4.952 |
| 37996.0 | -4.98 |
| 37997.0 | -5.008 |
| 37998.0 | -5.037 |
| 37999.0 | -5.064 |
| 38000.0 | -5.086 |
| 38001.0 | -5.106 |
| 38002.0 | -5.127 |
| 38003.0 | -5.148 |
| 38004.0 | -5.168 |
| 38005.0 | -5.189 |
| 38006.0 | -5.209 |
| 38007.0 | -5.231 |
| 38008.0 | -5.256 |
| 38009.0 | -5.281 |
| 38010.0 | -5.307 |
| 38011.0 | -5.333 |
| 38012.0 | -5.359 |
| 38013.0 | -5.384 |
| 38014.0 | -5.407 |
| 38015.0 | -5.408 |
| 38016.0 | -5.406 |
| 38017.0 | -5.404 |
| 38018.0 | -5.402 |
| 38019.0 | -5.399 |
| 38020.0 | -5.393 |
| 38021.0 | -5.387 |
| 38022.0 | -5.392 |
| 38023.0 | -5.399 |
| 38024.0 | -5.406 |
| 38025.0 | -5.414 |
| 38026.0 | -5.421 |
| 38027.0 | -5.428 |
| 38028.0 | -5.435 |
| 38029.0 | -5.441 |
| 38030.0 | -5.448 |
| 38031.0 | -5.454 |
| 38032.0 | -5.461 |
| 38033.0 | -5.467 |
| 38034.0 | -5.474 |
| 38035.0 | -5.479 |
| 38036.0 | -5.482 |
| 38037.0 | -5.484 |
| 38038.0 | -5.486 |
| 38039.0 | -5.489 |
| 38040.0 | -5.491 |
| 38041.0 | -5.493 |
| 38042.0 | -5.491 |
| 38043.0 | -5.464 |
| 38044.0 | -5.433 |
| 38045.0 | -5.402 |
| 38046.0 | -5.371 |
| 38047.0 | -5.343 |
| 38048.0 | -5.33 |
| 38049.0 | -5.32 |
| 38050.0 | -5.31 |
| 38051.0 | -5.3 |
| 38052.0 | -5.29 |
| 38053.0 | -5.28 |
| 38054.0 | -5.27 |
| 38055.0 | -5.26 |
| 38056.0 | -5.248 |
| 38057.0 | -5.223 |
| 38058.0 | -5.197 |
| 38059.0 | -5.17 |
| 38060.0 | -5.143 |
| 38061.0 | -5.117 |
| 38062.0 | -5.094 |
| 38063.0 | -5.092 |
| 38064.0 | -5.095 |
| 38065.0 | -5.097 |
| 38066.0 | -5.1 |
| 38067.0 | -5.102 |
| 38068.0 | -5.105 |
| 38069.0 | -5.107 |
| 38070.0 | -5.102 |
| 38071.0 | -5.051 |
| 38072.0 | -4.991 |
| 38073.0 | -4.932 |
| 38074.0 | -4.873 |
| 38075.0 | -4.814 |
| 38076.0 | -4.754 |
| 38077.0 | -4.7 |
| 38078.0 | -4.674 |
| 38079.0 | -4.654 |
| 38080.0 | -4.633 |
| 38081.0 | -4.612 |
| 38082.0 | -4.591 |
| 38083.0 | -4.571 |
| 38084.0 | -4.547 |
| 38085.0 | -4.502 |
| 38086.0 | -4.454 |
| 38087.0 | -4.406 |
| 38088.0 | -4.359 |
| 38089.0 | -4.311 |
| 38090.0 | -4.263 |
| 38091.0 | -4.215 |
| 38092.0 | -4.169 |
| 38093.0 | -4.122 |
| 38094.0 | -4.076 |
| 38095.0 | -4.029 |
| 38096.0 | -3.983 |
| 38097.0 | -3.936 |
| 38098.0 | -3.895 |
| 38099.0 | -3.883 |
| 38100.0 | -3.876 |
| 38101.0 | -3.868 |
| 38102.0 | -3.861 |
| 38103.0 | -3.854 |
| 38104.0 | -3.847 |
| 38105.0 | -3.839 |
| 38106.0 | -3.832 |
| 38107.0 | -3.825 |
| 38108.0 | -3.814 |
| 38109.0 | -3.803 |
| 38110.0 | -3.792 |
| 38111.0 | -3.781 |
| 38112.0 | -3.768 |
| 38113.0 | -3.742 |
| 38114.0 | -3.714 |
| 38115.0 | -3.686 |
| 38116.0 | -3.659 |
| 38117.0 | -3.631 |
| 38118.0 | -3.603 |
| 38119.0 | -3.578 |
| 38120.0 | -3.568 |
| 38121.0 | -3.561 |
| 38122.0 | -3.554 |
| 38123.0 | -3.546 |
| 38124.0 | -3.539 |
| 38125.0 | -3.532 |
| 38126.0 | -3.524 |
| 38127.0 | -3.511 |
| 38128.0 | -3.496 |
| 38129.0 | -3.482 |
| 38130.0 | -3.468 |
| 38131.0 | -3.454 |
| 38132.0 | -3.439 |
| 38133.0 | -3.425 |
| 38134.0 | -3.409 |
| 38135.0 | -3.394 |
| 38136.0 | -3.378 |
| 38137.0 | -3.362 |
| 38138.0 | -3.346 |
| 38139.0 | -3.331 |
| 38140.0 | -3.311 |
| 38141.0 | -3.267 |
| 38142.0 | -3.219 |
| 38143.0 | -3.171 |
| 38144.0 | -3.124 |
| 38145.0 | -3.076 |
| 38146.0 | -3.028 |
| 38147.0 | -2.98 |
| 38148.0 | -2.932 |
| 38149.0 | -2.884 |
| 38150.0 | -2.836 |
| 38151.0 | -2.789 |
| 38152.0 | -2.741 |
| 38153.0 | -2.693 |
| 38154.0 | -2.644 |
| 38155.0 | -2.591 |
| 38156.0 | -2.541 |
| 38157.0 | -2.466 |
| 38158.0 | -2.401 |
| 38159.0 | -2.346 |
| 38160.0 | -2.318 |
| 38161.0 | -2.264 |
| 38162.0 | -2.225 |
| 38163.0 | -2.174 |
| 38164.0 | -2.119 |
| 38165.0 | -2.067 |
| 38166.0 | -2.019 |
| 38167.0 | -1.985 |
| 38168.0 | -1.976 |
| 38169.0 | -1.968 |
| 38170.0 | -1.945 |
| 38171.0 | -1.902 |
| 38172.0 | -1.872 |
| 38173.0 | -1.852 |
| 38174.0 | -1.836 |
| 38175.0 | -1.823 |
| 38176.0 | -1.806 |
| 38177.0 | -1.796 |
| 38178.0 | -1.785 |
| 38179.0 | -1.779 |
| 38180.0 | -1.773 |
| 38181.0 | -1.764 |
| 38182.0 | -1.757 |
| 38183.0 | -1.748 |
| 38184.0 | -1.72 |
| 38185.0 | -1.706 |
| 38186.0 | -1.7 |
| 38187.0 | -1.696 |
| 38188.0 | -1.689 |
| 38189.0 | -1.683 |
| 38190.0 | -1.678 |
| 38191.0 | -1.677 |
| 38192.0 | -1.672 |
| 38193.0 | -1.668 |
| 38194.0 | -1.665 |
| 38195.0 | -1.664 |
| 38196.0 | -1.656 |
| 38197.0 | -1.654 |
| 38198.0 | -1.65 |
| 38199.0 | -1.649 |
| 38200.0 | -1.651 |
| 38201.0 | -1.653 |
| 38202.0 | -1.654 |
| 38203.0 | -1.658 |
| 38204.0 | -1.661 |
| 38205.0 | -1.661 |
| 38206.0 | -1.648 |
| 38207.0 | -1.601 |
| 38208.0 | -1.433 |
| 38209.0 | -1.341 |
| 38210.0 | -1.308 |
| 38211.0 | -1.285 |
| 38212.0 | -1.243 |
| 38213.0 | -1.203 |
| 38214.0 | -1.173 |
| 38215.0 | -1.152 |
| 38216.0 | -1.137 |
| 38217.0 | -1.12 |
| 38218.0 | -1.102 |
| 38219.0 | -1.086 |
| 38220.0 | -1.068 |
| 38221.0 | -1.048 |
| 38222.0 | -1.023 |
| 38223.0 | -0.999 |
| 38224.0 | -0.982 |
| 38225.0 | -0.975 |
| 38226.0 | -0.978 |
| 38227.0 | -0.981 |
| 38228.0 | -0.975 |
| 38229.0 | -0.967 |
| 38230.0 | -0.958 |
| 38231.0 | -0.929 |
| 38232.0 | -0.823 |
| 38233.0 | -0.725 |
| 38234.0 | -0.673 |
| 38235.0 | -0.62 |
| 38236.0 | -0.563 |
| 38237.0 | -0.52 |
| 38238.0 | -0.483 |
| 38239.0 | -0.444 |
| 38240.0 | -0.387 |
| 38241.0 | -0.292 |
| 38242.0 | -0.208 |
| 38243.0 | -0.144 |
| 38244.0 | -0.093 |
| 38245.0 | -0.059 |
| 38246.0 | -0.034 |
| 38247.0 | -0.023 |
| 38248.0 | -0.011 |
| 38249.0 | 0.004 |
| 38250.0 | 0.023 |
| 38251.0 | 0.031 |
| 38252.0 | 0.072 |
| 38253.0 | 0.098 |
| 38254.0 | 0.121 |
| 38255.0 | 0.152 |
| 38256.0 | 0.169 |
| 38257.0 | 0.18 |
| 38258.0 | 0.184 |
| 38259.0 | 0.168 |
| 38260.0 | 0.151 |
| 38261.0 | 0.138 |
| 38262.0 | 0.132 |
| 38263.0 | 0.124 |
| 38264.0 | 0.112 |
| 38265.0 | 0.114 |
| 38266.0 | 0.146 |
| 38267.0 | 0.149 |
| 38268.0 | 0.139 |
| 38269.0 | 0.126 |
| 38270.0 | 0.117 |
| 38271.0 | 0.112 |
| 38272.0 | 0.104 |
| 38273.0 | 0.101 |
| 38274.0 | 0.105 |
| 38275.0 | 0.085 |
| 38276.0 | 0.073 |
| 38277.0 | 0.067 |
| 38278.0 | 0.059 |
| 38279.0 | 0.049 |
| 38280.0 | 0.035 |
| 38281.0 | 0.02 |
| 38282.0 | 0.014 |
| 38283.0 | 0.023 |
| 38284.0 | 0.026 |
| 38285.0 | 0.025 |
| 38286.0 | 0.018 |
| 38287.0 | 0.007 |
| 38288.0 | -0.003 |
| 38289.0 | 0.009 |
| 38290.0 | 0.036 |
| 38291.0 | 0.045 |
| 38292.0 | 0.042 |
| 38293.0 | 0.029 |
| 38294.0 | 0.019 |
| 38295.0 | 0.024 |
| 38296.0 | 0.025 |
| 38297.0 | 0.015 |
| 38298.0 | -0.003 |
| 38299.0 | -0.015 |
| 38300.0 | -0.027 |
| 38301.0 | -0.044 |
| 38302.0 | -0.059 |
| 38303.0 | -0.076 |
| 38304.0 | -0.092 |
| 38305.0 | -0.116 |
| 38306.0 | -0.126 |
| 38307.0 | -0.123 |
| 38308.0 | -0.13 |
| 38309.0 | -0.137 |
| 38310.0 | -0.15 |
| 38311.0 | -0.162 |
| 38312.0 | -0.175 |
| 38313.0 | -0.188 |
| 38314.0 | -0.201 |
| 38315.0 | -0.202 |
| 38316.0 | -0.203 |
| 38317.0 | -0.211 |
| 38318.0 | -0.2 |
| 38319.0 | -0.188 |
| 38320.0 | -0.173 |
| 38321.0 | -0.151 |
| 38322.0 | -0.139 |
| 38323.0 | -0.137 |
| 38324.0 | -0.139 |
| 38325.0 | -0.139 |
| 38326.0 | -0.142 |
| 38327.0 | -0.153 |
| 38328.0 | -0.157 |
| 38329.0 | -0.164 |
| 38330.0 | -0.178 |
| 38331.0 | -0.177 |
| 38332.0 | -0.164 |
| 38333.0 | -0.128 |
| 38334.0 | -0.075 |
| 38335.0 | -0.03 |
| 38336.0 | 0 |
| 38337.0 | 0.012 |
| 38338.0 | 0.043 |
| 38339.0 | 0.078 |
| 38340.0 | 0.146 |
| 38341.0 | 0.192 |
| 38342.0 | 0.222 |
| 38343.0 | 0.314 |
| 38344.0 | 0.376 |
| 38345.0 | 0.49 |
| 38346.0 | 0.506 |
| 38347.0 | 0.427 |
| 38348.0 | 0.347 |
| 38349.0 | 0.286 |
| 38350.0 | 0.233 |
| 38351.0 | 0.201 |
| 38352.0 | 0.206 |
| 38353.0 | 0.215 |
| 38354.0 | 0.191 |
| 38355.0 | 0.165 |
| 38356.0 | 0.146 |
| 38357.0 | 0.138 |
| 38358.0 | 0.128 |
| 38359.0 | 0.119 |
| 38360.0 | 0.128 |
| 38361.0 | 0.146 |
| 38362.0 | 0.148 |
| 38363.0 | 0.133 |
| 38364.0 | 0.115 |
| 38365.0 | 0.086 |
| 38366.0 | 0.072 |
| 38367.0 | 0.051 |
| 38368.0 | 0.045 |
| 38369.0 | 0.04 |
| 38370.0 | 0.041 |
| 38371.0 | 0.035 |
| 38372.0 | 0.027 |
| 38373.0 | 0.01 |
| 38374.0 | 0.007 |
| 38375.0 | 0.016 |
| 38376.0 | 0.028 |
| 38377.0 | 0.024 |
| 38378.0 | 0.015 |
| 38379.0 | 0.002 |
| 38380.0 | -0.014 |
| 38381.0 | -0.027 |
| 38382.0 | -0.04 |
| 38383.0 | -0.056 |
| 38384.0 | -0.072 |
| 38385.0 | -0.086 |
| 38386.0 | -0.103 |
| 38387.0 | -0.121 |
| 38388.0 | -0.141 |
| 38389.0 | -0.16 |
| 38390.0 | -0.174 |
| 38391.0 | -0.182 |
| 38392.0 | -0.203 |
| 38393.0 | -0.224 |
| 38394.0 | -0.238 |
| 38395.0 | -0.236 |
| 38396.0 | -0.232 |
| 38397.0 | -0.235 |
| 38398.0 | -0.234 |
| 38399.0 | -0.247 |
| 38400.0 | -0.263 |
| 38401.0 | -0.281 |
| 38402.0 | -0.297 |
| 38403.0 | -0.319 |
| 38404.0 | -0.333 |
| 38405.0 | -0.348 |
| 38406.0 | -0.364 |
| 38407.0 | -0.379 |
| 38408.0 | -0.392 |
| 38409.0 | -0.407 |
| 38410.0 | -0.425 |
| 38411.0 | -0.447 |
| 38412.0 | -0.461 |
| 38413.0 | -0.479 |
| 38414.0 | -0.495 |
| 38415.0 | -0.513 |
| 38416.0 | -0.53 |
| 38417.0 | -0.541 |
| 38418.0 | -0.571 |
| 38419.0 | -0.601 |
| 38420.0 | -0.609 |
| 38421.0 | -0.623 |
| 38422.0 | -0.628 |
| 38423.0 | -0.634 |
| 38424.0 | -0.644 |
| 38425.0 | -0.657 |
| 38426.0 | -0.672 |
| 38427.0 | -0.687 |
| 38428.0 | -0.703 |
| 38429.0 | -0.719 |
| 38430.0 | -0.736 |
| 38431.0 | -0.751 |
| 38432.0 | -0.765 |
| 38433.0 | -0.781 |
| 38434.0 | -0.789 |
| 38435.0 | -0.801 |
| 38436.0 | -0.814 |
| 38437.0 | -0.813 |
| 38438.0 | -0.805 |
| 38439.0 | -0.813 |
| 38440.0 | -0.821 |
| 38441.0 | -0.828 |
| 38442.0 | -0.841 |
| 38443.0 | -0.853 |
| 38444.0 | -0.858 |
| 38445.0 | -0.879 |
| 38446.0 | -0.889 |
| 38447.0 | -0.9 |
| 38448.0 | -0.876 |
| 38449.0 | -0.885 |
| 38450.0 | -0.889 |
| 38451.0 | -0.894 |
| 38452.0 | -0.903 |
| 38453.0 | -0.915 |
| 38454.0 | -0.929 |
| 38455.0 | -0.943 |
| 38456.0 | -0.956 |
| 38457.0 | -0.971 |
| 38458.0 | -0.981 |
| 38459.0 | -0.975 |
| 38460.0 | -0.976 |
| 38461.0 | -0.99 |
| 38462.0 | -1.008 |
| 38463.0 | -1.025 |
| 38464.0 | -1.038 |
| 38465.0 | -1.053 |
| 38466.0 | -1.053 |
| 38467.0 | -1.044 |
| 38468.0 | -1.043 |
| 38469.0 | -1.004 |
| 38470.0 | -0.919 |
| 38471.0 | -0.861 |
| 38472.0 | -0.84 |
| 38473.0 | -0.83 |
| 38474.0 | -0.82 |
| 38475.0 | -0.806 |
| 38476.0 | -0.8 |
| 38477.0 | -0.802 |
| 38478.0 | -0.805 |
| 38479.0 | -0.809 |
| 38480.0 | -0.805 |
| 38481.0 | -0.802 |
| 38482.0 | -0.809 |
| 38483.0 | -0.816 |
| 38484.0 | -0.807 |
| 38485.0 | -0.805 |
| 38486.0 | -0.81 |
| 38487.0 | -0.811 |
| 38488.0 | -0.811 |
| 38489.0 | -0.815 |
| 38490.0 | -0.822 |
| 38491.0 | -0.83 |
| 38492.0 | -0.838 |
| 38493.0 | -0.845 |
| 38494.0 | -0.853 |
| 38495.0 | -0.863 |
| 38496.0 | -0.873 |
| 38497.0 | -0.883 |
| 38498.0 | -0.894 |
| 38499.0 | -0.9 |
| 38500.0 | -0.908 |
| 38501.0 | -0.92 |
| 38502.0 | -0.933 |
| 38503.0 | -0.93 |
| 38504.0 | -0.919 |
| 38505.0 | -0.908 |
| 38506.0 | -0.884 |
| 38507.0 | -0.765 |
| 38508.0 | -0.374 |
| 38509.0 | -0.237 |
| 38510.0 | -0.191 |
| 38511.0 | -0.162 |
| 38512.0 | -0.145 |
| 38513.0 | -0.134 |
| 38514.0 | -0.127 |
| 38515.0 | -0.122 |
| 38516.0 | -0.12 |
| 38517.0 | -0.126 |
| 38518.0 | -0.133 |
| 38519.0 | -0.144 |
| 38520.0 | -0.159 |
| 38521.0 | -0.166 |
| 38522.0 | -0.168 |
| 38523.0 | -0.166 |
| 38524.0 | -0.165 |
| 38525.0 | -0.158 |
| 38526.0 | -0.142 |
| 38527.0 | -0.136 |
| 38528.0 | -0.137 |
| 38529.0 | -0.139 |
| 38530.0 | -0.141 |
| 38531.0 | -0.15 |
| 38532.0 | -0.136 |
| 38533.0 | -0.076 |
| 38534.0 | -0.048 |
| 38535.0 | 0.013 |
| 38536.0 | 0.011 |
| 38537.0 | 0.014 |
| 38538.0 | 0.015 |
| 38539.0 | 0.014 |
| 38540.0 | 0.009 |
| 38541.0 | 0.009 |
| 38542.0 | 0.02 |
| 38543.0 | 0.039 |
| 38544.0 | 0.037 |
| 38545.0 | 0.025 |
| 38546.0 | 0.028 |
| 38547.0 | 0.037 |
| 38548.0 | 0.036 |
| 38549.0 | 0.029 |
| 38550.0 | 0.018 |
| 38551.0 | 0.009 |
| 38552.0 | 0.015 |
| 38553.0 | 0.023 |
| 38554.0 | 0.018 |
| 38555.0 | 0.021 |
| 38556.0 | 0.018 |
| 38557.0 | 0.011 |
| 38558.0 | 0.006 |
| 38559.0 | 0.008 |
| 38560.0 | 0.023 |
| 38561.0 | 0.026 |
| 38562.0 | 0.024 |
| 38563.0 | 0.012 |
| 38564.0 | -0.003 |
| 38565.0 | -0.023 |
| 38566.0 | -0.057 |
| 38567.0 | -0.068 |
| 38568.0 | -0.084 |
| 38569.0 | -0.107 |
| 38570.0 | -0.13 |
| 38571.0 | -0.153 |
| 38572.0 | -0.177 |
| 38573.0 | -0.195 |
| 38574.0 | -0.201 |
| 38575.0 | -0.219 |
| 38576.0 | -0.241 |
| 38577.0 | -0.257 |
| 38578.0 | -0.277 |
| 38579.0 | -0.293 |
| 38580.0 | -0.31 |
| 38581.0 | -0.33 |
| 38582.0 | -0.346 |
| 38583.0 | -0.364 |
| 38584.0 | -0.393 |
| 38585.0 | -0.417 |
| 38586.0 | -0.437 |
| 38587.0 | -0.459 |
| 38588.0 | -0.48 |
| 38589.0 | -0.503 |
| 38590.0 | -0.524 |
| 38591.0 | -0.544 |
| 38592.0 | -0.568 |
| 38593.0 | -0.59 |
| 38594.0 | -0.61 |
| 38595.0 | -0.638 |
| 38596.0 | -0.667 |
| 38597.0 | -0.692 |
| 38598.0 | -0.712 |
| 38599.0 | -0.737 |
| 38600.0 | -0.765 |
| 38601.0 | -0.785 |
| 38602.0 | -0.802 |
| 38603.0 | -0.816 |
| 38604.0 | -0.835 |
| 38605.0 | -0.852 |
| 38606.0 | -0.87 |
| 38607.0 | -0.892 |
| 38608.0 | -0.913 |
| 38609.0 | -0.936 |
| 38610.0 | -0.957 |
| 38611.0 | -0.973 |
| 38612.0 | -0.975 |
| 38613.0 | -0.978 |
| 38614.0 | -0.997 |
| 38615.0 | -1.014 |
| 38616.0 | -1.022 |
| 38617.0 | -1.024 |
| 38618.0 | -1.001 |
| 38619.0 | -0.991 |
| 38620.0 | -0.987 |
| 38621.0 | -0.984 |
| 38622.0 | -0.991 |
| 38623.0 | -0.992 |
| 38624.0 | -0.992 |
| 38625.0 | -0.988 |
| 38626.0 | -0.979 |
| 38627.0 | -0.979 |
| 38628.0 | -0.99 |
| 38629.0 | -1.005 |
| 38630.0 | -1.008 |
| 38631.0 | -0.979 |
| 38632.0 | -0.973 |
| 38633.0 | -0.96 |
| 38634.0 | -0.889 |
| 38635.0 | -0.845 |
| 38636.0 | -0.827 |
| 38637.0 | -0.813 |
| 38638.0 | -0.805 |
| 38639.0 | -0.8 |
| 38640.0 | -0.795 |
| 38641.0 | -0.791 |
| 38642.0 | -0.796 |
| 38643.0 | -0.803 |
| 38644.0 | -0.807 |
| 38645.0 | -0.777 |
| 38646.0 | -0.749 |
| 38647.0 | -0.748 |
| 38648.0 | -0.754 |
| 38649.0 | -0.764 |
| 38650.0 | -0.776 |
| 38651.0 | -0.788 |
| 38652.0 | -0.801 |
| 38653.0 | -0.823 |
| 38654.0 | -0.828 |
| 38655.0 | -0.834 |
| 38656.0 | -0.85 |
| 38657.0 | -0.867 |
| 38658.0 | -0.882 |
| 38659.0 | -0.898 |
| 38660.0 | -0.9 |
| 38661.0 | -0.905 |
| 38662.0 | -0.925 |
| 38663.0 | -0.944 |
| 38664.0 | -0.968 |
| 38665.0 | -0.982 |
| 38666.0 | -0.981 |
| 38667.0 | -0.984 |
| 38668.0 | -1.006 |
| 38669.0 | -1.021 |
| 38670.0 | -1.032 |
| 38671.0 | -1.045 |
| 38672.0 | -1.065 |
| 38673.0 | -1.075 |
| 38674.0 | -1.08 |
| 38675.0 | -1.093 |
| 38676.0 | -1.111 |
| 38677.0 | -1.121 |
| 38678.0 | -1.1 |
| 38679.0 | -1.087 |
| 38680.0 | -1.087 |
| 38681.0 | -1.093 |
| 38682.0 | -1.105 |
| 38683.0 | -1.122 |
| 38684.0 | -1.141 |
| 38685.0 | -1.163 |
| 38686.0 | -1.186 |
| 38687.0 | -1.206 |
| 38688.0 | -1.228 |
| 38689.0 | -1.25 |
| 38690.0 | -1.27 |
| 38691.0 | -1.291 |
| 38692.0 | -1.307 |
| 38693.0 | -1.328 |
| 38694.0 | -1.356 |
| 38695.0 | -1.368 |
| 38696.0 | -1.386 |
| 38697.0 | -1.408 |
| 38698.0 | -1.428 |
| 38699.0 | -1.453 |
| 38700.0 | -1.483 |
| 38701.0 | -1.512 |
| 38702.0 | -1.534 |
| 38703.0 | -1.546 |
| 38704.0 | -1.557 |
| 38705.0 | -1.582 |
| 38706.0 | -1.6 |
| 38707.0 | -1.567 |
| 38708.0 | -1.482 |
| 38709.0 | -1.122 |
| 38710.0 | -0.725 |
| 38711.0 | -0.624 |
| 38712.0 | -0.6 |
| 38713.0 | -0.589 |
| 38714.0 | -0.586 |
| 38715.0 | -0.588 |
| 38716.0 | -0.593 |
| 38717.0 | -0.599 |
| 38718.0 | -0.608 |
| 38719.0 | -0.604 |
| 38720.0 | -0.599 |
| 38721.0 | -0.614 |
| 38722.0 | -0.597 |
| 38723.0 | -0.59 |
| 38724.0 | -0.588 |
| 38725.0 | -0.599 |
| 38726.0 | -0.612 |
| 38727.0 | -0.618 |
| 38728.0 | -0.62 |
| 38729.0 | -0.596 |
| 38730.0 | -0.56 |
| 38731.0 | -0.557 |
| 38732.0 | -0.568 |
| 38733.0 | -0.583 |
| 38734.0 | -0.601 |
| 38735.0 | -0.615 |
| 38736.0 | -0.624 |
| 38737.0 | -0.634 |
| 38738.0 | -0.648 |
| 38739.0 | -0.66 |
| 38740.0 | -0.675 |
| 38741.0 | -0.692 |
| 38742.0 | -0.714 |
| 38743.0 | -0.737 |
| 38744.0 | -0.757 |
| 38745.0 | -0.779 |
| 38746.0 | -0.8 |
| 38747.0 | -0.823 |
| 38748.0 | -0.851 |
| 38749.0 | -0.874 |
| 38750.0 | -0.899 |
| 38751.0 | -0.923 |
| 38752.0 | -0.949 |
| 38753.0 | -0.971 |
| 38754.0 | -0.989 |
| 38755.0 | -0.997 |
| 38756.0 | -1.005 |
| 38757.0 | -1.022 |
| 38758.0 | -1.044 |
| 38759.0 | -1.071 |
| 38760.0 | -1.1 |
| 38761.0 | -1.121 |
| 38762.0 | -1.145 |
| 38763.0 | -1.167 |
| 38764.0 | -1.188 |
| 38765.0 | -1.211 |
| 38766.0 | -1.232 |
| 38767.0 | -1.256 |
| 38768.0 | -1.28 |
| 38769.0 | -1.298 |
| 38770.0 | -1.317 |
| 38771.0 | -1.336 |
| 38772.0 | -1.347 |
| 38773.0 | -1.365 |
| 38774.0 | -1.387 |
| 38775.0 | -1.407 |
| 38776.0 | -1.409 |
| 38777.0 | -1.415 |
| 38778.0 | -1.381 |
| 38779.0 | -1.302 |
| 38780.0 | -1.189 |
| 38781.0 | -1.143 |
| 38782.0 | -1.127 |
| 38783.0 | -1.124 |
| 38784.0 | -1.13 |
| 38785.0 | -1.136 |
| 38786.0 | -1.145 |
| 38787.0 | -1.148 |
| 38788.0 | -1.147 |
| 38789.0 | -1.146 |
| 38790.0 | -1.155 |
| 38791.0 | -1.168 |
| 38792.0 | -1.178 |
| 38793.0 | -1.191 |
| 38794.0 | -1.206 |
| 38795.0 | -1.222 |
| 38796.0 | -1.233 |
| 38797.0 | -1.25 |
| 38798.0 | -1.263 |
| 38799.0 | -1.279 |
| 38800.0 | -1.301 |
| 38801.0 | -1.315 |
| 38802.0 | -1.334 |
| 38803.0 | -1.354 |
| 38804.0 | -1.371 |
| 38805.0 | -1.388 |
| 38806.0 | -1.407 |
| 38807.0 | -1.424 |
| 38808.0 | -1.444 |
| 38809.0 | -1.46 |
| 38810.0 | -1.482 |
| 38811.0 | -1.501 |
| 38812.0 | -1.515 |
| 38813.0 | -1.533 |
| 38814.0 | -1.554 |
| 38815.0 | -1.58 |
| 38816.0 | -1.598 |
| 38817.0 | -1.618 |
| 38818.0 | -1.621 |
| 38819.0 | -1.611 |
| 38820.0 | -1.611 |
| 38821.0 | -1.621 |
| 38822.0 | -1.635 |
| 38823.0 | -1.652 |
| 38824.0 | -1.67 |
| 38825.0 | -1.686 |
| 38826.0 | -1.702 |
| 38827.0 | -1.721 |
| 38828.0 | -1.74 |
| 38829.0 | -1.762 |
| 38830.0 | -1.788 |
| 38831.0 | -1.802 |
| 38832.0 | -1.814 |
| 38833.0 | -1.746 |
| 38834.0 | -1.494 |
| 38835.0 | -1.444 |
| 38836.0 | -1.449 |
| 38837.0 | -1.46 |
| 38838.0 | -1.469 |
| 38839.0 | -1.48 |
| 38840.0 | -1.493 |
| 38841.0 | -1.508 |
| 38842.0 | -1.522 |
| 38843.0 | -1.534 |
| 38844.0 | -1.548 |
| 38845.0 | -1.565 |
| 38846.0 | -1.577 |
| 38847.0 | -1.598 |
| 38848.0 | -1.588 |
| 38849.0 | -1.432 |
| 38850.0 | -1.358 |
| 38851.0 | -1.336 |
| 38852.0 | -1.3 |
| 38853.0 | -1.282 |
| 38854.0 | -1.264 |
| 38855.0 | -1.24 |
| 38856.0 | -1.231 |
| 38857.0 | -1.229 |
| 38858.0 | -1.231 |
| 38859.0 | -1.233 |
| 38860.0 | -1.235 |
| 38861.0 | -1.239 |
| 38862.0 | -1.246 |
| 38863.0 | -1.253 |
| 38864.0 | -1.255 |
| 38865.0 | -1.254 |
| 38866.0 | -1.257 |
| 38867.0 | -1.251 |
| 38868.0 | -1.248 |
| 38869.0 | -1.251 |
| 38870.0 | -1.259 |
| 38871.0 | -1.269 |
| 38872.0 | -1.269 |
| 38873.0 | -1.26 |
| 38874.0 | -1.252 |
| 38875.0 | -1.236 |
| 38876.0 | -1.232 |
| 38877.0 | -1.234 |
| 38878.0 | -1.235 |
| 38879.0 | -1.243 |
| 38880.0 | -1.242 |
| 38881.0 | -1.24 |
| 38882.0 | -1.242 |
| 38883.0 | -1.249 |
| 38884.0 | -1.252 |
| 38885.0 | -1.245 |
| 38886.0 | -1.243 |
| 38887.0 | -1.246 |
| 38888.0 | -1.252 |
| 38889.0 | -1.254 |
| 38890.0 | -1.256 |
| 38891.0 | -1.256 |
| 38892.0 | -1.254 |
| 38893.0 | -1.258 |
| 38894.0 | -1.266 |
| 38895.0 | -1.284 |
| 38896.0 | -1.306 |
| 38897.0 | -1.325 |
| 38898.0 | -1.344 |
| 38899.0 | -1.358 |
| 38900.0 | -1.377 |
| 38901.0 | -1.393 |
| 38902.0 | -1.401 |
| 38903.0 | -1.414 |
| 38904.0 | -1.43 |
| 38905.0 | -1.448 |
| 38906.0 | -1.464 |
| 38907.0 | -1.476 |
| 38908.0 | -1.489 |
| 38909.0 | -1.501 |
| 38910.0 | -1.506 |
| 38911.0 | -1.495 |
| 38912.0 | -1.495 |
| 38913.0 | -1.501 |
| 38914.0 | -1.511 |
| 38915.0 | -1.525 |
| 38916.0 | -1.541 |
| 38917.0 | -1.555 |
| 38918.0 | -1.566 |
| 38919.0 | -1.578 |
| 38920.0 | -1.593 |
| 38921.0 | -1.605 |
| 38922.0 | -1.618 |
| 38923.0 | -1.626 |
| 38924.0 | -1.63 |
| 38925.0 | -1.623 |
| 38926.0 | -1.612 |
| 38927.0 | -1.611 |
| 38928.0 | -1.616 |
| 38929.0 | -1.612 |
| 38930.0 | -1.605 |
| 38931.0 | -1.604 |
| 38932.0 | -1.612 |
| 38933.0 | -1.624 |
| 38934.0 | -1.64 |
| 38935.0 | -1.657 |
| 38936.0 | -1.675 |
| 38937.0 | -1.683 |
| 38938.0 | -1.694 |
| 38939.0 | -1.713 |
| 38940.0 | -1.73 |
| 38941.0 | -1.743 |
| 38942.0 | -1.75 |
| 38943.0 | -1.756 |
| 38944.0 | -1.766 |
| 38945.0 | -1.781 |
| 38946.0 | -1.793 |
| 38947.0 | -1.8 |
| 38948.0 | -1.785 |
| 38949.0 | -1.766 |
| 38950.0 | -1.755 |
| 38951.0 | -1.752 |
| 38952.0 | -1.754 |
| 38953.0 | -1.761 |
| 38954.0 | -1.771 |
| 38955.0 | -1.777 |
| 38956.0 | -1.771 |
| 38957.0 | -1.766 |
| 38958.0 | -1.765 |
| 38959.0 | -1.756 |
| 38960.0 | -1.729 |
| 38961.0 | -1.685 |
| 38962.0 | -1.634 |
| 38963.0 | -1.569 |
| 38964.0 | -1.552 |
| 38965.0 | -1.539 |
| 38966.0 | -1.524 |
| 38967.0 | -1.507 |
| 38968.0 | -1.51 |
| 38969.0 | -1.518 |
| 38970.0 | -1.524 |
| 38971.0 | -1.542 |
| 38972.0 | -1.54 |
| 38973.0 | -1.511 |
| 38974.0 | -1.472 |
| 38975.0 | -1.475 |
| 38976.0 | -1.477 |
| 38977.0 | -1.487 |
| 38978.0 | -1.498 |
| 38979.0 | -1.505 |
| 38980.0 | -1.509 |
| 38981.0 | -1.519 |
| 38982.0 | -1.523 |
| 38983.0 | -1.534 |
| 38984.0 | -1.543 |
| 38985.0 | -1.552 |
| 38986.0 | -1.57 |
| 38987.0 | -1.587 |
| 38988.0 | -1.607 |
| 38989.0 | -1.628 |
| 38990.0 | -1.647 |
| 38991.0 | -1.67 |
| 38992.0 | -1.688 |
| 38993.0 | -1.713 |
| 38994.0 | -1.735 |
| 38995.0 | -1.755 |
| 38996.0 | -1.778 |
| 38997.0 | -1.803 |
| 38998.0 | -1.818 |
| 38999.0 | -1.823 |
| 39000.0 | -1.838 |
| 39001.0 | -1.838 |
| 39002.0 | -1.848 |
| 39003.0 | -1.862 |
| 39004.0 | -1.873 |
| 39005.0 | -1.892 |
| 39006.0 | -1.909 |
| 39007.0 | -1.918 |
| 39008.0 | 0 |
| 39009.0 | 0 |
| 39010.0 | 0 |
| 39011.0 | 0 |
| 39012.0 | 0 |
| 39013.0 | 0 |
| 39014.0 | 0 |
| 39015.0 | 0 |
| 39016.0 | 0 |
| 39017.0 | 0 |
| 39018.0 | 0 |
| 39019.0 | 0 |
| 39020.0 | -2.057 |
| 39021.0 | -2 |
| 39022.0 | -1.991 |
| 39023.0 | -2.006 |
| 39024.0 | -2.024 |
| 39025.0 | -2.039 |
| 39026.0 | -2.061 |
| 39027.0 | -2.079 |
| 39028.0 | -2.096 |
| 39029.0 | -2.118 |
| 39030.0 | -2.131 |
| 39031.0 | -2.142 |
| 39032.0 | -2.16 |
| 39033.0 | -2.177 |
| 39034.0 | -2.191 |
| 39035.0 | -2.197 |
| 39036.0 | -2.164 |
| 39037.0 | -2.167 |
| 39038.0 | -2.176 |
| 39039.0 | -2.166 |
| 39040.0 | -2.155 |
| 39041.0 | -2.15 |
| 39042.0 | -2.157 |
| 39043.0 | -2.166 |
| 39044.0 | -2.173 |
| 39045.0 | -2.191 |
| 39046.0 | -2.197 |
| 39047.0 | -2.206 |
| 39048.0 | -2.224 |
| 39049.0 | -2.23 |
| 39050.0 | -2.234 |
| 39051.0 | -2.212 |
| 39052.0 | -2.148 |
| 39053.0 | -2.081 |
| 39054.0 | -2.051 |
| 39055.0 | -2.019 |
| 39056.0 | -1.994 |
| 39057.0 | -1.978 |
| 39058.0 | -1.982 |
| 39059.0 | -1.978 |
| 39060.0 | -1.949 |
| 39061.0 | -1.905 |
| 39062.0 | -1.885 |
| 39063.0 | -1.88 |
| 39064.0 | -1.859 |
| 39065.0 | -1.844 |
| 39066.0 | -1.835 |
| 39067.0 | -1.834 |
| 39068.0 | -1.822 |
| 39069.0 | -1.801 |
| 39070.0 | -1.796 |
| 39071.0 | -1.793 |
| 39072.0 | -1.767 |
| 39073.0 | -1.724 |
| 39074.0 | -1.688 |
| 39075.0 | -1.669 |
| 39076.0 | -1.654 |
| 39077.0 | -1.624 |
| 39078.0 | -1.589 |
| 39079.0 | -1.51 |
| 39080.0 | -1.46 |
| 39081.0 | -1.401 |
| 39082.0 | -1.351 |
| 39083.0 | -1.327 |
| 39084.0 | -1.309 |
| 39085.0 | -1.296 |
| 39086.0 | -1.288 |
| 39087.0 | -1.284 |
| 39088.0 | -1.279 |
| 39089.0 | -1.274 |
| 39090.0 | -1.272 |
| 39091.0 | -1.273 |
| 39092.0 | -1.275 |
| 39093.0 | -1.275 |
| 39094.0 | -1.277 |
| 39095.0 | -1.275 |
| 39096.0 | -1.28 |
| 39097.0 | -1.279 |
| 39098.0 | -1.282 |
| 39099.0 | -1.29 |
| 39100.0 | -1.296 |
| 39101.0 | -1.302 |
| 39102.0 | -1.303 |
| 39103.0 | -1.298 |
| 39104.0 | -1.297 |
| 39105.0 | -1.302 |
| 39106.0 | -1.305 |
| 39107.0 | -1.315 |
| 39108.0 | -1.318 |
| 39109.0 | -1.321 |
| 39110.0 | -1.322 |
| 39111.0 | -1.33 |
| 39112.0 | -1.333 |
| 39113.0 | -1.344 |
| 39114.0 | -1.357 |
| 39115.0 | -1.365 |
| 39116.0 | -1.371 |
| 39117.0 | -1.378 |
| 39118.0 | -1.386 |
| 39119.0 | -1.397 |
| 39120.0 | -1.406 |
| 39121.0 | -1.416 |
| 39122.0 | -1.422 |
| 39123.0 | -1.429 |
| 39124.0 | -1.439 |
| 39125.0 | -1.452 |
| 39126.0 | -1.468 |
| 39127.0 | -1.487 |
| 39128.0 | -1.493 |
| 39129.0 | -1.51 |
| 39130.0 | -1.51 |
| 39131.0 | -1.521 |
| 39132.0 | -1.531 |
| 39133.0 | -1.542 |
| 39134.0 | -1.555 |
| 39135.0 | -1.566 |
| 39136.0 | -1.577 |
| 39137.0 | -1.585 |
| 39138.0 | -1.599 |
| 39139.0 | -1.612 |
| 39140.0 | -1.631 |
| 39141.0 | -1.643 |
| 39142.0 | -1.656 |
| 39143.0 | -1.67 |
| 39144.0 | -1.683 |
| 39145.0 | -1.695 |
| 39146.0 | -1.709 |
| 39147.0 | -1.724 |
| 39148.0 | -1.73 |
| 39149.0 | -1.739 |
| 39150.0 | -1.74 |
| 39151.0 | -1.75 |
| 39152.0 | -1.759 |
| 39153.0 | -1.769 |
| 39154.0 | -1.783 |
| 39155.0 | -1.774 |
| 39156.0 | -1.757 |
| 39157.0 | -1.724 |
| 39158.0 | -1.682 |
| 39159.0 | -1.681 |
| 39160.0 | -1.679 |
| 39161.0 | -1.683 |
| 39162.0 | -1.691 |
| 39163.0 | -1.698 |
| 39164.0 | -1.708 |
| 39165.0 | -1.72 |
| 39166.0 | -1.737 |
| 39167.0 | -1.757 |
| 39168.0 | -1.775 |
| 39169.0 | -1.791 |
| 39170.0 | -1.807 |
| 39171.0 | -1.827 |
| 39172.0 | -1.848 |
| 39173.0 | -1.862 |
| 39174.0 | -1.878 |
| 39175.0 | -1.898 |
| 39176.0 | -1.914 |
| 39177.0 | -1.932 |
| 39178.0 | -1.953 |
| 39179.0 | -1.971 |
| 39180.0 | -1.981 |
| 39181.0 | -1.977 |
| 39182.0 | -1.989 |
| 39183.0 | -2.011 |
| 39184.0 | -2.02 |
| 39185.0 | -2.022 |
| 39186.0 | -1.985 |
| 39187.0 | -1.858 |
| 39188.0 | -1.797 |
| 39189.0 | -1.794 |
| 39190.0 | -1.777 |
| 39191.0 | -1.774 |
| 39192.0 | -1.778 |
| 39193.0 | -1.785 |
| 39194.0 | -1.794 |
| 39195.0 | -1.803 |
| 39196.0 | -1.805 |
| 39197.0 | -1.808 |
| 39198.0 | -1.815 |
| 39199.0 | -1.821 |
| 39200.0 | -1.828 |
| 39201.0 | -1.838 |
| 39202.0 | -1.851 |
| 39203.0 | -1.858 |
| 39204.0 | -1.864 |
| 39205.0 | -1.871 |
| 39206.0 | -1.881 |
| 39207.0 | -1.898 |
| 39208.0 | -1.907 |
| 39209.0 | -1.918 |
| 39210.0 | -1.936 |
| 39211.0 | -1.952 |
| 39212.0 | -1.965 |
| 39213.0 | -1.975 |
| 39214.0 | -1.985 |
| 39215.0 | -1.989 |
| 39216.0 | -1.992 |
| 39217.0 | -1.993 |
| 39218.0 | -1.993 |
| 39219.0 | -1.997 |
| 39220.0 | -2.008 |
| 39221.0 | -2.017 |
| 39222.0 | -2.03 |
| 39223.0 | -2.043 |
| 39224.0 | -2.056 |
| 39225.0 | -2.07 |
| 39226.0 | -2.084 |
| 39227.0 | -2.099 |
| 39228.0 | -2.116 |
| 39229.0 | -2.138 |
| 39230.0 | -2.148 |
| 39231.0 | -2.165 |
| 39232.0 | -2.177 |
| 39233.0 | -2.193 |
| 39234.0 | -2.203 |
| 39235.0 | -2.203 |
| 39236.0 | -2.206 |
| 39237.0 | -2.219 |
| 39238.0 | -2.232 |
| 39239.0 | -2.247 |
| 39240.0 | -2.254 |
| 39241.0 | -2.256 |
| 39242.0 | -2.259 |
| 39243.0 | -2.264 |
| 39244.0 | -2.271 |
| 39245.0 | -2.281 |
| 39246.0 | -2.291 |
| 39247.0 | -2.303 |
| 39248.0 | -2.312 |
| 39249.0 | -2.318 |
| 39250.0 | -2.326 |
| 39251.0 | -2.334 |
| 39252.0 | -2.34 |
| 39253.0 | -2.343 |
| 39254.0 | -2.353 |
| 39255.0 | -2.359 |
| 39256.0 | -2.359 |
| 39257.0 | -2.367 |
| 39258.0 | -2.369 |
| 39259.0 | -2.349 |
| 39260.0 | -2.346 |
| 39261.0 | -2.351 |
| 39262.0 | -2.351 |
| 39263.0 | -2.292 |
| 39264.0 | -2.083 |
| 39265.0 | -1.869 |
| 39266.0 | -1.869 |
| 39267.0 | -1.791 |
| 39268.0 | -1.722 |
| 39269.0 | -1.682 |
| 39270.0 | -1.665 |
| 39271.0 | -1.66 |
| 39272.0 | -1.658 |
| 39273.0 | -1.663 |
| 39274.0 | -1.672 |
| 39275.0 | -1.685 |
| 39276.0 | -1.703 |
| 39277.0 | -1.725 |
| 39278.0 | -1.744 |
| 39279.0 | -1.77 |
| 39280.0 | -1.795 |
| 39281.0 | -1.821 |
| 39282.0 | -1.849 |
| 39283.0 | -1.877 |
| 39284.0 | -1.904 |
| 39285.0 | -1.927 |
| 39286.0 | -1.956 |
| 39287.0 | -1.97 |
| 39288.0 | -1.965 |
| 39289.0 | -1.942 |
| 39290.0 | -1.909 |
| 39291.0 | -1.878 |
| 39292.0 | -1.858 |
| 39293.0 | -1.81 |
| 39294.0 | -1.74 |
| 39295.0 | -1.697 |
| 39296.0 | -1.678 |
| 39297.0 | -1.668 |
| 39298.0 | -1.662 |
| 39299.0 | -1.655 |
| 39300.0 | -1.648 |
| 39301.0 | -1.64 |
| 39302.0 | -1.636 |
| 39303.0 | -1.635 |
| 39304.0 | -1.634 |
| 39305.0 | -1.608 |
| 39306.0 | -1.567 |
| 39307.0 | -1.551 |
| 39308.0 | -1.553 |
| 39309.0 | -1.56 |
| 39310.0 | -1.571 |
| 39311.0 | -1.582 |
| 39312.0 | -1.592 |
| 39313.0 | -1.599 |
| 39314.0 | -1.604 |
| 39315.0 | -1.613 |
| 39316.0 | -1.618 |
| 39317.0 | -1.624 |
| 39318.0 | -1.629 |
| 39319.0 | -1.638 |
| 39320.0 | -1.649 |
| 39321.0 | -1.653 |
| 39322.0 | -1.657 |
| 39323.0 | 0 |
| 39324.0 | 0 |
| 39325.0 | 0 |
| 39326.0 | 0 |
| 39327.0 | 0 |
| 39328.0 | 0 |
| 39329.0 | -1.611 |
| 39330.0 | -1.593 |
| 39331.0 | -1.589 |
| 39332.0 | -1.59 |
| 39333.0 | -1.592 |
| 39334.0 | -1.593 |
| 39335.0 | -1.592 |
| 39336.0 | -1.597 |
| 39337.0 | -1.605 |
| 39338.0 | -1.611 |
| 39339.0 | -1.625 |
| 39340.0 | -1.633 |
| 39341.0 | -1.643 |
| 39342.0 | -1.655 |
| 39343.0 | -1.669 |
| 39344.0 | -1.683 |
| 39345.0 | -1.7 |
| 39346.0 | -1.717 |
| 39347.0 | -1.732 |
| 39348.0 | -1.734 |
| 39349.0 | -1.733 |
| 39350.0 | -1.745 |
| 39351.0 | -1.759 |
| 39352.0 | -1.774 |
| 39353.0 | -1.792 |
| 39354.0 | -1.813 |
| 39355.0 | -1.835 |
| 39356.0 | -1.852 |
| 39357.0 | -1.865 |
| 39358.0 | -1.864 |
| 39359.0 | -1.861 |
| 39360.0 | -1.852 |
| 39361.0 | -1.853 |
| 39362.0 | -1.841 |
| 39363.0 | -1.832 |
| 39364.0 | -1.838 |
| 39365.0 | -1.85 |
| 39366.0 | -1.863 |
| 39367.0 | -1.877 |
| 39368.0 | -1.884 |
| 39369.0 | -1.86 |
| 39370.0 | -1.742 |
| 39371.0 | -1.67 |
| 39372.0 | -1.577 |
| 39373.0 | -1.462 |
| 39374.0 | -1.412 |
| 39375.0 | -1.393 |
| 39376.0 | -1.375 |
| 39377.0 | -1.359 |
| 39378.0 | -1.362 |
| 39379.0 | -1.331 |
| 39380.0 | -1.299 |
| 39381.0 | -1.281 |
| 39382.0 | -1.276 |
| 39383.0 | -1.266 |
| 39384.0 | -1.261 |
| 39385.0 | -1.271 |
| 39386.0 | -1.274 |
| 39387.0 | -1.273 |
| 39388.0 | -1.275 |
| 39389.0 | -1.276 |
| 39390.0 | -1.286 |
| 39391.0 | -1.298 |
| 39392.0 | -1.298 |
| 39393.0 | -1.303 |
| 39394.0 | -1.316 |
| 39395.0 | -1.326 |
| 39396.0 | -1.332 |
| 39397.0 | -1.34 |
| 39398.0 | -1.351 |
| 39399.0 | -1.358 |
| 39400.0 | -1.336 |
| 39401.0 | -1.315 |
| 39402.0 | -1.299 |
| 39403.0 | -1.293 |
| 39404.0 | -1.289 |
| 39405.0 | -1.294 |
| 39406.0 | -1.303 |
| 39407.0 | -1.314 |
| 39408.0 | -1.33 |
| 39409.0 | -1.348 |
| 39410.0 | -1.364 |
| 39411.0 | -1.394 |
| 39412.0 | -1.394 |
| 39413.0 | -1.405 |
| 39414.0 | -1.418 |
| 39415.0 | -1.434 |
| 39416.0 | -1.441 |
| 39417.0 | -1.453 |
| 39418.0 | -1.467 |
| 39419.0 | -1.484 |
| 39420.0 | -1.498 |
| 39421.0 | -1.515 |
| 39422.0 | -1.535 |
| 39423.0 | -1.553 |
| 39424.0 | -1.572 |
| 39425.0 | -1.592 |
| 39426.0 | -1.611 |
| 39427.0 | -1.63 |
| 39428.0 | -1.645 |
| 39429.0 | -1.651 |
| 39430.0 | -1.654 |
| 39431.0 | -1.672 |
| 39432.0 | -1.693 |
| 39433.0 | -1.708 |
| 39434.0 | -1.715 |
| 39435.0 | -1.729 |
| 39436.0 | -1.747 |
| 39437.0 | -1.761 |
| 39438.0 | -1.778 |
| 39439.0 | -1.803 |
| 39440.0 | -1.82 |
| 39441.0 | -1.835 |
| 39442.0 | -1.823 |
| 39443.0 | -1.773 |
| 39444.0 | -1.749 |
| 39445.0 | -1.736 |
| 39446.0 | -1.736 |
| 39447.0 | -1.726 |
| 39448.0 | -1.72 |
| 39449.0 | -1.733 |
| 39450.0 | -1.747 |
| 39451.0 | -1.769 |
| 39452.0 | -1.784 |
| 39453.0 | -1.8 |
| 39454.0 | -1.817 |
| 39455.0 | -1.831 |
| 39456.0 | -1.85 |
| 39457.0 | -1.882 |
| 39458.0 | -1.897 |
| 39459.0 | -1.923 |
| 39460.0 | -1.938 |
| 39461.0 | -1.954 |
| 39462.0 | -1.973 |
| 39463.0 | -1.984 |
| 39464.0 | -1.979 |
| 39465.0 | -1.992 |
| 39466.0 | -2.013 |
| 39467.0 | -2.037 |
| 39468.0 | -2.058 |
| 39469.0 | -2.072 |
| 39470.0 | -2.071 |
| 39471.0 | -2.086 |
| 39472.0 | -2.106 |
| 39473.0 | -2.123 |
| 39474.0 | -2.144 |
| 39475.0 | -2.167 |
| 39476.0 | -2.188 |
| 39477.0 | -2.209 |
| 39478.0 | -2.235 |
| 39479.0 | -2.265 |
| 39480.0 | -2.267 |
| 39481.0 | -2.284 |
| 39482.0 | -2.307 |
| 39483.0 | -2.328 |
| 39484.0 | -2.35 |
| 39485.0 | -2.375 |
| 39486.0 | -2.406 |
| 39487.0 | -2.426 |
| 39488.0 | -2.45 |
| 39489.0 | -2.467 |
| 39490.0 | -2.466 |
| 39491.0 | -2.478 |
| 39492.0 | -2.503 |
| 39493.0 | -2.525 |
| 39494.0 | -2.512 |
| 39495.0 | -2.398 |
| 39496.0 | -2.375 |
| 39497.0 | -2.381 |
| 39498.0 | -2.395 |
| 39499.0 | -2.412 |
| 39500.0 | -2.43 |
| 39501.0 | -2.446 |
| 39502.0 | -2.47 |
| 39503.0 | -2.508 |
| 39504.0 | -2.528 |
| 39505.0 | -2.547 |
| 39506.0 | -2.566 |
| 39507.0 | -2.588 |
| 39508.0 | -2.597 |
| 39509.0 | -2.601 |
| 39510.0 | -2.571 |
| 39511.0 | -2.565 |
| 39512.0 | -2.581 |
| 39513.0 | -2.591 |
| 39514.0 | -2.603 |
| 39515.0 | -2.625 |
| 39516.0 | -2.641 |
| 39517.0 | -2.655 |
| 39518.0 | -2.671 |
| 39519.0 | -2.691 |
| 39520.0 | -2.708 |
| 39521.0 | -2.726 |
| 39522.0 | -2.737 |
| 39523.0 | -2.765 |
| 39524.0 | -2.782 |
| 39525.0 | -2.799 |
| 39526.0 | -2.82 |
| 39527.0 | -2.839 |
| 39528.0 | -2.857 |
| 39529.0 | -2.871 |
| 39530.0 | -2.887 |
| 39531.0 | -2.903 |
| 39532.0 | -2.923 |
| 39533.0 | -2.945 |
| 39534.0 | -2.967 |
| 39535.0 | -2.984 |
| 39536.0 | -2.984 |
| 39537.0 | -2.981 |
| 39538.0 | -2.999 |
| 39539.0 | -3.02 |
| 39540.0 | -3.029 |
| 39541.0 | -3.041 |
| 39542.0 | -3.061 |
| 39543.0 | -3.078 |
| 39544.0 | -3.097 |
| 39545.0 | -3.115 |
| 39546.0 | -3.139 |
| 39547.0 | -3.177 |
| 39548.0 | -3.171 |
| 39549.0 | -3.185 |
| 39550.0 | -3.205 |
| 39551.0 | -3.225 |
| 39552.0 | -3.244 |
| 39553.0 | -3.267 |
| 39554.0 | -3.284 |
| 39555.0 | -3.304 |
| 39556.0 | -3.323 |
| 39557.0 | -3.334 |
| 39558.0 | -3.344 |
| 39559.0 | -3.353 |
| 39560.0 | -3.364 |
| 39561.0 | -3.371 |
| 39562.0 | -3.32 |
| 39563.0 | -3.312 |
| 39564.0 | -3.321 |
| 39565.0 | -3.335 |
| 39566.0 | -3.347 |
| 39567.0 | -3.355 |
| 39568.0 | -3.315 |
| 39569.0 | -3.129 |
| 39570.0 | -3.076 |
| 39571.0 | -3.058 |
| 39572.0 | -3.053 |
| 39573.0 | -3.05 |
| 39574.0 | -3.048 |
| 39575.0 | -3.047 |
| 39576.0 | -3.039 |
| 39577.0 | -3.014 |
| 39578.0 | -2.99 |
| 39579.0 | -2.976 |
| 39580.0 | -2.96 |
| 39581.0 | -2.949 |
| 39582.0 | -2.945 |
| 39583.0 | -2.945 |
| 39584.0 | -2.947 |
| 39585.0 | -2.951 |
| 39586.0 | -2.959 |
| 39587.0 | -2.966 |
| 39588.0 | -2.975 |
| 39589.0 | -2.979 |
| 39590.0 | -2.956 |
| 39591.0 | -2.893 |
| 39592.0 | -2.863 |
| 39593.0 | -2.849 |
| 39594.0 | -2.841 |
| 39595.0 | -2.837 |
| 39596.0 | -2.837 |
| 39597.0 | -2.839 |
| 39598.0 | -2.844 |
| 39599.0 | -2.848 |
| 39600.0 | -2.845 |
| 39601.0 | -2.833 |
| 39602.0 | -2.817 |
| 39603.0 | -2.792 |
| 39604.0 | -2.77 |
| 39605.0 | -2.761 |
| 39606.0 | -2.749 |
| 39607.0 | -2.722 |
| 39608.0 | -2.699 |
| 39609.0 | -2.601 |
| 39610.0 | -2.541 |
| 39611.0 | -2.508 |
| 39612.0 | -2.492 |
| 39613.0 | -2.476 |
| 39614.0 | -2.464 |
| 39615.0 | -2.458 |
| 39616.0 | -2.454 |
| 39617.0 | -2.453 |
| 39618.0 | -2.456 |
| 39619.0 | -2.463 |
| 39620.0 | -2.47 |
| 39621.0 | -2.476 |
| 39622.0 | -2.482 |
| 39623.0 | -2.491 |
| 39624.0 | -2.468 |
| 39625.0 | -2.466 |
| 39626.0 | -2.435 |
| 39627.0 | -2.391 |
| 39628.0 | -2.327 |
| 39629.0 | -2.275 |
| 39630.0 | -2.256 |
| 39631.0 | -2.245 |
| 39632.0 | -2.235 |
| 39633.0 | -2.226 |
| 39634.0 | -2.229 |
| 39635.0 | -2.194 |
| 39636.0 | -2.165 |
| 39637.0 | -2.138 |
| 39638.0 | -2.125 |
| 39639.0 | -2.119 |
| 39640.0 | -2.115 |
| 39641.0 | -2.077 |
| 39642.0 | -2.023 |
| 39643.0 | -1.99 |
| 39644.0 | -1.956 |
| 39645.0 | -1.835 |
| 39646.0 | -1.812 |
| 39647.0 | -1.853 |
| 39648.0 | -1.901 |
| 39649.0 | -1.948 |
| 39650.0 | -1.978 |
| 39651.0 | -1.945 |
| 39652.0 | -1.932 |
| 39653.0 | -1.919 |
| 39654.0 | -1.909 |
| 39655.0 | -1.908 |
| 39656.0 | -1.909 |
| 39657.0 | -1.911 |
| 39658.0 | -1.913 |
| 39659.0 | -1.918 |
| 39660.0 | -1.918 |
| 39661.0 | -1.922 |
| 39662.0 | -1.91 |
| 39663.0 | -1.896 |
| 39664.0 | -1.854 |
| 39665.0 | -1.799 |
| 39666.0 | -1.773 |
| 39667.0 | -1.74 |
| 39668.0 | -1.72 |
| 39669.0 | -1.703 |
| 39670.0 | -1.695 |
| 39671.0 | -1.694 |
| 39672.0 | -1.693 |
| 39673.0 | -1.691 |
| 39674.0 | -1.689 |
| 39675.0 | -1.691 |
| 39676.0 | -1.688 |
| 39677.0 | -1.684 |
| 39678.0 | -1.698 |
| 39679.0 | -1.688 |
| 39680.0 | -1.694 |
| 39681.0 | -1.702 |
| 39682.0 | -1.703 |
| 39683.0 | -1.684 |
| 39684.0 | -1.669 |
| 39685.0 | -1.656 |
| 39686.0 | -1.62 |
| 39687.0 | -1.543 |
| 39688.0 | -1.481 |
| 39689.0 | -1.428 |
| 39690.0 | -1.372 |
| 39691.0 | -1.342 |
| 39692.0 | -1.31 |
| 39693.0 | -1.288 |
| 39694.0 | -1.245 |
| 39695.0 | -1.204 |
| 39696.0 | -1.186 |
| 39697.0 | -1.181 |
| 39698.0 | -1.183 |
| 39699.0 | -1.187 |
| 39700.0 | -1.184 |
| 39701.0 | -1.15 |
| 39702.0 | -1.119 |
| 39703.0 | -1.105 |
| 39704.0 | -1.099 |
| 39705.0 | -1.092 |
| 39706.0 | -1.086 |
| 39707.0 | -1.077 |
| 39708.0 | -1.073 |
| 39709.0 | -1.07 |
| 39710.0 | -1.067 |
| 39711.0 | -1.07 |
| 39712.0 | -1.08 |
| 39713.0 | -1.089 |
| 39714.0 | -1.101 |
| 39715.0 | -1.104 |
| 39716.0 | -1.106 |
| 39717.0 | -1.118 |
| 39718.0 | -1.132 |
| 39719.0 | -1.13 |
| 39720.0 | -1.129 |
| 39721.0 | -1.113 |
| 39722.0 | -1.098 |
| 39723.0 | -1.083 |
| 39724.0 | -1.067 |
| 39725.0 | -1.062 |
| 39726.0 | -1.057 |
| 39727.0 | -1.057 |
| 39728.0 | -1.048 |
| 39729.0 | -1.005 |
| 39730.0 | -0.985 |
| 39731.0 | -0.975 |
| 39732.0 | -0.974 |
| 39733.0 | -0.974 |
| 39734.0 | -0.975 |
| 39735.0 | -0.98 |
| 39736.0 | -0.99 |
| 39737.0 | -1.001 |
| 39738.0 | -1.006 |
| 39739.0 | -1.012 |
| 39740.0 | -1.01 |
| 39741.0 | -1.019 |
| 39742.0 | -1.03 |
| 39743.0 | -1.037 |
| 39744.0 | -1.048 |
| 39745.0 | -1.061 |
| 39746.0 | -1.073 |
| 39747.0 | -1.064 |
| 39748.0 | -1.056 |
| 39749.0 | -1.055 |
| 39750.0 | -1.06 |
| 39751.0 | -1.059 |
| 39752.0 | -1.067 |
| 39753.0 | -1.077 |
| 39754.0 | -1.08 |
| 39755.0 | -1.085 |
| 39756.0 | -1.097 |
| 39757.0 | -1.101 |
| 39758.0 | -1.096 |
| 39759.0 | -1.086 |
| 39760.0 | -1.073 |
| 39761.0 | -1.043 |
| 39762.0 | -1.031 |
| 39763.0 | -1.028 |
| 39764.0 | -1.031 |
| 39765.0 | -1.042 |
| 39766.0 | -1.052 |
| 39767.0 | -1.069 |
| 39768.0 | -1.084 |
| 39769.0 | -1.095 |
| 39770.0 | -1.104 |
| 39771.0 | -1.114 |
| 39772.0 | -1.117 |
| 39773.0 | -1.125 |
| 39774.0 | -1.146 |
| 39775.0 | -1.155 |
| 39776.0 | -1.172 |
| 39777.0 | -1.186 |
| 39778.0 | -1.167 |
| 39779.0 | -1.167 |
| 39780.0 | -1.176 |
| 39781.0 | -1.186 |
| 39782.0 | -1.201 |
| 39783.0 | -1.224 |
| 39784.0 | -1.24 |
| 39785.0 | -1.253 |
| 39786.0 | -1.271 |
| 39787.0 | -1.284 |
| 39788.0 | -1.297 |
| 39789.0 | -1.313 |
| 39790.0 | -1.327 |
| 39791.0 | -1.3 |
| 39792.0 | -1.291 |
| 39793.0 | -1.303 |
| 39794.0 | -1.313 |
| 39795.0 | -1.322 |
| 39796.0 | -1.336 |
| 39797.0 | -1.347 |
| 39798.0 | -1.35 |
| 39799.0 | -1.326 |
| 39800.0 | -1.304 |
| 39801.0 | -1.299 |
| 39802.0 | -1.305 |
| 39803.0 | -1.306 |
| 39804.0 | -1.309 |
| 39805.0 | -1.316 |
| 39806.0 | -1.325 |
| 39807.0 | -1.333 |
| 39808.0 | -1.347 |
| 39809.0 | -1.361 |
| 39810.0 | -1.376 |
| 39811.0 | -1.39 |
| 39812.0 | -1.404 |
| 39813.0 | -1.426 |
| 39814.0 | -1.444 |
| 39815.0 | -1.457 |
| 39816.0 | -1.476 |
| 39817.0 | -1.497 |
| 39818.0 | -1.512 |
| 39819.0 | -1.539 |
| 39820.0 | -1.555 |
| 39821.0 | -1.567 |
| 39822.0 | -1.578 |
| 39823.0 | -1.593 |
| 39824.0 | -1.605 |
| 39825.0 | -1.622 |
| 39826.0 | -1.638 |
| 39827.0 | -1.654 |
| 39828.0 | -1.672 |
| 39829.0 | -1.689 |
| 39830.0 | -1.707 |
| 39831.0 | -1.726 |
| 39832.0 | -1.743 |
| 39833.0 | -1.761 |
| 39834.0 | -1.774 |
| 39835.0 | -1.791 |
| 39836.0 | -1.813 |
| 39837.0 | -1.833 |
| 39838.0 | -1.852 |
| 39839.0 | -1.879 |
| 39840.0 | -1.912 |
| 39841.0 | -1.919 |
| 39842.0 | -1.936 |
| 39843.0 | -1.951 |
| 39844.0 | -1.967 |
| 39845.0 | -1.977 |
| 39846.0 | -1.953 |
| 39847.0 | -1.974 |
| 39848.0 | -1.999 |
| 39849.0 | -2.014 |
| 39850.0 | -2.033 |
| 39851.0 | -2.058 |
| 39852.0 | -2.077 |
| 39853.0 | -2.101 |
| 39854.0 | -2.109 |
| 39855.0 | -2.122 |
| 39856.0 | -2.138 |
| 39857.0 | -2.151 |
| 39858.0 | -2.164 |
| 39859.0 | -2.184 |
| 39860.0 | -2.199 |
| 39861.0 | -2.213 |
| 39862.0 | -2.231 |
| 39863.0 | -2.249 |
| 39864.0 | -2.258 |
| 39865.0 | -2.268 |
| 39866.0 | -2.27 |
| 39867.0 | -2.268 |
| 39868.0 | -2.265 |
| 39869.0 | -2.272 |
| 39870.0 | -2.285 |
| 39871.0 | -2.298 |
| 39872.0 | -2.312 |
| 39873.0 | -2.325 |
| 39874.0 | -2.33 |
| 39875.0 | -2.341 |
| 39876.0 | -2.353 |
| 39877.0 | -2.373 |
| 39878.0 | -2.387 |
| 39879.0 | -2.405 |
| 39880.0 | -2.423 |
| 39881.0 | -2.444 |
| 39882.0 | -2.452 |
| 39883.0 | -2.415 |
| 39884.0 | -2.307 |
| 39885.0 | -1.977 |
| 39886.0 | -1.785 |
| 39887.0 | -1.739 |
| 39888.0 | -1.731 |
| 39889.0 | -1.729 |
| 39890.0 | -1.73 |
| 39891.0 | -1.73 |
| 39892.0 | -1.733 |
| 39893.0 | -1.726 |
| 39894.0 | -1.722 |
| 39895.0 | -1.723 |
| 39896.0 | -1.729 |
| 39897.0 | -1.735 |
| 39898.0 | -1.743 |
| 39899.0 | -1.751 |
| 39900.0 | -1.765 |
| 39901.0 | -1.776 |
| 39902.0 | -1.786 |
| 39903.0 | -1.799 |
| 39904.0 | -1.812 |
| 39905.0 | -1.825 |
| 39906.0 | -1.838 |
| 39907.0 | -1.851 |
| 39908.0 | -1.868 |
| 39909.0 | -1.88 |
| 39910.0 | -1.892 |
| 39911.0 | -1.902 |
| 39912.0 | -1.893 |
| 39913.0 | -1.893 |
| 39914.0 | -1.881 |
| 39915.0 | -1.876 |
| 39916.0 | -1.868 |
| 39917.0 | -1.869 |
| 39918.0 | -1.875 |
| 39919.0 | -1.879 |
| 39920.0 | -1.893 |
| 39921.0 | -1.901 |
| 39922.0 | -1.912 |
| 39923.0 | -1.925 |
| 39924.0 | -1.932 |
| 39925.0 | -1.944 |
| 39926.0 | -1.954 |
| 39927.0 | -1.967 |
| 39928.0 | -1.978 |
| 39929.0 | -1.989 |
| 39930.0 | -1.983 |
| 39931.0 | -1.976 |
| 39932.0 | -1.981 |
| 39933.0 | -1.986 |
| 39934.0 | -1.996 |
| 39935.0 | -2.01 |
| 39936.0 | -2.023 |
| 39937.0 | -2.036 |
| 39938.0 | -2.046 |
| 39939.0 | -2.051 |
| 39940.0 | -2.052 |
| 39941.0 | -2.057 |
| 39942.0 | -2.052 |
| 39943.0 | -2.053 |
| 39944.0 | -2.046 |
| 39945.0 | -1.989 |
| 39946.0 | -1.665 |
| 39947.0 | -1.342 |
| 39948.0 | -1.213 |
| 39949.0 | -1.122 |
| 39950.0 | -1.019 |
| 39951.0 | -0.958 |
| 39952.0 | -0.902 |
| 39953.0 | -0.827 |
| 39954.0 | -0.762 |
| 39955.0 | -0.65 |
| 39956.0 | -0.491 |
| 39957.0 | -0.282 |
| 39958.0 | -0.129 |
| 39959.0 | -0.051 |
| 39960.0 | 0.014 |
| 39961.0 | 0.125 |
| 39962.0 | 0.05 |
| 39963.0 | 0.06 |
| 39964.0 | 0.113 |
| 39965.0 | 0.142 |
| 39966.0 | 0.159 |
| 39967.0 | 0.162 |
| 39968.0 | 0.164 |
| 39969.0 | 0.164 |
| 39970.0 | 0.166 |
| 39971.0 | 0.166 |
| 39972.0 | 0.156 |
| 39973.0 | 0.146 |
| 39974.0 | 0.14 |
| 39975.0 | 0.136 |
| 39976.0 | 0.132 |
| 39977.0 | 0.131 |
| 39978.0 | 0.128 |
| 39979.0 | 0.123 |
| 39980.0 | 0.121 |
| 39981.0 | 0.125 |
| 39982.0 | 0.115 |
| 39983.0 | 0.109 |
| 39984.0 | 0.115 |
| 39985.0 | 0.128 |
| 39986.0 | 0.128 |
| 39987.0 | 0.123 |
| 39988.0 | 0.121 |
| 39989.0 | 0.127 |
| 39990.0 | 0.131 |
| 39991.0 | 0.131 |
| 39992.0 | 0.128 |
| 39993.0 | 0.122 |
| 39994.0 | 0.114 |
| 39995.0 | 0.106 |
| 39996.0 | 0.101 |
| 39997.0 | 0.096 |
| 39998.0 | 0.094 |
| 39999.0 | 0.092 |
| 40000.0 | 0.09 |
| 40001.0 | 0.072 |
| 40002.0 | 0.058 |
| 40003.0 | 0.054 |
| 40004.0 | 0.039 |
| 40005.0 | 0.026 |
| 40006.0 | 0.018 |
| 40007.0 | 0.011 |
| 40008.0 | 0.023 |
| 40009.0 | 0.022 |
| 40010.0 | 0.009 |
| 40011.0 | -0.005 |
| 40012.0 | -0.021 |
| 40013.0 | -0.025 |
| 40014.0 | -0.037 |
| 40015.0 | -0.044 |
| 40016.0 | -0.024 |
| 40017.0 | -0.01 |
| 40018.0 | -0.001 |
| 40019.0 | 0.003 |
| 40020.0 | -0.001 |
| 40021.0 | -0.004 |
| 40022.0 | -0.014 |
| 40023.0 | -0.016 |
| 40024.0 | -0.022 |
| 40025.0 | -0.028 |
| 40026.0 | -0.031 |
| 40027.0 | -0.034 |
| 40028.0 | -0.038 |
| 40029.0 | -0.043 |
| 40030.0 | -0.038 |
| 40031.0 | -0.035 |
| 40032.0 | -0.04 |
| 40033.0 | -0.051 |
| 40034.0 | -0.052 |
| 40035.0 | -0.061 |
| 40036.0 | -0.071 |
| 40037.0 | -0.054 |
| 40038.0 | 0.014 |
| 40039.0 | 0.024 |
| 40040.0 | 0.018 |
| 40041.0 | 0.025 |
| 40042.0 | 0.037 |
| 40043.0 | 0.041 |
| 40044.0 | 0.045 |
| 40045.0 | 0.042 |
| 40046.0 | 0.036 |
| 40047.0 | 0.03 |
| 40048.0 | 0.024 |
| 40049.0 | 0.017 |
| 40050.0 | 0.011 |
| 40051.0 | 0.011 |
| 40052.0 | 0.028 |
| 40053.0 | 0.019 |
| 40054.0 | 0.01 |
| 40055.0 | 0.012 |
| 40056.0 | 0.023 |
| 40057.0 | 0.021 |
| 40058.0 | 0.021 |
| 40059.0 | 0.015 |
| 40060.0 | 0 |
| 40061.0 | -0.017 |
| 40062.0 | -0.034 |
| 40063.0 | -0.051 |
| 40064.0 | -0.071 |
| 40065.0 | -0.088 |
| 40066.0 | -0.105 |
| 40067.0 | -0.134 |
| 40068.0 | -0.156 |
| 40069.0 | -0.179 |
| 40070.0 | -0.201 |
| 40071.0 | -0.226 |
| 40072.0 | -0.249 |
| 40073.0 | -0.272 |
| 40074.0 | -0.295 |
| 40075.0 | -0.311 |
| 40076.0 | -0.33 |
| 40077.0 | -0.352 |
| 40078.0 | -0.372 |
| 40079.0 | -0.39 |
| 40080.0 | -0.396 |
| 40081.0 | -0.412 |
| 40082.0 | -0.437 |
| 40083.0 | -0.456 |
| 40084.0 | -0.472 |
| 40085.0 | -0.483 |
| 40086.0 | -0.491 |
| 40087.0 | -0.503 |
| 40088.0 | -0.518 |
| 40089.0 | -0.534 |
| 40090.0 | -0.546 |
| 40091.0 | -0.555 |
| 40092.0 | -0.567 |
| 40093.0 | -0.582 |
| 40094.0 | -0.592 |
| 40095.0 | -0.598 |
| 40096.0 | -0.607 |
| 40097.0 | -0.615 |
| 40098.0 | -0.615 |
| 40099.0 | -0.627 |
| 40100.0 | -0.634 |
| 40101.0 | -0.647 |
| 40102.0 | -0.658 |
| 40103.0 | -0.668 |
| 40104.0 | -0.68 |
| 40105.0 | -0.69 |
| 40106.0 | -0.691 |
| 40107.0 | -0.696 |
| 40108.0 | -0.704 |
| 40109.0 | -0.713 |
| 40110.0 | -0.718 |
| 40111.0 | -0.725 |
| 40112.0 | -0.731 |
| 40113.0 | -0.725 |
| 40114.0 | -0.721 |
| 40115.0 | -0.712 |
| 40116.0 | -0.687 |
| 40117.0 | -0.653 |
| 40118.0 | -0.642 |
| 40119.0 | -0.638 |
| 40120.0 | -0.639 |
| 40121.0 | -0.646 |
| 40122.0 | -0.652 |
| 40123.0 | -0.663 |
| 40124.0 | -0.672 |
| 40125.0 | -0.682 |
| 40126.0 | -0.686 |
| 40127.0 | -0.691 |
| 40128.0 | -0.697 |
| 40129.0 | -0.695 |
| 40130.0 | -0.7 |
| 40131.0 | -0.698 |
| 40132.0 | -0.698 |
| 40133.0 | -0.699 |
| 40134.0 | -0.708 |
| 40135.0 | -0.717 |
| 40136.0 | -0.724 |
| 40137.0 | -0.742 |
| 40138.0 | -0.747 |
| 40139.0 | -0.764 |
| 40140.0 | -0.773 |
| 40141.0 | -0.795 |
| 40142.0 | -0.821 |
| 40143.0 | -0.833 |
| 40144.0 | -0.846 |
| 40145.0 | -0.866 |
| 40146.0 | -0.882 |
| 40147.0 | -0.887 |
| 40148.0 | -0.907 |
| 40149.0 | -0.92 |
| 40150.0 | -0.938 |
| 40151.0 | -0.955 |
| 40152.0 | -0.972 |
| 40153.0 | -0.989 |
| 40154.0 | -0.986 |
| 40155.0 | -0.982 |
| 40156.0 | -0.99 |
| 40157.0 | -0.999 |
| 40158.0 | -1.016 |
| 40159.0 | -1.037 |
| 40160.0 | -1.05 |
| 40161.0 | -1.061 |
| 40162.0 | -1.076 |
| 40163.0 | -1.098 |
| 40164.0 | -1.107 |
| 40165.0 | -1.126 |
| 40166.0 | -1.141 |
| 40167.0 | -1.165 |
| 40168.0 | -1.174 |
| 40169.0 | -1.183 |
| 40170.0 | -1.197 |
| 40171.0 | -1.215 |
| 40172.0 | -1.234 |
| 40173.0 | -1.245 |
| 40174.0 | -1.259 |
| 40175.0 | -1.274 |
| 40176.0 | -1.291 |
| 40177.0 | -1.302 |
| 40178.0 | -1.292 |
| 40179.0 | -1.299 |
| 40180.0 | -1.318 |
| 40181.0 | -1.335 |
| 40182.0 | -1.34 |
| 40183.0 | -1.357 |
| 40184.0 | -1.373 |
| 40185.0 | -1.386 |
| 40186.0 | -1.402 |
| 40187.0 | -1.388 |
| 40188.0 | -1.334 |
| 40189.0 | -1.277 |
| 40190.0 | -1.237 |
| 40191.0 | -1.215 |
| 40192.0 | -1.201 |
| 40193.0 | -1.192 |
| 40194.0 | -1.193 |
| 40195.0 | -1.202 |
| 40196.0 | -1.212 |
| 40197.0 | -1.229 |
| 40198.0 | -1.24 |
| 40199.0 | -1.238 |
| 40200.0 | -1.211 |
| 40201.0 | -1.177 |
| 40202.0 | -1.173 |
| 40203.0 | -1.178 |
| 40204.0 | -1.187 |
| 40205.0 | -1.201 |
| 40206.0 | -1.215 |
| 40207.0 | -1.227 |
| 40208.0 | -1.244 |
| 40209.0 | -1.26 |
| 40210.0 | -1.279 |
| 40211.0 | -1.296 |
| 40212.0 | -1.312 |
| 40213.0 | -1.331 |
| 40214.0 | -1.348 |
| 40215.0 | -1.366 |
| 40216.0 | -1.387 |
| 40217.0 | -1.407 |
| 40218.0 | -1.428 |
| 40219.0 | -1.446 |
| 40220.0 | -1.461 |
| 40221.0 | -1.479 |
| 40222.0 | -1.493 |
| 40223.0 | -1.504 |
| 40224.0 | -1.522 |
| 40225.0 | -1.533 |
| 40226.0 | -1.548 |
| 40227.0 | -1.555 |
| 40228.0 | -1.558 |
| 40229.0 | -1.569 |
| 40230.0 | -1.584 |
| 40231.0 | -1.602 |
| 40232.0 | -1.623 |
| 40233.0 | -1.647 |
| 40234.0 | -1.669 |
| 40235.0 | -1.694 |
| 40236.0 | -1.716 |
| 40237.0 | -1.738 |
| 40238.0 | -1.747 |
| 40239.0 | -1.794 |
| 40240.0 | -1.823 |
| 40241.0 | -1.853 |
| 40242.0 | -1.874 |
| 40243.0 | -1.894 |
| 40244.0 | -1.915 |
| 40245.0 | -1.937 |
| 40246.0 | -1.959 |
| 40247.0 | -1.979 |
| 40248.0 | -1.977 |
| 40249.0 | -1.991 |
| 40250.0 | -2.004 |
| 40251.0 | -2.008 |
| 40252.0 | -2.03 |
| 40253.0 | -2.052 |
| 40254.0 | -2.063 |
| 40255.0 | -2.069 |
| 40256.0 | -2.083 |
| 40257.0 | -2.103 |
| 40258.0 | -2.12 |
| 40259.0 | -2.139 |
| 40260.0 | -2.159 |
| 40261.0 | -2.176 |
| 40262.0 | -2.194 |
| 40263.0 | -2.212 |
| 40264.0 | -2.23 |
| 40265.0 | -2.248 |
| 40266.0 | -2.267 |
| 40267.0 | -2.289 |
| 40268.0 | -2.308 |
| 40269.0 | -2.327 |
| 40270.0 | -2.35 |
| 40271.0 | -2.374 |
| 40272.0 | -2.381 |
| 40273.0 | -2.383 |
| 40274.0 | -2.403 |
| 40275.0 | -2.413 |
| 40276.0 | -2.426 |
| 40277.0 | -2.443 |
| 40278.0 | -2.462 |
| 40279.0 | -2.479 |
| 40280.0 | -2.499 |
| 40281.0 | -2.518 |
| 40282.0 | -2.535 |
| 40283.0 | -2.553 |
| 40284.0 | -2.573 |
| 40285.0 | -2.59 |
| 40286.0 | -2.609 |
| 40287.0 | -2.626 |
| 40288.0 | -2.647 |
| 40289.0 | -2.665 |
| 40290.0 | -2.689 |
| 40291.0 | -2.706 |
| 40292.0 | -2.719 |
| 40293.0 | -2.729 |
| 40294.0 | -2.722 |
| 40295.0 | -2.681 |
| 40296.0 | -2.672 |
| 40297.0 | -2.669 |
| 40298.0 | -2.679 |
| 40299.0 | -2.68 |
| 40300.0 | -2.677 |
| 40301.0 | -2.679 |
| 40302.0 | -2.694 |
| 40303.0 | -2.689 |
| 40304.0 | -2.696 |
| 40305.0 | -2.703 |
| 40306.0 | -2.709 |
| 40307.0 | -2.717 |
| 40308.0 | -2.727 |
| 40309.0 | -2.734 |
| 40310.0 | -2.746 |
| 40311.0 | -2.749 |
| 40312.0 | -2.747 |
| 40313.0 | -2.751 |
| 40314.0 | -2.758 |
| 40315.0 | -2.761 |
| 40316.0 | -2.763 |
| 40317.0 | -2.77 |
| 40318.0 | -2.775 |
| 40319.0 | -2.784 |
| 40320.0 | -2.793 |
| 40321.0 | -2.803 |
| 40322.0 | -2.812 |
| 40323.0 | -2.809 |
| 40324.0 | -2.754 |
| 40325.0 | -2.643 |
| 40326.0 | -2.591 |
| 40327.0 | -2.56 |
| 40328.0 | -2.526 |
| 40329.0 | -2.485 |
| 40330.0 | -2.464 |
| 40331.0 | -2.452 |
| 40332.0 | -2.444 |
| 40333.0 | -2.437 |
| 40334.0 | -2.434 |
| 40335.0 | -2.428 |
| 40336.0 | -2.391 |
| 40337.0 | -2.295 |
| 40338.0 | -2.25 |
| 40339.0 | -2.229 |
| 40340.0 | -2.209 |
| 40341.0 | -2.169 |
| 40342.0 | -2.141 |
| 40343.0 | -2.117 |
| 40344.0 | -2.055 |
| 40345.0 | -1.986 |
| 40346.0 | -1.979 |
| 40347.0 | -1.959 |
| 40348.0 | -1.936 |
| 40349.0 | -1.888 |
| 40350.0 | -1.826 |
| 40351.0 | -1.762 |
| 40352.0 | -1.71 |
| 40353.0 | -1.68 |
| 40354.0 | -1.656 |
| 40355.0 | -1.64 |
| 40356.0 | -1.626 |
| 40357.0 | -1.615 |
| 40358.0 | -1.606 |
| 40359.0 | -1.594 |
| 40360.0 | -1.584 |
| 40361.0 | -1.573 |
| 40362.0 | -1.564 |
| 40363.0 | -1.559 |
| 40364.0 | -1.552 |
| 40365.0 | -1.548 |
| 40366.0 | -1.546 |
| 40367.0 | -1.541 |
| 40368.0 | -1.533 |
| 40369.0 | -1.528 |
| 40370.0 | -1.525 |
| 40371.0 | -1.525 |
| 40372.0 | -1.522 |
| 40373.0 | -1.522 |
| 40374.0 | -1.523 |
| 40375.0 | -1.525 |
| 40376.0 | -1.525 |
| 40377.0 | -1.525 |
| 40378.0 | -1.524 |
| 40379.0 | -1.523 |
| 40380.0 | -1.52 |
| 40381.0 | -1.529 |
| 40382.0 | -1.532 |
| 40383.0 | -1.536 |
| 40384.0 | -1.541 |
| 40385.0 | -1.542 |
| 40386.0 | -1.541 |
| 40387.0 | -1.537 |
| 40388.0 | -1.537 |
| 40389.0 | -1.537 |
| 40390.0 | -1.539 |
| 40391.0 | -1.528 |
| 40392.0 | -1.411 |
| 40393.0 | -1.183 |
| 40394.0 | -1.125 |
| 40395.0 | -1.113 |
| 40396.0 | -1.107 |
| 40397.0 | -1.103 |
| 40398.0 | -1.099 |
| 40399.0 | -1.098 |
| 40400.0 | -1.102 |
| 40401.0 | -1.11 |
| 40402.0 | -1.12 |
| 40403.0 | -1.12 |
| 40404.0 | -1.098 |
| 40405.0 | -1.07 |
| 40406.0 | -1.06 |
| 40407.0 | -1.058 |
| 40408.0 | -1.037 |
| 40409.0 | -0.968 |
| 40410.0 | -0.915 |
| 40411.0 | -0.903 |
| 40412.0 | -0.902 |
| 40413.0 | -0.903 |
| 40414.0 | -0.905 |
| 40415.0 | -0.906 |
| 40416.0 | -0.91 |
| 40417.0 | -0.922 |
| 40418.0 | -0.933 |
| 40419.0 | -0.942 |
| 40420.0 | -0.917 |
| 40421.0 | -0.883 |
| 40422.0 | -0.882 |
| 40423.0 | -0.895 |
| 40424.0 | -0.909 |
| 40425.0 | -0.898 |
| 40426.0 | -0.897 |
| 40427.0 | -0.871 |
| 40428.0 | -0.836 |
| 40429.0 | -0.82 |
| 40430.0 | -0.817 |
| 40431.0 | -0.819 |
| 40432.0 | -0.825 |
| 40433.0 | -0.831 |
| 40434.0 | -0.836 |
| 40435.0 | -0.845 |
| 40436.0 | -0.845 |
| 40437.0 | -0.851 |
| 40438.0 | -0.856 |
| 40439.0 | -0.868 |
| 40440.0 | -0.877 |
| 40441.0 | -0.884 |
| 40442.0 | -0.887 |
| 40443.0 | -0.881 |
| 40444.0 | -0.878 |
| 40445.0 | -0.875 |
| 40446.0 | -0.853 |
| 40447.0 | -0.814 |
| 40448.0 | -0.773 |
| 40449.0 | -0.743 |
| 40450.0 | -0.737 |
| 40451.0 | -0.733 |
| 40452.0 | -0.73 |
| 40453.0 | -0.734 |
| 40454.0 | -0.739 |
| 40455.0 | -0.752 |
| 40456.0 | -0.76 |
| 40457.0 | -0.771 |
| 40458.0 | -0.772 |
| 40459.0 | -0.771 |
| 40460.0 | -0.749 |
| 40461.0 | -0.706 |
| 40462.0 | -0.678 |
| 40463.0 | -0.644 |
| 40464.0 | -0.618 |
| 40465.0 | -0.603 |
| 40466.0 | -0.6 |
| 40467.0 | -0.603 |
| 40468.0 | -0.616 |
| 40469.0 | -0.609 |
| 40470.0 | -0.614 |
| 40471.0 | -0.598 |
| 40472.0 | -0.57 |
| 40473.0 | -0.495 |
| 40474.0 | -0.447 |
| 40475.0 | -0.428 |
| 40476.0 | -0.423 |
| 40477.0 | -0.423 |
| 40478.0 | -0.419 |
| 40479.0 | -0.415 |
| 40480.0 | -0.407 |
| 40481.0 | -0.407 |
| 40482.0 | -0.412 |
| 40483.0 | -0.418 |
| 40484.0 | -0.422 |
| 40485.0 | -0.426 |
| 40486.0 | -0.435 |
| 40487.0 | -0.442 |
| 40488.0 | -0.445 |
| 40489.0 | -0.448 |
| 40490.0 | -0.453 |
| 40491.0 | -0.46 |
| 40492.0 | -0.47 |
| 40493.0 | -0.481 |
| 40494.0 | -0.494 |
| 40495.0 | -0.512 |
| 40496.0 | -0.532 |
| 40497.0 | -0.534 |
| 40498.0 | -0.552 |
| 40499.0 | -0.559 |
| 40500.0 | -0.564 |
| 40501.0 | -0.576 |
| 40502.0 | -0.584 |
| 40503.0 | -0.588 |
| 40504.0 | -0.584 |
| 40505.0 | -0.592 |
| 40506.0 | -0.611 |
| 40507.0 | -0.634 |
| 40508.0 | -0.656 |
| 40509.0 | -0.682 |
| 40510.0 | -0.704 |
| 40511.0 | -0.732 |
| 40512.0 | -0.763 |
| 40513.0 | -0.79 |
| 40514.0 | -0.817 |
| 40515.0 | -0.836 |
| 40516.0 | -0.854 |
| 40517.0 | -0.878 |
| 40518.0 | -0.885 |
| 40519.0 | -0.898 |
| 40520.0 | -0.915 |
| 40521.0 | -0.928 |
| 40522.0 | -0.939 |
| 40523.0 | -0.95 |
| 40524.0 | -0.959 |
| 40525.0 | -0.98 |
| 40526.0 | -0.989 |
| 40527.0 | -0.984 |
| 40528.0 | -1.013 |
| 40529.0 | -1.046 |
| 40530.0 | -1.085 |
| 40531.0 | -1.118 |
| 40532.0 | -1.156 |
| 40533.0 | -1.187 |
| 40534.0 | -1.215 |
| 40535.0 | -1.239 |
| 40536.0 | -1.254 |
| 40537.0 | -1.272 |
| 40538.0 | -1.296 |
| 40539.0 | -1.31 |
| 40540.0 | -1.26 |
| 40541.0 | -1.141 |
| 40542.0 | -1.111 |
| 40543.0 | -1.112 |
| 40544.0 | -1.117 |
| 40545.0 | -1.128 |
| 40546.0 | -1.104 |
| 40547.0 | -1.063 |
| 40548.0 | -1.054 |
| 40549.0 | -1.053 |
| 40550.0 | -1.05 |
| 40551.0 | -1.046 |
| 40552.0 | -1.055 |
| 40553.0 | -1.065 |
| 40554.0 | -1.073 |
| 40555.0 | -1.089 |
| 40556.0 | -1.098 |
| 40557.0 | -1.106 |
| 40558.0 | -1.115 |
| 40559.0 | -1.128 |
| 40560.0 | -1.136 |
| 40561.0 | -1.152 |
| 40562.0 | -1.153 |
| 40563.0 | -1.151 |
| 40564.0 | -1.167 |
| 40565.0 | -1.182 |
| 40566.0 | -1.197 |
| 40567.0 | -1.218 |
| 40568.0 | -1.235 |
| 40569.0 | -1.259 |
| 40570.0 | -1.28 |
| 40571.0 | -1.294 |
| 40572.0 | -1.313 |
| 40573.0 | -1.315 |
| 40574.0 | -1.32 |
| 40575.0 | -1.3 |
| 40576.0 | -1.295 |
| 40577.0 | -1.275 |
| 40578.0 | -1.262 |
| 40579.0 | -1.261 |
| 40580.0 | -1.237 |
| 40581.0 | -1.027 |
| 40582.0 | -0.901 |
| 40583.0 | -0.88 |
| 40584.0 | -0.873 |
| 40585.0 | -0.87 |
| 40586.0 | -0.872 |
| 40587.0 | -0.871 |
| 40588.0 | -0.85 |
| 40589.0 | -0.839 |
| 40590.0 | -0.827 |
| 40591.0 | -0.827 |
| 40592.0 | -0.831 |
| 40593.0 | -0.837 |
| 40594.0 | -0.841 |
| 40595.0 | -0.849 |
| 40596.0 | -0.857 |
| 40597.0 | -0.858 |
| 40598.0 | -0.857 |
| 40599.0 | -0.86 |
| 40600.0 | -0.864 |
| 40601.0 | -0.871 |
| 40602.0 | -0.88 |
| 40603.0 | -0.887 |
| 40604.0 | -0.899 |
| 40605.0 | -0.912 |
| 40606.0 | -0.925 |
| 40607.0 | -0.939 |
| 40608.0 | -0.947 |
| 40609.0 | -0.948 |
| 40610.0 | -0.951 |
| 40611.0 | -0.957 |
| 40612.0 | -0.963 |
| 40613.0 | -0.965 |
| 40614.0 | -0.967 |
| 40615.0 | -0.971 |
| 40616.0 | -0.974 |
| 40617.0 | -0.976 |
| 40618.0 | -0.965 |
| 40619.0 | -0.96 |
| 40620.0 | -0.96 |
| 40621.0 | -0.965 |
| 40622.0 | -0.968 |
| 40623.0 | -0.974 |
| 40624.0 | -0.982 |
| 40625.0 | -0.983 |
| 40626.0 | -0.948 |
| 40627.0 | -0.942 |
| 40628.0 | -0.942 |
| 40629.0 | -0.944 |
| 40630.0 | -0.953 |
| 40631.0 | -0.947 |
| 40632.0 | -0.946 |
| 40633.0 | -0.948 |
| 40634.0 | -0.948 |
| 40635.0 | -0.946 |
| 40636.0 | -0.949 |
| 40637.0 | -0.95 |
| 40638.0 | -0.951 |
| 40639.0 | -0.946 |
| 40640.0 | -0.861 |
| 40641.0 | -0.579 |
| 40642.0 | -0.342 |
| 40643.0 | -0.275 |
| 40644.0 | -0.249 |
| 40645.0 | -0.246 |
| 40646.0 | -0.249 |
| 40647.0 | -0.25 |
| 40648.0 | -0.251 |
| 40649.0 | -0.242 |
| 40650.0 | -0.227 |
| 40651.0 | -0.226 |
| 40652.0 | -0.228 |
| 40653.0 | -0.228 |
| 40654.0 | -0.23 |
| 40655.0 | -0.23 |
| 40656.0 | -0.231 |
| 40657.0 | -0.231 |
| 40658.0 | -0.228 |
| 40659.0 | -0.223 |
| 40660.0 | -0.221 |
| 40661.0 | -0.221 |
| 40662.0 | -0.222 |
| 40663.0 | -0.222 |
| 40664.0 | -0.224 |
| 40665.0 | -0.226 |
| 40666.0 | -0.228 |
| 40667.0 | -0.218 |
| 40668.0 | -0.2 |
| 40669.0 | -0.195 |
| 40670.0 | -0.184 |
| 40671.0 | -0.112 |
| 40672.0 | 0.004 |
| 40673.0 | 0.035 |
| 40674.0 | 0.041 |
| 40675.0 | 0.043 |
| 40676.0 | 0.04 |
| 40677.0 | 0.036 |
| 40678.0 | 0.036 |
| 40679.0 | 0.04 |
| 40680.0 | 0.043 |
| 40681.0 | 0.055 |
| 40682.0 | 0.07 |
| 40683.0 | 0.105 |
| 40684.0 | 0.106 |
| 40685.0 | 0.099 |
| 40686.0 | 0.09 |
| 40687.0 | 0.083 |
| 40688.0 | 0.074 |
| 40689.0 | 0.066 |
| 40690.0 | 0.058 |
| 40691.0 | 0.049 |
| 40692.0 | 0.042 |
| 40693.0 | 0.032 |
| 40694.0 | 0.024 |
| 40695.0 | 0.017 |
| 40696.0 | 0.013 |
| 40697.0 | 0.009 |
| 40698.0 | 0.015 |
| 40699.0 | 0.02 |
| 40700.0 | 0.02 |
| 40701.0 | 0.022 |
| 40702.0 | 0.025 |
| 40703.0 | 0.024 |
| 40704.0 | 0.017 |
| 40705.0 | 0.009 |
| 40706.0 | 0.005 |
| 40707.0 | 0.001 |
| 40708.0 | 0.002 |
| 40709.0 | -0.002 |
| 40710.0 | 0.001 |
| 40711.0 | 0 |
| 40712.0 | -0.003 |
| 40713.0 | -0.013 |
| 40714.0 | -0.013 |
| 40715.0 | -0.003 |
| 40716.0 | -0.005 |
| 40717.0 | -0.012 |
| 40718.0 | -0.017 |
| 40719.0 | -0.022 |
| 40720.0 | -0.02 |
| 40721.0 | -0.008 |
| 40722.0 | -0.008 |
| 40723.0 | -0.012 |
| 40724.0 | -0.015 |
| 40725.0 | -0.018 |
| 40726.0 | -0.018 |
| 40727.0 | -0.023 |
| 40728.0 | -0.032 |
| 40729.0 | -0.049 |
| 40730.0 | -0.066 |
| 40731.0 | -0.083 |
| 40732.0 | -0.097 |
| 40733.0 | -0.115 |
| 40734.0 | -0.121 |
| 40735.0 | -0.127 |
| 40736.0 | -0.128 |
| 40737.0 | -0.142 |
| 40738.0 | -0.153 |
| 40739.0 | -0.155 |
| 40740.0 | -0.149 |
| 40741.0 | -0.028 |
| 40742.0 | 0.018 |
| 40743.0 | 0.026 |
| 40744.0 | 0.027 |
| 40745.0 | 0.024 |
| 40746.0 | 0.019 |
| 40747.0 | 0.011 |
| 40748.0 | 0.009 |
| 40749.0 | 0.01 |
| 40750.0 | 0.022 |
| 40751.0 | 0.015 |
| 40752.0 | -0.003 |
| 40753.0 | -0.014 |
| 40754.0 | 0.019 |
| 40755.0 | 0.042 |
| 40756.0 | 0.04 |
| 40757.0 | 0.028 |
| 40758.0 | 0.02 |
| 40759.0 | 0.015 |
| 40760.0 | 0.011 |
| 40761.0 | 0.011 |
| 40762.0 | 0.032 |
| 40763.0 | 0.033 |
| 40764.0 | 0.032 |
| 40765.0 | 0.024 |
| 40766.0 | 0.014 |
| 40767.0 | 0.021 |
| 40768.0 | 0.022 |
| 40769.0 | 0.016 |
| 40770.0 | 0.024 |
| 40771.0 | 0.019 |
| 40772.0 | 0.012 |
| 40773.0 | 0.004 |
| 40774.0 | -0.003 |
| 40775.0 | -0.011 |
| 40776.0 | -0.025 |
| 40777.0 | -0.041 |
| 40778.0 | -0.059 |
| 40779.0 | -0.044 |
| 40780.0 | -0.031 |
| 40781.0 | -0.007 |
| 40782.0 | 0.021 |
| 40783.0 | 0.092 |
| 40784.0 | 0.123 |
| 40785.0 | 0.135 |
| 40786.0 | 0.164 |
| 40787.0 | 0.163 |
| 40788.0 | 0.148 |
| 40789.0 | 0.137 |
| 40790.0 | 0.131 |
| 40791.0 | 0.127 |
| 40792.0 | 0.122 |
| 40793.0 | 0.114 |
| 40794.0 | 0.103 |
| 40795.0 | 0.102 |
| 40796.0 | 0.097 |
| 40797.0 | 0.095 |
| 40798.0 | 0.112 |
| 40799.0 | 0.186 |
| 40800.0 | 0.183 |
| 40801.0 | 0.168 |
| 40802.0 | 0.173 |
| 40803.0 | 0.167 |
| 40804.0 | 0.154 |
| 40805.0 | 0.14 |
| 40806.0 | 0.144 |
| 40807.0 | 0.137 |
| 40808.0 | 0.135 |
| 40809.0 | 0.13 |
| 40810.0 | 0.135 |
| 40811.0 | 0.142 |
| 40812.0 | 0.13 |
| 40813.0 | 0.108 |
| 40814.0 | 0.101 |
| 40815.0 | 0.089 |
| 40816.0 | 0.077 |
| 40817.0 | 0.06 |
| 40818.0 | 0.045 |
| 40819.0 | 0.034 |
| 40820.0 | 0.022 |
| 40821.0 | 0.009 |
| 40822.0 | 0.004 |
| 40823.0 | -0.006 |
| 40824.0 | -0.018 |
| 40825.0 | -0.031 |
| 40826.0 | -0.05 |
| 40827.0 | -0.077 |
| 40828.0 | -0.097 |
| 40829.0 | -0.119 |
| 40830.0 | -0.14 |
| 40831.0 | -0.162 |
| 40832.0 | -0.182 |
| 40833.0 | -0.205 |
| 40834.0 | -0.168 |
| 40835.0 | -0.02 |
| 40836.0 | 0.039 |
| 40837.0 | 0.211 |
| 40838.0 | 0.212 |
| 40839.0 | 0.048 |
| 40840.0 | 0.006 |
| 40841.0 | -0.005 |
| 40842.0 | 0.021 |
| 40843.0 | 0.03 |
| 40844.0 | 0.048 |
| 40845.0 | 0.185 |
| 40846.0 | 0.049 |
| 40847.0 | 0 |
| 40848.0 | -0.023 |
| 40849.0 | -0.03 |
| 40850.0 | -0.029 |
| 40851.0 | -0.035 |
| 40852.0 | -0.044 |
| 40853.0 | -0.043 |
| 40854.0 | -0.028 |
| 40855.0 | -0.032 |
| 40856.0 | -0.047 |
| 40857.0 | -0.06 |
| 40858.0 | -0.074 |
| 40859.0 | -0.085 |
| 40860.0 | -0.09 |
| 40861.0 | -0.104 |
| 40862.0 | -0.126 |
| 40863.0 | -0.141 |
| 40864.0 | -0.159 |
| 40865.0 | -0.178 |
| 40866.0 | -0.174 |
| 40867.0 | -0.157 |
| 40868.0 | -0.073 |
| 40869.0 | -0.028 |
| 40870.0 | -0.006 |
| 40871.0 | 0.006 |
| 40872.0 | 0.007 |
| 40873.0 | 0.006 |
| 40874.0 | 0.002 |
| 40875.0 | -0.024 |
| 40876.0 | -0.039 |
| 40877.0 | -0.056 |
| 40878.0 | -0.077 |
| 40879.0 | -0.105 |
| 40880.0 | -0.137 |
| 40881.0 | -0.166 |
| 40882.0 | -0.197 |
| 40883.0 | -0.229 |
| 40884.0 | -0.246 |
| 40885.0 | -0.263 |
| 40886.0 | -0.28 |
| 40887.0 | -0.303 |
| 40888.0 | -0.324 |
| 40889.0 | -0.344 |
| 40890.0 | -0.368 |
| 40891.0 | -0.39 |
| 40892.0 | -0.414 |
| 40893.0 | -0.424 |
| 40894.0 | -0.442 |
| 40895.0 | -0.463 |
| 40896.0 | -0.485 |
| 40897.0 | -0.505 |
| 40898.0 | -0.527 |
| 40899.0 | -0.539 |
| 40900.0 | -0.552 |
| 40901.0 | -0.562 |
| 40902.0 | -0.573 |
| 40903.0 | -0.585 |
| 40904.0 | -0.603 |
| 40905.0 | -0.614 |
| 40906.0 | -0.63 |
| 40907.0 | -0.643 |
| 40908.0 | -0.654 |
| 40909.0 | -0.669 |
| 40910.0 | -0.689 |
| 40911.0 | -0.705 |
| 40912.0 | -0.721 |
| 40913.0 | -0.744 |
| 40914.0 | -0.754 |
| 40915.0 | -0.767 |
| 40916.0 | -0.783 |
| 40917.0 | -0.798 |
| 40918.0 | -0.818 |
| 40919.0 | -0.831 |
| 40920.0 | -0.836 |
| 40921.0 | -0.781 |
| 40922.0 | -0.522 |
| 40923.0 | -0.442 |
| 40924.0 | -0.423 |
| 40925.0 | -0.429 |
| 40926.0 | -0.44 |
| 40927.0 | -0.45 |
| 40928.0 | -0.458 |
| 40929.0 | -0.468 |
| 40930.0 | -0.477 |
| 40931.0 | -0.487 |
| 40932.0 | -0.496 |
| 40933.0 | -0.507 |
| 40934.0 | -0.517 |
| 40935.0 | -0.528 |
| 40936.0 | -0.536 |
| 40937.0 | -0.542 |
| 40938.0 | -0.55 |
| 40939.0 | -0.553 |
| 40940.0 | -0.569 |
| 40941.0 | -0.583 |
| 40942.0 | -0.602 |
| 40943.0 | -0.62 |
| 40944.0 | -0.635 |
| 40945.0 | -0.654 |
| 40946.0 | -0.675 |
| 40947.0 | -0.697 |
| 40948.0 | -0.717 |
| 40949.0 | -0.737 |
| 40950.0 | -0.754 |
| 40951.0 | -0.775 |
| 40952.0 | -0.796 |
| 40953.0 | -0.818 |
| 40954.0 | -0.838 |
| 40955.0 | -0.856 |
| 40956.0 | -0.876 |
| 40957.0 | -0.891 |
| 40958.0 | -0.913 |
| 40959.0 | -0.934 |
| 40960.0 | -0.95 |
| 40961.0 | -0.956 |
| 40962.0 | -0.916 |
| 40963.0 | -0.695 |
| 40964.0 | -0.618 |
| 40965.0 | -0.599 |
| 40966.0 | -0.599 |
| 40967.0 | -0.605 |
| 40968.0 | -0.612 |
| 40969.0 | -0.581 |
| 40970.0 | -0.529 |
| 40971.0 | -0.49 |
| 40972.0 | -0.409 |
| 40973.0 | -0.352 |
| 40974.0 | -0.336 |
| 40975.0 | -0.332 |
| 40976.0 | -0.332 |
| 40977.0 | -0.333 |
| 40978.0 | -0.335 |
| 40979.0 | -0.323 |
| 40980.0 | -0.227 |
| 40981.0 | -0.184 |
| 40982.0 | -0.175 |
| 40983.0 | -0.172 |
| 40984.0 | -0.132 |
| 40985.0 | -0.122 |
| 40986.0 | -0.122 |
| 40987.0 | -0.12 |
| 40988.0 | -0.116 |
| 40989.0 | -0.121 |
| 40990.0 | -0.127 |
| 40991.0 | -0.133 |
| 40992.0 | -0.129 |
| 40993.0 | -0.153 |
| 40994.0 | -0.163 |
| 40995.0 | -0.173 |
| 40996.0 | -0.187 |
| 40997.0 | -0.193 |
| 40998.0 | -0.205 |
| 40999.0 | -0.218 |
| 41000.0 | -0.234 |
| 41001.0 | -0.248 |
| 41002.0 | -0.264 |
| 41003.0 | -0.282 |
| 41004.0 | -0.299 |
| 41005.0 | -0.317 |
| 41006.0 | -0.335 |
| 41007.0 | -0.355 |
| 41008.0 | -0.372 |
| 41009.0 | -0.391 |
| 41010.0 | -0.406 |
| 41011.0 | -0.421 |
| 41012.0 | -0.438 |
| 41013.0 | -0.456 |
| 41014.0 | -0.474 |
| 41015.0 | -0.492 |
| 41016.0 | -0.501 |
| 41017.0 | -0.509 |
| 41018.0 | -0.517 |
| 41019.0 | -0.525 |
| 41020.0 | -0.533 |
| 41021.0 | -0.541 |
| 41022.0 | -0.549 |
| 41023.0 | -0.557 |
| 41024.0 | -0.565 |
| 41025.0 | -0.574 |
| 41026.0 | -0.582 |
| 41027.0 | -0.59 |
| 41028.0 | -0.598 |
| 41029.0 | -0.606 |
| 41030.0 | -0.614 |
| 41031.0 | -0.622 |
| 41032.0 | -0.63 |
| 41033.0 | -0.638 |
| 41034.0 | -0.646 |
| 41035.0 | -0.655 |
| 41036.0 | -0.663 |
| 41037.0 | -0.671 |
| 41038.0 | -0.679 |
| 41039.0 | -0.687 |
| 41040.0 | -0.695 |
| 41041.0 | -0.703 |
| 41042.0 | -0.711 |
| 41043.0 | -0.718 |
| 41044.0 | -0.726 |
| 41045.0 | -0.733 |
| 41046.0 | -0.736 |
| 41047.0 | -0.729 |
| 41048.0 | -0.721 |
| 41049.0 | -0.713 |
| 41050.0 | -0.706 |
| 41051.0 | -0.698 |
| 41052.0 | -0.692 |
| 41053.0 | -0.691 |
| 41054.0 | -0.691 |
| 41055.0 | -0.691 |
| 41056.0 | -0.691 |
| 41057.0 | -0.689 |
| 41058.0 | -0.689 |
| 41059.0 | -0.689 |
| 41060.0 | -0.688 |
| 41061.0 | -0.682 |
| 41062.0 | -0.683 |
| 41063.0 | -0.682 |
| 41064.0 | -0.677 |
| 41065.0 | -0.68 |
| 41066.0 | -0.68 |
| 41067.0 | -0.684 |
| 41068.0 | -0.692 |
| 41069.0 | -0.699 |
| 41070.0 | -0.703 |
| 41071.0 | -0.705 |
| 41072.0 | -0.696 |
| 41073.0 | -0.684 |
| 41074.0 | -0.627 |
| 41075.0 | -0.595 |
| 41076.0 | -0.587 |
| 41077.0 | -0.589 |
| 41078.0 | -0.594 |
| 41079.0 | -0.598 |
| 41080.0 | -0.601 |
| 41081.0 | -0.595 |
| 41082.0 | -0.591 |
| 41083.0 | -0.584 |
| 41084.0 | -0.547 |
| 41085.0 | -0.531 |
| 41086.0 | -0.528 |
| 41087.0 | -0.527 |
| 41088.0 | -0.535 |
| 41089.0 | -0.538 |
| 41090.0 | -0.547 |
| 41091.0 | -0.561 |
| 41092.0 | -0.577 |
| 41093.0 | -0.591 |
| 41094.0 | -0.606 |
| 41095.0 | -0.624 |
| 41096.0 | -0.641 |
| 41097.0 | -0.66 |
| 41098.0 | -0.675 |
| 41099.0 | -0.683 |
| 41100.0 | -0.696 |
| 41101.0 | -0.712 |
| 41102.0 | -0.726 |
| 41103.0 | -0.729 |
| 41104.0 | -0.681 |
| 41105.0 | -0.617 |
| 41106.0 | -0.565 |
| 41107.0 | -0.548 |
| 41108.0 | -0.543 |
| 41109.0 | -0.544 |
| 41110.0 | -0.548 |
| 41111.0 | -0.557 |
| 41112.0 | -0.568 |
| 41113.0 | -0.577 |
| 41114.0 | -0.588 |
| 41115.0 | -0.602 |
| 41116.0 | -0.616 |
| 41117.0 | -0.631 |
| 41118.0 | -0.649 |
| 41119.0 | -0.667 |
| 41120.0 | -0.679 |
| 41121.0 | -0.677 |
| 41122.0 | -0.667 |
| 41123.0 | -0.673 |
| 41124.0 | -0.684 |
| 41125.0 | -0.701 |
| 41126.0 | -0.717 |
| 41127.0 | -0.73 |
| 41128.0 | -0.743 |
| 41129.0 | -0.759 |
| 41130.0 | -0.777 |
| 41131.0 | -0.796 |
| 41132.0 | -0.816 |
| 41133.0 | -0.837 |
| 41134.0 | -0.853 |
| 41135.0 | -0.864 |
| 41136.0 | -0.874 |
| 41137.0 | -0.888 |
| 41138.0 | -0.906 |
| 41139.0 | -0.926 |
| 41140.0 | -0.947 |
| 41141.0 | -0.966 |
| 41142.0 | -0.984 |
| 41143.0 | -0.998 |
| 41144.0 | -1.015 |
| 41145.0 | -1.03 |
| 41146.0 | -1.046 |
| 41147.0 | -1.064 |
| 41148.0 | -1.079 |
| 41149.0 | -1.095 |
| 41150.0 | -1.109 |
| 41151.0 | -1.126 |
| 41152.0 | -1.141 |
| 41153.0 | -1.159 |
| 41154.0 | -1.175 |
| 41155.0 | -1.186 |
| 41156.0 | -1.181 |
| 41157.0 | -1.174 |
| 41158.0 | -1.176 |
| 41159.0 | -1.178 |
| 41160.0 | -1.188 |
| 41161.0 | -1.201 |
| 41162.0 | -1.215 |
| 41163.0 | -1.218 |
| 41164.0 | -1.221 |
| 41165.0 | -1.223 |
| 41166.0 | -1.218 |
| 41167.0 | -1.198 |
| 41168.0 | -1.182 |
| 41169.0 | -1.169 |
| 41170.0 | -1.159 |
| 41171.0 | -1.155 |
| 41172.0 | -1.156 |
| 41173.0 | -1.16 |
| 41174.0 | -1.167 |
| 41175.0 | -1.174 |
| 41176.0 | -1.184 |
| 41177.0 | -1.194 |
| 41178.0 | -1.205 |
| 41179.0 | -1.204 |
| 41180.0 | -1.2 |
| 41181.0 | -1.202 |
| 41182.0 | -1.209 |
| 41183.0 | -1.212 |
| 41184.0 | -1.205 |
| 41185.0 | -1.201 |
| 41186.0 | -1.2 |
| 41187.0 | -1.2 |
| 41188.0 | -1.194 |
| 41189.0 | -1.187 |
| 41190.0 | -1.171 |
| 41191.0 | -1.164 |
| 41192.0 | -1.163 |
| 41193.0 | -1.164 |
| 41194.0 | -1.158 |
| 41195.0 | -1.148 |
| 41196.0 | -1.128 |
| 41197.0 | -1.11 |
| 41198.0 | -1.098 |
| 41199.0 | -1.091 |
| 41200.0 | -1.065 |
| 41201.0 | -0.956 |
| 41202.0 | -0.879 |
| 41203.0 | -0.82 |
| 41204.0 | -0.761 |
| 41205.0 | -0.714 |
| 41206.0 | -0.671 |
| 41207.0 | -0.633 |
| 41208.0 | -0.595 |
| 41209.0 | -0.574 |
| 41210.0 | -0.558 |
| 41211.0 | -0.548 |
| 41212.0 | -0.541 |
| 41213.0 | -0.537 |
| 41214.0 | -0.539 |
| 41215.0 | -0.541 |
| 41216.0 | -0.53 |
| 41217.0 | -0.513 |
| 41218.0 | -0.481 |
| 41219.0 | -0.452 |
| 41220.0 | -0.436 |
| 41221.0 | -0.431 |
| 41222.0 | -0.432 |
| 41223.0 | -0.43 |
| 41224.0 | -0.424 |
| 41225.0 | -0.4 |
| 41226.0 | -0.385 |
| 41227.0 | -0.382 |
| 41228.0 | -0.361 |
| 41229.0 | -0.336 |
| 41230.0 | -0.314 |
| 41231.0 | -0.261 |
| 41232.0 | -0.211 |
| 41233.0 | -0.193 |
| 41234.0 | -0.18 |
| 41235.0 | -0.176 |
| 41236.0 | -0.175 |
| 41237.0 | -0.173 |
| 41238.0 | -0.175 |
| 41239.0 | -0.178 |
| 41240.0 | -0.181 |
| 41241.0 | -0.196 |
| 41242.0 | -0.198 |
| 41243.0 | -0.195 |
| 41244.0 | -0.189 |
| 41245.0 | -0.182 |
| 41246.0 | -0.181 |
| 41247.0 | -0.185 |
| 41248.0 | -0.192 |
| 41249.0 | -0.197 |
| 41250.0 | -0.195 |
| 41251.0 | -0.174 |
| 41252.0 | -0.16 |
| 41253.0 | -0.16 |
| 41254.0 | -0.167 |
| 41255.0 | -0.176 |
| 41256.0 | -0.184 |
| 41257.0 | -0.195 |
| 41258.0 | -0.204 |
| 41259.0 | -0.216 |
| 41260.0 | -0.227 |
| 41261.0 | -0.231 |
| 41262.0 | -0.24 |
| 41263.0 | -0.252 |
| 41264.0 | -0.267 |
| 41265.0 | -0.28 |
| 41266.0 | -0.292 |
| 41267.0 | -0.305 |
| 41268.0 | -0.317 |
| 41269.0 | -0.335 |
| 41270.0 | -0.35 |
| 41271.0 | -0.364 |
| 41272.0 | -0.375 |
| 41273.0 | -0.381 |
| 41274.0 | -0.379 |
| 41275.0 | -0.384 |
| 41276.0 | -0.377 |
| 41277.0 | -0.299 |
| 41278.0 | -0.246 |
| 41279.0 | -0.236 |
| 41280.0 | -0.245 |
| 41281.0 | -0.252 |
| 41282.0 | -0.254 |
| 41283.0 | -0.255 |
| 41284.0 | -0.245 |
| 41285.0 | -0.238 |
| 41286.0 | -0.245 |
| 41287.0 | -0.247 |
| 41288.0 | -0.244 |
| 41289.0 | -0.24 |
| 41290.0 | -0.24 |
| 41291.0 | -0.228 |
| 41292.0 | -0.202 |
| 41293.0 | -0.195 |
| 41294.0 | -0.197 |
| 41295.0 | -0.207 |
| 41296.0 | -0.215 |
| 41297.0 | -0.224 |
| 41298.0 | -0.232 |
| 41299.0 | -0.241 |
| 41300.0 | -0.251 |
| 41301.0 | -0.265 |
| 41302.0 | -0.277 |
| 41303.0 | -0.289 |
| 41304.0 | -0.303 |
| 41305.0 | -0.318 |
| 41306.0 | -0.336 |
| 41307.0 | -0.352 |
| 41308.0 | -0.366 |
| 41309.0 | -0.363 |
| 41310.0 | -0.335 |
| 41311.0 | -0.321 |
| 41312.0 | -0.325 |
| 41313.0 | -0.335 |
| 41314.0 | -0.348 |
| 41315.0 | -0.36 |
| 41316.0 | -0.374 |
| 41317.0 | -0.39 |
| 41318.0 | -0.405 |
| 41319.0 | -0.421 |
| 41320.0 | -0.435 |
| 41321.0 | -0.447 |
| 41322.0 | -0.463 |
| 41323.0 | -0.478 |
| 41324.0 | -0.494 |
| 41325.0 | -0.51 |
| 41326.0 | -0.533 |
| 41327.0 | -0.555 |
| 41328.0 | -0.574 |
| 41329.0 | -0.591 |
| 41330.0 | -0.611 |
| 41331.0 | -0.636 |
| 41332.0 | -0.663 |
| 41333.0 | -0.692 |
| 41334.0 | -0.727 |
| 41335.0 | -0.764 |
| 41336.0 | -0.8 |
| 41337.0 | -0.841 |
| 41338.0 | -0.876 |
| 41339.0 | -0.91 |
| 41340.0 | -0.944 |
| 41341.0 | -0.977 |
| 41342.0 | -1.012 |
| 41343.0 | -1.044 |
| 41344.0 | -1.08 |
| 41345.0 | -1.114 |
| 41346.0 | -1.149 |
| 41347.0 | -1.182 |
| 41348.0 | -1.216 |
| 41349.0 | -1.25 |
| 41350.0 | -1.275 |
| 41351.0 | -1.285 |
| 41352.0 | -1.315 |
| 41353.0 | -1.35 |
| 41354.0 | -1.383 |
| 41355.0 | -1.416 |
| 41356.0 | -1.446 |
| 41357.0 | -1.48 |
| 41358.0 | -1.516 |
| 41359.0 | -1.554 |
| 41360.0 | -1.589 |
| 41361.0 | -1.624 |
| 41362.0 | -1.658 |
| 41363.0 | -1.697 |
| 41364.0 | -1.735 |
| 41365.0 | -1.77 |
| 41366.0 | -1.807 |
| 41367.0 | -1.844 |
| 41368.0 | -1.881 |
| 41369.0 | -1.915 |
| 41370.0 | -1.947 |
| 41371.0 | -1.983 |
| 41372.0 | -2.018 |
| 41373.0 | -2.049 |
| 41374.0 | -2.076 |
| 41375.0 | -2.099 |
| 41376.0 | -2.116 |
| 41377.0 | -2.134 |
| 41378.0 | -2.155 |
| 41379.0 | -2.176 |
| 41380.0 | -2.196 |
| 41381.0 | -2.219 |
| 41382.0 | -2.239 |
| 41383.0 | -2.258 |
| 41384.0 | -2.274 |
| 41385.0 | -2.298 |
| 41386.0 | -2.323 |
| 41387.0 | -2.338 |
| 41388.0 | -2.323 |
| 41389.0 | -2.295 |
| 41390.0 | -2.298 |
| 41391.0 | -2.308 |
| 41392.0 | -2.312 |
| 41393.0 | -2.323 |
| 41394.0 | -2.333 |
| 41395.0 | -2.346 |
| 41396.0 | -2.362 |
| 41397.0 | -2.375 |
| 41398.0 | -2.391 |
| 41399.0 | -2.388 |
| 41400.0 | -2.322 |
| 41401.0 | -2.286 |
| 41402.0 | -2.283 |
| 41403.0 | -2.283 |
| 41404.0 | -2.275 |
| 41405.0 | -2.263 |
| 41406.0 | -2.257 |
| 41407.0 | -2.256 |
| 41408.0 | -2.264 |
| 41409.0 | -2.278 |
| 41410.0 | -2.293 |
| 41411.0 | -2.312 |
| 41412.0 | -2.329 |
| 41413.0 | -2.346 |
| 41414.0 | -2.367 |
| 41415.0 | -2.385 |
| 41416.0 | -2.406 |
| 41417.0 | -2.423 |
| 41418.0 | -2.435 |
| 41419.0 | -2.45 |
| 41420.0 | -2.467 |
| 41421.0 | -2.481 |
| 41422.0 | -2.489 |
| 41423.0 | -2.494 |
| 41424.0 | -2.503 |
| 41425.0 | -2.507 |
| 41426.0 | -2.498 |
| 41427.0 | -2.444 |
| 41428.0 | -2.265 |
| 41429.0 | -2.158 |
| 41430.0 | -2.12 |
| 41431.0 | -2.103 |
| 41432.0 | -2.094 |
| 41433.0 | -2.092 |
| 41434.0 | -2.09 |
| 41435.0 | -2.087 |
| 41436.0 | -2.09 |
| 41437.0 | -2.096 |
| 41438.0 | -2.1 |
| 41439.0 | -2.095 |
| 41440.0 | -2.082 |
| 41441.0 | -2.014 |
| 41442.0 | -1.911 |
| 41443.0 | -1.818 |
| 41444.0 | -1.758 |
| 41445.0 | -1.701 |
| 41446.0 | -1.663 |
| 41447.0 | -1.64 |
| 41448.0 | -1.622 |
| 41449.0 | -1.588 |
| 41450.0 | -1.535 |
| 41451.0 | -1.427 |
| 41452.0 | -1.277 |
| 41453.0 | -1.166 |
| 41454.0 | -1.097 |
| 41455.0 | -1.055 |
| 41456.0 | -1.018 |
| 41457.0 | -0.969 |
| 41458.0 | -0.868 |
| 41459.0 | -0.742 |
| 41460.0 | -0.677 |
| 41461.0 | -0.619 |
| 41462.0 | -0.571 |
| 41463.0 | -0.561 |
| 41464.0 | -0.514 |
| 41465.0 | -0.494 |
| 41466.0 | -0.485 |
| 41467.0 | -0.48 |
| 41468.0 | -0.476 |
| 41469.0 | -0.468 |
| 41470.0 | -0.456 |
| 41471.0 | -0.442 |
| 41472.0 | -0.431 |
| 41473.0 | -0.417 |
| 41474.0 | -0.393 |
| 41475.0 | -0.368 |
| 41476.0 | -0.347 |
| 41477.0 | -0.325 |
| 41478.0 | -0.292 |
| 41479.0 | -0.277 |
| 41480.0 | -0.27 |
| 41481.0 | -0.269 |
| 41482.0 | -0.271 |
| 41483.0 | -0.275 |
| 41484.0 | -0.277 |
| 41485.0 | -0.28 |
| 41486.0 | -0.289 |
| 41487.0 | -0.299 |
| 41488.0 | -0.307 |
| 41489.0 | -0.317 |
| 41490.0 | -0.327 |
| 41491.0 | -0.336 |
| 41492.0 | -0.347 |
| 41493.0 | -0.361 |
| 41494.0 | -0.372 |
| 41495.0 | -0.386 |
| 41496.0 | -0.399 |
| 41497.0 | -0.415 |
| 41498.0 | -0.427 |
| 41499.0 | -0.435 |
| 41500.0 | -0.449 |
| 41501.0 | -0.462 |
| 41502.0 | -0.476 |
| 41503.0 | -0.49 |
| 41504.0 | -0.505 |
| 41505.0 | -0.519 |
| 41506.0 | -0.539 |
| 41507.0 | -0.557 |
| 41508.0 | -0.576 |
| 41509.0 | -0.594 |
| 41510.0 | -0.612 |
| 41511.0 | -0.63 |
| 41512.0 | -0.651 |
| 41513.0 | -0.67 |
| 41514.0 | -0.688 |
| 41515.0 | -0.698 |
| 41516.0 | -0.706 |
| 41517.0 | -0.717 |
| 41518.0 | -0.733 |
| 41519.0 | -0.751 |
| 41520.0 | -0.767 |
| 41521.0 | -0.772 |
| 41522.0 | -0.766 |
| 41523.0 | -0.764 |
| 41524.0 | -0.762 |
| 41525.0 | -0.75 |
| 41526.0 | -0.733 |
| 41527.0 | -0.72 |
| 41528.0 | -0.687 |
| 41529.0 | -0.67 |
| 41530.0 | -0.669 |
| 41531.0 | -0.674 |
| 41532.0 | -0.678 |
| 41533.0 | -0.686 |
| 41534.0 | -0.691 |
| 41535.0 | -0.698 |
| 41536.0 | -0.705 |
| 41537.0 | -0.709 |
| 41538.0 | -0.715 |
| 41539.0 | -0.723 |
| 41540.0 | -0.734 |
| 41541.0 | -0.743 |
| 41542.0 | -0.755 |
| 41543.0 | -0.768 |
| 41544.0 | -0.773 |
| 41545.0 | -0.782 |
| 41546.0 | -0.785 |
| 41547.0 | -0.791 |
| 41548.0 | -0.797 |
| 41549.0 | -0.804 |
| 41550.0 | -0.806 |
| 41551.0 | -0.807 |
| 41552.0 | -0.8 |
| 41553.0 | -0.794 |
| 41554.0 | -0.798 |
| 41555.0 | -0.801 |
| 41556.0 | -0.807 |
| 41557.0 | -0.81 |
| 41558.0 | -0.805 |
| 41559.0 | -0.794 |
| 41560.0 | -0.786 |
| 41561.0 | -0.774 |
| 41562.0 | -0.738 |
| 41563.0 | -0.712 |
| 41564.0 | -0.697 |
| 41565.0 | -0.68 |
| 41566.0 | -0.658 |
| 41567.0 | -0.651 |
| 41568.0 | -0.649 |
| 41569.0 | -0.639 |
| 41570.0 | -0.625 |
| 41571.0 | -0.612 |
| 41572.0 | -0.605 |
| 41573.0 | -0.605 |
| 41574.0 | -0.606 |
| 41575.0 | -0.606 |
| 41576.0 | -0.609 |
| 41577.0 | -0.613 |
| 41578.0 | -0.617 |
| 41579.0 | -0.612 |
| 41580.0 | -0.61 |
| 41581.0 | -0.612 |
| 41582.0 | -0.617 |
| 41583.0 | -0.619 |
| 41584.0 | -0.62 |
| 41585.0 | -0.623 |
| 41586.0 | -0.627 |
| 41587.0 | -0.631 |
| 41588.0 | -0.636 |
| 41589.0 | -0.635 |
| 41590.0 | -0.637 |
| 41591.0 | -0.643 |
| 41592.0 | -0.65 |
| 41593.0 | -0.656 |
| 41594.0 | -0.664 |
| 41595.0 | -0.671 |
| 41596.0 | -0.677 |
| 41597.0 | -0.684 |
| 41598.0 | -0.695 |
| 41599.0 | -0.704 |
| 41600.0 | -0.714 |
| 41601.0 | -0.723 |
| 41602.0 | -0.733 |
| 41603.0 | -0.736 |
| 41604.0 | -0.738 |
| 41605.0 | -0.747 |
| 41606.0 | -0.76 |
| 41607.0 | -0.773 |
| 41608.0 | -0.784 |
| 41609.0 | -0.793 |
| 41610.0 | -0.8 |
| 41611.0 | -0.809 |
| 41612.0 | -0.819 |
| 41613.0 | -0.829 |
| 41614.0 | -0.838 |
| 41615.0 | -0.849 |
| 41616.0 | -0.861 |
| 41617.0 | -0.871 |
| 41618.0 | -0.881 |
| 41619.0 | -0.89 |
| 41620.0 | -0.902 |
| 41621.0 | -0.911 |
| 41622.0 | -0.923 |
| 41623.0 | -0.934 |
| 41624.0 | -0.943 |
| 41625.0 | -0.954 |
| 41626.0 | -0.966 |
| 41627.0 | -0.978 |
| 41628.0 | -0.986 |
| 41629.0 | -0.976 |
| 41630.0 | -0.93 |
| 41631.0 | -0.907 |
| 41632.0 | -0.888 |
| 41633.0 | -0.833 |
| 41634.0 | -0.709 |
| 41635.0 | -0.658 |
| 41636.0 | -0.651 |
| 41637.0 | -0.655 |
| 41638.0 | -0.654 |
| 41639.0 | -0.638 |
| 41640.0 | -0.634 |
| 41641.0 | -0.635 |
| 41642.0 | -0.64 |
| 41643.0 | -0.645 |
| 41644.0 | -0.654 |
| 41645.0 | -0.661 |
| 41646.0 | -0.658 |
| 41647.0 | -0.607 |
| 41648.0 | -0.509 |
| 41649.0 | -0.465 |
| 41650.0 | -0.449 |
| 41651.0 | -0.438 |
| 41652.0 | -0.415 |
| 41653.0 | -0.389 |
| 41654.0 | -0.379 |
| 41655.0 | -0.374 |
| 41656.0 | -0.365 |
| 41657.0 | -0.349 |
| 41658.0 | -0.341 |
| 41659.0 | -0.337 |
| 41660.0 | -0.338 |
| 41661.0 | -0.34 |
| 41662.0 | -0.346 |
| 41663.0 | -0.348 |
| 41664.0 | -0.352 |
| 41665.0 | -0.354 |
| 41666.0 | -0.353 |
| 41667.0 | -0.354 |
| 41668.0 | -0.359 |
| 41669.0 | -0.366 |
| 41670.0 | -0.372 |
| 41671.0 | -0.381 |
| 41672.0 | -0.388 |
| 41673.0 | -0.399 |
| 41674.0 | -0.417 |
| 41675.0 | -0.438 |
| 41676.0 | -0.458 |
| 41677.0 | -0.481 |
| 41678.0 | -0.504 |
| 41679.0 | -0.525 |
| 41680.0 | -0.548 |
| 41681.0 | -0.569 |
| 41682.0 | -0.578 |
| 41683.0 | -0.55 |
| 41684.0 | -0.38 |
| 41685.0 | -0.304 |
| 41686.0 | -0.299 |
| 41687.0 | -0.314 |
| 41688.0 | -0.333 |
| 41689.0 | -0.356 |
| 41690.0 | -0.382 |
| 41691.0 | -0.409 |
| 41692.0 | -0.44 |
| 41693.0 | -0.47 |
| 41694.0 | -0.499 |
| 41695.0 | -0.529 |
| 41696.0 | -0.56 |
| 41697.0 | -0.591 |
| 41698.0 | -0.617 |
| 41699.0 | -0.634 |
| 41700.0 | -0.652 |
| 41701.0 | -0.637 |
| 41702.0 | -0.53 |
| 41703.0 | -0.442 |
| 41704.0 | -0.427 |
| 41705.0 | -0.433 |
| 41706.0 | -0.439 |
| 41707.0 | -0.45 |
| 41708.0 | -0.465 |
| 41709.0 | -0.484 |
| 41710.0 | -0.505 |
| 41711.0 | -0.529 |
| 41712.0 | -0.552 |
| 41713.0 | -0.574 |
| 41714.0 | -0.6 |
| 41715.0 | -0.627 |
| 41716.0 | -0.636 |
| 41717.0 | -0.652 |
| 41718.0 | -0.678 |
| 41719.0 | -0.704 |
| 41720.0 | -0.731 |
| 41721.0 | -0.76 |
| 41722.0 | -0.789 |
| 41723.0 | -0.813 |
| 41724.0 | -0.83 |
| 41725.0 | -0.856 |
| 41726.0 | -0.883 |
| 41727.0 | -0.909 |
| 41728.0 | -0.938 |
| 41729.0 | -0.966 |
| 41730.0 | -0.987 |
| 41731.0 | -1.006 |
| 41732.0 | -1.026 |
| 41733.0 | -1.043 |
| 41734.0 | -1.05 |
| 41735.0 | -1.059 |
| 41736.0 | -1.074 |
| 41737.0 | -1.086 |
| 41738.0 | -1.108 |
| 41739.0 | -1.124 |
| 41740.0 | -1.143 |
| 41741.0 | -1.156 |
| 41742.0 | -1.162 |
| 41743.0 | -1.181 |
| 41744.0 | -1.198 |
| 41745.0 | -1.204 |
| 41746.0 | -1.207 |
| 41747.0 | -1.214 |
| 41748.0 | -1.232 |
| 41749.0 | -1.247 |
| 41750.0 | -1.258 |
| 41751.0 | -1.262 |
| 41752.0 | -1.27 |
| 41753.0 | -1.281 |
| 41754.0 | -1.292 |
| 41755.0 | -1.289 |
| 41756.0 | -1.293 |
| 41757.0 | -1.285 |
| 41758.0 | -1.212 |
| 41759.0 | -1.188 |
| 41760.0 | -1.19 |
| 41761.0 | -1.197 |
| 41762.0 | -1.213 |
| 41763.0 | -1.229 |
| 41764.0 | -1.246 |
| 41765.0 | -1.262 |
| 41766.0 | -1.275 |
| 41767.0 | -1.254 |
| 41768.0 | -1.244 |
| 41769.0 | -1.241 |
| 41770.0 | -1.244 |
| 41771.0 | -1.253 |
| 41772.0 | -1.264 |
| 41773.0 | -1.275 |
| 41774.0 | -1.29 |
| 41775.0 | -1.305 |
| 41776.0 | -1.323 |
| 41777.0 | -1.339 |
| 41778.0 | -1.352 |
| 41779.0 | -1.369 |
| 41780.0 | -1.373 |
| 41781.0 | -1.343 |
| 41782.0 | -1.345 |
| 41783.0 | -1.349 |
| 41784.0 | -1.344 |
| 41785.0 | -1.317 |
| 41786.0 | -1.31 |
| 41787.0 | -1.316 |
| 41788.0 | -1.245 |
| 41789.0 | -1.137 |
| 41790.0 | -1.111 |
| 41791.0 | -1.1 |
| 41792.0 | -1.092 |
| 41793.0 | -1.082 |
| 41794.0 | -1.075 |
| 41795.0 | -1.073 |
| 41796.0 | -1.058 |
| 41797.0 | -1.038 |
| 41798.0 | -1.029 |
| 41799.0 | -1.024 |
| 41800.0 | -1.018 |
| 41801.0 | -1.015 |
| 41802.0 | -1.02 |
| 41803.0 | -1.026 |
| 41804.0 | -1.033 |
| 41805.0 | -1.041 |
| 41806.0 | -1.047 |
| 41807.0 | -1.054 |
| 41808.0 | -1.04 |
| 41809.0 | -1.03 |
| 41810.0 | -1.031 |
| 41811.0 | -1.038 |
| 41812.0 | -1.043 |
| 41813.0 | -1.052 |
| 41814.0 | -1.071 |
| 41815.0 | -1.086 |
| 41816.0 | -1.107 |
| 41817.0 | -1.128 |
| 41818.0 | -1.148 |
| 41819.0 | -1.168 |
| 41820.0 | -1.184 |
| 41821.0 | -1.202 |
| 41822.0 | -1.22 |
| 41823.0 | -1.236 |
| 41824.0 | -1.256 |
| 41825.0 | -1.264 |
| 41826.0 | -1.256 |
| 41827.0 | -1.251 |
| 41828.0 | -1.259 |
| 41829.0 | -1.274 |
| 41830.0 | -1.29 |
| 41831.0 | -1.301 |
| 41832.0 | -1.283 |
| 41833.0 | -1.259 |
| 41834.0 | -1.248 |
| 41835.0 | -1.251 |
| 41836.0 | -1.247 |
| 41837.0 | -1.251 |
| 41838.0 | -1.262 |
| 41839.0 | -1.277 |
| 41840.0 | -1.288 |
| 41841.0 | -1.293 |
| 41842.0 | -1.292 |
| 41843.0 | -1.25 |
| 41844.0 | -1.142 |
| 41845.0 | -1.042 |
| 41846.0 | -0.912 |
| 41847.0 | -0.816 |
| 41848.0 | -0.767 |
| 41849.0 | -0.741 |
| 41850.0 | -0.713 |
| 41851.0 | -0.667 |
| 41852.0 | -0.62 |
| 41853.0 | -0.567 |
| 41854.0 | -0.535 |
| 41855.0 | -0.522 |
| 41856.0 | -0.52 |
| 41857.0 | -0.511 |
| 41858.0 | -0.504 |
| 41859.0 | -0.489 |
| 41860.0 | -0.479 |
| 41861.0 | -0.479 |
| 41862.0 | -0.472 |
| 41863.0 | -0.452 |
| 41864.0 | -0.442 |
| 41865.0 | -0.432 |
| 41866.0 | -0.414 |
| 41867.0 | -0.314 |
| 41868.0 | -0.245 |
| 41869.0 | -0.214 |
| 41870.0 | -0.19 |
| 41871.0 | -0.173 |
| 41872.0 | -0.155 |
| 41873.0 | -0.14 |
| 41874.0 | -0.125 |
| 41875.0 | -0.104 |
| 41876.0 | -0.09 |
| 41877.0 | -0.081 |
| 41878.0 | -0.074 |
| 41879.0 | -0.069 |
| 41880.0 | -0.065 |
| 41881.0 | -0.062 |
| 41882.0 | -0.06 |
| 41883.0 | -0.06 |
| 41884.0 | -0.062 |
| 41885.0 | -0.065 |
| 41886.0 | -0.069 |
| 41887.0 | -0.073 |
| 41888.0 | -0.078 |
| 41889.0 | -0.081 |
| 41890.0 | -0.081 |
| 41891.0 | -0.075 |
| 41892.0 | -0.077 |
| 41893.0 | -0.084 |
| 41894.0 | -0.088 |
| 41895.0 | -0.079 |
| 41896.0 | -0.075 |
| 41897.0 | -0.079 |
| 41898.0 | -0.085 |
| 41899.0 | -0.052 |
| 41900.0 | -0.01 |
| 41901.0 | -0.003 |
| 41902.0 | 0.002 |
| 41903.0 | 0.002 |
| 41904.0 | 0.017 |
| 41905.0 | 0.027 |
| 41906.0 | 0.047 |
| 41907.0 | 0.057 |
| 41908.0 | 0.057 |
| 41909.0 | 0.055 |
| 41910.0 | 0.05 |
| 41911.0 | 0.042 |
| 41912.0 | 0.031 |
| 41913.0 | 0.021 |
| 41914.0 | 0.009 |
| 41915.0 | 0.003 |
| 41916.0 | 0.008 |
| 41917.0 | 0.015 |
| 41918.0 | 0.092 |
| 41919.0 | 0.191 |
| 41920.0 | 0.214 |
| 41921.0 | 0.253 |
| 41922.0 | 0.242 |
| 41923.0 | 0.218 |
| 41924.0 | 0.195 |
| 41925.0 | 0.171 |
| 41926.0 | 0.147 |
| 41927.0 | 0.128 |
| 41928.0 | 0.11 |
| 41929.0 | 0.096 |
| 41930.0 | 0.118 |
| 41931.0 | 0.115 |
| 41932.0 | 0.102 |
| 41933.0 | 0.106 |
| 41934.0 | 0.099 |
| 41935.0 | 0.087 |
| 41936.0 | 0.079 |
| 41937.0 | 0.081 |
| 41938.0 | 0.073 |
| 41939.0 | 0.068 |
| 41940.0 | 0.059 |
| 41941.0 | 0.048 |
| 41942.0 | 0.045 |
| 41943.0 | 0.045 |
| 41944.0 | 0.034 |
| 41945.0 | 0.017 |
| 41946.0 | 0.007 |
| 41947.0 | 0.006 |
| 41948.0 | 0.008 |
| 41949.0 | 0.005 |
| 41950.0 | -0.005 |
| 41951.0 | -0.016 |
| 41952.0 | -0.03 |
| 41953.0 | -0.044 |
| 41954.0 | -0.058 |
| 41955.0 | -0.067 |
| 41956.0 | -0.057 |
| 41957.0 | 0.011 |
| 41958.0 | 0.022 |
| 41959.0 | 0.024 |
| 41960.0 | 0.016 |
| 41961.0 | 0.001 |
| 41962.0 | -0.009 |
| 41963.0 | -0.018 |
| 41964.0 | -0.028 |
| 41965.0 | -0.03 |
| 41966.0 | -0.006 |
| 41967.0 | -0.004 |
| 41968.0 | -0.008 |
| 41969.0 | -0.014 |
| 41970.0 | -0.024 |
| 41971.0 | -0.038 |
| 41972.0 | -0.053 |
| 41973.0 | -0.069 |
| 41974.0 | -0.074 |
| 41975.0 | -0.077 |
| 41976.0 | -0.085 |
| 41977.0 | -0.095 |
| 41978.0 | -0.093 |
| 41979.0 | -0.101 |
| 41980.0 | -0.112 |
| 41981.0 | -0.123 |
| 41982.0 | -0.137 |
| 41983.0 | -0.145 |
| 41984.0 | -0.16 |
| 41985.0 | -0.177 |
| 41986.0 | -0.194 |
| 41987.0 | -0.211 |
| 41988.0 | -0.23 |
| 41989.0 | -0.249 |
| 41990.0 | -0.268 |
| 41991.0 | -0.29 |
| 41992.0 | -0.308 |
| 41993.0 | -0.327 |
| 41994.0 | -0.344 |
| 41995.0 | -0.363 |
| 41996.0 | -0.383 |
| 41997.0 | -0.404 |
| 41998.0 | -0.419 |
| 41999.0 | -0.438 |
| 42000.0 | -0.459 |
| 42001.0 | -0.478 |
| 42002.0 | -0.495 |
| 42003.0 | -0.516 |
| 42004.0 | -0.537 |
| 42005.0 | -0.548 |
| 42006.0 | -0.565 |
| 42007.0 | -0.583 |
| 42008.0 | -0.602 |
| 42009.0 | -0.625 |
| 42010.0 | -0.643 |
| 42011.0 | -0.666 |
| 42012.0 | -0.686 |
| 42013.0 | -0.706 |
| 42014.0 | -0.727 |
| 42015.0 | -0.749 |
| 42016.0 | -0.768 |
| 42017.0 | -0.789 |
| 42018.0 | -0.808 |
| 42019.0 | -0.829 |
| 42020.0 | -0.853 |
| 42021.0 | -0.877 |
| 42022.0 | -0.9 |
| 42023.0 | -0.921 |
| 42024.0 | -0.93 |
| 42025.0 | -0.942 |
| 42026.0 | -0.955 |
| 42027.0 | -0.968 |
| 42028.0 | -0.982 |
| 42029.0 | -0.997 |
| 42030.0 | -1.014 |
| 42031.0 | -1.03 |
| 42032.0 | -1.046 |
| 42033.0 | -1.059 |
| 42034.0 | -1.072 |
| 42035.0 | -1.088 |
| 42036.0 | -1.105 |
| 42037.0 | -1.117 |
| 42038.0 | -1.094 |
| 42039.0 | -1.074 |
| 42040.0 | -1.08 |
| 42041.0 | -1.083 |
| 42042.0 | -1.057 |
| 42043.0 | -1.049 |
| 42044.0 | -1.043 |
| 42045.0 | -1.014 |
| 42046.0 | -1.012 |
| 42047.0 | -1.018 |
| 42048.0 | -1.029 |
| 42049.0 | -1.037 |
| 42050.0 | -1.05 |
| 42051.0 | -1.061 |
| 42052.0 | -1.073 |
| 42053.0 | -1.085 |
| 42054.0 | -1.095 |
| 42055.0 | -1.1 |
| 42056.0 | -1.107 |
| 42057.0 | -1.099 |
| 42058.0 | -1.106 |
| 42059.0 | -1.114 |
| 42060.0 | -1.122 |
| 42061.0 | -1.125 |
| 42062.0 | -1.134 |
| 42063.0 | -1.15 |
| 42064.0 | -1.152 |
| 42065.0 | -1.161 |
| 42066.0 | -1.162 |
| 42067.0 | -1.168 |
| 42068.0 | -1.178 |
| 42069.0 | -1.191 |
| 42070.0 | -1.191 |
| 42071.0 | -1.154 |
| 42072.0 | -1.128 |
| 42073.0 | -1.129 |
| 42074.0 | -1.133 |
| 42075.0 | -1.139 |
| 42076.0 | -1.144 |
| 42077.0 | -1.151 |
| 42078.0 | -1.158 |
| 42079.0 | -1.169 |
| 42080.0 | -1.177 |
| 42081.0 | -1.182 |
| 42082.0 | -1.181 |
| 42083.0 | -1.189 |
| 42084.0 | -1.194 |
| 42085.0 | -1.19 |
| 42086.0 | -1.187 |
| 42087.0 | -1.191 |
| 42088.0 | -1.194 |
| 42089.0 | -1.198 |
| 42090.0 | -1.203 |
| 42091.0 | -1.208 |
| 42092.0 | -1.21 |
| 42093.0 | -1.182 |
| 42094.0 | -1.154 |
| 42095.0 | -1.151 |
| 42096.0 | -1.154 |
| 42097.0 | -1.159 |
| 42098.0 | -1.166 |
| 42099.0 | -1.167 |
| 42100.0 | -1.17 |
| 42101.0 | -1.18 |
| 42102.0 | -1.187 |
| 42103.0 | -1.196 |
| 42104.0 | -1.205 |
| 42105.0 | -1.208 |
| 42106.0 | -1.213 |
| 42107.0 | -1.208 |
| 42108.0 | -1.2 |
| 42109.0 | -1.164 |
| 42110.0 | -1.084 |
| 42111.0 | -1.043 |
| 42112.0 | -0.951 |
| 42113.0 | -0.893 |
| 42114.0 | -0.864 |
| 42115.0 | -0.84 |
| 42116.0 | -0.82 |
| 42117.0 | -0.809 |
| 42118.0 | -0.801 |
| 42119.0 | -0.797 |
| 42120.0 | -0.793 |
| 42121.0 | -0.791 |
| 42122.0 | -0.784 |
| 42123.0 | -0.772 |
| 42124.0 | -0.736 |
| 42125.0 | -0.643 |
| 42126.0 | -0.597 |
| 42127.0 | -0.578 |
| 42128.0 | -0.567 |
| 42129.0 | -0.556 |
| 42130.0 | -0.548 |
| 42131.0 | -0.54 |
| 42132.0 | -0.535 |
| 42133.0 | -0.534 |
| 42134.0 | -0.533 |
| 42135.0 | -0.534 |
| 42136.0 | -0.517 |
| 42137.0 | -0.465 |
| 42138.0 | -0.445 |
| 42139.0 | -0.452 |
| 42140.0 | -0.431 |
| 42141.0 | -0.36 |
| 42142.0 | -0.351 |
| 42143.0 | -0.35 |
| 42144.0 | -0.351 |
| 42145.0 | -0.36 |
| 42146.0 | -0.359 |
| 42147.0 | -0.364 |
| 42148.0 | -0.364 |
| 42149.0 | -0.352 |
| 42150.0 | -0.338 |
| 42151.0 | -0.324 |
| 42152.0 | -0.311 |
| 42153.0 | -0.308 |
| 42154.0 | -0.31 |
| 42155.0 | -0.308 |
| 42156.0 | -0.307 |
| 42157.0 | -0.3 |
| 42158.0 | -0.175 |
| 42159.0 | 0.138 |
| 42160.0 | 0.189 |
| 42161.0 | 0.194 |
| 42162.0 | 0.182 |
| 42163.0 | 0.171 |
| 42164.0 | 0.192 |
| 42165.0 | 0.262 |
| 42166.0 | 0.245 |
| 42167.0 | 0.222 |
| 42168.0 | 0.225 |
| 42169.0 | 0.286 |
| 42170.0 | 0.325 |
| 42171.0 | 0.308 |
| 42172.0 | 0.283 |
| 42173.0 | 0.266 |
| 42174.0 | 0.259 |
| 42175.0 | 0.235 |
| 42176.0 | 0.213 |
| 42177.0 | 0.199 |
| 42178.0 | 0.177 |
| 42179.0 | 0.155 |
| 42180.0 | 0.138 |
| 42181.0 | 0.127 |
| 42182.0 | 0.129 |
| 42183.0 | 0.119 |
| 42184.0 | 0.125 |
| 42185.0 | 0.15 |
| 42186.0 | 0.159 |
| 42187.0 | 0.16 |
| 42188.0 | 0.159 |
| 42189.0 | 0.155 |
| 42190.0 | 0.144 |
| 42191.0 | 0.136 |
| 42192.0 | 0.125 |
| 42193.0 | 0.12 |
| 42194.0 | 0.114 |
| 42195.0 | 0.104 |
| 42196.0 | 0.092 |
| 42197.0 | 0.079 |
| 42198.0 | 0.066 |
| 42199.0 | 0.055 |
| 42200.0 | 0.051 |
| 42201.0 | 0.067 |
| 42202.0 | 0.085 |
| 42203.0 | 0.091 |
| 42204.0 | 0.096 |
| 42205.0 | 0.094 |
| 42206.0 | 0.089 |
| 42207.0 | 0.097 |
| 42208.0 | 0.111 |
| 42209.0 | 0.11 |
| 42210.0 | 0.108 |
| 42211.0 | 0.119 |
| 42212.0 | 0.152 |
| 42213.0 | 0.159 |
| 42214.0 | 0.181 |
| 42215.0 | 0.186 |
| 42216.0 | 0.171 |
| 42217.0 | 0.159 |
| 42218.0 | 0.156 |
| 42219.0 | 0.15 |
| 42220.0 | 0.155 |
| 42221.0 | 0.16 |
| 42222.0 | 0.146 |
| 42223.0 | 0.141 |
| 42224.0 | 0.137 |
| 42225.0 | 0.131 |
| 42226.0 | 0.12 |
| 42227.0 | 0.105 |
| 42228.0 | 0.094 |
| 42229.0 | 0.084 |
| 42230.0 | 0.079 |
| 42231.0 | 0.1 |
| 42232.0 | 0.162 |
| 42233.0 | 0.176 |
| 42234.0 | 0.165 |
| 42235.0 | 0.163 |
| 42236.0 | 0.158 |
| 42237.0 | 0.145 |
| 42238.0 | 0.131 |
| 42239.0 | 0.118 |
| 42240.0 | 0.11 |
| 42241.0 | 0.132 |
| 42242.0 | 0.137 |
| 42243.0 | 0.126 |
| 42244.0 | 0.112 |
| 42245.0 | 0.105 |
| 42246.0 | 0.111 |
| 42247.0 | 0.112 |
| 42248.0 | 0.111 |
| 42249.0 | 0.1 |
| 42250.0 | 0.139 |
| 42251.0 | 0.17 |
| 42252.0 | 0.165 |
| 42253.0 | 0.155 |
| 42254.0 | 0.156 |
| 42255.0 | 0.138 |
| 42256.0 | 0.133 |
| 42257.0 | 0.141 |
| 42258.0 | 0.158 |
| 42259.0 | 0.16 |
| 42260.0 | 0.161 |
| 42261.0 | 0.169 |
| 42262.0 | 0.17 |
| 42263.0 | 0.187 |
| 42264.0 | 0.19 |
| 42265.0 | 0.19 |
| 42266.0 | 0.19 |
| 42267.0 | 0.171 |
| 42268.0 | 0.149 |
| 42269.0 | 0.13 |
| 42270.0 | 0.115 |
| 42271.0 | 0.107 |
| 42272.0 | 0.097 |
| 42273.0 | 0.088 |
| 42274.0 | 0.074 |
| 42275.0 | 0.065 |
| 42276.0 | 0.058 |
| 42277.0 | 0.051 |
| 42278.0 | 0.043 |
| 42279.0 | 0.041 |
| 42280.0 | 0.036 |
| 42281.0 | 0.027 |
| 42282.0 | 0.022 |
| 42283.0 | 0.008 |
| 42284.0 | -0.001 |
| 42285.0 | 0.003 |
| 42286.0 | -0.004 |
| 42287.0 | -0.016 |
| 42288.0 | -0.033 |
| 42289.0 | -0.046 |
| 42290.0 | -0.044 |
| 42291.0 | -0.037 |
| 42292.0 | -0.043 |
| 42293.0 | -0.05 |
| 42294.0 | -0.043 |
| 42295.0 | -0.035 |
| 42296.0 | -0.04 |
| 42297.0 | -0.039 |
| 42298.0 | -0.045 |
| 42299.0 | -0.036 |
| 42300.0 | -0.033 |
| 42301.0 | -0.039 |
| 42302.0 | -0.045 |
| 42303.0 | -0.052 |
| 42304.0 | -0.052 |
| 42305.0 | -0.045 |
| 42306.0 | -0.048 |
| 42307.0 | -0.05 |
| 42308.0 | -0.059 |
| 42309.0 | -0.067 |
| 42310.0 | -0.074 |
| 42311.0 | -0.086 |
| 42312.0 | -0.091 |
| 42313.0 | -0.098 |
| 42314.0 | -0.105 |
| 42315.0 | -0.11 |
| 42316.0 | -0.109 |
| 42317.0 | -0.108 |
| 42318.0 | -0.111 |
| 42319.0 | -0.121 |
| 42320.0 | -0.127 |
| 42321.0 | -0.127 |
| 42322.0 | -0.135 |
| 42323.0 | -0.141 |
| 42324.0 | -0.143 |
| 42325.0 | -0.15 |
| 42326.0 | -0.155 |
| 42327.0 | -0.156 |
| 42328.0 | -0.163 |
| 42329.0 | -0.162 |
| 42330.0 | -0.16 |
| 42331.0 | -0.167 |
| 42332.0 | -0.174 |
| 42333.0 | -0.184 |
| 42334.0 | -0.19 |
| 42335.0 | -0.194 |
| 42336.0 | -0.198 |
| 42337.0 | -0.202 |
| 42338.0 | -0.208 |
| 42339.0 | -0.214 |
| 42340.0 | -0.224 |
| 42341.0 | -0.228 |
| 42342.0 | -0.226 |
| 42343.0 | -0.235 |
| 42344.0 | -0.234 |
| 42345.0 | -0.237 |
| 42346.0 | -0.246 |
| 42347.0 | -0.251 |
| 42348.0 | -0.256 |
| 42349.0 | -0.262 |
| 42350.0 | -0.271 |
| 42351.0 | -0.272 |
| 42352.0 | -0.267 |
| 42353.0 | -0.268 |
| 42354.0 | -0.257 |
| 42355.0 | -0.174 |
| 42356.0 | -0.142 |
| 42357.0 | -0.139 |
| 42358.0 | -0.14 |
| 42359.0 | -0.146 |
| 42360.0 | -0.149 |
| 42361.0 | -0.158 |
| 42362.0 | -0.163 |
| 42363.0 | -0.171 |
| 42364.0 | -0.178 |
| 42365.0 | -0.187 |
| 42366.0 | -0.198 |
| 42367.0 | -0.21 |
| 42368.0 | -0.221 |
| 42369.0 | -0.23 |
| 42370.0 | -0.241 |
| 42371.0 | -0.252 |
| 42372.0 | -0.262 |
| 42373.0 | -0.272 |
| 42374.0 | -0.284 |
| 42375.0 | -0.295 |
| 42376.0 | -0.307 |
| 42377.0 | -0.322 |
| 42378.0 | -0.339 |
| 42379.0 | -0.362 |
| 42380.0 | -0.373 |
| 42381.0 | -0.385 |
| 42382.0 | -0.386 |
| 42383.0 | -0.395 |
| 42384.0 | -0.404 |
| 42385.0 | -0.395 |
| 42386.0 | -0.399 |
| 42387.0 | -0.405 |
| 42388.0 | -0.418 |
| 42389.0 | -0.425 |
| 42390.0 | -0.434 |
| 42391.0 | -0.443 |
| 42392.0 | -0.453 |
| 42393.0 | -0.462 |
| 42394.0 | -0.471 |
| 42395.0 | -0.477 |
| 42396.0 | -0.473 |
| 42397.0 | -0.481 |
| 42398.0 | -0.499 |
| 42399.0 | -0.51 |
| 42400.0 | -0.521 |
| 42401.0 | -0.533 |
| 42402.0 | -0.544 |
| 42403.0 | -0.557 |
| 42404.0 | -0.573 |
| 42405.0 | -0.585 |
| 42406.0 | -0.601 |
| 42407.0 | -0.615 |
| 42408.0 | -0.63 |
| 42409.0 | -0.645 |
| 42410.0 | -0.661 |
| 42411.0 | -0.675 |
| 42412.0 | -0.688 |
| 42413.0 | -0.702 |
| 42414.0 | -0.717 |
| 42415.0 | -0.734 |
| 42416.0 | -0.752 |
| 42417.0 | -0.762 |
| 42418.0 | -0.715 |
| 42419.0 | -0.714 |
| 42420.0 | -0.727 |
| 42421.0 | -0.739 |
| 42422.0 | -0.753 |
| 42423.0 | -0.766 |
| 42424.0 | -0.78 |
| 42425.0 | -0.791 |
| 42426.0 | -0.8 |
| 42427.0 | -0.813 |
| 42428.0 | -0.829 |
| 42429.0 | -0.849 |
| 42430.0 | -0.862 |
| 42431.0 | -0.877 |
| 42432.0 | -0.892 |
| 42433.0 | -0.907 |
| 42434.0 | -0.925 |
| 42435.0 | -0.942 |
| 42436.0 | -0.957 |
| 42437.0 | -0.973 |
| 42438.0 | -0.991 |
| 42439.0 | -1.017 |
| 42440.0 | -1.031 |
| 42441.0 | -1.051 |
| 42442.0 | -1.069 |
| 42443.0 | -1.088 |
| 42444.0 | -1.1 |
| 42445.0 | -1.112 |
| 42446.0 | -1.132 |
| 42447.0 | -1.152 |
| 42448.0 | -1.175 |
| 42449.0 | -1.196 |
| 42450.0 | -1.217 |
| 42451.0 | -1.237 |
| 42452.0 | -1.258 |
| 42453.0 | -1.283 |
| 42454.0 | -1.303 |
| 42455.0 | -1.323 |
| 42456.0 | -1.345 |
| 42457.0 | -1.367 |
| 42458.0 | -1.39 |
| 42459.0 | -1.413 |
| 42460.0 | -1.434 |
| 42461.0 | -1.454 |
| 42462.0 | -1.477 |
| 42463.0 | -1.499 |
| 42464.0 | -1.521 |
| 42465.0 | -1.544 |
| 42466.0 | -1.567 |
| 42467.0 | -1.592 |
| 42468.0 | -1.612 |
| 42469.0 | -1.625 |
| 42470.0 | -1.646 |
| 42471.0 | -1.669 |
| 42472.0 | -1.677 |
| 42473.0 | -1.686 |
| 42474.0 | -1.703 |
| 42475.0 | -1.723 |
| 42476.0 | -1.743 |
| 42477.0 | -1.766 |
| 42478.0 | -1.786 |
| 42479.0 | -1.808 |
| 42480.0 | -1.831 |
| 42481.0 | -1.851 |
| 42482.0 | -1.873 |
| 42483.0 | -1.895 |
| 42484.0 | -1.911 |
| 42485.0 | -1.93 |
| 42486.0 | -1.945 |
| 42487.0 | -1.96 |
| 42488.0 | -1.978 |
| 42489.0 | -1.997 |
| 42490.0 | -2.012 |
| 42491.0 | -2.03 |
| 42492.0 | -2.049 |
| 42493.0 | -2.07 |
| 42494.0 | -2.09 |
| 42495.0 | -2.109 |
| 42496.0 | -2.129 |
| 42497.0 | -2.149 |
| 42498.0 | -2.168 |
| 42499.0 | -2.184 |
| 42500.0 | -2.198 |
| 42501.0 | -2.216 |
| 42502.0 | -2.235 |
| 42503.0 | -2.244 |
| 42504.0 | -2.259 |
| 42505.0 | -2.274 |
| 42506.0 | -2.287 |
| 42507.0 | -2.256 |
| 42508.0 | -2.247 |
| 42509.0 | -2.252 |
| 42510.0 | -2.259 |
| 42511.0 | -2.27 |
| 42512.0 | -2.221 |
| 42513.0 | -1.695 |
| 42514.0 | -1.373 |
| 42515.0 | -1.337 |
| 42516.0 | -1.32 |
| 42517.0 | -1.302 |
| 42518.0 | -1.277 |
| 42519.0 | -1.246 |
| 42520.0 | -1.163 |
| 42521.0 | -1.088 |
| 42522.0 | -1.043 |
| 42523.0 | -1.019 |
| 42524.0 | -0.997 |
| 42525.0 | -0.977 |
| 42526.0 | -0.96 |
| 42527.0 | -0.95 |
| 42528.0 | -0.943 |
| 42529.0 | -0.938 |
| 42530.0 | -0.933 |
| 42531.0 | -0.904 |
| 42532.0 | -0.867 |
| 42533.0 | -0.847 |
| 42534.0 | -0.83 |
| 42535.0 | -0.824 |
| 42536.0 | -0.813 |
| 42537.0 | -0.796 |
| 42538.0 | -0.789 |
| 42539.0 | -0.785 |
| 42540.0 | -0.778 |
| 42541.0 | -0.766 |
| 42542.0 | -0.761 |
| 42543.0 | -0.756 |
| 42544.0 | -0.755 |
| 42545.0 | -0.746 |
| 42546.0 | -0.732 |
| 42547.0 | -0.731 |
| 42548.0 | -0.732 |
| 42549.0 | -0.73 |
| 42550.0 | -0.726 |
| 42551.0 | -0.728 |
| 42552.0 | -0.73 |
| 42553.0 | -0.736 |
| 42554.0 | -0.746 |
| 42555.0 | -0.757 |
| 42556.0 | -0.763 |
| 42557.0 | -0.772 |
| 42558.0 | -0.782 |
| 42559.0 | -0.793 |
| 42560.0 | -0.807 |
| 42561.0 | -0.821 |
| 42562.0 | -0.837 |
| 42563.0 | -0.85 |
| 42564.0 | -0.856 |
| 42565.0 | -0.856 |
| 42566.0 | -0.863 |
| 42567.0 | -0.87 |
| 42568.0 | -0.829 |
| 42569.0 | -0.628 |
| 42570.0 | -0.496 |
| 42571.0 | -0.443 |
| 42572.0 | -0.408 |
| 42573.0 | -0.389 |
| 42574.0 | -0.383 |
| 42575.0 | -0.342 |
| 42576.0 | -0.306 |
| 42577.0 | -0.297 |
| 42578.0 | -0.294 |
| 42579.0 | -0.281 |
| 42580.0 | -0.269 |
| 42581.0 | -0.264 |
| 42582.0 | -0.285 |
| 42583.0 | -0.288 |
| 42584.0 | -0.293 |
| 42585.0 | -0.289 |
| 42586.0 | -0.289 |
| 42587.0 | -0.296 |
| 42588.0 | -0.304 |
| 42589.0 | -0.315 |
| 42590.0 | -0.326 |
| 42591.0 | -0.34 |
| 42592.0 | -0.355 |
| 42593.0 | -0.372 |
| 42594.0 | -0.387 |
| 42595.0 | -0.399 |
| 42596.0 | -0.411 |
| 42597.0 | -0.422 |
| 42598.0 | -0.43 |
| 42599.0 | -0.436 |
| 42600.0 | -0.443 |
| 42601.0 | -0.442 |
| 42602.0 | -0.44 |
| 42603.0 | -0.439 |
| 42604.0 | -0.433 |
| 42605.0 | -0.421 |
| 42606.0 | -0.414 |
| 42607.0 | -0.42 |
| 42608.0 | -0.417 |
| 42609.0 | -0.398 |
| 42610.0 | -0.382 |
| 42611.0 | -0.382 |
| 42612.0 | -0.381 |
| 42613.0 | -0.376 |
| 42614.0 | -0.377 |
| 42615.0 | -0.387 |
| 42616.0 | -0.392 |
| 42617.0 | -0.398 |
| 42618.0 | -0.349 |
| 42619.0 | -0.257 |
| 42620.0 | -0.241 |
| 42621.0 | -0.186 |
| 42622.0 | -0.168 |
| 42623.0 | -0.155 |
| 42624.0 | -0.134 |
| 42625.0 | -0.115 |
| 42626.0 | -0.099 |
| 42627.0 | -0.078 |
| 42628.0 | -0.074 |
| 42629.0 | -0.074 |
| 42630.0 | -0.074 |
| 42631.0 | -0.08 |
| 42632.0 | -0.088 |
| 42633.0 | -0.103 |
| 42634.0 | -0.122 |
| 42635.0 | -0.14 |
| 42636.0 | -0.159 |
| 42637.0 | -0.178 |
| 42638.0 | -0.196 |
| 42639.0 | -0.22 |
| 42640.0 | -0.248 |
| 42641.0 | -0.27 |
| 42642.0 | -0.293 |
| 42643.0 | -0.307 |
| 42644.0 | -0.29 |
| 42645.0 | -0.3 |
| 42646.0 | -0.317 |
| 42647.0 | -0.334 |
| 42648.0 | -0.344 |
| 42649.0 | -0.342 |
| 42650.0 | -0.339 |
| 42651.0 | -0.35 |
| 42652.0 | -0.358 |
| 42653.0 | -0.371 |
| 42654.0 | -0.392 |
| 42655.0 | -0.386 |
| 42656.0 | -0.374 |
| 42657.0 | -0.355 |
| 42658.0 | -0.339 |
| 42659.0 | -0.346 |
| 42660.0 | -0.357 |
| 42661.0 | -0.373 |
| 42662.0 | -0.39 |
| 42663.0 | -0.399 |
| 42664.0 | -0.404 |
| 42665.0 | -0.419 |
| 42666.0 | -0.437 |
| 42667.0 | -0.455 |
| 42668.0 | -0.471 |
| 42669.0 | -0.475 |
| 42670.0 | -0.464 |
| 42671.0 | -0.464 |
| 42672.0 | -0.411 |
| 42673.0 | -0.38 |
| 42674.0 | -0.374 |
| 42675.0 | -0.379 |
| 42676.0 | -0.38 |
| 42677.0 | -0.386 |
| 42678.0 | -0.39 |
| 42679.0 | -0.388 |
| 42680.0 | -0.389 |
| 42681.0 | -0.381 |
| 42682.0 | -0.385 |
| 42683.0 | -0.39 |
| 42684.0 | -0.395 |
| 42685.0 | -0.405 |
| 42686.0 | -0.413 |
| 42687.0 | -0.421 |
| 42688.0 | -0.426 |
| 42689.0 | -0.363 |
| 42690.0 | -0.283 |
| 42691.0 | -0.204 |
| 42692.0 | -0.105 |
| 42693.0 | -0.07 |
| 42694.0 | -0.059 |
| 42695.0 | -0.056 |
| 42696.0 | -0.058 |
| 42697.0 | -0.059 |
| 42698.0 | -0.036 |
| 42699.0 | -0.029 |
| 42700.0 | -0.038 |
| 42701.0 | -0.049 |
| 42702.0 | -0.073 |
| 42703.0 | -0.09 |
| 42704.0 | -0.103 |
| 42705.0 | -0.118 |
| 42706.0 | -0.132 |
| 42707.0 | -0.149 |
| 42708.0 | -0.162 |
| 42709.0 | -0.176 |
| 42710.0 | -0.195 |
| 42711.0 | -0.206 |
| 42712.0 | -0.215 |
| 42713.0 | -0.232 |
| 42714.0 | -0.252 |
| 42715.0 | -0.26 |
| 42716.0 | -0.25 |
| 42717.0 | -0.233 |
| 42718.0 | -0.244 |
| 42719.0 | -0.261 |
| 42720.0 | -0.281 |
| 42721.0 | -0.3 |
| 42722.0 | -0.318 |
| 42723.0 | -0.337 |
| 42724.0 | -0.355 |
| 42725.0 | -0.371 |
| 42726.0 | -0.386 |
| 42727.0 | -0.4 |
| 42728.0 | -0.412 |
| 42729.0 | -0.429 |
| 42730.0 | -0.442 |
| 42731.0 | -0.461 |
| 42732.0 | -0.476 |
| 42733.0 | -0.49 |
| 42734.0 | -0.498 |
| 42735.0 | -0.507 |
| 42736.0 | -0.519 |
| 42737.0 | -0.521 |
| 42738.0 | -0.523 |
| 42739.0 | -0.512 |
| 42740.0 | -0.487 |
| 42741.0 | -0.483 |
| 42742.0 | -0.482 |
| 42743.0 | -0.479 |
| 42744.0 | -0.467 |
| 42745.0 | -0.456 |
| 42746.0 | -0.459 |
| 42747.0 | -0.462 |
| 42748.0 | -0.469 |
| 42749.0 | -0.473 |
| 42750.0 | -0.485 |
| 42751.0 | -0.5 |
| 42752.0 | -0.505 |
| 42753.0 | -0.499 |
| 42754.0 | -0.47 |
| 42755.0 | -0.368 |
| 42756.0 | -0.331 |
| 42757.0 | -0.237 |
| 42758.0 | 0.608 |
| 42759.0 | 0.555 |
| 42760.0 | 0.433 |
| 42761.0 | 0.351 |
| 42762.0 | 0.304 |
| 42763.0 | 0.278 |
| 42764.0 | 0.242 |
| 42765.0 | 0.214 |
| 42766.0 | 0.188 |
| 42767.0 | 0.172 |
| 42768.0 | 0.162 |
| 42769.0 | 0.152 |
| 42770.0 | 0.139 |
| 42771.0 | 0.127 |
| 42772.0 | 0.116 |
| 42773.0 | 0.107 |
| 42774.0 | 0.099 |
| 42775.0 | 0.09 |
| 42776.0 | 0.081 |
| 42777.0 | 0.072 |
| 42778.0 | 0.062 |
| 42779.0 | 0.062 |
| 42780.0 | 0.057 |
| 42781.0 | 0.045 |
| 42782.0 | 0.032 |
| 42783.0 | 0.018 |
| 42784.0 | 0.002 |
| 42785.0 | -0.015 |
| 42786.0 | -0.032 |
| 42787.0 | -0.05 |
| 42788.0 | -0.068 |
| 42789.0 | -0.084 |
| 42790.0 | -0.103 |
| 42791.0 | -0.122 |
| 42792.0 | -0.142 |
| 42793.0 | -0.162 |
| 42794.0 | -0.181 |
| 42795.0 | -0.2 |
| 42796.0 | -0.22 |
| 42797.0 | -0.243 |
| 42798.0 | -0.263 |
| 42799.0 | -0.283 |
| 42800.0 | -0.303 |
| 42801.0 | -0.32 |
| 42802.0 | -0.335 |
| 42803.0 | -0.353 |
| 42804.0 | -0.373 |
| 42805.0 | -0.392 |
| 42806.0 | -0.398 |
| 42807.0 | -0.398 |
| 42808.0 | -0.419 |
| 42809.0 | -0.444 |
| 42810.0 | -0.47 |
| 42811.0 | -0.5 |
| 42812.0 | -0.527 |
| 42813.0 | -0.553 |
| 42814.0 | -0.579 |
| 42815.0 | -0.598 |
| 42816.0 | -0.618 |
| 42817.0 | -0.638 |
| 42818.0 | -0.658 |
| 42819.0 | -0.677 |
| 42820.0 | -0.691 |
| 42821.0 | -0.684 |
| 42822.0 | -0.685 |
| 42823.0 | -0.69 |
| 42824.0 | -0.697 |
| 42825.0 | -0.706 |
| 42826.0 | -0.716 |
| 42827.0 | -0.729 |
| 42828.0 | -0.741 |
| 42829.0 | -0.748 |
| 42830.0 | -0.76 |
| 42831.0 | -0.78 |
| 42832.0 | -0.792 |
| 42833.0 | -0.801 |
| 42834.0 | -0.812 |
| 42835.0 | -0.822 |
| 42836.0 | -0.831 |
| 42837.0 | -0.82 |
| 42838.0 | -0.814 |
| 42839.0 | -0.815 |
| 42840.0 | -0.815 |
| 42841.0 | -0.817 |
| 42842.0 | -0.818 |
| 42843.0 | -0.823 |
| 42844.0 | -0.83 |
| 42845.0 | -0.834 |
| 42846.0 | -0.835 |
| 42847.0 | -0.84 |
| 42848.0 | -0.847 |
| 42849.0 | -0.853 |
| 42850.0 | -0.86 |
| 42851.0 | -0.867 |
| 42852.0 | -0.878 |
| 42853.0 | -0.89 |
| 42854.0 | -0.898 |
| 42855.0 | -0.899 |
| 42856.0 | -0.87 |
| 42857.0 | -0.863 |
| 42858.0 | -0.864 |
| 42859.0 | -0.835 |
| 42860.0 | -0.799 |
| 42861.0 | -0.784 |
| 42862.0 | -0.781 |
| 42863.0 | -0.781 |
| 42864.0 | -0.785 |
| 42865.0 | -0.788 |
| 42866.0 | -0.791 |
| 42867.0 | -0.792 |
| 42868.0 | -0.791 |
| 42869.0 | -0.793 |
| 42870.0 | -0.798 |
| 42871.0 | -0.804 |
| 42872.0 | -0.811 |
| 42873.0 | -0.823 |
| 42874.0 | -0.825 |
| 42875.0 | -0.819 |
| 42876.0 | -0.818 |
| 42877.0 | -0.825 |
| 42878.0 | -0.835 |
| 42879.0 | -0.806 |
| 42880.0 | -0.779 |
| 42881.0 | -0.778 |
| 42882.0 | -0.763 |
| 42883.0 | -0.722 |
| 42884.0 | -0.716 |
| 42885.0 | -0.72 |
| 42886.0 | -0.729 |
| 42887.0 | -0.736 |
| 42888.0 | -0.745 |
| 42889.0 | -0.756 |
| 42890.0 | -0.753 |
| 42891.0 | -0.747 |
| 42892.0 | -0.758 |
| 42893.0 | -0.768 |
| 42894.0 | -0.774 |
| 42895.0 | -0.783 |
| 42896.0 | -0.787 |
| 42897.0 | -0.79 |
| 42898.0 | -0.8 |
| 42899.0 | -0.798 |
| 42900.0 | -0.791 |
| 42901.0 | -0.788 |
| 42902.0 | -0.761 |
| 42903.0 | -0.736 |
| 42904.0 | -0.728 |
| 42905.0 | -0.718 |
| 42906.0 | -0.702 |
| 42907.0 | -0.702 |
| 42908.0 | -0.701 |
| 42909.0 | -0.69 |
| 42910.0 | -0.694 |
| 42911.0 | -0.695 |
| 42912.0 | -0.701 |
| 42913.0 | -0.713 |
| 42914.0 | -0.719 |
| 42915.0 | -0.729 |
| 42916.0 | -0.744 |
| 42917.0 | -0.76 |
| 42918.0 | -0.74 |
| 42919.0 | -0.587 |
| 42920.0 | -0.51 |
| 42921.0 | -0.487 |
| 42922.0 | -0.479 |
| 42923.0 | -0.478 |
| 42924.0 | -0.483 |
| 42925.0 | -0.494 |
| 42926.0 | -0.505 |
| 42927.0 | -0.514 |
| 42928.0 | -0.523 |
| 42929.0 | -0.533 |
| 42930.0 | -0.545 |
| 42931.0 | -0.558 |
| 42932.0 | -0.573 |
| 42933.0 | -0.587 |
| 42934.0 | -0.581 |
| 42935.0 | -0.578 |
| 42936.0 | -0.58 |
| 42937.0 | -0.555 |
| 42938.0 | -0.406 |
| 42939.0 | -0.353 |
| 42940.0 | -0.323 |
| 42941.0 | -0.297 |
| 42942.0 | -0.275 |
| 42943.0 | -0.251 |
| 42944.0 | -0.225 |
| 42945.0 | -0.211 |
| 42946.0 | -0.205 |
| 42947.0 | -0.204 |
| 42948.0 | -0.198 |
| 42949.0 | -0.179 |
| 42950.0 | -0.167 |
| 42951.0 | -0.166 |
| 42952.0 | -0.174 |
| 42953.0 | -0.182 |
| 42954.0 | -0.186 |
| 42955.0 | -0.185 |
| 42956.0 | -0.174 |
| 42957.0 | -0.143 |
| 42958.0 | -0.026 |
| 42959.0 | 0.07 |
| 42960.0 | 0.091 |
| 42961.0 | 0.095 |
| 42962.0 | 0.089 |
| 42963.0 | 0.081 |
| 42964.0 | 0.07 |
| 42965.0 | 0.076 |
| 42966.0 | 0.07 |
| 42967.0 | 0.065 |
| 42968.0 | 0.065 |
| 42969.0 | 0.065 |
| 42970.0 | 0.046 |
| 42971.0 | 0.023 |
| 42972.0 | 0.004 |
| 42973.0 | -0.013 |
| 42974.0 | -0.028 |
| 42975.0 | -0.043 |
| 42976.0 | -0.06 |
| 42977.0 | -0.08 |
| 42978.0 | -0.099 |
| 42979.0 | -0.124 |
| 42980.0 | -0.148 |
| 42981.0 | -0.173 |
| 42982.0 | -0.198 |
| 42983.0 | -0.224 |
| 42984.0 | -0.25 |
| 42985.0 | -0.27 |
| 42986.0 | -0.289 |
| 42987.0 | -0.31 |
| 42988.0 | -0.321 |
| 42989.0 | -0.32 |
| 42990.0 | -0.294 |
| 42991.0 | -0.181 |
| 42992.0 | -0.14 |
| 42993.0 | -0.115 |
| 42994.0 | -0.1 |
| 42995.0 | -0.114 |
| 42996.0 | -0.117 |
| 42997.0 | -0.071 |
| 42998.0 | -0.074 |
| 42999.0 | -0.085 |
| 43000.0 | -0.1 |
| 43001.0 | -0.115 |
| 43002.0 | -0.134 |
| 43003.0 | -0.156 |
| 43004.0 | -0.171 |
| 43005.0 | -0.191 |
| 43006.0 | -0.213 |
| 43007.0 | -0.237 |
| 43008.0 | -0.256 |
| 43009.0 | -0.277 |
| 43010.0 | -0.299 |
| 43011.0 | -0.315 |
| 43012.0 | -0.334 |
| 43013.0 | -0.341 |
| 43014.0 | -0.351 |
| 43015.0 | -0.357 |
| 43016.0 | -0.365 |
| 43017.0 | -0.378 |
| 43018.0 | -0.391 |
| 43019.0 | -0.401 |
| 43020.0 | -0.398 |
| 43021.0 | -0.408 |
| 43022.0 | -0.417 |
| 43023.0 | -0.428 |
| 43024.0 | -0.43 |
| 43025.0 | -0.436 |
| 43026.0 | -0.437 |
| 43027.0 | -0.44 |
| 43028.0 | -0.45 |
| 43029.0 | -0.463 |
| 43030.0 | -0.473 |
| 43031.0 | -0.476 |
| 43032.0 | -0.476 |
| 43033.0 | -0.481 |
| 43034.0 | -0.486 |
| 43035.0 | -0.495 |
| 43036.0 | -0.505 |
| 43037.0 | -0.517 |
| 43038.0 | -0.53 |
| 43039.0 | -0.54 |
| 43040.0 | -0.551 |
| 43041.0 | -0.546 |
| 43042.0 | -0.548 |
| 43043.0 | -0.562 |
| 43044.0 | -0.577 |
| 43045.0 | -0.587 |
| 43046.0 | -0.597 |
| 43047.0 | -0.583 |
| 43048.0 | -0.568 |
| 43049.0 | -0.558 |
| 43050.0 | -0.549 |
| 43051.0 | -0.553 |
| 43052.0 | -0.558 |
| 43053.0 | -0.565 |
| 43054.0 | -0.573 |
| 43055.0 | -0.581 |
| 43056.0 | -0.591 |
| 43057.0 | -0.601 |
| 43058.0 | -0.612 |
| 43059.0 | -0.624 |
| 43060.0 | -0.635 |
| 43061.0 | -0.646 |
| 43062.0 | -0.66 |
| 43063.0 | -0.677 |
| 43064.0 | -0.693 |
| 43065.0 | -0.695 |
| 43066.0 | -0.678 |
| 43067.0 | -0.691 |
| 43068.0 | -0.71 |
| 43069.0 | -0.729 |
| 43070.0 | -0.754 |
| 43071.0 | -0.783 |
| 43072.0 | -0.808 |
| 43073.0 | -0.84 |
| 43074.0 | -0.872 |
| 43075.0 | -0.895 |
| 43076.0 | -0.923 |
| 43077.0 | -0.946 |
| 43078.0 | -0.97 |
| 43079.0 | -0.997 |
| 43080.0 | -1.024 |
| 43081.0 | -1.041 |
| 43082.0 | -1.061 |
| 43083.0 | -1.084 |
| 43084.0 | -1.11 |
| 43085.0 | -1.137 |
| 43086.0 | -1.162 |
| 43087.0 | -1.182 |
| 43088.0 | -1.213 |
| 43089.0 | -1.238 |
| 43090.0 | -1.265 |
| 43091.0 | -1.288 |
| 43092.0 | -1.314 |
| 43093.0 | -1.343 |
| 43094.0 | -1.373 |
| 43095.0 | -1.393 |
| 43096.0 | -1.41 |
| 43097.0 | -1.431 |
| 43098.0 | -1.455 |
| 43099.0 | -1.476 |
| 43100.0 | -1.496 |
| 43101.0 | -1.511 |
| 43102.0 | -1.528 |
| 43103.0 | -1.553 |
| 43104.0 | -1.566 |
| 43105.0 | -1.552 |
| 43106.0 | -1.557 |
| 43107.0 | -1.559 |
| 43108.0 | -1.576 |
| 43109.0 | -1.608 |
| 43110.0 | -1.629 |
| 43111.0 | -1.63 |
| 43112.0 | -1.661 |
| 43113.0 | -1.716 |
| 43114.0 | -1.752 |
| 43115.0 | -1.785 |
| 43116.0 | -1.817 |
| 43117.0 | -1.846 |
| 43118.0 | -1.874 |
| 43119.0 | -1.895 |
| 43120.0 | -1.927 |
| 43121.0 | -1.952 |
| 43122.0 | -1.975 |
| 43123.0 | -2.003 |
| 43124.0 | -2.037 |
| 43125.0 | -2.074 |
| 43126.0 | -2.101 |
| 43127.0 | -2.127 |
| 43128.0 | -2.153 |
| 43129.0 | -2.179 |
| 43130.0 | -2.209 |
| 43131.0 | -2.244 |
| 43132.0 | -2.212 |
| 43133.0 | -2.033 |
| 43134.0 | -1.993 |
| 43135.0 | -1.995 |
| 43136.0 | -2.003 |
| 43137.0 | -1.999 |
| 43138.0 | -1.991 |
| 43139.0 | -1.998 |
| 43140.0 | -2.01 |
| 43141.0 | -2.016 |
| 43142.0 | -2.016 |
| 43143.0 | -2.016 |
| 43144.0 | -2.04 |
| 43145.0 | -2.082 |
| 43146.0 | -2.11 |
| 43147.0 | -2.141 |
| 43148.0 | -2.165 |
| 43149.0 | -2.193 |
| 43150.0 | -2.218 |
| 43151.0 | -2.226 |
| 43152.0 | -2.198 |
| 43153.0 | -2.125 |
| 43154.0 | -2.103 |
| 43155.0 | -2.1 |
| 43156.0 | -2.106 |
| 43157.0 | -2.093 |
| 43158.0 | -2.075 |
| 43159.0 | -2.074 |
| 43160.0 | -2.075 |
| 43161.0 | -2.072 |
| 43162.0 | -2.065 |
| 43163.0 | -2.048 |
| 43164.0 | -2.046 |
| 43165.0 | -2.05 |
| 43166.0 | -2.055 |
| 43167.0 | -2.062 |
| 43168.0 | -2.068 |
| 43169.0 | -2.078 |
| 43170.0 | -2.088 |
| 43171.0 | -2.1 |
| 43172.0 | -2.117 |
| 43173.0 | -2.134 |
| 43174.0 | -2.149 |
| 43175.0 | -2.169 |
| 43176.0 | -2.181 |
| 43177.0 | -2.197 |
| 43178.0 | -2.211 |
| 43179.0 | -2.226 |
| 43180.0 | -2.233 |
| 43181.0 | -2.2 |
| 43182.0 | -2.152 |
| 43183.0 | -2.141 |
| 43184.0 | -2.144 |
| 43185.0 | -2.145 |
| 43186.0 | -2.148 |
| 43187.0 | -2.148 |
| 43188.0 | -2.15 |
| 43189.0 | -2.156 |
| 43190.0 | -2.166 |
| 43191.0 | -2.173 |
| 43192.0 | -2.182 |
| 43193.0 | -2.19 |
| 43194.0 | -2.204 |
| 43195.0 | -2.213 |
| 43196.0 | -2.223 |
| 43197.0 | -2.226 |
| 43198.0 | -2.231 |
| 43199.0 | -2.224 |
| 43200.0 | -2.21 |
| 43201.0 | -2.197 |
| 43202.0 | -2.172 |
| 43203.0 | -2.106 |
| 43204.0 | -2.042 |
| 43205.0 | -2 |
| 43206.0 | -1.956 |
| 43207.0 | -1.912 |
| 43208.0 | -1.888 |
| 43209.0 | -1.873 |
| 43210.0 | -1.865 |
| 43211.0 | -1.857 |
| 43212.0 | -1.838 |
| 43213.0 | -1.822 |
| 43214.0 | -1.816 |
| 43215.0 | -1.812 |
| 43216.0 | -1.81 |
| 43217.0 | -1.811 |
| 43218.0 | -1.781 |
| 43219.0 | -1.731 |
| 43220.0 | -1.676 |
| 43221.0 | -1.62 |
| 43222.0 | -1.566 |
| 43223.0 | -1.533 |
| 43224.0 | -1.519 |
| 43225.0 | -1.507 |
| 43226.0 | -1.499 |
| 43227.0 | -1.494 |
| 43228.0 | -1.49 |
| 43229.0 | -1.493 |
| 43230.0 | -1.494 |
| 43231.0 | -1.497 |
| 43232.0 | -1.493 |
| 43233.0 | -1.492 |
| 43234.0 | -1.492 |
| 43235.0 | -1.488 |
| 43236.0 | -1.488 |
| 43237.0 | -1.483 |
| 43238.0 | -1.481 |
| 43239.0 | -1.482 |
| 43240.0 | -1.483 |
| 43241.0 | -1.467 |
| 43242.0 | -1.459 |
| 43243.0 | -1.445 |
| 43244.0 | -1.434 |
| 43245.0 | -1.428 |
| 43246.0 | -1.411 |
| 43247.0 | -1.37 |
| 43248.0 | -1.322 |
| 43249.0 | -1.294 |
| 43250.0 | -1.279 |
| 43251.0 | -1.268 |
| 43252.0 | -1.261 |
| 43253.0 | -1.255 |
| 43254.0 | -1.251 |
| 43255.0 | -1.246 |
| 43256.0 | -1.243 |
| 43257.0 | -1.234 |
| 43258.0 | -1.199 |
| 43259.0 | -1.117 |
| 43260.0 | -1.076 |
| 43261.0 | -1.046 |
| 43262.0 | -1.013 |
| 43263.0 | -0.985 |
| 43264.0 | -0.965 |
| 43265.0 | -0.945 |
| 43266.0 | -0.929 |
| 43267.0 | -0.914 |
| 43268.0 | -0.899 |
| 43269.0 | -0.884 |
| 43270.0 | -0.872 |
| 43271.0 | -0.858 |
| 43272.0 | -0.846 |
| 43273.0 | -0.841 |
| 43274.0 | -0.839 |
| 43275.0 | -0.836 |
| 43276.0 | -0.832 |
| 43277.0 | -0.822 |
| 43278.0 | -0.821 |
| 43279.0 | -0.753 |
| 43280.0 | -0.715 |
| 43281.0 | -0.694 |
| 43282.0 | -0.691 |
| 43283.0 | -0.662 |
| 43284.0 | -0.576 |
| 43285.0 | -0.562 |
| 43286.0 | -0.56 |
| 43287.0 | -0.561 |
| 43288.0 | -0.562 |
| 43289.0 | -0.546 |
| 43290.0 | -0.539 |
| 43291.0 | -0.484 |
| 43292.0 | -0.444 |
| 43293.0 | -0.42 |
| 43294.0 | -0.418 |
| 43295.0 | -0.419 |
| 43296.0 | -0.416 |
| 43297.0 | -0.419 |
| 43298.0 | -0.415 |
| 43299.0 | -0.421 |
| 43300.0 | -0.432 |
| 43301.0 | -0.443 |
| 43302.0 | -0.455 |
| 43303.0 | -0.461 |
| 43304.0 | -0.437 |
| 43305.0 | -0.4 |
| 43306.0 | -0.388 |
| 43307.0 | -0.386 |
| 43308.0 | -0.383 |
| 43309.0 | -0.389 |
| 43310.0 | -0.39 |
| 43311.0 | -0.376 |
| 43312.0 | -0.38 |
| 43313.0 | -0.384 |
| 43314.0 | -0.389 |
| 43315.0 | -0.395 |
| 43316.0 | -0.396 |
| 43317.0 | -0.406 |
| 43318.0 | -0.419 |
| 43319.0 | -0.433 |
| 43320.0 | -0.447 |
| 43321.0 | -0.458 |
| 43322.0 | -0.467 |
| 43323.0 | -0.475 |
| 43324.0 | -0.483 |
| 43325.0 | -0.494 |
| 43326.0 | -0.502 |
| 43327.0 | -0.505 |
| 43328.0 | -0.512 |
| 43329.0 | -0.516 |
| 43330.0 | -0.515 |
| 43331.0 | -0.52 |
| 43332.0 | -0.528 |
| 43333.0 | -0.539 |
| 43334.0 | -0.547 |
| 43335.0 | -0.55 |
| 43336.0 | -0.546 |
| 43337.0 | -0.53 |
| 43338.0 | -0.519 |
| 43339.0 | -0.521 |
| 43340.0 | -0.524 |
| 43341.0 | -0.529 |
| 43342.0 | -0.535 |
| 43343.0 | -0.541 |
| 43344.0 | -0.547 |
| 43345.0 | -0.554 |
| 43346.0 | -0.54 |
| 43347.0 | -0.523 |
| 43348.0 | -0.501 |
| 43349.0 | -0.499 |
| 43350.0 | -0.502 |
| 43351.0 | -0.51 |
| 43352.0 | -0.516 |
| 43353.0 | -0.523 |
| 43354.0 | -0.529 |
| 43355.0 | -0.537 |
| 43356.0 | -0.549 |
| 43357.0 | -0.556 |
| 43358.0 | -0.565 |
| 43359.0 | -0.577 |
| 43360.0 | -0.57 |
| 43361.0 | -0.554 |
| 43362.0 | -0.544 |
| 43363.0 | -0.542 |
| 43364.0 | -0.544 |
| 43365.0 | -0.546 |
| 43366.0 | -0.549 |
| 43367.0 | -0.542 |
| 43368.0 | -0.527 |
| 43369.0 | -0.509 |
| 43370.0 | -0.486 |
| 43371.0 | -0.47 |
| 43372.0 | -0.458 |
| 43373.0 | -0.443 |
| 43374.0 | -0.435 |
| 43375.0 | -0.435 |
| 43376.0 | -0.433 |
| 43377.0 | -0.437 |
| 43378.0 | -0.431 |
| 43379.0 | -0.432 |
| 43380.0 | -0.438 |
| 43381.0 | -0.446 |
| 43382.0 | -0.461 |
| 43383.0 | -0.484 |
| 43384.0 | -0.493 |
| 43385.0 | -0.499 |
| 43386.0 | -0.495 |
| 43387.0 | -0.47 |
| 43388.0 | -0.454 |
| 43389.0 | -0.465 |
| 43390.0 | -0.482 |
| 43391.0 | -0.502 |
| 43392.0 | -0.526 |
| 43393.0 | -0.551 |
| 43394.0 | -0.578 |
| 43395.0 | -0.605 |
| 43396.0 | -0.633 |
| 43397.0 | -0.659 |
| 43398.0 | -0.658 |
| 43399.0 | -0.635 |
| 43400.0 | -0.651 |
| 43401.0 | -0.672 |
| 43402.0 | -0.689 |
| 43403.0 | -0.629 |
| 43404.0 | -0.542 |
| 43405.0 | -0.504 |
| 43406.0 | -0.481 |
| 43407.0 | -0.474 |
| 43408.0 | -0.475 |
| 43409.0 | -0.486 |
| 43410.0 | -0.503 |
| 43411.0 | -0.526 |
| 43412.0 | -0.503 |
| 43413.0 | -0.329 |
| 43414.0 | -0.272 |
| 43415.0 | -0.228 |
| 43416.0 | -0.21 |
| 43417.0 | -0.209 |
| 43418.0 | -0.219 |
| 43419.0 | -0.238 |
| 43420.0 | -0.25 |
| 43421.0 | -0.248 |
| 43422.0 | -0.243 |
| 43423.0 | -0.193 |
| 43424.0 | 0.037 |
| 43425.0 | 0.287 |
| 43426.0 | 0.339 |
| 43427.0 | 0.343 |
| 43428.0 | 0.307 |
| 43429.0 | 0.274 |
| 43430.0 | 0.247 |
| 43431.0 | 0.218 |
| 43432.0 | 0.198 |
| 43433.0 | 0.184 |
| 43434.0 | 0.172 |
| 43435.0 | 0.156 |
| 43436.0 | 0.153 |
| 43437.0 | 0.135 |
| 43438.0 | 0.122 |
| 43439.0 | 0.182 |
| 43440.0 | 0.317 |
| 43441.0 | 0.303 |
| 43442.0 | 0.267 |
| 43443.0 | 0.236 |
| 43444.0 | 0.213 |
| 43445.0 | 0.193 |
| 43446.0 | 0.181 |
| 43447.0 | 0.163 |
| 43448.0 | 0.14 |
| 43449.0 | 0.116 |
| 43450.0 | 0.09 |
| 43451.0 | 0.06 |
| 43452.0 | 0.027 |
| 43453.0 | 0.01 |
| 43454.0 | -0.009 |
| 43455.0 | -0.027 |
| 43456.0 | -0.042 |
| 43457.0 | -0.057 |
| 43458.0 | -0.07 |
| 43459.0 | -0.082 |
| 43460.0 | -0.094 |
| 43461.0 | -0.107 |
| 43462.0 | -0.119 |
| 43463.0 | -0.131 |
| 43464.0 | -0.145 |
| 43465.0 | -0.158 |
| 43466.0 | -0.17 |
| 43467.0 | -0.185 |
| 43468.0 | -0.2 |
| 43469.0 | -0.217 |
| 43470.0 | -0.229 |
| 43471.0 | -0.225 |
| 43472.0 | -0.208 |
| 43473.0 | -0.23 |
| 43474.0 | -0.257 |
| 43475.0 | -0.286 |
| 43476.0 | -0.312 |
| 43477.0 | -0.333 |
| 43478.0 | -0.351 |
| 43479.0 | -0.362 |
| 43480.0 | -0.379 |
| 43481.0 | -0.396 |
| 43482.0 | -0.417 |
| 43483.0 | -0.437 |
| 43484.0 | -0.459 |
| 43485.0 | -0.486 |
| 43486.0 | -0.51 |
| 43487.0 | -0.536 |
| 43488.0 | -0.554 |
| 43489.0 | -0.553 |
| 43490.0 | -0.569 |
| 43491.0 | -0.587 |
| 43492.0 | -0.604 |
| 43493.0 | -0.601 |
| 43494.0 | -0.609 |
| 43495.0 | -0.627 |
| 43496.0 | -0.647 |
| 43497.0 | -0.673 |
| 43498.0 | -0.69 |
| 43499.0 | -0.711 |
| 43500.0 | -0.735 |
| 43501.0 | -0.762 |
| 43502.0 | -0.786 |
| 43503.0 | -0.811 |
| 43504.0 | -0.836 |
| 43505.0 | -0.861 |
| 43506.0 | -0.889 |
| 43507.0 | -0.913 |
| 43508.0 | -0.935 |
| 43509.0 | -0.956 |
| 43510.0 | -0.979 |
| 43511.0 | -0.997 |
| 43512.0 | -1.02 |
| 43513.0 | -1.041 |
| 43514.0 | -1.063 |
| 43515.0 | -1.082 |
| 43516.0 | -1.104 |
| 43517.0 | -1.127 |
| 43518.0 | -1.153 |
| 43519.0 | -1.176 |
| 43520.0 | -1.202 |
| 43521.0 | -1.229 |
| 43522.0 | -1.251 |
| 43523.0 | -1.266 |
| 43524.0 | -1.266 |
| 43525.0 | -1.288 |
| 43526.0 | -1.307 |
| 43527.0 | -1.327 |
| 43528.0 | -1.35 |
| 43529.0 | -1.374 |
| 43530.0 | -1.398 |
| 43531.0 | -1.424 |
| 43532.0 | -1.428 |
| 43533.0 | -1.446 |
| 43534.0 | -1.465 |
| 43535.0 | -1.492 |
| 43536.0 | -1.515 |
| 43537.0 | -1.537 |
| 43538.0 | -1.557 |
| 43539.0 | -1.582 |
| 43540.0 | -1.603 |
| 43541.0 | -1.625 |
| 43542.0 | -1.649 |
| 43543.0 | -1.674 |
| 43544.0 | -1.699 |
| 43545.0 | -1.724 |
| 43546.0 | -1.749 |
| 43547.0 | -1.776 |
| 43548.0 | -1.802 |
| 43549.0 | -1.826 |
| 43550.0 | -1.853 |
| 43551.0 | -1.879 |
| 43552.0 | -1.904 |
| 43553.0 | -1.928 |
| 43554.0 | -1.954 |
| 43555.0 | -1.977 |
| 43556.0 | -2.006 |
| 43557.0 | -2.032 |
| 43558.0 | -2.054 |
| 43559.0 | -2.078 |
| 43560.0 | -2.094 |
| 43561.0 | -2.112 |
| 43562.0 | -2.135 |
| 43563.0 | -2.161 |
| 43564.0 | -2.184 |
| 43565.0 | -2.199 |
| 43566.0 | -2.161 |
| 43567.0 | -2.137 |
| 43568.0 | -2.128 |
| 43569.0 | -2.133 |
| 43570.0 | -2.141 |
| 43571.0 | -2.152 |
| 43572.0 | -2.166 |
| 43573.0 | -2.187 |
| 43574.0 | -2.208 |
| 43575.0 | -2.231 |
| 43576.0 | -2.254 |
| 43577.0 | -2.276 |
| 43578.0 | -2.299 |
| 43579.0 | -2.322 |
| 43580.0 | -2.344 |
| 43581.0 | -2.37 |
| 43582.0 | -2.394 |
| 43583.0 | -2.413 |
| 43584.0 | -2.426 |
| 43585.0 | -2.388 |
| 43586.0 | -2.385 |
| 43587.0 | -2.399 |
| 43588.0 | -2.415 |
| 43589.0 | -2.435 |
| 43590.0 | -2.456 |
| 43591.0 | -2.477 |
| 43592.0 | -2.498 |
| 43593.0 | -2.519 |
| 43594.0 | -2.542 |
| 43595.0 | -2.564 |
| 43596.0 | -2.587 |
| 43597.0 | -2.604 |
| 43598.0 | -2.524 |
| 43599.0 | -2.454 |
| 43600.0 | -2.399 |
| 43601.0 | -2.358 |
| 43602.0 | -2.29 |
| 43603.0 | -2.272 |
| 43604.0 | -2.256 |
| 43605.0 | -2.23 |
| 43606.0 | -2.226 |
| 43607.0 | -2.23 |
| 43608.0 | -2.237 |
| 43609.0 | -2.246 |
| 43610.0 | -2.257 |
| 43611.0 | -2.267 |
| 43612.0 | -2.274 |
| 43613.0 | -2.279 |
| 43614.0 | -2.29 |
| 43615.0 | -2.294 |
| 43616.0 | -2.279 |
| 43617.0 | -2.271 |
| 43618.0 | -2.251 |
| 43619.0 | -2.226 |
| 43620.0 | -2.194 |
| 43621.0 | -2.169 |
| 43622.0 | -2.156 |
| 43623.0 | -2.111 |
| 43624.0 | -2.007 |
| 43625.0 | -1.861 |
| 43626.0 | -1.816 |
| 43627.0 | -1.785 |
| 43628.0 | -1.756 |
| 43629.0 | -1.719 |
| 43630.0 | -1.698 |
| 43631.0 | -1.683 |
| 43632.0 | -1.67 |
| 43633.0 | -1.645 |
| 43634.0 | -1.589 |
| 43635.0 | -1.549 |
| 43636.0 | -1.537 |
| 43637.0 | -1.532 |
| 43638.0 | -1.526 |
| 43639.0 | -1.522 |
| 43640.0 | -1.517 |
| 43641.0 | -1.482 |
| 43642.0 | -1.458 |
| 43643.0 | -1.451 |
| 43644.0 | -1.446 |
| 43645.0 | -1.444 |
| 43646.0 | -1.445 |
| 43647.0 | -1.448 |
| 43648.0 | -1.45 |
| 43649.0 | -1.453 |
| 43650.0 | -1.438 |
| 43651.0 | -1.428 |
| 43652.0 | -1.411 |
| 43653.0 | -1.401 |
| 43654.0 | -1.404 |
| 43655.0 | -1.401 |
| 43656.0 | -1.414 |
| 43657.0 | -1.425 |
| 43658.0 | -1.435 |
| 43659.0 | -1.449 |
| 43660.0 | -1.44 |
| 43661.0 | -1.41 |
| 43662.0 | -1.409 |
| 43663.0 | -1.415 |
| 43664.0 | -1.424 |
| 43665.0 | -1.435 |
| 43666.0 | -1.432 |
| 43667.0 | -1.372 |
| 43668.0 | -1.336 |
| 43669.0 | -1.329 |
| 43670.0 | -1.331 |
| 43671.0 | -1.338 |
| 43672.0 | -1.347 |
| 43673.0 | -1.36 |
| 43674.0 | -1.376 |
| 43675.0 | -1.393 |
| 43676.0 | -1.41 |
| 43677.0 | -1.421 |
| 43678.0 | -1.42 |
| 43679.0 | -1.408 |
| 43680.0 | -1.378 |
| 43681.0 | -1.378 |
| 43682.0 | -1.322 |
| 43683.0 | -1.301 |
| 43684.0 | -1.301 |
| 43685.0 | -1.299 |
| 43686.0 | -1.291 |
| 43687.0 | -1.279 |
| 43688.0 | -1.279 |
| 43689.0 | -1.28 |
| 43690.0 | -1.271 |
| 43691.0 | -1.246 |
| 43692.0 | -1.235 |
| 43693.0 | -1.233 |
| 43694.0 | -1.173 |
| 43695.0 | -1.112 |
| 43696.0 | -1.094 |
| 43697.0 | -1.083 |
| 43698.0 | -1.057 |
| 43699.0 | -1.04 |
| 43700.0 | -1.023 |
| 43701.0 | -0.981 |
| 43702.0 | -0.944 |
| 43703.0 | -0.913 |
| 43704.0 | -0.858 |
| 43705.0 | -0.829 |
| 43706.0 | -0.795 |
| 43707.0 | -0.763 |
| 43708.0 | -0.754 |
| 43709.0 | -0.74 |
| 43710.0 | -0.723 |
| 43711.0 | -0.715 |
| 43712.0 | -0.712 |
| 43713.0 | -0.702 |
| 43714.0 | -0.691 |
| 43715.0 | -0.676 |
| 43716.0 | -0.678 |
| 43717.0 | -0.684 |
| 43718.0 | -0.697 |
| 43719.0 | -0.706 |
| 43720.0 | -0.716 |
| 43721.0 | -0.702 |
| 43722.0 | -0.658 |
| 43723.0 | -0.657 |
| 43724.0 | -0.666 |
| 43725.0 | -0.671 |
| 43726.0 | -0.677 |
| 43727.0 | -0.687 |
| 43728.0 | -0.694 |
| 43729.0 | -0.698 |
| 43730.0 | -0.703 |
| 43731.0 | -0.712 |
| 43732.0 | -0.719 |
| 43733.0 | -0.724 |
| 43734.0 | -0.713 |
| 43735.0 | -0.648 |
| 43736.0 | -0.589 |
| 43737.0 | -0.558 |
| 43738.0 | -0.547 |
| 43739.0 | -0.529 |
| 43740.0 | -0.503 |
| 43741.0 | -0.463 |
| 43742.0 | -0.444 |
| 43743.0 | -0.396 |
| 43744.0 | -0.346 |
| 43745.0 | -0.323 |
| 43746.0 | -0.307 |
| 43747.0 | -0.291 |
| 43748.0 | -0.279 |
| 43749.0 | -0.274 |
| 43750.0 | -0.262 |
| 43751.0 | -0.261 |
| 43752.0 | -0.268 |
| 43753.0 | -0.276 |
| 43754.0 | -0.29 |
| 43755.0 | -0.306 |
| 43756.0 | -0.31 |
| 43757.0 | -0.307 |
| 43758.0 | -0.309 |
| 43759.0 | -0.316 |
| 43760.0 | -0.311 |
| 43761.0 | -0.296 |
| 43762.0 | -0.26 |
| 43763.0 | -0.203 |
| 43764.0 | -0.163 |
| 43765.0 | -0.133 |
| 43766.0 | -0.106 |
| 43767.0 | -0.091 |
| 43768.0 | -0.079 |
| 43769.0 | -0.053 |
| 43770.0 | -0.045 |
| 43771.0 | -0.047 |
| 43772.0 | -0.052 |
| 43773.0 | -0.061 |
| 43774.0 | -0.07 |
| 43775.0 | -0.066 |
| 43776.0 | -0.074 |
| 43777.0 | -0.083 |
| 43778.0 | -0.094 |
| 43779.0 | -0.074 |
| 43780.0 | -0.02 |
| 43781.0 | -0.012 |
| 43782.0 | -0.025 |
| 43783.0 | -0.036 |
| 43784.0 | -0.041 |
| 43785.0 | -0.057 |
| 43786.0 | -0.067 |
| 43787.0 | -0.077 |
| 43788.0 | -0.091 |
| 43789.0 | -0.1 |
| 43790.0 | -0.102 |
| 43791.0 | -0.118 |
| 43792.0 | -0.119 |
| 43793.0 | -0.125 |
| 43794.0 | -0.13 |
| 43795.0 | -0.137 |
| 43796.0 | -0.147 |
| 43797.0 | -0.152 |
| 43798.0 | -0.159 |
| 43799.0 | -0.167 |
| 43800.0 | -0.183 |
| 43801.0 | -0.191 |
| 43802.0 | -0.206 |
| 43803.0 | -0.214 |
| 43804.0 | -0.226 |
| 43805.0 | -0.237 |
| 43806.0 | -0.254 |
| 43807.0 | -0.269 |
| 43808.0 | -0.28 |
| 43809.0 | -0.29 |
| 43810.0 | -0.294 |
| 43811.0 | -0.301 |
| 43812.0 | -0.31 |
| 43813.0 | -0.32 |
| 43814.0 | -0.322 |
| 43815.0 | -0.31 |
| 43816.0 | -0.302 |
| 43817.0 | -0.269 |
| 43818.0 | -0.245 |
| 43819.0 | -0.175 |
| 43820.0 | 0.001 |
| 43821.0 | 0.032 |
| 43822.0 | 0.04 |
| 43823.0 | 0.041 |
| 43824.0 | 0.042 |
| 43825.0 | 0.044 |
| 43826.0 | 0.05 |
| 43827.0 | 0.055 |
| 43828.0 | 0.057 |
| 43829.0 | 0.054 |
| 43830.0 | 0.051 |
| 43831.0 | 0.045 |
| 43832.0 | 0.045 |
| 43833.0 | 0.039 |
| 43834.0 | 0.029 |
| 43835.0 | 0.026 |
| 43836.0 | 0.019 |
| 43837.0 | 0.046 |
| 43838.0 | 0.089 |
| 43839.0 | 0.093 |
| 43840.0 | 0.09 |
| 43841.0 | 0.084 |
| 43842.0 | 0.077 |
| 43843.0 | 0.069 |
| 43844.0 | 0.059 |
| 43845.0 | 0.05 |
| 43846.0 | 0.037 |
| 43847.0 | 0.026 |
| 43848.0 | 0.013 |
| 43849.0 | 0 |
| 43850.0 | -0.011 |
| 43851.0 | -0.022 |
| 43852.0 | -0.033 |
| 43853.0 | -0.047 |
| 43854.0 | -0.061 |
| 43855.0 | -0.083 |
| 43856.0 | -0.098 |
| 43857.0 | -0.114 |
| 43858.0 | -0.13 |
| 43859.0 | -0.145 |
| 43860.0 | -0.159 |
| 43861.0 | -0.177 |
| 43862.0 | -0.186 |
| 43863.0 | -0.203 |
| 43864.0 | -0.204 |
| 43865.0 | -0.143 |
| 43866.0 | 0.074 |
| 43867.0 | 0.097 |
| 43868.0 | 0.089 |
| 43869.0 | 0.081 |
| 43870.0 | 0.082 |
| 43871.0 | 0.071 |
| 43872.0 | 0.059 |
| 43873.0 | 0.047 |
| 43874.0 | 0.034 |
| 43875.0 | 0.022 |
| 43876.0 | 0.01 |
| 43877.0 | -0.003 |
| 43878.0 | -0.02 |
| 43879.0 | -0.031 |
| 43880.0 | -0.046 |
| 43881.0 | -0.059 |
| 43882.0 | -0.074 |
| 43883.0 | -0.086 |
| 43884.0 | -0.101 |
| 43885.0 | -0.115 |
| 43886.0 | -0.131 |
| 43887.0 | -0.148 |
| 43888.0 | -0.169 |
| 43889.0 | -0.192 |
| 43890.0 | -0.212 |
| 43891.0 | -0.229 |
| 43892.0 | -0.25 |
| 43893.0 | -0.272 |
| 43894.0 | -0.294 |
| 43895.0 | -0.313 |
| 43896.0 | -0.334 |
| 43897.0 | -0.352 |
| 43898.0 | -0.365 |
| 43899.0 | -0.381 |
| 43900.0 | -0.388 |
| 43901.0 | -0.39 |
| 43902.0 | -0.402 |
| 43903.0 | -0.414 |
| 43904.0 | -0.428 |
| 43905.0 | -0.443 |
| 43906.0 | -0.459 |
| 43907.0 | -0.474 |
| 43908.0 | -0.491 |
| 43909.0 | -0.509 |
| 43910.0 | -0.529 |
| 43911.0 | -0.542 |
| 43912.0 | -0.562 |
| 43913.0 | -0.576 |
| 43914.0 | -0.562 |
| 43915.0 | -0.505 |
| 43916.0 | -0.477 |
| 43917.0 | -0.468 |
| 43918.0 | -0.466 |
| 43919.0 | -0.471 |
| 43920.0 | -0.48 |
| 43921.0 | -0.492 |
| 43922.0 | -0.504 |
| 43923.0 | -0.516 |
| 43924.0 | -0.528 |
| 43925.0 | -0.54 |
| 43926.0 | -0.554 |
| 43927.0 | -0.567 |
| 43928.0 | -0.58 |
| 43929.0 | -0.591 |
| 43930.0 | -0.599 |
| 43931.0 | -0.607 |
| 43932.0 | -0.615 |
| 43933.0 | -0.626 |
| 43934.0 | -0.626 |
| 43935.0 | -0.618 |
| 43936.0 | -0.607 |
| 43937.0 | -0.592 |
| 43938.0 | -0.549 |
| 43939.0 | -0.525 |
| 43940.0 | -0.517 |
| 43941.0 | -0.515 |
| 43942.0 | -0.515 |
| 43943.0 | -0.514 |
| 43944.0 | -0.515 |
| 43945.0 | -0.517 |
| 43946.0 | -0.518 |
| 43947.0 | -0.526 |
| 43948.0 | -0.53 |
| 43949.0 | -0.53 |
| 43950.0 | -0.533 |
| 43951.0 | -0.539 |
| 43952.0 | -0.544 |
| 43953.0 | -0.549 |
| 43954.0 | -0.554 |
| 43955.0 | -0.559 |
| 43956.0 | -0.556 |
| 43957.0 | -0.545 |
| 43958.0 | -0.545 |
| 43959.0 | -0.547 |
| 43960.0 | -0.547 |
| 43961.0 | -0.55 |
| 43962.0 | -0.555 |
| 43963.0 | -0.566 |
| 43964.0 | -0.577 |
| 43965.0 | -0.59 |
| 43966.0 | -0.603 |
| 43967.0 | -0.612 |
| 43968.0 | -0.618 |
| 43969.0 | -0.628 |
| 43970.0 | -0.641 |
| 43971.0 | -0.655 |
| 43972.0 | -0.673 |
| 43973.0 | -0.694 |
| 43974.0 | -0.711 |
| 43975.0 | -0.729 |
| 43976.0 | -0.746 |
| 43977.0 | -0.765 |
| 43978.0 | -0.78 |
| 43979.0 | -0.8 |
| 43980.0 | -0.821 |
| 43981.0 | -0.842 |
| 43982.0 | -0.862 |
| 43983.0 | -0.884 |
| 43984.0 | -0.905 |
| 43985.0 | -0.926 |
| 43986.0 | -0.948 |
| 43987.0 | -0.963 |
| 43988.0 | -0.976 |
| 43989.0 | -0.994 |
| 43990.0 | -1.013 |
| 43991.0 | -1.03 |
| 43992.0 | -1.042 |
| 43993.0 | -1.055 |
| 43994.0 | -1.061 |
| 43995.0 | -1.069 |
| 43996.0 | -1.083 |
| 43997.0 | -1.098 |
| 43998.0 | -1.117 |
| 43999.0 | -1.134 |
| 44000.0 | -1.131 |
| 44001.0 | -1.131 |
| 44002.0 | -1.142 |
| 44003.0 | -1.164 |
| 44004.0 | -1.183 |
| 44005.0 | -1.2 |
| 44006.0 | -1.217 |
| 44007.0 | -1.231 |
| 44008.0 | -1.245 |
| 44009.0 | -1.261 |
| 44010.0 | -1.275 |
| 44011.0 | -1.252 |
| 44012.0 | -1.165 |
| 44013.0 | -1.051 |
| 44014.0 | -0.983 |
| 44015.0 | -0.94 |
| 44016.0 | -0.922 |
| 44017.0 | -0.908 |
| 44018.0 | -0.885 |
| 44019.0 | -0.678 |
| 44020.0 | -0.484 |
| 44021.0 | -0.441 |
| 44022.0 | -0.398 |
| 44023.0 | -0.373 |
| 44024.0 | -0.359 |
| 44025.0 | -0.315 |
| 44026.0 | -0.292 |
| 44027.0 | -0.28 |
| 44028.0 | -0.279 |
| 44029.0 | -0.29 |
| 44030.0 | -0.305 |
| 44031.0 | -0.32 |
| 44032.0 | -0.337 |
| 44033.0 | -0.349 |
| 44034.0 | -0.334 |
| 44035.0 | -0.321 |
| 44036.0 | -0.323 |
| 44037.0 | -0.34 |
| 44038.0 | -0.357 |
| 44039.0 | -0.376 |
| 44040.0 | -0.397 |
| 44041.0 | -0.418 |
| 44042.0 | -0.437 |
| 44043.0 | -0.445 |
| 44044.0 | -0.452 |
| 44045.0 | -0.462 |
| 44046.0 | -0.475 |
| 44047.0 | -0.493 |
| 44048.0 | -0.514 |
| 44049.0 | -0.536 |
| 44050.0 | -0.56 |
| 44051.0 | -0.579 |
| 44052.0 | -0.602 |
| 44053.0 | -0.625 |
| 44054.0 | -0.65 |
| 44055.0 | -0.676 |
| 44056.0 | -0.699 |
| 44057.0 | -0.715 |
| 44058.0 | -0.734 |
| 44059.0 | -0.753 |
| 44060.0 | -0.775 |
| 44061.0 | -0.794 |
| 44062.0 | -0.81 |
| 44063.0 | -0.823 |
| 44064.0 | -0.832 |
| 44065.0 | -0.842 |
| 44066.0 | -0.854 |
| 44067.0 | -0.87 |
| 44068.0 | -0.874 |
| 44069.0 | -0.857 |
| 44070.0 | -0.855 |
| 44071.0 | -0.854 |
| 44072.0 | -0.856 |
| 44073.0 | -0.853 |
| 44074.0 | -0.864 |
| 44075.0 | -0.852 |
| 44076.0 | -0.852 |
| 44077.0 | -0.855 |
| 44078.0 | -0.852 |
| 44079.0 | -0.839 |
| 44080.0 | -0.831 |
| 44081.0 | -0.826 |
| 44082.0 | -0.819 |
| 44083.0 | -0.824 |
| 44084.0 | -0.803 |
| 44085.0 | -0.747 |
| 44086.0 | -0.803 |
| 44087.0 | -0.712 |
| 44088.0 | -0.708 |
| 44089.0 | -0.705 |
| 44090.0 | -0.707 |
| 44091.0 | -0.705 |
| 44092.0 | -0.687 |
| 44093.0 | -0.657 |
| 44094.0 | -0.634 |
| 44095.0 | -0.626 |
| 44096.0 | -0.627 |
| 44097.0 | -0.628 |
| 44098.0 | -0.643 |
| 44099.0 | -0.803 |
| 44100.0 | -0.803 |
| 44101.0 | -0.696 |
| 44102.0 | -0.701 |
| 44103.0 | -0.707 |
| 44104.0 | -0.711 |
| 44105.0 | -0.707 |
| 44106.0 | -0.675 |
| 44107.0 | -0.629 |
| 44108.0 | -0.584 |
| 44109.0 | -0.575 |
| 44110.0 | -0.565 |
| 44111.0 | -0.537 |
| 44112.0 | -0.522 |
| 44113.0 | -0.516 |
| 44114.0 | -0.519 |
| 44115.0 | -0.535 |
| 44116.0 | -0.552 |
| 44117.0 | -0.567 |
| 44118.0 | -0.571 |
| 44119.0 | -0.574 |
| 44120.0 | -0.587 |
| 44121.0 | -0.599 |
| 44122.0 | -0.616 |
| 44123.0 | -0.625 |
| 44124.0 | -0.614 |
| 44125.0 | -0.612 |
| 44126.0 | -0.618 |
| 44127.0 | -0.628 |
| 44128.0 | -0.649 |
| 44129.0 | -0.677 |
| 44130.0 | -0.664 |
| 44131.0 | -0.64 |
| 44132.0 | -0.655 |
| 44133.0 | -0.672 |
| 44134.0 | -0.694 |
| 44135.0 | -0.714 |
| 44136.0 | -0.721 |
| 44137.0 | -0.732 |
| 44138.0 | -0.751 |
| 44139.0 | -0.777 |
| 44140.0 | -0.797 |
| 44141.0 | -0.783 |
| 44142.0 | -0.792 |
| 44143.0 | -0.809 |
| 44144.0 | -0.823 |
| 44145.0 | -0.842 |
| 44146.0 | -0.87 |
| 44147.0 | -0.892 |
| 44148.0 | -0.905 |
| 44149.0 | -0.917 |
| 44150.0 | -0.924 |
| 44151.0 | -0.926 |
| 44152.0 | -0.93 |
| 44153.0 | -0.936 |
| 44154.0 | -0.944 |
| 44155.0 | -0.952 |
| 44156.0 | -0.979 |
| 44157.0 | -0.998 |
| 44158.0 | -1.01 |
| 44159.0 | -1.029 |
| 44160.0 | -1.055 |
| 44161.0 | -1.088 |
| 44162.0 | -1.107 |
| 44163.0 | -1.108 |
| 44164.0 | -1.127 |
| 44165.0 | -1.125 |
| 44166.0 | -1.108 |
| 44167.0 | -1.124 |
| 44168.0 | -1.145 |
| 44169.0 | -1.166 |
| 44170.0 | -1.185 |
| 44171.0 | -1.193 |
| 44172.0 | -1.215 |
| 44173.0 | -1.239 |
| 44174.0 | -1.263 |
| 44175.0 | -1.284 |
| 44176.0 | -1.283 |
| 44177.0 | -1.259 |
| 44178.0 | -1.27 |
| 44179.0 | -1.292 |
| 44180.0 | -1.314 |
| 44181.0 | -1.339 |
| 44182.0 | -1.365 |
| 44183.0 | -1.39 |
| 44184.0 | -1.414 |
| 44185.0 | -1.435 |
| 44186.0 | -1.458 |
| 44187.0 | -1.485 |
| 44188.0 | -1.505 |
| 44189.0 | -1.516 |
| 44190.0 | -1.519 |
| 44191.0 | -1.522 |
| 44192.0 | -1.527 |
| 44193.0 | -1.545 |
| 44194.0 | -1.565 |
| 44195.0 | -1.585 |
| 44196.0 | -1.595 |
| 44197.0 | -1.591 |
| 44198.0 | -1.509 |
| 44199.0 | -1.304 |
| 44200.0 | -1.214 |
| 44201.0 | -1.143 |
| 44202.0 | -0.977 |
| 44203.0 | -0.93 |
| 44204.0 | -0.907 |
| 44205.0 | -0.898 |
| 44206.0 | -0.9 |
| 44207.0 | -0.911 |
| 44208.0 | -0.924 |
| 44209.0 | -0.941 |
| 44210.0 | -0.959 |
| 44211.0 | -0.98 |
| 44212.0 | -1.005 |
| 44213.0 | -1.035 |
| 44214.0 | -1.038 |
| 44215.0 | -1.044 |
| 44216.0 | -1.055 |
| 44217.0 | -0.909 |
| 44218.0 | -0.682 |
| 44219.0 | -0.669 |
| 44220.0 | -0.673 |
| 44221.0 | -0.681 |
| 44222.0 | -0.699 |
| 44223.0 | -0.724 |
| 44224.0 | -0.744 |
| 44225.0 | -0.755 |
| 44226.0 | -0.756 |
| 44227.0 | -0.762 |
| 44228.0 | -0.779 |
| 44229.0 | -0.794 |
| 44230.0 | -0.808 |
| 44231.0 | -0.821 |
| 44232.0 | -0.844 |
| 44233.0 | -0.874 |
| 44234.0 | -0.9 |
| 44235.0 | -0.909 |
| 44236.0 | -0.918 |
| 44237.0 | -0.917 |
| 44238.0 | -0.937 |
| 44239.0 | -0.96 |
| 44240.0 | -0.979 |
| 44241.0 | -1 |
| 44242.0 | -1.02 |
| 44243.0 | -1.033 |
| 44244.0 | -1.051 |
| 44245.0 | -1.069 |
| 44246.0 | -1.086 |
| 44247.0 | -1.105 |
| 44248.0 | -1.125 |
| 44249.0 | -1.145 |
| 44250.0 | -1.165 |
| 44251.0 | -1.206 |
| 44252.0 | -1.212 |
| 44253.0 | -1.236 |
| 44254.0 | -1.258 |
| 44255.0 | -1.281 |
| 44256.0 | -1.305 |
| 44257.0 | -1.33 |
| 44258.0 | -1.358 |
| 44259.0 | -1.385 |
| 44260.0 | -1.41 |
| 44261.0 | -1.435 |
| 44262.0 | -1.463 |
| 44263.0 | -1.481 |
| 44264.0 | -1.502 |
| 44265.0 | -1.522 |
| 44266.0 | -1.537 |
| 44267.0 | -1.555 |
| 44268.0 | -1.572 |
| 44269.0 | -1.592 |
| 44270.0 | -1.612 |
| 44271.0 | -1.631 |
| 44272.0 | -1.65 |
| 44273.0 | -1.672 |
| 44274.0 | -1.693 |
| 44275.0 | -1.715 |
| 44276.0 | -1.736 |
| 44277.0 | -1.758 |
| 44278.0 | -1.78 |
| 44279.0 | -1.805 |
| 44280.0 | -1.829 |
| 44281.0 | -1.85 |
| 44282.0 | -1.867 |
| 44283.0 | -1.885 |
| 44284.0 | -1.902 |
| 44285.0 | -1.917 |
| 44286.0 | -1.932 |
| 44287.0 | -1.952 |
| 44288.0 | -1.963 |
| 44289.0 | -1.963 |
| 44290.0 | -1.988 |
| 44291.0 | -1.991 |
| 44292.0 | -2.012 |
| 44293.0 | -2.038 |
| 44294.0 | -2.057 |
| 44295.0 | -2.075 |
| 44296.0 | -2.082 |
| 44297.0 | -2.082 |
| 44298.0 | -2.082 |
| 44299.0 | -2.104 |
| 44300.0 | -2.127 |
| 44301.0 | -2.123 |
| 44302.0 | -2.137 |
| 44303.0 | -2.149 |
| 44304.0 | -2.164 |
| 44305.0 | -2.179 |
| 44306.0 | -2.192 |
| 44307.0 | -2.208 |
| 44308.0 | -2.223 |
| 44309.0 | -2.239 |
| 44310.0 | -2.254 |
| 44311.0 | -2.27 |
| 44312.0 | -2.285 |
| 44313.0 | -2.294 |
| 44314.0 | -2.328 |
| 44315.0 | -2.368 |
| 44316.0 | -2.401 |
| 44317.0 | -2.421 |
| 44318.0 | -2.436 |
| 44319.0 | -2.444 |
| 44320.0 | -2.459 |
| 44321.0 | -2.49 |
| 44322.0 | -2.498 |
| 44323.0 | -2.515 |
| 44324.0 | -2.532 |
| 44325.0 | -2.547 |
| 44326.0 | -2.56 |
| 44327.0 | -2.572 |
| 44328.0 | -2.554 |
| 44329.0 | -2.55 |
| 44330.0 | -2.554 |
| 44331.0 | -2.565 |
| 44332.0 | -2.565 |
| 44333.0 | -2.574 |
| 44334.0 | -2.583 |
| 44335.0 | -2.582 |
| 44336.0 | -2.556 |
| 44337.0 | -2.55 |
| 44338.0 | -2.544 |
| 44339.0 | -2.548 |
| 44340.0 | -2.55 |
| 44341.0 | -2.549 |
| 44342.0 | -2.558 |
| 44343.0 | -2.568 |
| 44344.0 | -2.575 |
| 44345.0 | -2.578 |
| 44346.0 | -2.575 |
| 44347.0 | -2.561 |
| 44348.0 | -2.533 |
| 44349.0 | -2.519 |
| 44350.0 | -2.532 |
| 44351.0 | -2.533 |
| 44352.0 | -2.533 |
| 44353.0 | -2.548 |
| 44354.0 | -2.557 |
| 44355.0 | -2.568 |
| 44356.0 | -2.581 |
| 44357.0 | -2.602 |
| 44358.0 | -2.625 |
| 44359.0 | -2.649 |
| 44360.0 | -2.669 |
| 44361.0 | -2.674 |
| 44362.0 | -2.683 |
| 44363.0 | -2.704 |
| 44364.0 | -2.708 |
| 44365.0 | -2.684 |
| 44366.0 | -2.69 |
| 44367.0 | -2.704 |
| 44368.0 | -2.717 |
| 44369.0 | -2.727 |
| 44370.0 | -2.715 |
| 44371.0 | -2.701 |
| 44372.0 | -2.688 |
| 44373.0 | -2.616 |
| 44374.0 | -2.549 |
| 44375.0 | -2.515 |
| 44376.0 | -2.483 |
| 44377.0 | -2.451 |
| 44378.0 | -2.378 |
| 44379.0 | -2.324 |
| 44380.0 | -2.3 |
| 44381.0 | -2.287 |
| 44382.0 | -2.279 |
| 44383.0 | -2.245 |
| 44384.0 | -2.035 |
| 44385.0 | -1.921 |
| 44386.0 | -1.891 |
| 44387.0 | -1.87 |
| 44388.0 | -1.858 |
| 44389.0 | -1.861 |
| 44390.0 | -1.869 |
| 44391.0 | -1.879 |
| 44392.0 | -1.887 |
| 44393.0 | -1.859 |
| 44394.0 | -1.764 |
| 44395.0 | -1.635 |
| 44396.0 | -1.545 |
| 44397.0 | -1.518 |
| 44398.0 | -1.504 |
| 44399.0 | -1.489 |
| 44400.0 | -1.452 |
| 44401.0 | -1.442 |
| 44402.0 | -1.439 |
| 44403.0 | -1.447 |
| 44404.0 | -1.438 |
| 44405.0 | -1.432 |
| 44406.0 | -1.433 |
| 44407.0 | -1.442 |
| 44408.0 | -1.453 |
| 44409.0 | -1.46 |
| 44410.0 | -1.465 |
| 44411.0 | -1.444 |
| 44412.0 | -1.418 |
| 44413.0 | -1.422 |
| 44414.0 | -1.43 |
| 44415.0 | -1.437 |
| 44416.0 | -1.439 |
| 44417.0 | -1.448 |
| 44418.0 | -1.457 |
| 44419.0 | -1.441 |
| 44420.0 | -1.423 |
| 44421.0 | -1.381 |
| 44422.0 | -1.348 |
| 44423.0 | -1.336 |
| 44424.0 | -1.334 |
| 44425.0 | -1.319 |
| 44426.0 | -1.308 |
| 44427.0 | -1.291 |
| 44428.0 | -1.271 |
| 44429.0 | -1.253 |
| 44430.0 | -1.246 |
| 44431.0 | -1.235 |
| 44432.0 | -1.226 |
| 44433.0 | -1.204 |
| 44434.0 | -1.187 |
| 44435.0 | -1.174 |
| 44436.0 | -1.17 |
| 44437.0 | -1.166 |
| 44438.0 | -1.16 |
| 44439.0 | -1.162 |
| 44440.0 | -1.166 |
| 44441.0 | -1.169 |
| 44442.0 | -1.168 |
| 44443.0 | -1.175 |
| 44444.0 | -1.178 |
| 44445.0 | -1.18 |
| 44446.0 | -1.187 |
| 44447.0 | -1.19 |
| 44448.0 | -1.206 |
| 44449.0 | -1.219 |
| 44450.0 | -1.193 |
| 44451.0 | -1.184 |
| 44452.0 | -1.139 |
| 44453.0 | -1.107 |
| 44454.0 | -1.091 |
| 44455.0 | -1.079 |
| 44456.0 | -1.087 |
| 44457.0 | -1.088 |
| 44458.0 | -1.097 |
| 44459.0 | -1.108 |
| 44460.0 | -1.124 |
| 44461.0 | -1.134 |
| 44462.0 | -1.149 |
| 44463.0 | -1.166 |
| 44464.0 | -1.186 |
| 44465.0 | -1.186 |
| 44466.0 | -1.199 |
| 44467.0 | -1.215 |
| 44468.0 | -1.228 |
| 44469.0 | -1.226 |
| 44470.0 | -1.221 |
| 44471.0 | -1.213 |
| 44472.0 | -1.212 |
| 44473.0 | -1.208 |
| 44474.0 | -1.212 |
| 44475.0 | -1.218 |
| 44476.0 | -1.223 |
| 44477.0 | -1.233 |
| 44478.0 | -1.23 |
| 44479.0 | -1.205 |
| 44480.0 | -1.198 |
| 44481.0 | -1.159 |
| 44482.0 | -1.103 |
| 44483.0 | -1.037 |
| 44484.0 | -0.967 |
| 44485.0 | -0.893 |
| 44486.0 | -0.849 |
| 44487.0 | -0.816 |
| 44488.0 | -0.787 |
| 44489.0 | -0.753 |
| 44490.0 | -0.737 |
| 44491.0 | -0.729 |
| 44492.0 | -0.728 |
| 44493.0 | -0.725 |
| 44494.0 | -0.72 |
| 44495.0 | -0.701 |
| 44496.0 | -0.692 |
| 44497.0 | -0.69 |
| 44498.0 | -0.728 |
| 44499.0 | -0.738 |
| 44500.0 | -0.76 |
| 44501.0 | -0.777 |
| 44502.0 | -0.776 |
| 44503.0 | -0.767 |
| 44504.0 | -0.768 |
| 44505.0 | -0.78 |
| 44506.0 | -0.802 |
| 44507.0 | -0.822 |
| 44508.0 | -0.837 |
| 44509.0 | -0.847 |
| 44510.0 | -0.853 |
| 44511.0 | -0.857 |
| 44512.0 | -0.869 |
| 44513.0 | -0.87 |
| 44514.0 | -0.86 |
| 44515.0 | -0.852 |
| 44516.0 | -0.861 |
| 44517.0 | -0.868 |
| 44518.0 | -0.87 |
| 44519.0 | -0.88 |
| 44520.0 | -0.891 |
| 44521.0 | -0.9 |
| 44522.0 | -0.881 |
| 44523.0 | -0.848 |
| 44524.0 | -0.847 |
| 44525.0 | -0.861 |
| 44526.0 | -0.873 |
| 44527.0 | -0.868 |
| 44528.0 | -0.869 |
| 44529.0 | -0.876 |
| 44530.0 | -0.884 |
| 44531.0 | -0.89 |
| 44532.0 | -0.902 |
| 44533.0 | -0.907 |
| 44534.0 | -0.91 |
| 44535.0 | -0.912 |
| 44536.0 | -0.877 |
| 44537.0 | -0.869 |
| 44538.0 | -0.876 |
| 44539.0 | -0.904 |
| 44540.0 | -0.887 |
| 44541.0 | -0.894 |
| 44542.0 | -0.896 |
| 44543.0 | -0.906 |
| 44544.0 | -0.914 |
| 44545.0 | -0.926 |
| 44546.0 | -0.921 |
| 44547.0 | -0.934 |
| 44548.0 | -0.901 |
| 44549.0 | -0.907 |
| 44550.0 | -0.923 |
| 44551.0 | -0.927 |
| 44552.0 | -0.945 |
| 44553.0 | -0.948 |
| 44554.0 | -0.962 |
| 44555.0 | -0.971 |
| 44556.0 | -0.984 |
| 44557.0 | -0.995 |
| 44558.0 | -0.996 |
| 44559.0 | -1.002 |
| 44560.0 | -1.011 |
| 44561.0 | -1.021 |
| 44562.0 | -1.028 |
| 44563.0 | -1.04 |
| 44564.0 | -1.051 |
| 44565.0 | -1.064 |
| 44566.0 | -1.074 |
| 44567.0 | -1.087 |
| 44568.0 | -1.1 |
| 44569.0 | -1.128 |
| 44570.0 | -1.146 |
| 44571.0 | -1.15 |
| 44572.0 | -1.165 |
| 44573.0 | -1.182 |
| 44574.0 | -1.194 |
| 44575.0 | -1.211 |
| 44576.0 | -1.235 |
| 44577.0 | -1.259 |
| 44578.0 | -1.286 |
| 44579.0 | -1.313 |
| 44580.0 | -1.33 |
| 44581.0 | -1.324 |
| 44582.0 | -1.33 |
| 44583.0 | -1.335 |
| 44584.0 | -1.35 |
| 44585.0 | -1.37 |
| 44586.0 | -1.394 |
| 44587.0 | -1.42 |
| 44588.0 | -1.439 |
| 44589.0 | -1.455 |
| 44590.0 | -1.477 |
| 44591.0 | -1.5 |
| 44592.0 | -1.519 |
| 44593.0 | -1.538 |
| 44594.0 | -1.552 |
| 44595.0 | -1.572 |
| 44596.0 | -1.55 |
| 44597.0 | -1.489 |
| 44598.0 | -1.475 |
| 44599.0 | -1.481 |
| 44600.0 | -1.49 |
| 44601.0 | -1.499 |
| 44602.0 | -1.511 |
| 44603.0 | -1.522 |
| 44604.0 | -1.543 |
| 44605.0 | -1.558 |
| 44606.0 | -1.568 |
| 44607.0 | -1.581 |
| 44608.0 | -1.59 |
| 44609.0 | -1.608 |
| 44610.0 | -1.634 |
| 44611.0 | -1.655 |
| 44612.0 | -1.658 |
| 44613.0 | -1.666 |
| 44614.0 | -1.683 |
| 44615.0 | -1.691 |
| 44616.0 | -1.708 |
| 44617.0 | -1.73 |
| 44618.0 | -1.757 |
| 44619.0 | -1.782 |
| 44620.0 | -1.808 |
| 44621.0 | -1.835 |
| 44622.0 | -1.858 |
| 44623.0 | -1.881 |
| 44624.0 | -1.902 |
| 44625.0 | -1.929 |
| 44626.0 | -1.959 |
| 44627.0 | -1.975 |
| 44628.0 | -2.002 |
| 44629.0 | -2.029 |
| 44630.0 | -2.047 |
| 44631.0 | -2.062 |
| 44632.0 | -2.092 |
| 44633.0 | -2.112 |
| 44634.0 | -2.134 |
| 44635.0 | -2.151 |
| 44636.0 | -2.173 |
| 44637.0 | -2.196 |
| 44638.0 | -2.219 |
| 44639.0 | -2.242 |
| 44640.0 | -2.263 |
| 44641.0 | -2.287 |
| 44642.0 | -2.307 |
| 44643.0 | -2.332 |
| 44644.0 | -2.356 |
| 44645.0 | -2.378 |
| 44646.0 | -2.4 |
| 44647.0 | -2.423 |
| 44648.0 | -2.455 |
| 44649.0 | -2.492 |
| 44650.0 | -2.523 |
| 44651.0 | -2.55 |
| 44652.0 | -2.57 |
| 44653.0 | -2.593 |
| 44654.0 | -2.618 |
| 44655.0 | -2.642 |
| 44656.0 | -2.664 |
| 44657.0 | -2.69 |
| 44658.0 | -2.706 |
| 44659.0 | -2.732 |
| 44660.0 | -2.753 |
| 44661.0 | -2.773 |
| 44662.0 | -2.797 |
| 44663.0 | -2.814 |
| 44664.0 | -2.833 |
| 44665.0 | -2.852 |
| 44666.0 | -2.873 |
| 44667.0 | -2.894 |
| 44668.0 | -2.912 |
| 44669.0 | -2.935 |
| 44670.0 | -2.956 |
| 44671.0 | -2.977 |
| 44672.0 | -2.993 |
| 44673.0 | -2.991 |
| 44674.0 | -2.974 |
| 44675.0 | -2.97 |
| 44676.0 | -2.939 |